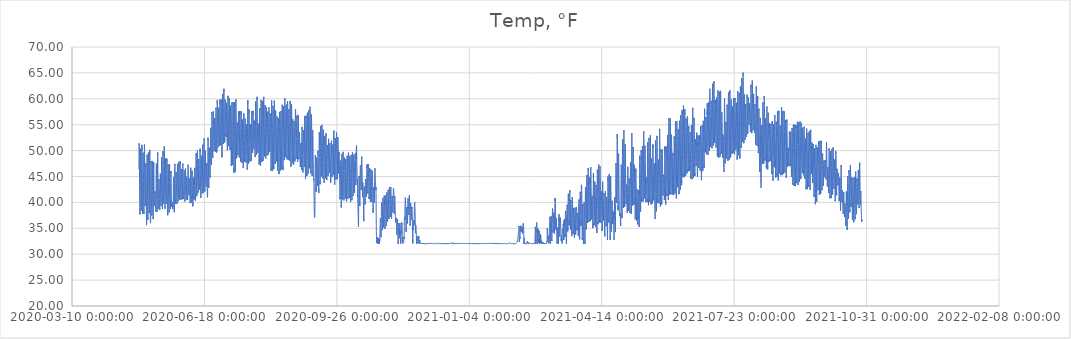
| Category | Temp, °F |
|---|---|
| 43950.578310185185 | 46.377 |
| 43950.619976851856 | 48.52 |
| 43950.66164351852 | 50.161 |
| 43950.703310185185 | 51.165 |
| 43950.744976851856 | 51.397 |
| 43950.78664351852 | 51.069 |
| 43950.828310185185 | 50.354 |
| 43950.869976851856 | 49.37 |
| 43950.91164351852 | 48.115 |
| 43950.953310185185 | 46.513 |
| 43950.994976851856 | 44.91 |
| 43951.03664351852 | 43.482 |
| 43951.078310185185 | 42.13 |
| 43951.119976851856 | 40.875 |
| 43951.16164351852 | 39.814 |
| 43951.203310185185 | 39.003 |
| 43951.244976851856 | 38.346 |
| 43951.28664351852 | 37.941 |
| 43951.328310185185 | 37.709 |
| 43951.369976851856 | 38.192 |
| 43951.41164351852 | 39.003 |
| 43951.453310185185 | 40.509 |
| 43951.494976851856 | 42.574 |
| 43951.53664351852 | 44.601 |
| 43951.578310185185 | 46.918 |
| 43951.619976851856 | 47.883 |
| 43951.66164351852 | 48.906 |
| 43951.703310185185 | 50.045 |
| 43951.744976851856 | 50.354 |
| 43951.78664351852 | 49.852 |
| 43951.828310185185 | 49.003 |
| 43951.869976851856 | 48.096 |
| 43951.91164351852 | 46.918 |
| 43951.953310185185 | 45.431 |
| 43951.994976851856 | 44.234 |
| 43952.03664351852 | 43.192 |
| 43952.078310185185 | 42.111 |
| 43952.119976851856 | 41.088 |
| 43952.16164351852 | 40.277 |
| 43952.203310185185 | 39.505 |
| 43952.244976851856 | 38.906 |
| 43952.28664351852 | 38.424 |
| 43952.328310185185 | 38.385 |
| 43952.369976851856 | 38.752 |
| 43952.41164351852 | 39.717 |
| 43952.453310185185 | 41.281 |
| 43952.494976851856 | 43.134 |
| 43952.53664351852 | 44.331 |
| 43952.578310185185 | 46.59 |
| 43952.619976851856 | 47.787 |
| 43952.66164351852 | 49.061 |
| 43952.703310185185 | 50.451 |
| 43952.744976851856 | 51.107 |
| 43952.78664351852 | 51.088 |
| 43952.828310185185 | 50.103 |
| 43952.869976851856 | 48.327 |
| 43952.91164351852 | 46.686 |
| 43952.953310185185 | 45.18 |
| 43952.994976851856 | 43.848 |
| 43953.03664351852 | 42.632 |
| 43953.078310185185 | 41.397 |
| 43953.119976851856 | 40.335 |
| 43953.16164351852 | 39.466 |
| 43953.203310185185 | 38.752 |
| 43953.244976851856 | 38.134 |
| 43953.28664351852 | 37.806 |
| 43953.328310185185 | 37.825 |
| 43953.369976851856 | 38.038 |
| 43953.41164351852 | 38.926 |
| 43953.453310185185 | 39.987 |
| 43953.494976851856 | 42.227 |
| 43953.53664351852 | 44.37 |
| 43953.578310185185 | 46.339 |
| 43953.619976851856 | 48.482 |
| 43953.66164351852 | 49.601 |
| 43953.703310185185 | 49.601 |
| 43953.744976851856 | 49.331 |
| 43953.78664351852 | 48.752 |
| 43953.828310185185 | 47.613 |
| 43953.869976851856 | 46.609 |
| 43953.91164351852 | 45.277 |
| 43953.953310185185 | 44.022 |
| 43953.994976851856 | 42.787 |
| 43954.03664351852 | 41.628 |
| 43954.078310185185 | 40.721 |
| 43954.119976851856 | 39.929 |
| 43954.16164351852 | 39.312 |
| 43954.203310185185 | 38.636 |
| 43954.244976851856 | 38.115 |
| 43954.28664351852 | 37.787 |
| 43954.328310185185 | 37.767 |
| 43954.369976851856 | 38.153 |
| 43954.41164351852 | 39.003 |
| 43954.453310185185 | 40.373 |
| 43954.494976851856 | 42.458 |
| 43954.53664351852 | 44.968 |
| 43954.578310185185 | 47.15 |
| 43954.619976851856 | 48.945 |
| 43954.66164351852 | 50.451 |
| 43954.703310185185 | 51.165 |
| 43954.744976851856 | 51.242 |
| 43954.78664351852 | 50.702 |
| 43954.828310185185 | 49.775 |
| 43954.869976851856 | 48.366 |
| 43954.91164351852 | 46.744 |
| 43954.953310185185 | 45.296 |
| 43954.994976851856 | 43.984 |
| 43955.03664351852 | 42.787 |
| 43955.078310185185 | 41.763 |
| 43955.119976851856 | 41.068 |
| 43955.16164351852 | 40.431 |
| 43955.203310185185 | 39.91 |
| 43955.244976851856 | 39.563 |
| 43955.28664351852 | 39.312 |
| 43955.328310185185 | 39.177 |
| 43955.369976851856 | 39.428 |
| 43955.41164351852 | 39.698 |
| 43955.453310185185 | 40.026 |
| 43955.494976851856 | 41.3 |
| 43955.53664351852 | 41.899 |
| 43955.578310185185 | 42.729 |
| 43955.619976851856 | 44.041 |
| 43955.66164351852 | 45.76 |
| 43955.703310185185 | 46.879 |
| 43955.744976851856 | 47.516 |
| 43955.78664351852 | 47.536 |
| 43955.828310185185 | 46.879 |
| 43955.869976851856 | 45.933 |
| 43955.91164351852 | 44.814 |
| 43955.953310185185 | 43.346 |
| 43955.994976851856 | 41.879 |
| 43956.03664351852 | 40.586 |
| 43956.078310185185 | 39.389 |
| 43956.119976851856 | 38.404 |
| 43956.16164351852 | 37.555 |
| 43956.203310185185 | 36.763 |
| 43956.244976851856 | 36.126 |
| 43956.28664351852 | 35.624 |
| 43956.328310185185 | 35.663 |
| 43956.369976851856 | 36.068 |
| 43956.41164351852 | 36.937 |
| 43956.453310185185 | 38.443 |
| 43956.494976851856 | 40.393 |
| 43956.53664351852 | 42.632 |
| 43956.578310185185 | 44.736 |
| 43956.619976851856 | 46.57 |
| 43956.66164351852 | 48.018 |
| 43956.703310185185 | 48.868 |
| 43956.744976851856 | 49.196 |
| 43956.78664351852 | 48.771 |
| 43956.828310185185 | 48.038 |
| 43956.869976851856 | 47.014 |
| 43956.91164351852 | 45.721 |
| 43956.953310185185 | 44.254 |
| 43956.994976851856 | 42.806 |
| 43957.03664351852 | 41.512 |
| 43957.078310185185 | 40.373 |
| 43957.119976851856 | 39.312 |
| 43957.16164351852 | 38.443 |
| 43957.203310185185 | 37.651 |
| 43957.244976851856 | 37.092 |
| 43957.28664351852 | 36.628 |
| 43957.328310185185 | 36.648 |
| 43957.369976851856 | 37.014 |
| 43957.41164351852 | 37.941 |
| 43957.453310185185 | 39.543 |
| 43957.494976851856 | 41.319 |
| 43957.53664351852 | 43.559 |
| 43957.578310185185 | 45.837 |
| 43957.619976851856 | 47.748 |
| 43957.66164351852 | 48.945 |
| 43957.703310185185 | 49.621 |
| 43957.744976851856 | 49.756 |
| 43957.78664351852 | 49.601 |
| 43957.828310185185 | 48.868 |
| 43957.869976851856 | 47.69 |
| 43957.91164351852 | 46.493 |
| 43957.953310185185 | 45.18 |
| 43957.994976851856 | 43.733 |
| 43958.03664351852 | 42.4 |
| 43958.078310185185 | 41.184 |
| 43958.119976851856 | 40.2 |
| 43958.16164351852 | 39.408 |
| 43958.203310185185 | 38.81 |
| 43958.244976851856 | 38.346 |
| 43958.28664351852 | 37.98 |
| 43958.328310185185 | 37.999 |
| 43958.369976851856 | 38.404 |
| 43958.41164351852 | 39.234 |
| 43958.453310185185 | 40.644 |
| 43958.494976851856 | 42.536 |
| 43958.53664351852 | 44.717 |
| 43958.578310185185 | 46.744 |
| 43958.619976851856 | 48.404 |
| 43958.66164351852 | 49.273 |
| 43958.703310185185 | 50.123 |
| 43958.744976851856 | 50.18 |
| 43958.78664351852 | 49.254 |
| 43958.828310185185 | 47.227 |
| 43958.869976851856 | 44.621 |
| 43958.91164351852 | 42.111 |
| 43958.953310185185 | 40.335 |
| 43958.994976851856 | 39.061 |
| 43959.03664351852 | 38.173 |
| 43959.078310185185 | 37.478 |
| 43959.119976851856 | 36.995 |
| 43959.16164351852 | 36.609 |
| 43959.203310185185 | 36.3 |
| 43959.244976851856 | 36.01 |
| 43959.28664351852 | 35.875 |
| 43959.328310185185 | 36.049 |
| 43959.369976851856 | 36.319 |
| 43959.41164351852 | 37.304 |
| 43959.453310185185 | 38.771 |
| 43959.494976851856 | 40.644 |
| 43959.53664351852 | 42.651 |
| 43959.578310185185 | 44.794 |
| 43959.619976851856 | 46.532 |
| 43959.66164351852 | 47.787 |
| 43959.703310185185 | 47.98 |
| 43959.744976851856 | 47.69 |
| 43959.78664351852 | 46.744 |
| 43959.828310185185 | 45.354 |
| 43959.869976851856 | 44.08 |
| 43959.91164351852 | 42.709 |
| 43959.953310185185 | 41.57 |
| 43959.994976851856 | 40.509 |
| 43960.03664351852 | 39.736 |
| 43960.078310185185 | 39.234 |
| 43960.119976851856 | 38.713 |
| 43960.16164351852 | 38.404 |
| 43960.203310185185 | 38.076 |
| 43960.244976851856 | 37.729 |
| 43960.28664351852 | 37.478 |
| 43960.328310185185 | 37.516 |
| 43960.369976851856 | 37.787 |
| 43960.41164351852 | 38.52 |
| 43960.453310185185 | 39.949 |
| 43960.494976851856 | 41.706 |
| 43960.53664351852 | 43.617 |
| 43960.578310185185 | 45.586 |
| 43960.619976851856 | 47.092 |
| 43960.66164351852 | 47.999 |
| 43960.703310185185 | 48.038 |
| 43960.744976851856 | 47.806 |
| 43960.78664351852 | 46.918 |
| 43960.828310185185 | 45.47 |
| 43960.869976851856 | 43.984 |
| 43960.91164351852 | 42.227 |
| 43960.953310185185 | 40.605 |
| 43960.994976851856 | 39.543 |
| 43961.03664351852 | 38.713 |
| 43961.078310185185 | 38.115 |
| 43961.119976851856 | 37.767 |
| 43961.16164351852 | 37.478 |
| 43961.203310185185 | 37.227 |
| 43961.244976851856 | 36.995 |
| 43961.28664351852 | 36.783 |
| 43961.328310185185 | 36.937 |
| 43961.369976851856 | 37.304 |
| 43961.41164351852 | 38.192 |
| 43961.453310185185 | 39.678 |
| 43961.494976851856 | 41.3 |
| 43961.53664351852 | 43.134 |
| 43961.578310185185 | 45.103 |
| 43961.619976851856 | 46.532 |
| 43961.66164351852 | 47.246 |
| 43961.703310185185 | 47.767 |
| 43961.744976851856 | 47.478 |
| 43961.78664351852 | 46.59 |
| 43961.828310185185 | 45.624 |
| 43961.869976851856 | 44.505 |
| 43961.91164351852 | 43.346 |
| 43961.953310185185 | 42.227 |
| 43961.994976851856 | 41.223 |
| 43962.03664351852 | 40.624 |
| 43962.078310185185 | 40.161 |
| 43962.119976851856 | 39.852 |
| 43962.16164351852 | 39.621 |
| 43962.203310185185 | 39.485 |
| 43962.244976851856 | 39.312 |
| 43962.28664351852 | 39.254 |
| 43962.328310185185 | 39.292 |
| 43962.369976851856 | 39.485 |
| 43962.41164351852 | 39.698 |
| 43962.453310185185 | 39.775 |
| 43962.494976851856 | 40.373 |
| 43962.53664351852 | 40.567 |
| 43962.578310185185 | 40.991 |
| 43962.619976851856 | 41.435 |
| 43962.66164351852 | 42.13 |
| 43962.703310185185 | 42.111 |
| 43962.744976851856 | 42.014 |
| 43962.78664351852 | 41.976 |
| 43962.828310185185 | 41.706 |
| 43962.869976851856 | 41.03 |
| 43962.91164351852 | 40.489 |
| 43962.953310185185 | 40.026 |
| 43962.994976851856 | 39.756 |
| 43963.03664351852 | 39.37 |
| 43963.078310185185 | 39.196 |
| 43963.119976851856 | 38.964 |
| 43963.16164351852 | 38.81 |
| 43963.203310185185 | 38.597 |
| 43963.244976851856 | 38.443 |
| 43963.28664351852 | 38.269 |
| 43963.328310185185 | 38.597 |
| 43963.369976851856 | 38.81 |
| 43963.41164351852 | 39.794 |
| 43963.453310185185 | 41.512 |
| 43963.494976851856 | 43.269 |
| 43963.53664351852 | 45.258 |
| 43963.578310185185 | 46.57 |
| 43963.619976851856 | 47.072 |
| 43963.66164351852 | 47.478 |
| 43963.703310185185 | 47.652 |
| 43963.744976851856 | 47.285 |
| 43963.78664351852 | 46.86 |
| 43963.828310185185 | 46.3 |
| 43963.869976851856 | 45.123 |
| 43963.91164351852 | 43.636 |
| 43963.953310185185 | 42.381 |
| 43963.994976851856 | 41.242 |
| 43964.03664351852 | 40.296 |
| 43964.078310185185 | 39.64 |
| 43964.119976851856 | 39.08 |
| 43964.16164351852 | 38.713 |
| 43964.203310185185 | 38.385 |
| 43964.244976851856 | 38.173 |
| 43964.28664351852 | 38.038 |
| 43964.328310185185 | 38.173 |
| 43964.369976851856 | 38.52 |
| 43964.41164351852 | 39.428 |
| 43964.453310185185 | 40.779 |
| 43964.494976851856 | 42.69 |
| 43964.53664351852 | 44.485 |
| 43964.578310185185 | 46.358 |
| 43964.619976851856 | 47.941 |
| 43964.66164351852 | 49.312 |
| 43964.703310185185 | 49.64 |
| 43964.744976851856 | 49.119 |
| 43964.78664351852 | 48.327 |
| 43964.828310185185 | 47.207 |
| 43964.869976851856 | 45.586 |
| 43964.91164351852 | 43.964 |
| 43964.953310185185 | 42.536 |
| 43964.994976851856 | 41.512 |
| 43965.03664351852 | 40.76 |
| 43965.078310185185 | 40.142 |
| 43965.119976851856 | 39.659 |
| 43965.16164351852 | 39.273 |
| 43965.203310185185 | 38.926 |
| 43965.244976851856 | 38.733 |
| 43965.28664351852 | 38.675 |
| 43965.328310185185 | 38.829 |
| 43965.369976851856 | 39.157 |
| 43965.41164351852 | 39.659 |
| 43965.453310185185 | 40.528 |
| 43965.494976851856 | 41.551 |
| 43965.53664351852 | 42.381 |
| 43965.578310185185 | 42.748 |
| 43965.619976851856 | 43.655 |
| 43965.66164351852 | 44.292 |
| 43965.703310185185 | 44.485 |
| 43965.744976851856 | 44.234 |
| 43965.78664351852 | 44.041 |
| 43965.828310185185 | 43.752 |
| 43965.869976851856 | 43.443 |
| 43965.91164351852 | 42.922 |
| 43965.953310185185 | 41.956 |
| 43965.994976851856 | 41.242 |
| 43966.03664351852 | 40.528 |
| 43966.078310185185 | 39.987 |
| 43966.119976851856 | 39.505 |
| 43966.16164351852 | 39.177 |
| 43966.203310185185 | 38.79 |
| 43966.244976851856 | 38.52 |
| 43966.28664351852 | 38.346 |
| 43966.328310185185 | 38.52 |
| 43966.369976851856 | 38.79 |
| 43966.41164351852 | 39.428 |
| 43966.453310185185 | 40.509 |
| 43966.494976851856 | 41.648 |
| 43966.53664351852 | 42.651 |
| 43966.578310185185 | 43.153 |
| 43966.619976851856 | 43.694 |
| 43966.66164351852 | 44.698 |
| 43966.703310185185 | 45.528 |
| 43966.744976851856 | 45.47 |
| 43966.78664351852 | 44.968 |
| 43966.828310185185 | 44.234 |
| 43966.869976851856 | 43.308 |
| 43966.91164351852 | 42.497 |
| 43966.953310185185 | 41.725 |
| 43966.994976851856 | 40.972 |
| 43967.03664351852 | 40.373 |
| 43967.078310185185 | 39.987 |
| 43967.119976851856 | 39.775 |
| 43967.16164351852 | 39.505 |
| 43967.203310185185 | 39.428 |
| 43967.244976851856 | 39.331 |
| 43967.28664351852 | 39.312 |
| 43967.328310185185 | 39.524 |
| 43967.369976851856 | 39.929 |
| 43967.41164351852 | 40.702 |
| 43967.453310185185 | 41.976 |
| 43967.494976851856 | 43.655 |
| 43967.53664351852 | 45.354 |
| 43967.578310185185 | 46.686 |
| 43967.619976851856 | 47.613 |
| 43967.66164351852 | 48.424 |
| 43967.703310185185 | 48.733 |
| 43967.744976851856 | 48.54 |
| 43967.78664351852 | 47.767 |
| 43967.828310185185 | 46.648 |
| 43967.869976851856 | 45.412 |
| 43967.91164351852 | 44.041 |
| 43967.953310185185 | 42.69 |
| 43967.994976851856 | 41.59 |
| 43968.03664351852 | 40.682 |
| 43968.078310185185 | 40.026 |
| 43968.119976851856 | 39.543 |
| 43968.16164351852 | 39.273 |
| 43968.203310185185 | 38.964 |
| 43968.244976851856 | 38.733 |
| 43968.28664351852 | 38.559 |
| 43968.328310185185 | 38.597 |
| 43968.369976851856 | 39.003 |
| 43968.41164351852 | 39.949 |
| 43968.453310185185 | 41.416 |
| 43968.494976851856 | 43.038 |
| 43968.53664351852 | 44.775 |
| 43968.578310185185 | 47.169 |
| 43968.619976851856 | 48.482 |
| 43968.66164351852 | 49.37 |
| 43968.703310185185 | 49.872 |
| 43968.744976851856 | 48.945 |
| 43968.78664351852 | 47.922 |
| 43968.828310185185 | 46.918 |
| 43968.869976851856 | 45.74 |
| 43968.91164351852 | 44.621 |
| 43968.953310185185 | 43.559 |
| 43968.994976851856 | 42.497 |
| 43969.03664351852 | 41.706 |
| 43969.078310185185 | 41.107 |
| 43969.119976851856 | 40.624 |
| 43969.16164351852 | 40.219 |
| 43969.203310185185 | 39.949 |
| 43969.244976851856 | 39.717 |
| 43969.28664351852 | 39.563 |
| 43969.328310185185 | 39.601 |
| 43969.369976851856 | 39.949 |
| 43969.41164351852 | 40.837 |
| 43969.453310185185 | 42.092 |
| 43969.494976851856 | 43.752 |
| 43969.53664351852 | 45.277 |
| 43969.578310185185 | 47.072 |
| 43969.619976851856 | 48.675 |
| 43969.66164351852 | 49.968 |
| 43969.703310185185 | 50.856 |
| 43969.744976851856 | 50.682 |
| 43969.78664351852 | 49.968 |
| 43969.828310185185 | 48.675 |
| 43969.869976851856 | 47.053 |
| 43969.91164351852 | 45.161 |
| 43969.953310185185 | 43.482 |
| 43969.994976851856 | 42.227 |
| 43970.03664351852 | 41.3 |
| 43970.078310185185 | 40.489 |
| 43970.119976851856 | 39.987 |
| 43970.16164351852 | 39.466 |
| 43970.203310185185 | 39.08 |
| 43970.244976851856 | 38.771 |
| 43970.28664351852 | 38.617 |
| 43970.328310185185 | 38.675 |
| 43970.369976851856 | 39.08 |
| 43970.41164351852 | 40.122 |
| 43970.453310185185 | 41.648 |
| 43970.494976851856 | 43.269 |
| 43970.53664351852 | 45.335 |
| 43970.578310185185 | 47.574 |
| 43970.619976851856 | 48.501 |
| 43970.66164351852 | 48.578 |
| 43970.703310185185 | 48.501 |
| 43970.744976851856 | 48.346 |
| 43970.78664351852 | 47.343 |
| 43970.828310185185 | 45.875 |
| 43970.869976851856 | 44.524 |
| 43970.91164351852 | 43.366 |
| 43970.953310185185 | 42.42 |
| 43970.994976851856 | 41.667 |
| 43971.03664351852 | 41.242 |
| 43971.078310185185 | 40.895 |
| 43971.119976851856 | 40.644 |
| 43971.16164351852 | 40.412 |
| 43971.203310185185 | 40.2 |
| 43971.244976851856 | 39.987 |
| 43971.28664351852 | 39.775 |
| 43971.328310185185 | 39.756 |
| 43971.369976851856 | 40.122 |
| 43971.41164351852 | 40.991 |
| 43971.453310185185 | 42.207 |
| 43971.494976851856 | 43.771 |
| 43971.53664351852 | 45.412 |
| 43971.578310185185 | 46.57 |
| 43971.619976851856 | 47.922 |
| 43971.66164351852 | 48.443 |
| 43971.703310185185 | 48.269 |
| 43971.744976851856 | 47.902 |
| 43971.78664351852 | 47.072 |
| 43971.828310185185 | 45.624 |
| 43971.869976851856 | 44.061 |
| 43971.91164351852 | 42.613 |
| 43971.953310185185 | 41.339 |
| 43971.994976851856 | 40.258 |
| 43972.03664351852 | 39.466 |
| 43972.078310185185 | 38.868 |
| 43972.119976851856 | 38.462 |
| 43972.16164351852 | 38.095 |
| 43972.203310185185 | 37.748 |
| 43972.244976851856 | 37.516 |
| 43972.28664351852 | 37.343 |
| 43972.328310185185 | 37.362 |
| 43972.369976851856 | 37.806 |
| 43972.41164351852 | 38.752 |
| 43972.453310185185 | 40.026 |
| 43972.494976851856 | 41.706 |
| 43972.53664351852 | 43.52 |
| 43972.578310185185 | 45.18 |
| 43972.619976851856 | 46.59 |
| 43972.66164351852 | 47.304 |
| 43972.703310185185 | 46.879 |
| 43972.744976851856 | 46.648 |
| 43972.78664351852 | 46.126 |
| 43972.828310185185 | 44.987 |
| 43972.869976851856 | 43.79 |
| 43972.91164351852 | 42.516 |
| 43972.953310185185 | 41.416 |
| 43972.994976851856 | 40.605 |
| 43973.03664351852 | 39.929 |
| 43973.078310185185 | 39.447 |
| 43973.119976851856 | 39.041 |
| 43973.16164351852 | 38.752 |
| 43973.203310185185 | 38.482 |
| 43973.244976851856 | 38.25 |
| 43973.28664351852 | 38.057 |
| 43973.328310185185 | 38.115 |
| 43973.369976851856 | 38.482 |
| 43973.41164351852 | 39.408 |
| 43973.453310185185 | 40.721 |
| 43973.494976851856 | 42.381 |
| 43973.53664351852 | 44.119 |
| 43973.578310185185 | 45.567 |
| 43973.619976851856 | 46.744 |
| 43973.66164351852 | 47.401 |
| 43973.703310185185 | 47.362 |
| 43973.744976851856 | 46.783 |
| 43973.78664351852 | 45.74 |
| 43973.828310185185 | 44.621 |
| 43973.869976851856 | 43.462 |
| 43973.91164351852 | 42.42 |
| 43973.953310185185 | 41.628 |
| 43973.994976851856 | 41.049 |
| 43974.03664351852 | 40.567 |
| 43974.078310185185 | 40.084 |
| 43974.119976851856 | 39.698 |
| 43974.16164351852 | 39.312 |
| 43974.203310185185 | 39.003 |
| 43974.244976851856 | 38.733 |
| 43974.28664351852 | 38.597 |
| 43974.328310185185 | 38.597 |
| 43974.369976851856 | 38.983 |
| 43974.41164351852 | 39.833 |
| 43974.453310185185 | 40.972 |
| 43974.494976851856 | 41.821 |
| 43974.53664351852 | 43.829 |
| 43974.578310185185 | 44.736 |
| 43974.619976851856 | 45.123 |
| 43974.66164351852 | 45.219 |
| 43974.703310185185 | 45.663 |
| 43974.744976851856 | 46.03 |
| 43974.78664351852 | 45.624 |
| 43974.828310185185 | 44.833 |
| 43974.869976851856 | 43.771 |
| 43974.91164351852 | 42.709 |
| 43974.953310185185 | 41.783 |
| 43974.994976851856 | 41.068 |
| 43975.03664351852 | 40.509 |
| 43975.078310185185 | 40.065 |
| 43975.119976851856 | 39.678 |
| 43975.16164351852 | 39.389 |
| 43975.203310185185 | 39.157 |
| 43975.244976851856 | 39.08 |
| 43975.28664351852 | 39.119 |
| 43975.328310185185 | 39.119 |
| 43975.369976851856 | 39.234 |
| 43975.41164351852 | 39.505 |
| 43975.453310185185 | 39.524 |
| 43975.494976851856 | 39.814 |
| 43975.53664351852 | 40.065 |
| 43975.578310185185 | 40.122 |
| 43975.619976851856 | 40.007 |
| 43975.66164351852 | 39.852 |
| 43975.703310185185 | 39.736 |
| 43975.744976851856 | 39.621 |
| 43975.78664351852 | 39.563 |
| 43975.828310185185 | 39.447 |
| 43975.869976851856 | 39.37 |
| 43975.91164351852 | 39.312 |
| 43975.953310185185 | 39.157 |
| 43975.994976851856 | 38.964 |
| 43976.03664351852 | 38.713 |
| 43976.078310185185 | 38.559 |
| 43976.119976851856 | 38.539 |
| 43976.16164351852 | 38.539 |
| 43976.203310185185 | 38.578 |
| 43976.244976851856 | 38.597 |
| 43976.28664351852 | 38.559 |
| 43976.328310185185 | 38.636 |
| 43976.369976851856 | 38.887 |
| 43976.41164351852 | 39.794 |
| 43976.453310185185 | 40.837 |
| 43976.494976851856 | 42.207 |
| 43976.53664351852 | 43.54 |
| 43976.578310185185 | 44.061 |
| 43976.619976851856 | 44.292 |
| 43976.66164351852 | 44.234 |
| 43976.703310185185 | 44.872 |
| 43976.744976851856 | 44.563 |
| 43976.78664351852 | 43.675 |
| 43976.828310185185 | 42.787 |
| 43976.869976851856 | 42.053 |
| 43976.91164351852 | 41.242 |
| 43976.953310185185 | 40.431 |
| 43976.994976851856 | 39.794 |
| 43977.03664351852 | 39.35 |
| 43977.078310185185 | 39.022 |
| 43977.119976851856 | 38.752 |
| 43977.16164351852 | 38.539 |
| 43977.203310185185 | 38.327 |
| 43977.244976851856 | 38.192 |
| 43977.28664351852 | 38.115 |
| 43977.328310185185 | 38.288 |
| 43977.369976851856 | 38.752 |
| 43977.41164351852 | 39.601 |
| 43977.453310185185 | 40.933 |
| 43977.494976851856 | 42.787 |
| 43977.53664351852 | 44.35 |
| 43977.578310185185 | 45.856 |
| 43977.619976851856 | 46.86 |
| 43977.66164351852 | 47.439 |
| 43977.703310185185 | 47.207 |
| 43977.744976851856 | 46.899 |
| 43977.78664351852 | 45.779 |
| 43977.828310185185 | 44.582 |
| 43977.869976851856 | 43.482 |
| 43977.91164351852 | 42.748 |
| 43977.953310185185 | 42.15 |
| 43977.994976851856 | 41.609 |
| 43978.03664351852 | 41.184 |
| 43978.078310185185 | 40.875 |
| 43978.119976851856 | 40.586 |
| 43978.16164351852 | 40.296 |
| 43978.203310185185 | 40.007 |
| 43978.244976851856 | 39.756 |
| 43978.28664351852 | 39.64 |
| 43978.328310185185 | 39.775 |
| 43978.369976851856 | 39.968 |
| 43978.41164351852 | 40.721 |
| 43978.453310185185 | 41.86 |
| 43978.494976851856 | 43.578 |
| 43978.53664351852 | 44.582 |
| 43978.578310185185 | 45.547 |
| 43978.619976851856 | 45.818 |
| 43978.66164351852 | 45.509 |
| 43978.703310185185 | 45.238 |
| 43978.744976851856 | 45.007 |
| 43978.78664351852 | 44.679 |
| 43978.828310185185 | 44.022 |
| 43978.869976851856 | 43.115 |
| 43978.91164351852 | 42.4 |
| 43978.953310185185 | 41.899 |
| 43978.994976851856 | 41.493 |
| 43979.03664351852 | 41.126 |
| 43979.078310185185 | 40.817 |
| 43979.119976851856 | 40.528 |
| 43979.16164351852 | 40.277 |
| 43979.203310185185 | 40.007 |
| 43979.244976851856 | 39.756 |
| 43979.28664351852 | 39.64 |
| 43979.328310185185 | 39.698 |
| 43979.369976851856 | 40.084 |
| 43979.41164351852 | 40.895 |
| 43979.453310185185 | 42.15 |
| 43979.494976851856 | 43.713 |
| 43979.53664351852 | 45.431 |
| 43979.578310185185 | 46.841 |
| 43979.619976851856 | 47.439 |
| 43979.66164351852 | 47.439 |
| 43979.703310185185 | 47.594 |
| 43979.744976851856 | 47.246 |
| 43979.78664351852 | 46.86 |
| 43979.828310185185 | 46.107 |
| 43979.869976851856 | 45.18 |
| 43979.91164351852 | 44.138 |
| 43979.953310185185 | 43.385 |
| 43979.994976851856 | 42.613 |
| 43980.03664351852 | 42.092 |
| 43980.078310185185 | 41.628 |
| 43980.119976851856 | 41.281 |
| 43980.16164351852 | 40.914 |
| 43980.203310185185 | 40.586 |
| 43980.244976851856 | 40.431 |
| 43980.28664351852 | 40.219 |
| 43980.328310185185 | 40.296 |
| 43980.369976851856 | 40.509 |
| 43980.41164351852 | 41.281 |
| 43980.453310185185 | 42.4 |
| 43980.494976851856 | 43.385 |
| 43980.53664351852 | 44.659 |
| 43980.578310185185 | 45.644 |
| 43980.619976851856 | 46.976 |
| 43980.66164351852 | 47.825 |
| 43980.703310185185 | 47.748 |
| 43980.744976851856 | 47.285 |
| 43980.78664351852 | 46.551 |
| 43980.828310185185 | 45.567 |
| 43980.869976851856 | 44.794 |
| 43980.91164351852 | 43.906 |
| 43980.953310185185 | 43.211 |
| 43980.994976851856 | 42.497 |
| 43981.03664351852 | 41.918 |
| 43981.078310185185 | 41.512 |
| 43981.119976851856 | 41.223 |
| 43981.16164351852 | 40.991 |
| 43981.203310185185 | 40.779 |
| 43981.244976851856 | 40.586 |
| 43981.28664351852 | 40.412 |
| 43981.328310185185 | 40.431 |
| 43981.369976851856 | 40.663 |
| 43981.41164351852 | 41.3 |
| 43981.453310185185 | 42.381 |
| 43981.494976851856 | 43.926 |
| 43981.53664351852 | 45.528 |
| 43981.578310185185 | 46.416 |
| 43981.619976851856 | 47.072 |
| 43981.66164351852 | 47.941 |
| 43981.703310185185 | 47.304 |
| 43981.744976851856 | 46.088 |
| 43981.78664351852 | 44.968 |
| 43981.828310185185 | 44.08 |
| 43981.869976851856 | 43.559 |
| 43981.91164351852 | 43.038 |
| 43981.953310185185 | 42.497 |
| 43981.994976851856 | 42.092 |
| 43982.03664351852 | 41.706 |
| 43982.078310185185 | 41.474 |
| 43982.119976851856 | 41.242 |
| 43982.16164351852 | 41.03 |
| 43982.203310185185 | 40.798 |
| 43982.244976851856 | 40.682 |
| 43982.28664351852 | 40.509 |
| 43982.328310185185 | 40.547 |
| 43982.369976851856 | 40.837 |
| 43982.41164351852 | 41.416 |
| 43982.453310185185 | 42.458 |
| 43982.494976851856 | 43.559 |
| 43982.53664351852 | 44.659 |
| 43982.578310185185 | 45.624 |
| 43982.619976851856 | 45.818 |
| 43982.66164351852 | 45.933 |
| 43982.703310185185 | 46.455 |
| 43982.744976851856 | 46.262 |
| 43982.78664351852 | 45.798 |
| 43982.828310185185 | 45.547 |
| 43982.869976851856 | 44.987 |
| 43982.91164351852 | 44.292 |
| 43982.953310185185 | 43.52 |
| 43982.994976851856 | 42.864 |
| 43983.03664351852 | 42.246 |
| 43983.078310185185 | 41.821 |
| 43983.119976851856 | 41.397 |
| 43983.16164351852 | 41.088 |
| 43983.203310185185 | 40.875 |
| 43983.244976851856 | 40.624 |
| 43983.28664351852 | 40.547 |
| 43983.328310185185 | 40.509 |
| 43983.369976851856 | 40.74 |
| 43983.41164351852 | 41.242 |
| 43983.453310185185 | 42.304 |
| 43983.494976851856 | 43.578 |
| 43983.53664351852 | 44.814 |
| 43983.578310185185 | 45.528 |
| 43983.619976851856 | 46.493 |
| 43983.66164351852 | 47.246 |
| 43983.703310185185 | 47.478 |
| 43983.744976851856 | 47.207 |
| 43983.78664351852 | 46.377 |
| 43983.828310185185 | 45.412 |
| 43983.869976851856 | 44.466 |
| 43983.91164351852 | 43.771 |
| 43983.953310185185 | 43.115 |
| 43983.994976851856 | 42.536 |
| 43984.03664351852 | 42.053 |
| 43984.078310185185 | 41.725 |
| 43984.119976851856 | 41.416 |
| 43984.16164351852 | 41.184 |
| 43984.203310185185 | 40.895 |
| 43984.244976851856 | 40.721 |
| 43984.28664351852 | 40.644 |
| 43984.328310185185 | 40.74 |
| 43984.369976851856 | 41.011 |
| 43984.41164351852 | 41.435 |
| 43984.453310185185 | 42.227 |
| 43984.494976851856 | 43.038 |
| 43984.53664351852 | 43.868 |
| 43984.578310185185 | 44.872 |
| 43984.619976851856 | 45.779 |
| 43984.66164351852 | 46.223 |
| 43984.703310185185 | 46.281 |
| 43984.744976851856 | 46.011 |
| 43984.78664351852 | 45.412 |
| 43984.828310185185 | 44.679 |
| 43984.869976851856 | 43.984 |
| 43984.91164351852 | 43.269 |
| 43984.953310185185 | 42.671 |
| 43984.994976851856 | 42.111 |
| 43985.03664351852 | 41.57 |
| 43985.078310185185 | 41.146 |
| 43985.119976851856 | 40.875 |
| 43985.16164351852 | 40.644 |
| 43985.203310185185 | 40.393 |
| 43985.244976851856 | 40.18 |
| 43985.28664351852 | 40.103 |
| 43985.328310185185 | 40.142 |
| 43985.369976851856 | 40.431 |
| 43985.41164351852 | 40.991 |
| 43985.453310185185 | 42.092 |
| 43985.494976851856 | 43.346 |
| 43985.53664351852 | 44.389 |
| 43985.578310185185 | 45.2 |
| 43985.619976851856 | 45.779 |
| 43985.66164351852 | 46.184 |
| 43985.703310185185 | 46.551 |
| 43985.744976851856 | 46.493 |
| 43985.78664351852 | 46.223 |
| 43985.828310185185 | 45.412 |
| 43985.869976851856 | 44.447 |
| 43985.91164351852 | 43.578 |
| 43985.953310185185 | 42.864 |
| 43985.994976851856 | 42.362 |
| 43986.03664351852 | 41.956 |
| 43986.078310185185 | 41.57 |
| 43986.119976851856 | 41.242 |
| 43986.16164351852 | 40.953 |
| 43986.203310185185 | 40.76 |
| 43986.244976851856 | 40.547 |
| 43986.28664351852 | 40.509 |
| 43986.328310185185 | 40.567 |
| 43986.369976851856 | 40.779 |
| 43986.41164351852 | 41.3 |
| 43986.453310185185 | 42.188 |
| 43986.494976851856 | 42.96 |
| 43986.53664351852 | 44.138 |
| 43986.578310185185 | 44.968 |
| 43986.619976851856 | 44.949 |
| 43986.66164351852 | 44.852 |
| 43986.703310185185 | 44.775 |
| 43986.744976851856 | 44.852 |
| 43986.78664351852 | 44.794 |
| 43986.828310185185 | 44.428 |
| 43986.869976851856 | 43.771 |
| 43986.91164351852 | 43.173 |
| 43986.953310185185 | 42.497 |
| 43986.994976851856 | 41.976 |
| 43987.03664351852 | 41.686 |
| 43987.078310185185 | 41.377 |
| 43987.119976851856 | 41.088 |
| 43987.16164351852 | 40.972 |
| 43987.203310185185 | 40.74 |
| 43987.244976851856 | 40.624 |
| 43987.28664351852 | 40.489 |
| 43987.328310185185 | 40.528 |
| 43987.369976851856 | 40.76 |
| 43987.41164351852 | 41.416 |
| 43987.453310185185 | 42.362 |
| 43987.494976851856 | 43.385 |
| 43987.53664351852 | 44.736 |
| 43987.578310185185 | 45.953 |
| 43987.619976851856 | 46.609 |
| 43987.66164351852 | 47.265 |
| 43987.703310185185 | 47.265 |
| 43987.744976851856 | 46.918 |
| 43987.78664351852 | 46.339 |
| 43987.828310185185 | 45.682 |
| 43987.869976851856 | 44.794 |
| 43987.91164351852 | 44.157 |
| 43987.953310185185 | 43.655 |
| 43987.994976851856 | 43.192 |
| 43988.03664351852 | 42.787 |
| 43988.078310185185 | 42.439 |
| 43988.119976851856 | 42.188 |
| 43988.16164351852 | 42.014 |
| 43988.203310185185 | 41.783 |
| 43988.244976851856 | 41.57 |
| 43988.28664351852 | 41.435 |
| 43988.328310185185 | 41.377 |
| 43988.369976851856 | 41.455 |
| 43988.41164351852 | 41.706 |
| 43988.453310185185 | 42.227 |
| 43988.494976851856 | 42.845 |
| 43988.53664351852 | 43.269 |
| 43988.578310185185 | 44.061 |
| 43988.619976851856 | 44.485 |
| 43988.66164351852 | 44.64 |
| 43988.703310185185 | 44.679 |
| 43988.744976851856 | 44.582 |
| 43988.78664351852 | 44.292 |
| 43988.828310185185 | 43.984 |
| 43988.869976851856 | 43.501 |
| 43988.91164351852 | 42.922 |
| 43988.953310185185 | 42.227 |
| 43988.994976851856 | 41.706 |
| 43989.03664351852 | 41.281 |
| 43989.078310185185 | 40.875 |
| 43989.119976851856 | 40.605 |
| 43989.16164351852 | 40.373 |
| 43989.203310185185 | 40.18 |
| 43989.244976851856 | 39.852 |
| 43989.28664351852 | 39.717 |
| 43989.328310185185 | 39.717 |
| 43989.369976851856 | 39.949 |
| 43989.41164351852 | 40.547 |
| 43989.453310185185 | 41.551 |
| 43989.494976851856 | 42.902 |
| 43989.53664351852 | 44.35 |
| 43989.578310185185 | 45.547 |
| 43989.619976851856 | 46.435 |
| 43989.66164351852 | 46.686 |
| 43989.703310185185 | 46.744 |
| 43989.744976851856 | 46.493 |
| 43989.78664351852 | 46.088 |
| 43989.828310185185 | 45.335 |
| 43989.869976851856 | 44.389 |
| 43989.91164351852 | 43.752 |
| 43989.953310185185 | 43.115 |
| 43989.994976851856 | 42.536 |
| 43990.03664351852 | 41.956 |
| 43990.078310185185 | 41.532 |
| 43990.119976851856 | 41.126 |
| 43990.16164351852 | 40.779 |
| 43990.203310185185 | 40.47 |
| 43990.244976851856 | 40.18 |
| 43990.28664351852 | 39.987 |
| 43990.328310185185 | 39.949 |
| 43990.369976851856 | 40.142 |
| 43990.41164351852 | 40.779 |
| 43990.453310185185 | 41.686 |
| 43990.494976851856 | 42.902 |
| 43990.53664351852 | 44.312 |
| 43990.578310185185 | 45.509 |
| 43990.619976851856 | 46.126 |
| 43990.66164351852 | 46.03 |
| 43990.703310185185 | 45.972 |
| 43990.744976851856 | 45.393 |
| 43990.78664351852 | 44.698 |
| 43990.828310185185 | 44.022 |
| 43990.869976851856 | 43.308 |
| 43990.91164351852 | 42.632 |
| 43990.953310185185 | 41.899 |
| 43990.994976851856 | 41.242 |
| 43991.03664351852 | 40.528 |
| 43991.078310185185 | 40.026 |
| 43991.119976851856 | 39.756 |
| 43991.16164351852 | 39.563 |
| 43991.203310185185 | 39.254 |
| 43991.244976851856 | 39.138 |
| 43991.28664351852 | 39.08 |
| 43991.328310185185 | 39.08 |
| 43991.369976851856 | 39.196 |
| 43991.41164351852 | 39.389 |
| 43991.453310185185 | 39.872 |
| 43991.494976851856 | 40.393 |
| 43991.53664351852 | 41.049 |
| 43991.578310185185 | 41.937 |
| 43991.619976851856 | 42.845 |
| 43991.66164351852 | 44.003 |
| 43991.703310185185 | 44.814 |
| 43991.744976851856 | 44.254 |
| 43991.78664351852 | 43.733 |
| 43991.828310185185 | 43.134 |
| 43991.869976851856 | 42.285 |
| 43991.91164351852 | 41.763 |
| 43991.953310185185 | 41.377 |
| 43991.994976851856 | 41.068 |
| 43992.03664351852 | 40.895 |
| 43992.078310185185 | 40.779 |
| 43992.119976851856 | 40.663 |
| 43992.16164351852 | 40.644 |
| 43992.203310185185 | 40.567 |
| 43992.244976851856 | 40.451 |
| 43992.28664351852 | 40.431 |
| 43992.328310185185 | 40.528 |
| 43992.369976851856 | 40.74 |
| 43992.41164351852 | 41.339 |
| 43992.453310185185 | 42.014 |
| 43992.494976851856 | 43.289 |
| 43992.53664351852 | 44.621 |
| 43992.578310185185 | 45.682 |
| 43992.619976851856 | 46.281 |
| 43992.66164351852 | 46.319 |
| 43992.703310185185 | 46.667 |
| 43992.744976851856 | 46.011 |
| 43992.78664351852 | 45.412 |
| 43992.828310185185 | 45.277 |
| 43992.869976851856 | 44.543 |
| 43992.91164351852 | 43.675 |
| 43992.953310185185 | 42.922 |
| 43992.994976851856 | 42.285 |
| 43993.03664351852 | 41.783 |
| 43993.078310185185 | 41.397 |
| 43993.119976851856 | 41.126 |
| 43993.16164351852 | 40.856 |
| 43993.203310185185 | 40.624 |
| 43993.244976851856 | 40.354 |
| 43993.28664351852 | 40.219 |
| 43993.328310185185 | 40.258 |
| 43993.369976851856 | 40.509 |
| 43993.41164351852 | 41.223 |
| 43993.453310185185 | 42.343 |
| 43993.494976851856 | 43.733 |
| 43993.53664351852 | 45.296 |
| 43993.578310185185 | 46.744 |
| 43993.619976851856 | 47.864 |
| 43993.66164351852 | 48.559 |
| 43993.703310185185 | 49.196 |
| 43993.744976851856 | 49.485 |
| 43993.78664351852 | 49.061 |
| 43993.828310185185 | 48.211 |
| 43993.869976851856 | 47.111 |
| 43993.91164351852 | 46.011 |
| 43993.953310185185 | 44.929 |
| 43993.994976851856 | 44.041 |
| 43994.03664351852 | 43.289 |
| 43994.078310185185 | 42.651 |
| 43994.119976851856 | 42.188 |
| 43994.16164351852 | 41.86 |
| 43994.203310185185 | 41.512 |
| 43994.244976851856 | 41.242 |
| 43994.28664351852 | 41.126 |
| 43994.328310185185 | 41.146 |
| 43994.369976851856 | 41.416 |
| 43994.41164351852 | 42.169 |
| 43994.453310185185 | 43.25 |
| 43994.494976851856 | 44.698 |
| 43994.53664351852 | 46.319 |
| 43994.578310185185 | 47.999 |
| 43994.619976851856 | 49.235 |
| 43994.66164351852 | 49.64 |
| 43994.703310185185 | 50.007 |
| 43994.744976851856 | 50.18 |
| 43994.78664351852 | 49.447 |
| 43994.828310185185 | 48.54 |
| 43994.869976851856 | 47.343 |
| 43994.91164351852 | 46.107 |
| 43994.953310185185 | 45.316 |
| 43994.994976851856 | 44.466 |
| 43995.03664351852 | 43.829 |
| 43995.078310185185 | 43.385 |
| 43995.119976851856 | 43.018 |
| 43995.16164351852 | 42.748 |
| 43995.203310185185 | 42.381 |
| 43995.244976851856 | 42.13 |
| 43995.28664351852 | 41.918 |
| 43995.328310185185 | 41.937 |
| 43995.369976851856 | 42.169 |
| 43995.41164351852 | 42.594 |
| 43995.453310185185 | 43.597 |
| 43995.494976851856 | 44.447 |
| 43995.53664351852 | 45.451 |
| 43995.578310185185 | 46.821 |
| 43995.619976851856 | 47.343 |
| 43995.66164351852 | 47.941 |
| 43995.703310185185 | 48.366 |
| 43995.744976851856 | 48.173 |
| 43995.78664351852 | 47.632 |
| 43995.828310185185 | 47.034 |
| 43995.869976851856 | 46.493 |
| 43995.91164351852 | 45.779 |
| 43995.953310185185 | 45.219 |
| 43995.994976851856 | 44.717 |
| 43996.03664351852 | 44.234 |
| 43996.078310185185 | 43.829 |
| 43996.119976851856 | 43.501 |
| 43996.16164351852 | 43.211 |
| 43996.203310185185 | 42.825 |
| 43996.244976851856 | 42.497 |
| 43996.28664351852 | 42.381 |
| 43996.328310185185 | 42.4 |
| 43996.369976851856 | 42.574 |
| 43996.41164351852 | 43.076 |
| 43996.453310185185 | 43.79 |
| 43996.494976851856 | 44.679 |
| 43996.53664351852 | 45.875 |
| 43996.578310185185 | 46.918 |
| 43996.619976851856 | 48.501 |
| 43996.66164351852 | 49.601 |
| 43996.703310185185 | 50.354 |
| 43996.744976851856 | 50.354 |
| 43996.78664351852 | 49.659 |
| 43996.828310185185 | 48.655 |
| 43996.869976851856 | 47.671 |
| 43996.91164351852 | 46.435 |
| 43996.953310185185 | 45.277 |
| 43996.994976851856 | 44.312 |
| 43997.03664351852 | 43.54 |
| 43997.078310185185 | 42.864 |
| 43997.119976851856 | 42.343 |
| 43997.16164351852 | 41.841 |
| 43997.203310185185 | 41.455 |
| 43997.244976851856 | 41.088 |
| 43997.28664351852 | 40.875 |
| 43997.328310185185 | 40.817 |
| 43997.369976851856 | 41.126 |
| 43997.41164351852 | 41.686 |
| 43997.453310185185 | 42.536 |
| 43997.494976851856 | 43.462 |
| 43997.53664351852 | 44.292 |
| 43997.578310185185 | 45.18 |
| 43997.619976851856 | 46.184 |
| 43997.66164351852 | 47.188 |
| 43997.703310185185 | 48.231 |
| 43997.744976851856 | 49.003 |
| 43997.78664351852 | 49.099 |
| 43997.828310185185 | 48.694 |
| 43997.869976851856 | 47.96 |
| 43997.91164351852 | 46.918 |
| 43997.953310185185 | 45.895 |
| 43997.994976851856 | 44.91 |
| 43998.03664351852 | 44.138 |
| 43998.078310185185 | 43.52 |
| 43998.119976851856 | 42.999 |
| 43998.16164351852 | 42.613 |
| 43998.203310185185 | 42.265 |
| 43998.244976851856 | 41.918 |
| 43998.28664351852 | 41.706 |
| 43998.328310185185 | 41.725 |
| 43998.369976851856 | 41.956 |
| 43998.41164351852 | 42.69 |
| 43998.453310185185 | 43.346 |
| 43998.494976851856 | 44.37 |
| 43998.53664351852 | 45.451 |
| 43998.578310185185 | 47.343 |
| 43998.619976851856 | 48.848 |
| 43998.66164351852 | 50.123 |
| 43998.703310185185 | 50.779 |
| 43998.744976851856 | 51.146 |
| 43998.78664351852 | 50.76 |
| 43998.828310185185 | 50.277 |
| 43998.869976851856 | 49.273 |
| 43998.91164351852 | 48.173 |
| 43998.953310185185 | 46.937 |
| 43998.994976851856 | 45.837 |
| 43999.03664351852 | 44.91 |
| 43999.078310185185 | 44.157 |
| 43999.119976851856 | 43.52 |
| 43999.16164351852 | 42.98 |
| 43999.203310185185 | 42.555 |
| 43999.244976851856 | 42.111 |
| 43999.28664351852 | 41.841 |
| 43999.328310185185 | 41.841 |
| 43999.369976851856 | 42.13 |
| 43999.41164351852 | 42.825 |
| 43999.453310185185 | 43.984 |
| 43999.494976851856 | 45.431 |
| 43999.53664351852 | 47.072 |
| 43999.578310185185 | 48.848 |
| 43999.619976851856 | 50.431 |
| 43999.66164351852 | 51.667 |
| 43999.703310185185 | 52.343 |
| 43999.744976851856 | 52.478 |
| 43999.78664351852 | 52.072 |
| 43999.828310185185 | 51.262 |
| 43999.869976851856 | 50.161 |
| 43999.91164351852 | 48.906 |
| 43999.953310185185 | 47.613 |
| 43999.994976851856 | 46.532 |
| 44000.03664351852 | 45.547 |
| 44000.078310185185 | 44.736 |
| 44000.119976851856 | 44.08 |
| 44000.16164351852 | 43.482 |
| 44000.203310185185 | 42.922 |
| 44000.244976851856 | 42.439 |
| 44000.28664351852 | 42.111 |
| 44000.328310185185 | 41.956 |
| 44000.369976851856 | 42.15 |
| 44000.41164351852 | 42.69 |
| 44000.453310185185 | 43.79 |
| 44000.494976851856 | 45.238 |
| 44000.53664351852 | 46.86 |
| 44000.578310185185 | 48.134 |
| 44000.619976851856 | 48.906 |
| 44000.66164351852 | 49.582 |
| 44000.703310185185 | 50.007 |
| 44000.744976851856 | 49.447 |
| 44000.78664351852 | 49.003 |
| 44000.828310185185 | 48.231 |
| 44000.869976851856 | 47.265 |
| 44000.91164351852 | 46.397 |
| 44000.953310185185 | 45.586 |
| 44000.994976851856 | 45.026 |
| 44001.03664351852 | 44.543 |
| 44001.078310185185 | 44.177 |
| 44001.119976851856 | 43.752 |
| 44001.16164351852 | 43.501 |
| 44001.203310185185 | 43.25 |
| 44001.244976851856 | 43.038 |
| 44001.28664351852 | 42.922 |
| 44001.328310185185 | 42.902 |
| 44001.369976851856 | 42.941 |
| 44001.41164351852 | 43.231 |
| 44001.453310185185 | 43.694 |
| 44001.494976851856 | 44.601 |
| 44001.53664351852 | 45.489 |
| 44001.578310185185 | 46.397 |
| 44001.619976851856 | 46.223 |
| 44001.66164351852 | 46.513 |
| 44001.703310185185 | 47.362 |
| 44001.744976851856 | 47.594 |
| 44001.78664351852 | 47.574 |
| 44001.828310185185 | 47.15 |
| 44001.869976851856 | 46.513 |
| 44001.91164351852 | 45.895 |
| 44001.953310185185 | 45.123 |
| 44001.994976851856 | 44.447 |
| 44002.03664351852 | 43.771 |
| 44002.078310185185 | 43.134 |
| 44002.119976851856 | 42.574 |
| 44002.16164351852 | 42.072 |
| 44002.203310185185 | 41.667 |
| 44002.244976851856 | 41.3 |
| 44002.28664351852 | 40.991 |
| 44002.328310185185 | 40.933 |
| 44002.369976851856 | 41.165 |
| 44002.41164351852 | 41.879 |
| 44002.453310185185 | 43.115 |
| 44002.494976851856 | 44.717 |
| 44002.53664351852 | 46.435 |
| 44002.578310185185 | 48.25 |
| 44002.619976851856 | 50.103 |
| 44002.66164351852 | 51.455 |
| 44002.703310185185 | 52.497 |
| 44002.744976851856 | 52.574 |
| 44002.78664351852 | 52.401 |
| 44002.828310185185 | 51.841 |
| 44002.869976851856 | 50.953 |
| 44002.91164351852 | 49.852 |
| 44002.953310185185 | 48.675 |
| 44002.994976851856 | 47.516 |
| 44003.03664351852 | 46.493 |
| 44003.078310185185 | 45.624 |
| 44003.119976851856 | 44.872 |
| 44003.16164351852 | 44.254 |
| 44003.203310185185 | 43.655 |
| 44003.244976851856 | 43.153 |
| 44003.28664351852 | 42.806 |
| 44003.328310185185 | 42.806 |
| 44003.369976851856 | 43.115 |
| 44003.41164351852 | 43.733 |
| 44003.453310185185 | 44.929 |
| 44003.494976851856 | 46.416 |
| 44003.53664351852 | 47.594 |
| 44003.578310185185 | 48.308 |
| 44003.619976851856 | 49.485 |
| 44003.66164351852 | 49.987 |
| 44003.703310185185 | 50.547 |
| 44003.744976851856 | 50.721 |
| 44003.78664351852 | 50.567 |
| 44003.828310185185 | 50.547 |
| 44003.869976851856 | 50.123 |
| 44003.91164351852 | 49.485 |
| 44003.953310185185 | 48.906 |
| 44003.994976851856 | 48.231 |
| 44004.03664351852 | 47.497 |
| 44004.078310185185 | 46.821 |
| 44004.119976851856 | 46.281 |
| 44004.16164351852 | 45.76 |
| 44004.203310185185 | 45.335 |
| 44004.244976851856 | 45.065 |
| 44004.28664351852 | 44.814 |
| 44004.328310185185 | 44.91 |
| 44004.369976851856 | 45.123 |
| 44004.41164351852 | 45.914 |
| 44004.453310185185 | 47.169 |
| 44004.494976851856 | 48.81 |
| 44004.53664351852 | 50.084 |
| 44004.578310185185 | 51.088 |
| 44004.619976851856 | 52.343 |
| 44004.66164351852 | 52.941 |
| 44004.703310185185 | 53.906 |
| 44004.744976851856 | 54.138 |
| 44004.78664351852 | 54.389 |
| 44004.828310185185 | 54.312 |
| 44004.869976851856 | 53.404 |
| 44004.91164351852 | 52.362 |
| 44004.953310185185 | 51.319 |
| 44004.994976851856 | 50.431 |
| 44005.03664351852 | 49.582 |
| 44005.078310185185 | 48.848 |
| 44005.119976851856 | 48.404 |
| 44005.16164351852 | 48.038 |
| 44005.203310185185 | 47.632 |
| 44005.244976851856 | 47.265 |
| 44005.28664351852 | 47.092 |
| 44005.328310185185 | 47.169 |
| 44005.369976851856 | 47.478 |
| 44005.41164351852 | 48.327 |
| 44005.453310185185 | 49.582 |
| 44005.494976851856 | 51.107 |
| 44005.53664351852 | 53.018 |
| 44005.578310185185 | 54.814 |
| 44005.619976851856 | 56.435 |
| 44005.66164351852 | 57.439 |
| 44005.703310185185 | 57.169 |
| 44005.744976851856 | 56.609 |
| 44005.78664351852 | 56.011 |
| 44005.828310185185 | 55.702 |
| 44005.869976851856 | 55.123 |
| 44005.91164351852 | 54.196 |
| 44005.953310185185 | 53.289 |
| 44005.994976851856 | 52.381 |
| 44006.03664351852 | 51.551 |
| 44006.078310185185 | 50.856 |
| 44006.119976851856 | 50.296 |
| 44006.16164351852 | 49.717 |
| 44006.203310185185 | 49.273 |
| 44006.244976851856 | 48.868 |
| 44006.28664351852 | 48.655 |
| 44006.328310185185 | 48.694 |
| 44006.369976851856 | 48.945 |
| 44006.41164351852 | 49.698 |
| 44006.453310185185 | 50.914 |
| 44006.494976851856 | 52.478 |
| 44006.53664351852 | 53.984 |
| 44006.578310185185 | 55.528 |
| 44006.619976851856 | 56.937 |
| 44006.66164351852 | 57.555 |
| 44006.703310185185 | 57.227 |
| 44006.744976851856 | 57.15 |
| 44006.78664351852 | 56.86 |
| 44006.828310185185 | 56.59 |
| 44006.869976851856 | 56.107 |
| 44006.91164351852 | 55.625 |
| 44006.953310185185 | 54.833 |
| 44006.994976851856 | 53.926 |
| 44007.03664351852 | 52.864 |
| 44007.078310185185 | 52.111 |
| 44007.119976851856 | 51.455 |
| 44007.16164351852 | 50.856 |
| 44007.203310185185 | 50.489 |
| 44007.244976851856 | 50.161 |
| 44007.28664351852 | 49.91 |
| 44007.328310185185 | 49.93 |
| 44007.369976851856 | 50.18 |
| 44007.41164351852 | 50.856 |
| 44007.453310185185 | 51.802 |
| 44007.494976851856 | 52.845 |
| 44007.53664351852 | 54.022 |
| 44007.578310185185 | 54.524 |
| 44007.619976851856 | 54.987 |
| 44007.66164351852 | 55.586 |
| 44007.703310185185 | 56.223 |
| 44007.744976851856 | 56.242 |
| 44007.78664351852 | 55.895 |
| 44007.828310185185 | 55.296 |
| 44007.869976851856 | 54.543 |
| 44007.91164351852 | 53.945 |
| 44007.953310185185 | 53.211 |
| 44007.994976851856 | 52.478 |
| 44008.03664351852 | 51.918 |
| 44008.078310185185 | 51.397 |
| 44008.119976851856 | 50.895 |
| 44008.16164351852 | 50.354 |
| 44008.203310185185 | 50.045 |
| 44008.244976851856 | 49.775 |
| 44008.28664351852 | 49.659 |
| 44008.328310185185 | 49.601 |
| 44008.369976851856 | 49.872 |
| 44008.41164351852 | 50.644 |
| 44008.453310185185 | 51.879 |
| 44008.494976851856 | 53.54 |
| 44008.53664351852 | 54.93 |
| 44008.578310185185 | 56.262 |
| 44008.619976851856 | 57.072 |
| 44008.66164351852 | 57.574 |
| 44008.703310185185 | 58.076 |
| 44008.744976851856 | 58.269 |
| 44008.78664351852 | 58.018 |
| 44008.828310185185 | 57.536 |
| 44008.869976851856 | 56.532 |
| 44008.91164351852 | 55.374 |
| 44008.953310185185 | 54.37 |
| 44008.994976851856 | 53.482 |
| 44009.03664351852 | 52.825 |
| 44009.078310185185 | 52.092 |
| 44009.119976851856 | 51.377 |
| 44009.16164351852 | 50.76 |
| 44009.203310185185 | 50.335 |
| 44009.244976851856 | 49.949 |
| 44009.28664351852 | 49.64 |
| 44009.328310185185 | 49.563 |
| 44009.369976851856 | 49.775 |
| 44009.41164351852 | 50.625 |
| 44009.453310185185 | 51.937 |
| 44009.494976851856 | 53.424 |
| 44009.53664351852 | 55.123 |
| 44009.578310185185 | 56.474 |
| 44009.619976851856 | 58.076 |
| 44009.66164351852 | 59.486 |
| 44009.703310185185 | 59.775 |
| 44009.744976851856 | 59.601 |
| 44009.78664351852 | 58.906 |
| 44009.828310185185 | 57.883 |
| 44009.869976851856 | 56.764 |
| 44009.91164351852 | 55.567 |
| 44009.953310185185 | 54.408 |
| 44009.994976851856 | 53.347 |
| 44010.03664351852 | 52.497 |
| 44010.078310185185 | 51.879 |
| 44010.119976851856 | 51.474 |
| 44010.16164351852 | 51.184 |
| 44010.203310185185 | 50.914 |
| 44010.244976851856 | 50.605 |
| 44010.28664351852 | 50.528 |
| 44010.328310185185 | 50.586 |
| 44010.369976851856 | 50.875 |
| 44010.41164351852 | 51.416 |
| 44010.453310185185 | 51.937 |
| 44010.494976851856 | 52.864 |
| 44010.53664351852 | 53.848 |
| 44010.578310185185 | 54.833 |
| 44010.619976851856 | 55.451 |
| 44010.66164351852 | 56.435 |
| 44010.703310185185 | 57.188 |
| 44010.744976851856 | 57.98 |
| 44010.78664351852 | 58.269 |
| 44010.828310185185 | 58.308 |
| 44010.869976851856 | 57.748 |
| 44010.91164351852 | 56.725 |
| 44010.953310185185 | 55.605 |
| 44010.994976851856 | 54.621 |
| 44011.03664351852 | 53.752 |
| 44011.078310185185 | 53.115 |
| 44011.119976851856 | 52.574 |
| 44011.16164351852 | 52.072 |
| 44011.203310185185 | 51.609 |
| 44011.244976851856 | 51.184 |
| 44011.28664351852 | 50.953 |
| 44011.328310185185 | 50.837 |
| 44011.369976851856 | 50.972 |
| 44011.41164351852 | 51.551 |
| 44011.453310185185 | 52.613 |
| 44011.494976851856 | 53.752 |
| 44011.53664351852 | 55.393 |
| 44011.578310185185 | 56.995 |
| 44011.619976851856 | 58.54 |
| 44011.66164351852 | 59.466 |
| 44011.703310185185 | 59.872 |
| 44011.744976851856 | 59.698 |
| 44011.78664351852 | 59.061 |
| 44011.828310185185 | 58.173 |
| 44011.869976851856 | 57.227 |
| 44011.91164351852 | 56.493 |
| 44011.953310185185 | 55.779 |
| 44011.994976851856 | 54.968 |
| 44012.03664351852 | 54.196 |
| 44012.078310185185 | 53.482 |
| 44012.119976851856 | 53.038 |
| 44012.16164351852 | 52.516 |
| 44012.203310185185 | 52.072 |
| 44012.244976851856 | 51.744 |
| 44012.28664351852 | 51.416 |
| 44012.328310185185 | 51.223 |
| 44012.369976851856 | 51.011 |
| 44012.41164351852 | 51.532 |
| 44012.453310185185 | 52.497 |
| 44012.494976851856 | 53.655 |
| 44012.53664351852 | 55.142 |
| 44012.578310185185 | 56.184 |
| 44012.619976851856 | 57.613 |
| 44012.66164351852 | 58.617 |
| 44012.703310185185 | 59.64 |
| 44012.744976851856 | 59.833 |
| 44012.78664351852 | 59.35 |
| 44012.828310185185 | 58.424 |
| 44012.869976851856 | 57.246 |
| 44012.91164351852 | 55.779 |
| 44012.953310185185 | 54.35 |
| 44012.994976851856 | 52.96 |
| 44013.03664351852 | 51.725 |
| 44013.078310185185 | 50.779 |
| 44013.119976851856 | 50.007 |
| 44013.16164351852 | 49.447 |
| 44013.203310185185 | 49.041 |
| 44013.244976851856 | 48.713 |
| 44013.28664351852 | 48.578 |
| 44013.328310185185 | 48.559 |
| 44013.369976851856 | 48.829 |
| 44013.41164351852 | 49.679 |
| 44013.453310185185 | 50.953 |
| 44013.494976851856 | 52.671 |
| 44013.53664351852 | 54.64 |
| 44013.578310185185 | 56.609 |
| 44013.619976851856 | 58.443 |
| 44013.66164351852 | 59.891 |
| 44013.703310185185 | 60.702 |
| 44013.744976851856 | 60.933 |
| 44013.78664351852 | 60.586 |
| 44013.828310185185 | 59.968 |
| 44013.869976851856 | 59.138 |
| 44013.91164351852 | 58.018 |
| 44013.953310185185 | 56.706 |
| 44013.994976851856 | 55.412 |
| 44014.03664351852 | 54.582 |
| 44014.078310185185 | 53.926 |
| 44014.119976851856 | 53.211 |
| 44014.16164351852 | 52.613 |
| 44014.203310185185 | 52.034 |
| 44014.244976851856 | 51.667 |
| 44014.28664351852 | 51.281 |
| 44014.328310185185 | 51.107 |
| 44014.369976851856 | 51.262 |
| 44014.41164351852 | 51.918 |
| 44014.453310185185 | 53.115 |
| 44014.494976851856 | 54.794 |
| 44014.53664351852 | 56.628 |
| 44014.578310185185 | 58.598 |
| 44014.619976851856 | 60.374 |
| 44014.66164351852 | 61.686 |
| 44014.703310185185 | 61.937 |
| 44014.744976851856 | 61.242 |
| 44014.78664351852 | 60.026 |
| 44014.828310185185 | 59.35 |
| 44014.869976851856 | 58.559 |
| 44014.91164351852 | 57.845 |
| 44014.953310185185 | 56.648 |
| 44014.994976851856 | 55.605 |
| 44015.03664351852 | 54.679 |
| 44015.078310185185 | 53.906 |
| 44015.119976851856 | 53.269 |
| 44015.16164351852 | 52.748 |
| 44015.203310185185 | 52.265 |
| 44015.244976851856 | 51.841 |
| 44015.28664351852 | 51.57 |
| 44015.328310185185 | 51.474 |
| 44015.369976851856 | 51.706 |
| 44015.41164351852 | 52.362 |
| 44015.453310185185 | 53.578 |
| 44015.494976851856 | 55.238 |
| 44015.53664351852 | 57.072 |
| 44015.578310185185 | 59.157 |
| 44015.619976851856 | 59.852 |
| 44015.66164351852 | 59.852 |
| 44015.703310185185 | 60.007 |
| 44015.744976851856 | 59.37 |
| 44015.78664351852 | 59.003 |
| 44015.828310185185 | 58.598 |
| 44015.869976851856 | 57.999 |
| 44015.91164351852 | 57.536 |
| 44015.953310185185 | 56.957 |
| 44015.994976851856 | 56.416 |
| 44016.03664351852 | 55.663 |
| 44016.078310185185 | 54.968 |
| 44016.119976851856 | 54.331 |
| 44016.16164351852 | 53.829 |
| 44016.203310185185 | 53.347 |
| 44016.244976851856 | 52.98 |
| 44016.28664351852 | 52.671 |
| 44016.328310185185 | 52.574 |
| 44016.369976851856 | 52.845 |
| 44016.41164351852 | 53.424 |
| 44016.453310185185 | 54.601 |
| 44016.494976851856 | 56.242 |
| 44016.53664351852 | 57.825 |
| 44016.578310185185 | 59.235 |
| 44016.619976851856 | 58.501 |
| 44016.66164351852 | 58.308 |
| 44016.703310185185 | 58.154 |
| 44016.744976851856 | 57.69 |
| 44016.78664351852 | 57.15 |
| 44016.828310185185 | 56.416 |
| 44016.869976851856 | 55.547 |
| 44016.91164351852 | 54.794 |
| 44016.953310185185 | 54.061 |
| 44016.994976851856 | 53.424 |
| 44017.03664351852 | 52.825 |
| 44017.078310185185 | 52.111 |
| 44017.119976851856 | 51.551 |
| 44017.16164351852 | 51.069 |
| 44017.203310185185 | 50.663 |
| 44017.244976851856 | 50.354 |
| 44017.28664351852 | 50.065 |
| 44017.328310185185 | 50.065 |
| 44017.369976851856 | 50.316 |
| 44017.41164351852 | 51.107 |
| 44017.453310185185 | 52.439 |
| 44017.494976851856 | 54.235 |
| 44017.53664351852 | 56.3 |
| 44017.578310185185 | 58.154 |
| 44017.619976851856 | 58.81 |
| 44017.66164351852 | 59.196 |
| 44017.703310185185 | 59.872 |
| 44017.744976851856 | 60.567 |
| 44017.78664351852 | 60.663 |
| 44017.828310185185 | 59.93 |
| 44017.869976851856 | 59.022 |
| 44017.91164351852 | 58.154 |
| 44017.953310185185 | 57.13 |
| 44017.994976851856 | 56.088 |
| 44018.03664351852 | 55.084 |
| 44018.078310185185 | 54.119 |
| 44018.119976851856 | 53.289 |
| 44018.16164351852 | 52.594 |
| 44018.203310185185 | 52.014 |
| 44018.244976851856 | 51.493 |
| 44018.28664351852 | 51.069 |
| 44018.328310185185 | 50.875 |
| 44018.369976851856 | 51.03 |
| 44018.41164351852 | 51.821 |
| 44018.453310185185 | 52.883 |
| 44018.494976851856 | 54.524 |
| 44018.53664351852 | 56.513 |
| 44018.578310185185 | 57.806 |
| 44018.619976851856 | 57.999 |
| 44018.66164351852 | 57.999 |
| 44018.703310185185 | 58.617 |
| 44018.744976851856 | 59.91 |
| 44018.78664351852 | 60.123 |
| 44018.828310185185 | 59.389 |
| 44018.869976851856 | 59.37 |
| 44018.91164351852 | 58.482 |
| 44018.953310185185 | 57.227 |
| 44018.994976851856 | 55.451 |
| 44019.03664351852 | 53.906 |
| 44019.078310185185 | 52.845 |
| 44019.119976851856 | 52.053 |
| 44019.16164351852 | 51.397 |
| 44019.203310185185 | 50.953 |
| 44019.244976851856 | 50.509 |
| 44019.28664351852 | 50.142 |
| 44019.328310185185 | 50.045 |
| 44019.369976851856 | 50.219 |
| 44019.41164351852 | 51.03 |
| 44019.453310185185 | 52.169 |
| 44019.494976851856 | 52.96 |
| 44019.53664351852 | 54.312 |
| 44019.578310185185 | 55.856 |
| 44019.619976851856 | 57.188 |
| 44019.66164351852 | 58.443 |
| 44019.703310185185 | 58.733 |
| 44019.744976851856 | 58.694 |
| 44019.78664351852 | 58.211 |
| 44019.828310185185 | 57.343 |
| 44019.869976851856 | 56.474 |
| 44019.91164351852 | 55.663 |
| 44019.953310185185 | 54.582 |
| 44019.994976851856 | 53.347 |
| 44020.03664351852 | 52.014 |
| 44020.078310185185 | 50.875 |
| 44020.119976851856 | 49.872 |
| 44020.16164351852 | 48.984 |
| 44020.203310185185 | 48.173 |
| 44020.244976851856 | 47.516 |
| 44020.28664351852 | 47.053 |
| 44020.328310185185 | 46.879 |
| 44020.369976851856 | 47.034 |
| 44020.41164351852 | 47.767 |
| 44020.453310185185 | 49.08 |
| 44020.494976851856 | 50.875 |
| 44020.53664351852 | 52.864 |
| 44020.578310185185 | 54.814 |
| 44020.619976851856 | 56.416 |
| 44020.66164351852 | 57.632 |
| 44020.703310185185 | 58.482 |
| 44020.744976851856 | 59.293 |
| 44020.78664351852 | 59.408 |
| 44020.828310185185 | 58.964 |
| 44020.869976851856 | 58.057 |
| 44020.91164351852 | 56.976 |
| 44020.953310185185 | 55.567 |
| 44020.994976851856 | 53.984 |
| 44021.03664351852 | 52.652 |
| 44021.078310185185 | 51.319 |
| 44021.119976851856 | 50.18 |
| 44021.16164351852 | 49.215 |
| 44021.203310185185 | 48.366 |
| 44021.244976851856 | 47.729 |
| 44021.28664351852 | 47.207 |
| 44021.328310185185 | 47.111 |
| 44021.369976851856 | 47.323 |
| 44021.41164351852 | 47.941 |
| 44021.453310185185 | 49.099 |
| 44021.494976851856 | 50.296 |
| 44021.53664351852 | 52.13 |
| 44021.578310185185 | 54.235 |
| 44021.619976851856 | 56.069 |
| 44021.66164351852 | 57.594 |
| 44021.703310185185 | 58.829 |
| 44021.744976851856 | 59.37 |
| 44021.78664351852 | 59.35 |
| 44021.828310185185 | 58.81 |
| 44021.869976851856 | 58.115 |
| 44021.91164351852 | 57.015 |
| 44021.953310185185 | 55.644 |
| 44021.994976851856 | 54.061 |
| 44022.03664351852 | 52.536 |
| 44022.078310185185 | 51.049 |
| 44022.119976851856 | 49.736 |
| 44022.16164351852 | 48.54 |
| 44022.203310185185 | 47.516 |
| 44022.244976851856 | 46.628 |
| 44022.28664351852 | 45.972 |
| 44022.328310185185 | 45.702 |
| 44022.369976851856 | 45.779 |
| 44022.41164351852 | 46.628 |
| 44022.453310185185 | 47.941 |
| 44022.494976851856 | 49.852 |
| 44022.53664351852 | 52.111 |
| 44022.578310185185 | 54.331 |
| 44022.619976851856 | 56.377 |
| 44022.66164351852 | 57.903 |
| 44022.703310185185 | 58.81 |
| 44022.744976851856 | 59.331 |
| 44022.78664351852 | 59.428 |
| 44022.828310185185 | 59.099 |
| 44022.869976851856 | 58.269 |
| 44022.91164351852 | 57.092 |
| 44022.953310185185 | 55.721 |
| 44022.994976851856 | 54.312 |
| 44023.03664351852 | 52.767 |
| 44023.078310185185 | 51.339 |
| 44023.119976851856 | 50.045 |
| 44023.16164351852 | 48.791 |
| 44023.203310185185 | 47.69 |
| 44023.244976851856 | 46.783 |
| 44023.28664351852 | 46.126 |
| 44023.328310185185 | 45.914 |
| 44023.369976851856 | 46.068 |
| 44023.41164351852 | 46.841 |
| 44023.453310185185 | 48.231 |
| 44023.494976851856 | 50.238 |
| 44023.53664351852 | 52.478 |
| 44023.578310185185 | 54.737 |
| 44023.619976851856 | 56.744 |
| 44023.66164351852 | 58.289 |
| 44023.703310185185 | 59.408 |
| 44023.744976851856 | 59.891 |
| 44023.78664351852 | 59.794 |
| 44023.828310185185 | 59.524 |
| 44023.869976851856 | 59.061 |
| 44023.91164351852 | 58.366 |
| 44023.953310185185 | 57.343 |
| 44023.994976851856 | 56.126 |
| 44024.03664351852 | 54.833 |
| 44024.078310185185 | 53.482 |
| 44024.119976851856 | 52.188 |
| 44024.16164351852 | 50.972 |
| 44024.203310185185 | 49.949 |
| 44024.244976851856 | 49.099 |
| 44024.28664351852 | 48.52 |
| 44024.328310185185 | 48.346 |
| 44024.369976851856 | 48.54 |
| 44024.41164351852 | 49.215 |
| 44024.453310185185 | 50.547 |
| 44024.494976851856 | 52.053 |
| 44024.53664351852 | 52.169 |
| 44024.578310185185 | 53.038 |
| 44024.619976851856 | 53.115 |
| 44024.66164351852 | 53.733 |
| 44024.703310185185 | 54.794 |
| 44024.744976851856 | 55.123 |
| 44024.78664351852 | 55.412 |
| 44024.828310185185 | 55.489 |
| 44024.869976851856 | 55.065 |
| 44024.91164351852 | 54.312 |
| 44024.953310185185 | 53.617 |
| 44024.994976851856 | 52.864 |
| 44025.03664351852 | 52.208 |
| 44025.078310185185 | 51.628 |
| 44025.119976851856 | 51.069 |
| 44025.16164351852 | 50.567 |
| 44025.203310185185 | 49.968 |
| 44025.244976851856 | 49.466 |
| 44025.28664351852 | 49.119 |
| 44025.328310185185 | 49.177 |
| 44025.369976851856 | 49.428 |
| 44025.41164351852 | 49.775 |
| 44025.453310185185 | 50.721 |
| 44025.494976851856 | 51.513 |
| 44025.53664351852 | 51.957 |
| 44025.578310185185 | 54.157 |
| 44025.619976851856 | 55.258 |
| 44025.66164351852 | 56.59 |
| 44025.703310185185 | 57.555 |
| 44025.744976851856 | 57.246 |
| 44025.78664351852 | 56.821 |
| 44025.828310185185 | 56.764 |
| 44025.869976851856 | 56.416 |
| 44025.91164351852 | 55.972 |
| 44025.953310185185 | 55.412 |
| 44025.994976851856 | 54.621 |
| 44026.03664351852 | 53.694 |
| 44026.078310185185 | 52.787 |
| 44026.119976851856 | 51.899 |
| 44026.16164351852 | 50.914 |
| 44026.203310185185 | 50.142 |
| 44026.244976851856 | 49.466 |
| 44026.28664351852 | 48.926 |
| 44026.328310185185 | 48.675 |
| 44026.369976851856 | 48.964 |
| 44026.41164351852 | 49.64 |
| 44026.453310185185 | 50.567 |
| 44026.494976851856 | 52.439 |
| 44026.53664351852 | 54.042 |
| 44026.578310185185 | 56.57 |
| 44026.619976851856 | 57.632 |
| 44026.66164351852 | 57.459 |
| 44026.703310185185 | 56.918 |
| 44026.744976851856 | 56.899 |
| 44026.78664351852 | 56.667 |
| 44026.828310185185 | 56.3 |
| 44026.869976851856 | 55.702 |
| 44026.91164351852 | 55.007 |
| 44026.953310185185 | 54.273 |
| 44026.994976851856 | 53.424 |
| 44027.03664351852 | 52.516 |
| 44027.078310185185 | 51.493 |
| 44027.119976851856 | 50.625 |
| 44027.16164351852 | 49.872 |
| 44027.203310185185 | 49.177 |
| 44027.244976851856 | 48.443 |
| 44027.28664351852 | 47.883 |
| 44027.328310185185 | 47.767 |
| 44027.369976851856 | 47.999 |
| 44027.41164351852 | 48.636 |
| 44027.453310185185 | 49.91 |
| 44027.494976851856 | 51.783 |
| 44027.53664351852 | 53.675 |
| 44027.578310185185 | 55.103 |
| 44027.619976851856 | 56.551 |
| 44027.66164351852 | 57.362 |
| 44027.703310185185 | 57.594 |
| 44027.744976851856 | 57.459 |
| 44027.78664351852 | 57.015 |
| 44027.828310185185 | 56.551 |
| 44027.869976851856 | 56.223 |
| 44027.91164351852 | 55.489 |
| 44027.953310185185 | 54.582 |
| 44027.994976851856 | 53.559 |
| 44028.03664351852 | 52.478 |
| 44028.078310185185 | 51.397 |
| 44028.119976851856 | 50.431 |
| 44028.16164351852 | 49.563 |
| 44028.203310185185 | 48.81 |
| 44028.244976851856 | 48.134 |
| 44028.28664351852 | 47.632 |
| 44028.328310185185 | 47.594 |
| 44028.369976851856 | 47.787 |
| 44028.41164351852 | 48.617 |
| 44028.453310185185 | 49.872 |
| 44028.494976851856 | 51.744 |
| 44028.53664351852 | 53.192 |
| 44028.578310185185 | 55.219 |
| 44028.619976851856 | 56.03 |
| 44028.66164351852 | 55.76 |
| 44028.703310185185 | 55.489 |
| 44028.744976851856 | 55.74 |
| 44028.78664351852 | 55.798 |
| 44028.828310185185 | 55.547 |
| 44028.869976851856 | 54.987 |
| 44028.91164351852 | 54.196 |
| 44028.953310185185 | 53.308 |
| 44028.994976851856 | 52.246 |
| 44029.03664351852 | 51.146 |
| 44029.078310185185 | 50.2 |
| 44029.119976851856 | 49.389 |
| 44029.16164351852 | 48.655 |
| 44029.203310185185 | 47.902 |
| 44029.244976851856 | 47.362 |
| 44029.28664351852 | 46.879 |
| 44029.328310185185 | 46.628 |
| 44029.369976851856 | 46.976 |
| 44029.41164351852 | 47.767 |
| 44029.453310185185 | 49.138 |
| 44029.494976851856 | 50.875 |
| 44029.53664351852 | 52.111 |
| 44029.578310185185 | 54.003 |
| 44029.619976851856 | 55.605 |
| 44029.66164351852 | 56.551 |
| 44029.703310185185 | 57.169 |
| 44029.744976851856 | 57.304 |
| 44029.78664351852 | 57.323 |
| 44029.828310185185 | 57.208 |
| 44029.869976851856 | 56.416 |
| 44029.91164351852 | 55.682 |
| 44029.953310185185 | 54.852 |
| 44029.994976851856 | 53.984 |
| 44030.03664351852 | 53.018 |
| 44030.078310185185 | 51.995 |
| 44030.119976851856 | 51.011 |
| 44030.16164351852 | 50.103 |
| 44030.203310185185 | 49.254 |
| 44030.244976851856 | 48.501 |
| 44030.28664351852 | 47.825 |
| 44030.328310185185 | 47.748 |
| 44030.369976851856 | 47.98 |
| 44030.41164351852 | 48.578 |
| 44030.453310185185 | 49.64 |
| 44030.494976851856 | 51.57 |
| 44030.53664351852 | 53.076 |
| 44030.578310185185 | 54.659 |
| 44030.619976851856 | 55.335 |
| 44030.66164351852 | 55.316 |
| 44030.703310185185 | 55.567 |
| 44030.744976851856 | 55.837 |
| 44030.78664351852 | 56.165 |
| 44030.828310185185 | 56.184 |
| 44030.869976851856 | 55.856 |
| 44030.91164351852 | 55.123 |
| 44030.953310185185 | 54.254 |
| 44030.994976851856 | 53.25 |
| 44031.03664351852 | 52.362 |
| 44031.078310185185 | 51.628 |
| 44031.119976851856 | 50.74 |
| 44031.16164351852 | 49.852 |
| 44031.203310185185 | 49.041 |
| 44031.244976851856 | 48.404 |
| 44031.28664351852 | 47.922 |
| 44031.328310185185 | 47.729 |
| 44031.369976851856 | 48.173 |
| 44031.41164351852 | 48.81 |
| 44031.453310185185 | 49.485 |
| 44031.494976851856 | 50.76 |
| 44031.53664351852 | 51.455 |
| 44031.578310185185 | 52.42 |
| 44031.619976851856 | 53.269 |
| 44031.66164351852 | 54.003 |
| 44031.703310185185 | 54.659 |
| 44031.744976851856 | 55.084 |
| 44031.78664351852 | 55.123 |
| 44031.828310185185 | 54.698 |
| 44031.869976851856 | 54.061 |
| 44031.91164351852 | 53.347 |
| 44031.953310185185 | 52.478 |
| 44031.994976851856 | 51.57 |
| 44032.03664351852 | 50.547 |
| 44032.078310185185 | 49.64 |
| 44032.119976851856 | 48.81 |
| 44032.16164351852 | 48.153 |
| 44032.203310185185 | 47.381 |
| 44032.244976851856 | 46.783 |
| 44032.28664351852 | 46.339 |
| 44032.328310185185 | 46.339 |
| 44032.369976851856 | 46.628 |
| 44032.41164351852 | 47.343 |
| 44032.453310185185 | 48.713 |
| 44032.494976851856 | 50.547 |
| 44032.53664351852 | 52.787 |
| 44032.578310185185 | 55.123 |
| 44032.619976851856 | 57.034 |
| 44032.66164351852 | 58.655 |
| 44032.703310185185 | 59.408 |
| 44032.744976851856 | 59.737 |
| 44032.78664351852 | 59.64 |
| 44032.828310185185 | 59.08 |
| 44032.869976851856 | 58.366 |
| 44032.91164351852 | 57.285 |
| 44032.953310185185 | 56.049 |
| 44032.994976851856 | 54.717 |
| 44033.03664351852 | 53.404 |
| 44033.078310185185 | 52.15 |
| 44033.119976851856 | 50.972 |
| 44033.16164351852 | 49.891 |
| 44033.203310185185 | 48.887 |
| 44033.244976851856 | 48.134 |
| 44033.28664351852 | 47.478 |
| 44033.328310185185 | 47.381 |
| 44033.369976851856 | 47.632 |
| 44033.41164351852 | 48.443 |
| 44033.453310185185 | 49.775 |
| 44033.494976851856 | 51.667 |
| 44033.53664351852 | 53.771 |
| 44033.578310185185 | 55.181 |
| 44033.619976851856 | 56.088 |
| 44033.66164351852 | 57.072 |
| 44033.703310185185 | 57.941 |
| 44033.744976851856 | 58.038 |
| 44033.78664351852 | 57.15 |
| 44033.828310185185 | 56.474 |
| 44033.869976851856 | 55.876 |
| 44033.91164351852 | 55.567 |
| 44033.953310185185 | 55.296 |
| 44033.994976851856 | 54.524 |
| 44034.03664351852 | 53.578 |
| 44034.078310185185 | 52.401 |
| 44034.119976851856 | 51.242 |
| 44034.16164351852 | 50.258 |
| 44034.203310185185 | 49.389 |
| 44034.244976851856 | 48.675 |
| 44034.28664351852 | 48.096 |
| 44034.328310185185 | 47.883 |
| 44034.369976851856 | 48.115 |
| 44034.41164351852 | 48.771 |
| 44034.453310185185 | 49.794 |
| 44034.494976851856 | 51.184 |
| 44034.53664351852 | 52.497 |
| 44034.578310185185 | 54.543 |
| 44034.619976851856 | 54.698 |
| 44034.66164351852 | 54.794 |
| 44034.703310185185 | 54.949 |
| 44034.744976851856 | 55.065 |
| 44034.78664351852 | 54.987 |
| 44034.828310185185 | 54.64 |
| 44034.869976851856 | 54.196 |
| 44034.91164351852 | 53.733 |
| 44034.953310185185 | 53.25 |
| 44034.994976851856 | 52.69 |
| 44035.03664351852 | 52.034 |
| 44035.078310185185 | 51.358 |
| 44035.119976851856 | 50.605 |
| 44035.16164351852 | 49.891 |
| 44035.203310185185 | 49.157 |
| 44035.244976851856 | 48.501 |
| 44035.28664351852 | 48.018 |
| 44035.328310185185 | 47.864 |
| 44035.369976851856 | 48.096 |
| 44035.41164351852 | 48.81 |
| 44035.453310185185 | 50.084 |
| 44035.494976851856 | 51.725 |
| 44035.53664351852 | 51.879 |
| 44035.578310185185 | 53.694 |
| 44035.619976851856 | 55.47 |
| 44035.66164351852 | 56.976 |
| 44035.703310185185 | 56.957 |
| 44035.744976851856 | 57.111 |
| 44035.78664351852 | 57.632 |
| 44035.828310185185 | 57.632 |
| 44035.869976851856 | 57.092 |
| 44035.91164351852 | 56.609 |
| 44035.953310185185 | 55.933 |
| 44035.994976851856 | 55.045 |
| 44036.03664351852 | 54.157 |
| 44036.078310185185 | 53.231 |
| 44036.119976851856 | 52.439 |
| 44036.16164351852 | 51.648 |
| 44036.203310185185 | 50.933 |
| 44036.244976851856 | 50.335 |
| 44036.28664351852 | 49.852 |
| 44036.328310185185 | 49.543 |
| 44036.369976851856 | 49.447 |
| 44036.41164351852 | 50.084 |
| 44036.453310185185 | 50.74 |
| 44036.494976851856 | 51.513 |
| 44036.53664351852 | 53.076 |
| 44036.578310185185 | 53.984 |
| 44036.619976851856 | 54.852 |
| 44036.66164351852 | 56.706 |
| 44036.703310185185 | 57.13 |
| 44036.744976851856 | 57.69 |
| 44036.78664351852 | 57.516 |
| 44036.828310185185 | 56.802 |
| 44036.869976851856 | 56.59 |
| 44036.91164351852 | 56.358 |
| 44036.953310185185 | 55.914 |
| 44036.994976851856 | 55.296 |
| 44037.03664351852 | 54.659 |
| 44037.078310185185 | 53.906 |
| 44037.119976851856 | 53.076 |
| 44037.16164351852 | 52.246 |
| 44037.203310185185 | 51.59 |
| 44037.244976851856 | 50.933 |
| 44037.28664351852 | 50.528 |
| 44037.328310185185 | 50.277 |
| 44037.369976851856 | 50.238 |
| 44037.41164351852 | 50.528 |
| 44037.453310185185 | 51.011 |
| 44037.494976851856 | 51.86 |
| 44037.53664351852 | 52.381 |
| 44037.578310185185 | 52.709 |
| 44037.619976851856 | 53.984 |
| 44037.66164351852 | 55.489 |
| 44037.703310185185 | 55.779 |
| 44037.744976851856 | 55.296 |
| 44037.78664351852 | 55.045 |
| 44037.828310185185 | 54.486 |
| 44037.869976851856 | 54.022 |
| 44037.91164351852 | 53.636 |
| 44037.953310185185 | 52.96 |
| 44037.994976851856 | 52.362 |
| 44038.03664351852 | 51.783 |
| 44038.078310185185 | 51.223 |
| 44038.119976851856 | 50.625 |
| 44038.16164351852 | 50.045 |
| 44038.203310185185 | 49.466 |
| 44038.244976851856 | 49.08 |
| 44038.28664351852 | 48.752 |
| 44038.328310185185 | 48.713 |
| 44038.369976851856 | 49.215 |
| 44038.41164351852 | 50.065 |
| 44038.453310185185 | 50.412 |
| 44038.494976851856 | 52.15 |
| 44038.53664351852 | 54.524 |
| 44038.578310185185 | 56.32 |
| 44038.619976851856 | 57.864 |
| 44038.66164351852 | 59.022 |
| 44038.703310185185 | 59.042 |
| 44038.744976851856 | 59.486 |
| 44038.78664351852 | 59.35 |
| 44038.828310185185 | 58.404 |
| 44038.869976851856 | 57.381 |
| 44038.91164351852 | 56.416 |
| 44038.953310185185 | 55.547 |
| 44038.994976851856 | 54.698 |
| 44039.03664351852 | 53.713 |
| 44039.078310185185 | 52.825 |
| 44039.119976851856 | 52.014 |
| 44039.16164351852 | 51.223 |
| 44039.203310185185 | 50.489 |
| 44039.244976851856 | 49.814 |
| 44039.28664351852 | 49.196 |
| 44039.328310185185 | 49.022 |
| 44039.369976851856 | 49.177 |
| 44039.41164351852 | 49.775 |
| 44039.453310185185 | 50.953 |
| 44039.494976851856 | 52.632 |
| 44039.53664351852 | 54.698 |
| 44039.578310185185 | 57.034 |
| 44039.619976851856 | 58.559 |
| 44039.66164351852 | 59.717 |
| 44039.703310185185 | 60.374 |
| 44039.744976851856 | 60.451 |
| 44039.78664351852 | 59.756 |
| 44039.828310185185 | 58.849 |
| 44039.869976851856 | 58.173 |
| 44039.91164351852 | 57.69 |
| 44039.953310185185 | 56.879 |
| 44039.994976851856 | 55.914 |
| 44040.03664351852 | 54.698 |
| 44040.078310185185 | 53.675 |
| 44040.119976851856 | 52.748 |
| 44040.16164351852 | 51.86 |
| 44040.203310185185 | 51.069 |
| 44040.244976851856 | 50.393 |
| 44040.28664351852 | 49.852 |
| 44040.328310185185 | 49.563 |
| 44040.369976851856 | 49.428 |
| 44040.41164351852 | 49.389 |
| 44040.453310185185 | 49.872 |
| 44040.494976851856 | 50.277 |
| 44040.53664351852 | 50.721 |
| 44040.578310185185 | 51.049 |
| 44040.619976851856 | 52.497 |
| 44040.66164351852 | 54.466 |
| 44040.703310185185 | 54.737 |
| 44040.744976851856 | 55.2 |
| 44040.78664351852 | 55.374 |
| 44040.828310185185 | 55.277 |
| 44040.869976851856 | 54.717 |
| 44040.91164351852 | 54.177 |
| 44040.953310185185 | 53.424 |
| 44040.994976851856 | 52.439 |
| 44041.03664351852 | 51.551 |
| 44041.078310185185 | 50.914 |
| 44041.119976851856 | 50.2 |
| 44041.16164351852 | 49.389 |
| 44041.203310185185 | 48.559 |
| 44041.244976851856 | 47.883 |
| 44041.28664351852 | 47.323 |
| 44041.328310185185 | 47.207 |
| 44041.369976851856 | 47.42 |
| 44041.41164351852 | 48.115 |
| 44041.453310185185 | 49.408 |
| 44041.494976851856 | 50.933 |
| 44041.53664351852 | 52.188 |
| 44041.578310185185 | 54.177 |
| 44041.619976851856 | 56.146 |
| 44041.66164351852 | 57.227 |
| 44041.703310185185 | 57.652 |
| 44041.744976851856 | 58.173 |
| 44041.78664351852 | 58.231 |
| 44041.828310185185 | 57.671 |
| 44041.869976851856 | 56.937 |
| 44041.91164351852 | 56.146 |
| 44041.953310185185 | 55.335 |
| 44041.994976851856 | 54.35 |
| 44042.03664351852 | 53.269 |
| 44042.078310185185 | 52.13 |
| 44042.119976851856 | 51.011 |
| 44042.16164351852 | 50.007 |
| 44042.203310185185 | 49.003 |
| 44042.244976851856 | 48.057 |
| 44042.28664351852 | 47.362 |
| 44042.328310185185 | 47.053 |
| 44042.369976851856 | 47.265 |
| 44042.41164351852 | 47.941 |
| 44042.453310185185 | 49.235 |
| 44042.494976851856 | 50.991 |
| 44042.53664351852 | 52.999 |
| 44042.578310185185 | 54.621 |
| 44042.619976851856 | 56.223 |
| 44042.66164351852 | 57.941 |
| 44042.703310185185 | 59.293 |
| 44042.744976851856 | 59.794 |
| 44042.78664351852 | 59.621 |
| 44042.828310185185 | 59.428 |
| 44042.869976851856 | 59.099 |
| 44042.91164351852 | 58.366 |
| 44042.953310185185 | 57.362 |
| 44042.994976851856 | 56.242 |
| 44043.03664351852 | 55.065 |
| 44043.078310185185 | 53.848 |
| 44043.119976851856 | 52.671 |
| 44043.16164351852 | 51.455 |
| 44043.203310185185 | 50.238 |
| 44043.244976851856 | 49.138 |
| 44043.28664351852 | 48.173 |
| 44043.328310185185 | 47.806 |
| 44043.369976851856 | 47.864 |
| 44043.41164351852 | 48.424 |
| 44043.453310185185 | 49.64 |
| 44043.494976851856 | 51.377 |
| 44043.53664351852 | 53.347 |
| 44043.578310185185 | 55.528 |
| 44043.619976851856 | 57.787 |
| 44043.66164351852 | 58.849 |
| 44043.703310185185 | 58.868 |
| 44043.744976851856 | 59.601 |
| 44043.78664351852 | 59.524 |
| 44043.828310185185 | 59.312 |
| 44043.869976851856 | 58.54 |
| 44043.91164351852 | 57.767 |
| 44043.953310185185 | 56.783 |
| 44043.994976851856 | 55.702 |
| 44044.03664351852 | 54.582 |
| 44044.078310185185 | 53.308 |
| 44044.119976851856 | 52.169 |
| 44044.16164351852 | 50.953 |
| 44044.203310185185 | 49.949 |
| 44044.244976851856 | 49.099 |
| 44044.28664351852 | 48.327 |
| 44044.328310185185 | 48.038 |
| 44044.369976851856 | 48.231 |
| 44044.41164351852 | 48.868 |
| 44044.453310185185 | 50.084 |
| 44044.494976851856 | 51.802 |
| 44044.53664351852 | 53.733 |
| 44044.578310185185 | 55.933 |
| 44044.619976851856 | 57.883 |
| 44044.66164351852 | 59.582 |
| 44044.703310185185 | 59.814 |
| 44044.744976851856 | 60.103 |
| 44044.78664351852 | 60.374 |
| 44044.828310185185 | 59.988 |
| 44044.869976851856 | 59.08 |
| 44044.91164351852 | 58.347 |
| 44044.953310185185 | 57.574 |
| 44044.994976851856 | 56.416 |
| 44045.03664351852 | 55.181 |
| 44045.078310185185 | 53.984 |
| 44045.119976851856 | 52.787 |
| 44045.16164351852 | 51.609 |
| 44045.203310185185 | 50.682 |
| 44045.244976851856 | 49.794 |
| 44045.28664351852 | 49.08 |
| 44045.328310185185 | 48.887 |
| 44045.369976851856 | 49.022 |
| 44045.41164351852 | 49.621 |
| 44045.453310185185 | 50.509 |
| 44045.494976851856 | 52.246 |
| 44045.53664351852 | 53.347 |
| 44045.578310185185 | 55.412 |
| 44045.619976851856 | 56.841 |
| 44045.66164351852 | 57.806 |
| 44045.703310185185 | 57.98 |
| 44045.744976851856 | 58.771 |
| 44045.78664351852 | 58.945 |
| 44045.828310185185 | 58.424 |
| 44045.869976851856 | 57.767 |
| 44045.91164351852 | 57.246 |
| 44045.953310185185 | 56.551 |
| 44045.994976851856 | 55.663 |
| 44046.03664351852 | 54.486 |
| 44046.078310185185 | 53.269 |
| 44046.119976851856 | 52.15 |
| 44046.16164351852 | 51.107 |
| 44046.203310185185 | 50.123 |
| 44046.244976851856 | 49.331 |
| 44046.28664351852 | 48.675 |
| 44046.328310185185 | 48.462 |
| 44046.369976851856 | 48.655 |
| 44046.41164351852 | 49.292 |
| 44046.453310185185 | 50.567 |
| 44046.494976851856 | 52.111 |
| 44046.53664351852 | 54.196 |
| 44046.578310185185 | 55.991 |
| 44046.619976851856 | 56.474 |
| 44046.66164351852 | 57.98 |
| 44046.703310185185 | 58.404 |
| 44046.744976851856 | 58.385 |
| 44046.78664351852 | 58.231 |
| 44046.828310185185 | 57.922 |
| 44046.869976851856 | 57.13 |
| 44046.91164351852 | 56.242 |
| 44046.953310185185 | 55.412 |
| 44046.994976851856 | 54.37 |
| 44047.03664351852 | 53.424 |
| 44047.078310185185 | 52.536 |
| 44047.119976851856 | 51.802 |
| 44047.16164351852 | 51.107 |
| 44047.203310185185 | 50.354 |
| 44047.244976851856 | 49.563 |
| 44047.28664351852 | 49.061 |
| 44047.328310185185 | 49.003 |
| 44047.369976851856 | 49.273 |
| 44047.41164351852 | 49.872 |
| 44047.453310185185 | 51.088 |
| 44047.494976851856 | 52.748 |
| 44047.53664351852 | 53.424 |
| 44047.578310185185 | 54.756 |
| 44047.619976851856 | 56.049 |
| 44047.66164351852 | 56.146 |
| 44047.703310185185 | 56.686 |
| 44047.744976851856 | 57.516 |
| 44047.78664351852 | 57.555 |
| 44047.828310185185 | 56.976 |
| 44047.869976851856 | 56.397 |
| 44047.91164351852 | 55.895 |
| 44047.953310185185 | 55.219 |
| 44047.994976851856 | 54.582 |
| 44048.03664351852 | 53.887 |
| 44048.078310185185 | 53.115 |
| 44048.119976851856 | 52.265 |
| 44048.16164351852 | 51.377 |
| 44048.203310185185 | 50.605 |
| 44048.244976851856 | 49.91 |
| 44048.28664351852 | 49.273 |
| 44048.328310185185 | 49.099 |
| 44048.369976851856 | 49.292 |
| 44048.41164351852 | 49.949 |
| 44048.453310185185 | 51.088 |
| 44048.494976851856 | 52.536 |
| 44048.53664351852 | 54.235 |
| 44048.578310185185 | 55.316 |
| 44048.619976851856 | 56.513 |
| 44048.66164351852 | 57.748 |
| 44048.703310185185 | 58.347 |
| 44048.744976851856 | 58.134 |
| 44048.78664351852 | 58.076 |
| 44048.828310185185 | 58.173 |
| 44048.869976851856 | 57.922 |
| 44048.91164351852 | 57.304 |
| 44048.953310185185 | 56.397 |
| 44048.994976851856 | 55.451 |
| 44049.03664351852 | 54.466 |
| 44049.078310185185 | 53.54 |
| 44049.119976851856 | 52.671 |
| 44049.16164351852 | 51.899 |
| 44049.203310185185 | 51.088 |
| 44049.244976851856 | 50.528 |
| 44049.28664351852 | 50.026 |
| 44049.328310185185 | 49.736 |
| 44049.369976851856 | 50.065 |
| 44049.41164351852 | 50.779 |
| 44049.453310185185 | 51.706 |
| 44049.494976851856 | 52.014 |
| 44049.53664351852 | 52.941 |
| 44049.578310185185 | 53.964 |
| 44049.619976851856 | 55.528 |
| 44049.66164351852 | 56.3 |
| 44049.703310185185 | 56.937 |
| 44049.744976851856 | 57.15 |
| 44049.78664351852 | 56.57 |
| 44049.828310185185 | 56.088 |
| 44049.869976851856 | 55.528 |
| 44049.91164351852 | 55.026 |
| 44049.953310185185 | 54.389 |
| 44049.994976851856 | 53.462 |
| 44050.03664351852 | 52.381 |
| 44050.078310185185 | 51.435 |
| 44050.119976851856 | 50.393 |
| 44050.16164351852 | 49.37 |
| 44050.203310185185 | 48.404 |
| 44050.244976851856 | 47.362 |
| 44050.28664351852 | 46.493 |
| 44050.328310185185 | 46.126 |
| 44050.369976851856 | 46.281 |
| 44050.41164351852 | 46.899 |
| 44050.453310185185 | 48.192 |
| 44050.494976851856 | 49.949 |
| 44050.53664351852 | 52.014 |
| 44050.578310185185 | 54.235 |
| 44050.619976851856 | 56.358 |
| 44050.66164351852 | 57.999 |
| 44050.703310185185 | 59.215 |
| 44050.744976851856 | 59.717 |
| 44050.78664351852 | 59.659 |
| 44050.828310185185 | 59.235 |
| 44050.869976851856 | 58.598 |
| 44050.91164351852 | 57.883 |
| 44050.953310185185 | 56.918 |
| 44050.994976851856 | 55.605 |
| 44051.03664351852 | 54.215 |
| 44051.078310185185 | 52.825 |
| 44051.119976851856 | 51.435 |
| 44051.16164351852 | 50.026 |
| 44051.203310185185 | 48.675 |
| 44051.244976851856 | 47.458 |
| 44051.28664351852 | 46.551 |
| 44051.328310185185 | 46.126 |
| 44051.369976851856 | 46.223 |
| 44051.41164351852 | 46.86 |
| 44051.453310185185 | 48.096 |
| 44051.494976851856 | 49.717 |
| 44051.53664351852 | 51.744 |
| 44051.578310185185 | 54.042 |
| 44051.619976851856 | 56.184 |
| 44051.66164351852 | 57.188 |
| 44051.703310185185 | 57.922 |
| 44051.744976851856 | 58.347 |
| 44051.78664351852 | 58.636 |
| 44051.828310185185 | 58.694 |
| 44051.869976851856 | 58.443 |
| 44051.91164351852 | 57.806 |
| 44051.953310185185 | 56.821 |
| 44051.994976851856 | 55.605 |
| 44052.03664351852 | 54.312 |
| 44052.078310185185 | 52.999 |
| 44052.119976851856 | 51.57 |
| 44052.16164351852 | 50.219 |
| 44052.203310185185 | 49.022 |
| 44052.244976851856 | 47.902 |
| 44052.28664351852 | 46.918 |
| 44052.328310185185 | 46.397 |
| 44052.369976851856 | 46.416 |
| 44052.41164351852 | 47.034 |
| 44052.453310185185 | 48.231 |
| 44052.494976851856 | 49.891 |
| 44052.53664351852 | 51.821 |
| 44052.578310185185 | 53.964 |
| 44052.619976851856 | 55.933 |
| 44052.66164351852 | 57.053 |
| 44052.703310185185 | 58.134 |
| 44052.744976851856 | 59.196 |
| 44052.78664351852 | 59.659 |
| 44052.828310185185 | 59.235 |
| 44052.869976851856 | 58.791 |
| 44052.91164351852 | 58.057 |
| 44052.953310185185 | 57.15 |
| 44052.994976851856 | 56.184 |
| 44053.03664351852 | 55.026 |
| 44053.078310185185 | 53.694 |
| 44053.119976851856 | 52.401 |
| 44053.16164351852 | 51.204 |
| 44053.203310185185 | 50.065 |
| 44053.244976851856 | 48.926 |
| 44053.28664351852 | 47.941 |
| 44053.328310185185 | 47.439 |
| 44053.369976851856 | 47.497 |
| 44053.41164351852 | 48.018 |
| 44053.453310185185 | 49.157 |
| 44053.494976851856 | 50.682 |
| 44053.53664351852 | 52.516 |
| 44053.578310185185 | 53.906 |
| 44053.619976851856 | 55.161 |
| 44053.66164351852 | 56.57 |
| 44053.703310185185 | 57.497 |
| 44053.744976851856 | 57.71 |
| 44053.78664351852 | 57.208 |
| 44053.828310185185 | 57.034 |
| 44053.869976851856 | 56.937 |
| 44053.91164351852 | 56.628 |
| 44053.953310185185 | 56.107 |
| 44053.994976851856 | 55.258 |
| 44054.03664351852 | 54.312 |
| 44054.078310185185 | 53.385 |
| 44054.119976851856 | 52.401 |
| 44054.16164351852 | 51.204 |
| 44054.203310185185 | 50.103 |
| 44054.244976851856 | 49.061 |
| 44054.28664351852 | 48.211 |
| 44054.328310185185 | 47.902 |
| 44054.369976851856 | 47.96 |
| 44054.41164351852 | 48.501 |
| 44054.453310185185 | 49.196 |
| 44054.494976851856 | 49.466 |
| 44054.53664351852 | 50.161 |
| 44054.578310185185 | 51.667 |
| 44054.619976851856 | 52.96 |
| 44054.66164351852 | 54.717 |
| 44054.703310185185 | 54.775 |
| 44054.744976851856 | 55.605 |
| 44054.78664351852 | 56.3 |
| 44054.828310185185 | 56.609 |
| 44054.869976851856 | 56.609 |
| 44054.91164351852 | 56.339 |
| 44054.953310185185 | 55.586 |
| 44054.994976851856 | 54.563 |
| 44055.03664351852 | 53.424 |
| 44055.078310185185 | 52.208 |
| 44055.119976851856 | 50.953 |
| 44055.16164351852 | 49.736 |
| 44055.203310185185 | 48.578 |
| 44055.244976851856 | 47.458 |
| 44055.28664351852 | 46.551 |
| 44055.328310185185 | 46.107 |
| 44055.369976851856 | 46.281 |
| 44055.41164351852 | 46.493 |
| 44055.453310185185 | 46.841 |
| 44055.494976851856 | 48.597 |
| 44055.53664351852 | 50.354 |
| 44055.578310185185 | 51.474 |
| 44055.619976851856 | 52.439 |
| 44055.66164351852 | 53.733 |
| 44055.703310185185 | 54.37 |
| 44055.744976851856 | 55.026 |
| 44055.78664351852 | 55.798 |
| 44055.828310185185 | 56.223 |
| 44055.869976851856 | 56.126 |
| 44055.91164351852 | 55.431 |
| 44055.953310185185 | 54.428 |
| 44055.994976851856 | 53.366 |
| 44056.03664351852 | 52.246 |
| 44056.078310185185 | 51.126 |
| 44056.119976851856 | 49.949 |
| 44056.16164351852 | 48.771 |
| 44056.203310185185 | 47.671 |
| 44056.244976851856 | 46.706 |
| 44056.28664351852 | 45.875 |
| 44056.328310185185 | 45.47 |
| 44056.369976851856 | 45.489 |
| 44056.41164351852 | 46.165 |
| 44056.453310185185 | 47.458 |
| 44056.494976851856 | 49.196 |
| 44056.53664351852 | 51.049 |
| 44056.578310185185 | 52.806 |
| 44056.619976851856 | 54.679 |
| 44056.66164351852 | 56.126 |
| 44056.703310185185 | 57.034 |
| 44056.744976851856 | 57.459 |
| 44056.78664351852 | 57.497 |
| 44056.828310185185 | 57.478 |
| 44056.869976851856 | 57.208 |
| 44056.91164351852 | 56.648 |
| 44056.953310185185 | 55.953 |
| 44056.994976851856 | 55.084 |
| 44057.03664351852 | 54.099 |
| 44057.078310185185 | 52.845 |
| 44057.119976851856 | 51.513 |
| 44057.16164351852 | 50.238 |
| 44057.203310185185 | 49.003 |
| 44057.244976851856 | 47.709 |
| 44057.28664351852 | 46.648 |
| 44057.328310185185 | 46.107 |
| 44057.369976851856 | 46.126 |
| 44057.41164351852 | 46.667 |
| 44057.453310185185 | 47.767 |
| 44057.494976851856 | 49.35 |
| 44057.53664351852 | 51.146 |
| 44057.578310185185 | 53.173 |
| 44057.619976851856 | 55.123 |
| 44057.66164351852 | 56.532 |
| 44057.703310185185 | 57.188 |
| 44057.744976851856 | 57.632 |
| 44057.78664351852 | 57.748 |
| 44057.828310185185 | 57.613 |
| 44057.869976851856 | 57.188 |
| 44057.91164351852 | 56.57 |
| 44057.953310185185 | 55.721 |
| 44057.994976851856 | 54.737 |
| 44058.03664351852 | 53.597 |
| 44058.078310185185 | 52.323 |
| 44058.119976851856 | 51.107 |
| 44058.16164351852 | 49.93 |
| 44058.203310185185 | 48.791 |
| 44058.244976851856 | 47.709 |
| 44058.28664351852 | 46.841 |
| 44058.328310185185 | 46.416 |
| 44058.369976851856 | 46.57 |
| 44058.41164351852 | 47.13 |
| 44058.453310185185 | 48.327 |
| 44058.494976851856 | 49.891 |
| 44058.53664351852 | 51.879 |
| 44058.578310185185 | 53.984 |
| 44058.619976851856 | 55.953 |
| 44058.66164351852 | 57.555 |
| 44058.703310185185 | 58.617 |
| 44058.744976851856 | 58.849 |
| 44058.78664351852 | 58.598 |
| 44058.828310185185 | 58.269 |
| 44058.869976851856 | 57.69 |
| 44058.91164351852 | 57.034 |
| 44058.953310185185 | 56.242 |
| 44058.994976851856 | 55.123 |
| 44059.03664351852 | 53.906 |
| 44059.078310185185 | 52.69 |
| 44059.119976851856 | 51.358 |
| 44059.16164351852 | 50.045 |
| 44059.203310185185 | 48.848 |
| 44059.244976851856 | 47.787 |
| 44059.28664351852 | 46.821 |
| 44059.328310185185 | 46.242 |
| 44059.369976851856 | 46.3 |
| 44059.41164351852 | 46.899 |
| 44059.453310185185 | 48.134 |
| 44059.494976851856 | 49.717 |
| 44059.53664351852 | 51.493 |
| 44059.578310185185 | 53.52 |
| 44059.619976851856 | 55.586 |
| 44059.66164351852 | 57.072 |
| 44059.703310185185 | 58.134 |
| 44059.744976851856 | 58.598 |
| 44059.78664351852 | 58.501 |
| 44059.828310185185 | 58.211 |
| 44059.869976851856 | 57.594 |
| 44059.91164351852 | 57.072 |
| 44059.953310185185 | 56.397 |
| 44059.994976851856 | 55.547 |
| 44060.03664351852 | 54.601 |
| 44060.078310185185 | 53.559 |
| 44060.119976851856 | 52.458 |
| 44060.16164351852 | 51.397 |
| 44060.203310185185 | 50.393 |
| 44060.244976851856 | 49.466 |
| 44060.28664351852 | 48.655 |
| 44060.328310185185 | 48.173 |
| 44060.369976851856 | 48.289 |
| 44060.41164351852 | 48.887 |
| 44060.453310185185 | 50.026 |
| 44060.494976851856 | 51.532 |
| 44060.53664351852 | 53.289 |
| 44060.578310185185 | 55.142 |
| 44060.619976851856 | 56.899 |
| 44060.66164351852 | 58.211 |
| 44060.703310185185 | 59.679 |
| 44060.744976851856 | 60.103 |
| 44060.78664351852 | 59.737 |
| 44060.828310185185 | 59.428 |
| 44060.869976851856 | 58.984 |
| 44060.91164351852 | 58.52 |
| 44060.953310185185 | 57.806 |
| 44060.994976851856 | 56.841 |
| 44061.03664351852 | 55.837 |
| 44061.078310185185 | 54.659 |
| 44061.119976851856 | 53.501 |
| 44061.16164351852 | 52.304 |
| 44061.203310185185 | 51.146 |
| 44061.244976851856 | 50.026 |
| 44061.28664351852 | 49.215 |
| 44061.328310185185 | 48.752 |
| 44061.369976851856 | 48.791 |
| 44061.41164351852 | 49.35 |
| 44061.453310185185 | 50.702 |
| 44061.494976851856 | 52.362 |
| 44061.53664351852 | 54.312 |
| 44061.578310185185 | 56.493 |
| 44061.619976851856 | 57.516 |
| 44061.66164351852 | 57.98 |
| 44061.703310185185 | 58.366 |
| 44061.744976851856 | 58.849 |
| 44061.78664351852 | 58.52 |
| 44061.828310185185 | 58.308 |
| 44061.869976851856 | 57.845 |
| 44061.91164351852 | 57.304 |
| 44061.953310185185 | 56.628 |
| 44061.994976851856 | 55.895 |
| 44062.03664351852 | 54.891 |
| 44062.078310185185 | 53.733 |
| 44062.119976851856 | 52.516 |
| 44062.16164351852 | 51.59 |
| 44062.203310185185 | 50.682 |
| 44062.244976851856 | 49.659 |
| 44062.28664351852 | 48.752 |
| 44062.328310185185 | 48.327 |
| 44062.369976851856 | 48.346 |
| 44062.41164351852 | 48.984 |
| 44062.453310185185 | 50.393 |
| 44062.494976851856 | 52.092 |
| 44062.53664351852 | 54.099 |
| 44062.578310185185 | 56.088 |
| 44062.619976851856 | 58.192 |
| 44062.66164351852 | 59.273 |
| 44062.703310185185 | 59.35 |
| 44062.744976851856 | 59.505 |
| 44062.78664351852 | 59.563 |
| 44062.828310185185 | 59.35 |
| 44062.869976851856 | 58.81 |
| 44062.91164351852 | 58.018 |
| 44062.953310185185 | 56.937 |
| 44062.994976851856 | 55.876 |
| 44063.03664351852 | 54.794 |
| 44063.078310185185 | 53.694 |
| 44063.119976851856 | 52.632 |
| 44063.16164351852 | 51.493 |
| 44063.203310185185 | 50.393 |
| 44063.244976851856 | 49.485 |
| 44063.28664351852 | 48.694 |
| 44063.328310185185 | 48.211 |
| 44063.369976851856 | 48.269 |
| 44063.41164351852 | 48.964 |
| 44063.453310185185 | 50.296 |
| 44063.494976851856 | 51.358 |
| 44063.53664351852 | 53.597 |
| 44063.578310185185 | 55.876 |
| 44063.619976851856 | 57.188 |
| 44063.66164351852 | 57.246 |
| 44063.703310185185 | 57.459 |
| 44063.744976851856 | 57.96 |
| 44063.78664351852 | 57.903 |
| 44063.828310185185 | 57.574 |
| 44063.869976851856 | 56.899 |
| 44063.91164351852 | 56.493 |
| 44063.953310185185 | 55.933 |
| 44063.994976851856 | 55.123 |
| 44064.03664351852 | 54.099 |
| 44064.078310185185 | 52.96 |
| 44064.119976851856 | 51.899 |
| 44064.16164351852 | 50.933 |
| 44064.203310185185 | 49.987 |
| 44064.244976851856 | 49.177 |
| 44064.28664351852 | 48.404 |
| 44064.328310185185 | 48.018 |
| 44064.369976851856 | 48.057 |
| 44064.41164351852 | 48.675 |
| 44064.453310185185 | 49.93 |
| 44064.494976851856 | 51.57 |
| 44064.53664351852 | 53.385 |
| 44064.578310185185 | 55.354 |
| 44064.619976851856 | 57.459 |
| 44064.66164351852 | 58.791 |
| 44064.703310185185 | 59.582 |
| 44064.744976851856 | 59.679 |
| 44064.78664351852 | 59.428 |
| 44064.828310185185 | 59.042 |
| 44064.869976851856 | 58.443 |
| 44064.91164351852 | 57.671 |
| 44064.953310185185 | 56.802 |
| 44064.994976851856 | 55.625 |
| 44065.03664351852 | 54.389 |
| 44065.078310185185 | 53.211 |
| 44065.119976851856 | 51.937 |
| 44065.16164351852 | 50.644 |
| 44065.203310185185 | 49.466 |
| 44065.244976851856 | 48.404 |
| 44065.28664351852 | 47.458 |
| 44065.328310185185 | 46.899 |
| 44065.369976851856 | 46.918 |
| 44065.41164351852 | 47.439 |
| 44065.453310185185 | 48.694 |
| 44065.494976851856 | 50.47 |
| 44065.53664351852 | 52.401 |
| 44065.578310185185 | 54.312 |
| 44065.619976851856 | 56.204 |
| 44065.66164351852 | 57.613 |
| 44065.703310185185 | 58.443 |
| 44065.744976851856 | 58.964 |
| 44065.78664351852 | 58.964 |
| 44065.828310185185 | 58.655 |
| 44065.869976851856 | 58.192 |
| 44065.91164351852 | 57.555 |
| 44065.953310185185 | 56.706 |
| 44065.994976851856 | 55.702 |
| 44066.03664351852 | 54.582 |
| 44066.078310185185 | 53.404 |
| 44066.119976851856 | 52.15 |
| 44066.16164351852 | 51.03 |
| 44066.203310185185 | 49.891 |
| 44066.244976851856 | 48.829 |
| 44066.28664351852 | 48.038 |
| 44066.328310185185 | 47.536 |
| 44066.369976851856 | 47.478 |
| 44066.41164351852 | 47.883 |
| 44066.453310185185 | 49.022 |
| 44066.494976851856 | 50.779 |
| 44066.53664351852 | 52.883 |
| 44066.578310185185 | 54.37 |
| 44066.619976851856 | 54.698 |
| 44066.66164351852 | 55.528 |
| 44066.703310185185 | 56.03 |
| 44066.744976851856 | 55.779 |
| 44066.78664351852 | 55.528 |
| 44066.828310185185 | 55.2 |
| 44066.869976851856 | 54.872 |
| 44066.91164351852 | 54.389 |
| 44066.953310185185 | 53.597 |
| 44066.994976851856 | 52.709 |
| 44067.03664351852 | 51.918 |
| 44067.078310185185 | 51.069 |
| 44067.119976851856 | 50.277 |
| 44067.16164351852 | 49.428 |
| 44067.203310185185 | 48.733 |
| 44067.244976851856 | 48.153 |
| 44067.28664351852 | 47.671 |
| 44067.328310185185 | 47.304 |
| 44067.369976851856 | 47.458 |
| 44067.41164351852 | 47.883 |
| 44067.453310185185 | 49.177 |
| 44067.494976851856 | 50.431 |
| 44067.53664351852 | 52.169 |
| 44067.578310185185 | 53.173 |
| 44067.619976851856 | 53.906 |
| 44067.66164351852 | 55.065 |
| 44067.703310185185 | 55.489 |
| 44067.744976851856 | 55.682 |
| 44067.78664351852 | 55.451 |
| 44067.828310185185 | 54.891 |
| 44067.869976851856 | 54.659 |
| 44067.91164351852 | 54.447 |
| 44067.953310185185 | 54.389 |
| 44067.994976851856 | 53.964 |
| 44068.03664351852 | 53.231 |
| 44068.078310185185 | 52.362 |
| 44068.119976851856 | 51.493 |
| 44068.16164351852 | 50.605 |
| 44068.203310185185 | 49.833 |
| 44068.244976851856 | 49.003 |
| 44068.28664351852 | 48.346 |
| 44068.328310185185 | 47.922 |
| 44068.369976851856 | 48.096 |
| 44068.41164351852 | 48.752 |
| 44068.453310185185 | 50.161 |
| 44068.494976851856 | 51.802 |
| 44068.53664351852 | 53.559 |
| 44068.578310185185 | 55.489 |
| 44068.619976851856 | 55.933 |
| 44068.66164351852 | 56.937 |
| 44068.703310185185 | 57.362 |
| 44068.744976851856 | 57.729 |
| 44068.78664351852 | 57.999 |
| 44068.828310185185 | 57.845 |
| 44068.869976851856 | 57.246 |
| 44068.91164351852 | 56.493 |
| 44068.953310185185 | 55.663 |
| 44068.994976851856 | 54.814 |
| 44069.03664351852 | 53.868 |
| 44069.078310185185 | 52.845 |
| 44069.119976851856 | 51.841 |
| 44069.16164351852 | 50.837 |
| 44069.203310185185 | 49.949 |
| 44069.244976851856 | 49.138 |
| 44069.28664351852 | 48.675 |
| 44069.328310185185 | 48.404 |
| 44069.369976851856 | 48.327 |
| 44069.41164351852 | 48.848 |
| 44069.453310185185 | 50.2 |
| 44069.494976851856 | 52.323 |
| 44069.53664351852 | 53.984 |
| 44069.578310185185 | 54.235 |
| 44069.619976851856 | 55.489 |
| 44069.66164351852 | 55.991 |
| 44069.703310185185 | 56.377 |
| 44069.744976851856 | 56.706 |
| 44069.78664351852 | 56.628 |
| 44069.828310185185 | 56.049 |
| 44069.869976851856 | 55.489 |
| 44069.91164351852 | 54.968 |
| 44069.953310185185 | 54.37 |
| 44069.994976851856 | 53.694 |
| 44070.03664351852 | 52.883 |
| 44070.078310185185 | 51.879 |
| 44070.119976851856 | 50.991 |
| 44070.16164351852 | 50.18 |
| 44070.203310185185 | 49.485 |
| 44070.244976851856 | 48.752 |
| 44070.28664351852 | 48.192 |
| 44070.328310185185 | 47.825 |
| 44070.369976851856 | 47.941 |
| 44070.41164351852 | 48.675 |
| 44070.453310185185 | 50.084 |
| 44070.494976851856 | 51.764 |
| 44070.53664351852 | 53.771 |
| 44070.578310185185 | 54.582 |
| 44070.619976851856 | 56.416 |
| 44070.66164351852 | 56.899 |
| 44070.703310185185 | 56.764 |
| 44070.744976851856 | 56.976 |
| 44070.78664351852 | 56.976 |
| 44070.828310185185 | 57.015 |
| 44070.869976851856 | 56.976 |
| 44070.91164351852 | 56.821 |
| 44070.953310185185 | 56.3 |
| 44070.994976851856 | 55.316 |
| 44071.03664351852 | 54.177 |
| 44071.078310185185 | 53.057 |
| 44071.119976851856 | 52.034 |
| 44071.16164351852 | 51.011 |
| 44071.203310185185 | 50.238 |
| 44071.244976851856 | 49.408 |
| 44071.28664351852 | 48.675 |
| 44071.328310185185 | 48.327 |
| 44071.369976851856 | 48.327 |
| 44071.41164351852 | 48.597 |
| 44071.453310185185 | 49.389 |
| 44071.494976851856 | 50.895 |
| 44071.53664351852 | 51.957 |
| 44071.578310185185 | 52.748 |
| 44071.619976851856 | 53.115 |
| 44071.66164351852 | 53.54 |
| 44071.703310185185 | 53.675 |
| 44071.744976851856 | 53.578 |
| 44071.78664351852 | 53.54 |
| 44071.828310185185 | 53.211 |
| 44071.869976851856 | 52.787 |
| 44071.91164351852 | 52.323 |
| 44071.953310185185 | 51.802 |
| 44071.994976851856 | 51.146 |
| 44072.03664351852 | 50.412 |
| 44072.078310185185 | 49.659 |
| 44072.119976851856 | 49.041 |
| 44072.16164351852 | 48.404 |
| 44072.203310185185 | 47.864 |
| 44072.244976851856 | 47.458 |
| 44072.28664351852 | 47.13 |
| 44072.328310185185 | 46.899 |
| 44072.369976851856 | 46.821 |
| 44072.41164351852 | 46.821 |
| 44072.453310185185 | 46.937 |
| 44072.494976851856 | 47.092 |
| 44072.53664351852 | 47.381 |
| 44072.578310185185 | 47.806 |
| 44072.619976851856 | 49.196 |
| 44072.66164351852 | 50.431 |
| 44072.703310185185 | 51.242 |
| 44072.744976851856 | 51.435 |
| 44072.78664351852 | 51.551 |
| 44072.828310185185 | 51.551 |
| 44072.869976851856 | 51.551 |
| 44072.91164351852 | 51.358 |
| 44072.953310185185 | 51.011 |
| 44072.994976851856 | 50.682 |
| 44073.03664351852 | 50.316 |
| 44073.078310185185 | 49.814 |
| 44073.119976851856 | 49.157 |
| 44073.16164351852 | 48.424 |
| 44073.203310185185 | 47.787 |
| 44073.244976851856 | 47.265 |
| 44073.28664351852 | 46.686 |
| 44073.328310185185 | 46.262 |
| 44073.369976851856 | 46.474 |
| 44073.41164351852 | 47.188 |
| 44073.453310185185 | 48.636 |
| 44073.494976851856 | 50.277 |
| 44073.53664351852 | 52.053 |
| 44073.578310185185 | 52.652 |
| 44073.619976851856 | 52.748 |
| 44073.66164351852 | 53.926 |
| 44073.703310185185 | 54.582 |
| 44073.744976851856 | 54.659 |
| 44073.78664351852 | 54.157 |
| 44073.828310185185 | 53.54 |
| 44073.869976851856 | 52.98 |
| 44073.91164351852 | 52.652 |
| 44073.953310185185 | 52.362 |
| 44073.994976851856 | 51.706 |
| 44074.03664351852 | 50.933 |
| 44074.078310185185 | 49.949 |
| 44074.119976851856 | 49.061 |
| 44074.16164351852 | 48.269 |
| 44074.203310185185 | 47.458 |
| 44074.244976851856 | 46.763 |
| 44074.28664351852 | 46.165 |
| 44074.328310185185 | 45.779 |
| 44074.369976851856 | 45.933 |
| 44074.41164351852 | 46.706 |
| 44074.453310185185 | 48.173 |
| 44074.494976851856 | 49.717 |
| 44074.53664351852 | 49.987 |
| 44074.578310185185 | 50.258 |
| 44074.619976851856 | 51.377 |
| 44074.66164351852 | 53.096 |
| 44074.703310185185 | 53.308 |
| 44074.744976851856 | 53.733 |
| 44074.78664351852 | 53.984 |
| 44074.828310185185 | 53.926 |
| 44074.869976851856 | 53.675 |
| 44074.91164351852 | 53.327 |
| 44074.953310185185 | 52.787 |
| 44074.994976851856 | 52.169 |
| 44075.03664351852 | 51.513 |
| 44075.078310185185 | 50.875 |
| 44075.119976851856 | 50.18 |
| 44075.16164351852 | 49.389 |
| 44075.203310185185 | 48.52 |
| 44075.244976851856 | 47.729 |
| 44075.28664351852 | 47.188 |
| 44075.328310185185 | 46.821 |
| 44075.369976851856 | 46.879 |
| 44075.41164351852 | 47.323 |
| 44075.453310185185 | 48.906 |
| 44075.494976851856 | 50.161 |
| 44075.53664351852 | 51.802 |
| 44075.578310185185 | 53.54 |
| 44075.619976851856 | 55.2 |
| 44075.66164351852 | 56.165 |
| 44075.703310185185 | 56.686 |
| 44075.744976851856 | 56.628 |
| 44075.78664351852 | 56.088 |
| 44075.828310185185 | 55.721 |
| 44075.869976851856 | 55.335 |
| 44075.91164351852 | 54.582 |
| 44075.953310185185 | 53.578 |
| 44075.994976851856 | 52.439 |
| 44076.03664351852 | 51.262 |
| 44076.078310185185 | 50.103 |
| 44076.119976851856 | 48.984 |
| 44076.16164351852 | 47.845 |
| 44076.203310185185 | 46.86 |
| 44076.244976851856 | 45.914 |
| 44076.28664351852 | 45.103 |
| 44076.328310185185 | 44.543 |
| 44076.369976851856 | 44.659 |
| 44076.41164351852 | 45.354 |
| 44076.453310185185 | 46.899 |
| 44076.494976851856 | 48.578 |
| 44076.53664351852 | 50.509 |
| 44076.578310185185 | 52.613 |
| 44076.619976851856 | 54.563 |
| 44076.66164351852 | 55.933 |
| 44076.703310185185 | 56.744 |
| 44076.744976851856 | 56.86 |
| 44076.78664351852 | 56.59 |
| 44076.828310185185 | 56.339 |
| 44076.869976851856 | 55.914 |
| 44076.91164351852 | 55.354 |
| 44076.953310185185 | 54.486 |
| 44076.994976851856 | 53.366 |
| 44077.03664351852 | 52.227 |
| 44077.078310185185 | 51.049 |
| 44077.119976851856 | 49.872 |
| 44077.16164351852 | 48.713 |
| 44077.203310185185 | 47.574 |
| 44077.244976851856 | 46.59 |
| 44077.28664351852 | 45.74 |
| 44077.328310185185 | 45.084 |
| 44077.369976851856 | 45.123 |
| 44077.41164351852 | 45.798 |
| 44077.453310185185 | 47.304 |
| 44077.494976851856 | 49.022 |
| 44077.53664351852 | 50.856 |
| 44077.578310185185 | 52.922 |
| 44077.619976851856 | 54.891 |
| 44077.66164351852 | 56.262 |
| 44077.703310185185 | 57.111 |
| 44077.744976851856 | 57.304 |
| 44077.78664351852 | 57.111 |
| 44077.828310185185 | 56.821 |
| 44077.869976851856 | 56.416 |
| 44077.91164351852 | 55.798 |
| 44077.953310185185 | 54.968 |
| 44077.994976851856 | 53.887 |
| 44078.03664351852 | 52.787 |
| 44078.078310185185 | 51.628 |
| 44078.119976851856 | 50.393 |
| 44078.16164351852 | 49.312 |
| 44078.203310185185 | 48.134 |
| 44078.244976851856 | 47.13 |
| 44078.28664351852 | 46.184 |
| 44078.328310185185 | 45.586 |
| 44078.369976851856 | 45.586 |
| 44078.41164351852 | 46.262 |
| 44078.453310185185 | 47.825 |
| 44078.494976851856 | 49.582 |
| 44078.53664351852 | 51.435 |
| 44078.578310185185 | 53.443 |
| 44078.619976851856 | 55.393 |
| 44078.66164351852 | 56.821 |
| 44078.703310185185 | 57.516 |
| 44078.744976851856 | 57.787 |
| 44078.78664351852 | 57.652 |
| 44078.828310185185 | 57.323 |
| 44078.869976851856 | 56.918 |
| 44078.91164351852 | 56.281 |
| 44078.953310185185 | 55.335 |
| 44078.994976851856 | 54.177 |
| 44079.03664351852 | 53.018 |
| 44079.078310185185 | 52.053 |
| 44079.119976851856 | 50.953 |
| 44079.16164351852 | 49.775 |
| 44079.203310185185 | 48.655 |
| 44079.244976851856 | 47.825 |
| 44079.28664351852 | 46.995 |
| 44079.328310185185 | 46.57 |
| 44079.369976851856 | 46.648 |
| 44079.41164351852 | 47.362 |
| 44079.453310185185 | 48.848 |
| 44079.494976851856 | 50.605 |
| 44079.53664351852 | 52.343 |
| 44079.578310185185 | 53.984 |
| 44079.619976851856 | 55.895 |
| 44079.66164351852 | 57.362 |
| 44079.703310185185 | 58.25 |
| 44079.744976851856 | 58.443 |
| 44079.78664351852 | 58.192 |
| 44079.828310185185 | 57.883 |
| 44079.869976851856 | 57.459 |
| 44079.91164351852 | 56.899 |
| 44079.953310185185 | 55.933 |
| 44079.994976851856 | 54.737 |
| 44080.03664351852 | 53.578 |
| 44080.078310185185 | 52.246 |
| 44080.119976851856 | 51.011 |
| 44080.16164351852 | 49.659 |
| 44080.203310185185 | 48.346 |
| 44080.244976851856 | 47.227 |
| 44080.28664351852 | 46.242 |
| 44080.328310185185 | 45.586 |
| 44080.369976851856 | 45.605 |
| 44080.41164351852 | 46.204 |
| 44080.453310185185 | 47.632 |
| 44080.494976851856 | 49.563 |
| 44080.53664351852 | 51.358 |
| 44080.578310185185 | 53.25 |
| 44080.619976851856 | 54.968 |
| 44080.66164351852 | 56.32 |
| 44080.703310185185 | 57.015 |
| 44080.744976851856 | 57.188 |
| 44080.78664351852 | 56.918 |
| 44080.828310185185 | 56.686 |
| 44080.869976851856 | 56.32 |
| 44080.91164351852 | 55.76 |
| 44080.953310185185 | 54.833 |
| 44080.994976851856 | 53.694 |
| 44081.03664351852 | 52.516 |
| 44081.078310185185 | 51.319 |
| 44081.119976851856 | 50.2 |
| 44081.16164351852 | 48.984 |
| 44081.203310185185 | 47.787 |
| 44081.244976851856 | 46.686 |
| 44081.28664351852 | 45.779 |
| 44081.328310185185 | 45.103 |
| 44081.369976851856 | 45.007 |
| 44081.41164351852 | 45.489 |
| 44081.453310185185 | 46.551 |
| 44081.494976851856 | 47.864 |
| 44081.53664351852 | 49.235 |
| 44081.578310185185 | 50.798 |
| 44081.619976851856 | 52.092 |
| 44081.66164351852 | 53.076 |
| 44081.703310185185 | 53.694 |
| 44081.744976851856 | 53.964 |
| 44081.78664351852 | 53.926 |
| 44081.828310185185 | 53.733 |
| 44081.869976851856 | 53.327 |
| 44081.91164351852 | 52.767 |
| 44081.953310185185 | 52.169 |
| 44081.994976851856 | 51.435 |
| 44082.03664351852 | 50.663 |
| 44082.078310185185 | 49.872 |
| 44082.119976851856 | 49.08 |
| 44082.16164351852 | 48.211 |
| 44082.203310185185 | 47.439 |
| 44082.244976851856 | 46.609 |
| 44082.28664351852 | 45.972 |
| 44082.328310185185 | 45.373 |
| 44082.369976851856 | 44.794 |
| 44082.41164351852 | 44.389 |
| 44082.453310185185 | 44.582 |
| 44082.494976851856 | 44.601 |
| 44082.53664351852 | 44.582 |
| 44082.578310185185 | 44.428 |
| 44082.619976851856 | 44.196 |
| 44082.66164351852 | 44.157 |
| 44082.703310185185 | 43.675 |
| 44082.744976851856 | 42.864 |
| 44082.78664351852 | 42.15 |
| 44082.828310185185 | 41.146 |
| 44082.869976851856 | 40.142 |
| 44082.91164351852 | 39.254 |
| 44082.953310185185 | 38.597 |
| 44082.994976851856 | 37.941 |
| 44083.03664351852 | 37.574 |
| 44083.078310185185 | 37.304 |
| 44083.119976851856 | 37.246 |
| 44083.16164351852 | 37.092 |
| 44083.203310185185 | 37.034 |
| 44083.244976851856 | 37.092 |
| 44083.28664351852 | 37.111 |
| 44083.328310185185 | 37.323 |
| 44083.369976851856 | 37.902 |
| 44083.41164351852 | 38.501 |
| 44083.453310185185 | 39.621 |
| 44083.494976851856 | 41.493 |
| 44083.53664351852 | 42.69 |
| 44083.578310185185 | 43.733 |
| 44083.619976851856 | 46.397 |
| 44083.66164351852 | 47.825 |
| 44083.703310185185 | 48.791 |
| 44083.744976851856 | 49.138 |
| 44083.78664351852 | 49.003 |
| 44083.828310185185 | 48.559 |
| 44083.869976851856 | 48.153 |
| 44083.91164351852 | 47.709 |
| 44083.953310185185 | 46.957 |
| 44083.994976851856 | 46.165 |
| 44084.03664351852 | 45.509 |
| 44084.078310185185 | 44.852 |
| 44084.119976851856 | 44.312 |
| 44084.16164351852 | 43.655 |
| 44084.203310185185 | 43.134 |
| 44084.244976851856 | 42.613 |
| 44084.28664351852 | 42.246 |
| 44084.328310185185 | 42.014 |
| 44084.369976851856 | 42.15 |
| 44084.41164351852 | 42.96 |
| 44084.453310185185 | 44.505 |
| 44084.494976851856 | 46.088 |
| 44084.53664351852 | 45.991 |
| 44084.578310185185 | 46.783 |
| 44084.619976851856 | 48.096 |
| 44084.66164351852 | 48.636 |
| 44084.703310185185 | 48.501 |
| 44084.744976851856 | 48.424 |
| 44084.78664351852 | 48.173 |
| 44084.828310185185 | 47.96 |
| 44084.869976851856 | 47.594 |
| 44084.91164351852 | 47.362 |
| 44084.953310185185 | 47.072 |
| 44084.994976851856 | 46.725 |
| 44085.03664351852 | 46.339 |
| 44085.078310185185 | 45.76 |
| 44085.119976851856 | 45.296 |
| 44085.16164351852 | 44.852 |
| 44085.203310185185 | 44.35 |
| 44085.244976851856 | 43.848 |
| 44085.28664351852 | 43.424 |
| 44085.328310185185 | 43.153 |
| 44085.369976851856 | 43.173 |
| 44085.41164351852 | 43.269 |
| 44085.453310185185 | 43.636 |
| 44085.494976851856 | 44.138 |
| 44085.53664351852 | 45.818 |
| 44085.578310185185 | 46.976 |
| 44085.619976851856 | 48.404 |
| 44085.66164351852 | 49.254 |
| 44085.703310185185 | 49.949 |
| 44085.744976851856 | 49.852 |
| 44085.78664351852 | 49.389 |
| 44085.828310185185 | 48.887 |
| 44085.869976851856 | 48.733 |
| 44085.91164351852 | 48.578 |
| 44085.953310185185 | 48.134 |
| 44085.994976851856 | 47.516 |
| 44086.03664351852 | 46.821 |
| 44086.078310185185 | 46.011 |
| 44086.119976851856 | 45.238 |
| 44086.16164351852 | 44.505 |
| 44086.203310185185 | 43.771 |
| 44086.244976851856 | 43.057 |
| 44086.28664351852 | 42.362 |
| 44086.328310185185 | 41.802 |
| 44086.369976851856 | 41.899 |
| 44086.41164351852 | 42.671 |
| 44086.453310185185 | 44.273 |
| 44086.494976851856 | 46.03 |
| 44086.53664351852 | 47.69 |
| 44086.578310185185 | 49.524 |
| 44086.619976851856 | 51.281 |
| 44086.66164351852 | 52.594 |
| 44086.703310185185 | 53.347 |
| 44086.744976851856 | 53.578 |
| 44086.78664351852 | 53.366 |
| 44086.828310185185 | 53.018 |
| 44086.869976851856 | 52.632 |
| 44086.91164351852 | 52.208 |
| 44086.953310185185 | 51.455 |
| 44086.994976851856 | 50.625 |
| 44087.03664351852 | 49.659 |
| 44087.078310185185 | 48.675 |
| 44087.119976851856 | 47.767 |
| 44087.16164351852 | 46.802 |
| 44087.203310185185 | 45.914 |
| 44087.244976851856 | 45.007 |
| 44087.28664351852 | 44.119 |
| 44087.328310185185 | 43.501 |
| 44087.369976851856 | 43.482 |
| 44087.41164351852 | 44.138 |
| 44087.453310185185 | 45.682 |
| 44087.494976851856 | 47.478 |
| 44087.53664351852 | 49.138 |
| 44087.578310185185 | 50.818 |
| 44087.619976851856 | 52.497 |
| 44087.66164351852 | 53.771 |
| 44087.703310185185 | 54.466 |
| 44087.744976851856 | 54.737 |
| 44087.78664351852 | 54.775 |
| 44087.828310185185 | 54.698 |
| 44087.869976851856 | 54.37 |
| 44087.91164351852 | 53.848 |
| 44087.953310185185 | 53.153 |
| 44087.994976851856 | 52.265 |
| 44088.03664351852 | 51.416 |
| 44088.078310185185 | 50.489 |
| 44088.119976851856 | 49.543 |
| 44088.16164351852 | 48.559 |
| 44088.203310185185 | 47.497 |
| 44088.244976851856 | 46.532 |
| 44088.28664351852 | 45.644 |
| 44088.328310185185 | 44.987 |
| 44088.369976851856 | 44.833 |
| 44088.41164351852 | 45.316 |
| 44088.453310185185 | 46.609 |
| 44088.494976851856 | 48.192 |
| 44088.53664351852 | 49.717 |
| 44088.578310185185 | 51.358 |
| 44088.619976851856 | 52.883 |
| 44088.66164351852 | 53.713 |
| 44088.703310185185 | 54.737 |
| 44088.744976851856 | 54.891 |
| 44088.78664351852 | 54.949 |
| 44088.828310185185 | 54.756 |
| 44088.869976851856 | 54.389 |
| 44088.91164351852 | 53.926 |
| 44088.953310185185 | 53.192 |
| 44088.994976851856 | 52.401 |
| 44089.03664351852 | 51.57 |
| 44089.078310185185 | 50.605 |
| 44089.119976851856 | 49.659 |
| 44089.16164351852 | 48.675 |
| 44089.203310185185 | 47.671 |
| 44089.244976851856 | 46.57 |
| 44089.28664351852 | 45.586 |
| 44089.328310185185 | 44.833 |
| 44089.369976851856 | 44.621 |
| 44089.41164351852 | 45.103 |
| 44089.453310185185 | 46.397 |
| 44089.494976851856 | 47.902 |
| 44089.53664351852 | 49.273 |
| 44089.578310185185 | 50.74 |
| 44089.619976851856 | 52.072 |
| 44089.66164351852 | 53.153 |
| 44089.703310185185 | 53.829 |
| 44089.744976851856 | 54.022 |
| 44089.78664351852 | 53.926 |
| 44089.828310185185 | 53.675 |
| 44089.869976851856 | 53.347 |
| 44089.91164351852 | 52.825 |
| 44089.953310185185 | 52.111 |
| 44089.994976851856 | 51.242 |
| 44090.03664351852 | 50.431 |
| 44090.078310185185 | 49.485 |
| 44090.119976851856 | 48.617 |
| 44090.16164351852 | 47.652 |
| 44090.203310185185 | 46.648 |
| 44090.244976851856 | 45.702 |
| 44090.28664351852 | 44.794 |
| 44090.328310185185 | 44.08 |
| 44090.369976851856 | 43.81 |
| 44090.41164351852 | 44.215 |
| 44090.453310185185 | 45.238 |
| 44090.494976851856 | 46.725 |
| 44090.53664351852 | 48.153 |
| 44090.578310185185 | 49.428 |
| 44090.619976851856 | 50.779 |
| 44090.66164351852 | 51.879 |
| 44090.703310185185 | 52.574 |
| 44090.744976851856 | 52.825 |
| 44090.78664351852 | 52.787 |
| 44090.828310185185 | 52.594 |
| 44090.869976851856 | 52.208 |
| 44090.91164351852 | 51.802 |
| 44090.953310185185 | 51.377 |
| 44090.994976851856 | 50.779 |
| 44091.03664351852 | 49.987 |
| 44091.078310185185 | 49.312 |
| 44091.119976851856 | 48.501 |
| 44091.16164351852 | 47.748 |
| 44091.203310185185 | 46.957 |
| 44091.244976851856 | 46.068 |
| 44091.28664351852 | 45.335 |
| 44091.328310185185 | 44.659 |
| 44091.369976851856 | 44.601 |
| 44091.41164351852 | 44.929 |
| 44091.453310185185 | 46.146 |
| 44091.494976851856 | 47.709 |
| 44091.53664351852 | 49.215 |
| 44091.578310185185 | 50.431 |
| 44091.619976851856 | 51.628 |
| 44091.66164351852 | 52.574 |
| 44091.703310185185 | 53.134 |
| 44091.744976851856 | 53.347 |
| 44091.78664351852 | 53.173 |
| 44091.828310185185 | 52.825 |
| 44091.869976851856 | 52.458 |
| 44091.91164351852 | 51.976 |
| 44091.953310185185 | 51.3 |
| 44091.994976851856 | 50.528 |
| 44092.03664351852 | 49.814 |
| 44092.078310185185 | 49.08 |
| 44092.119976851856 | 48.289 |
| 44092.16164351852 | 47.458 |
| 44092.203310185185 | 46.628 |
| 44092.244976851856 | 45.818 |
| 44092.28664351852 | 45.161 |
| 44092.328310185185 | 44.582 |
| 44092.369976851856 | 44.331 |
| 44092.41164351852 | 44.775 |
| 44092.453310185185 | 45.972 |
| 44092.494976851856 | 47.478 |
| 44092.53664351852 | 48.636 |
| 44092.578310185185 | 48.887 |
| 44092.619976851856 | 48.868 |
| 44092.66164351852 | 49.524 |
| 44092.703310185185 | 50.431 |
| 44092.744976851856 | 50.875 |
| 44092.78664351852 | 51.088 |
| 44092.828310185185 | 51.223 |
| 44092.869976851856 | 51.204 |
| 44092.91164351852 | 51.069 |
| 44092.953310185185 | 50.567 |
| 44092.994976851856 | 49.91 |
| 44093.03664351852 | 49.428 |
| 44093.078310185185 | 49.022 |
| 44093.119976851856 | 48.52 |
| 44093.16164351852 | 47.729 |
| 44093.203310185185 | 46.841 |
| 44093.244976851856 | 46.107 |
| 44093.28664351852 | 45.489 |
| 44093.328310185185 | 45.065 |
| 44093.369976851856 | 45.084 |
| 44093.41164351852 | 45.624 |
| 44093.453310185185 | 46.281 |
| 44093.494976851856 | 47.169 |
| 44093.53664351852 | 47.613 |
| 44093.578310185185 | 47.902 |
| 44093.619976851856 | 48.945 |
| 44093.66164351852 | 50.644 |
| 44093.703310185185 | 51.899 |
| 44093.744976851856 | 52.265 |
| 44093.78664351852 | 51.821 |
| 44093.828310185185 | 51.513 |
| 44093.869976851856 | 51.184 |
| 44093.91164351852 | 50.837 |
| 44093.953310185185 | 50.412 |
| 44093.994976851856 | 50.007 |
| 44094.03664351852 | 49.64 |
| 44094.078310185185 | 49.041 |
| 44094.119976851856 | 48.385 |
| 44094.16164351852 | 47.767 |
| 44094.203310185185 | 47.15 |
| 44094.244976851856 | 46.628 |
| 44094.28664351852 | 46.088 |
| 44094.328310185185 | 45.663 |
| 44094.369976851856 | 45.74 |
| 44094.41164351852 | 46.493 |
| 44094.453310185185 | 47.825 |
| 44094.494976851856 | 48.52 |
| 44094.53664351852 | 49.292 |
| 44094.578310185185 | 49.794 |
| 44094.619976851856 | 50.412 |
| 44094.66164351852 | 51.242 |
| 44094.703310185185 | 51.455 |
| 44094.744976851856 | 51.165 |
| 44094.78664351852 | 50.682 |
| 44094.828310185185 | 50.258 |
| 44094.869976851856 | 49.949 |
| 44094.91164351852 | 49.679 |
| 44094.953310185185 | 49.37 |
| 44094.994976851856 | 48.926 |
| 44095.03664351852 | 48.25 |
| 44095.078310185185 | 47.594 |
| 44095.119976851856 | 46.841 |
| 44095.16164351852 | 46.146 |
| 44095.203310185185 | 45.567 |
| 44095.244976851856 | 44.91 |
| 44095.28664351852 | 44.234 |
| 44095.328310185185 | 43.79 |
| 44095.369976851856 | 43.829 |
| 44095.41164351852 | 44.601 |
| 44095.453310185185 | 46.068 |
| 44095.494976851856 | 47.13 |
| 44095.53664351852 | 48.057 |
| 44095.578310185185 | 48.578 |
| 44095.619976851856 | 49.273 |
| 44095.66164351852 | 49.968 |
| 44095.703310185185 | 50.586 |
| 44095.744976851856 | 50.509 |
| 44095.78664351852 | 50.933 |
| 44095.828310185185 | 51.184 |
| 44095.869976851856 | 51.628 |
| 44095.91164351852 | 51.899 |
| 44095.953310185185 | 51.493 |
| 44095.994976851856 | 50.856 |
| 44096.03664351852 | 50.103 |
| 44096.078310185185 | 49.466 |
| 44096.119976851856 | 48.733 |
| 44096.16164351852 | 47.922 |
| 44096.203310185185 | 47.111 |
| 44096.244976851856 | 46.262 |
| 44096.28664351852 | 45.489 |
| 44096.328310185185 | 44.872 |
| 44096.369976851856 | 44.698 |
| 44096.41164351852 | 45.316 |
| 44096.453310185185 | 46.744 |
| 44096.494976851856 | 48.231 |
| 44096.53664351852 | 48.385 |
| 44096.578310185185 | 49.93 |
| 44096.619976851856 | 50.47 |
| 44096.66164351852 | 51.146 |
| 44096.703310185185 | 51.319 |
| 44096.744976851856 | 51.242 |
| 44096.78664351852 | 51.049 |
| 44096.828310185185 | 50.856 |
| 44096.869976851856 | 50.605 |
| 44096.91164351852 | 50.431 |
| 44096.953310185185 | 50.374 |
| 44096.994976851856 | 50.045 |
| 44097.03664351852 | 49.563 |
| 44097.078310185185 | 49.003 |
| 44097.119976851856 | 48.559 |
| 44097.16164351852 | 48.018 |
| 44097.203310185185 | 47.227 |
| 44097.244976851856 | 46.493 |
| 44097.28664351852 | 45.837 |
| 44097.328310185185 | 45.258 |
| 44097.369976851856 | 45.258 |
| 44097.41164351852 | 45.818 |
| 44097.453310185185 | 47.188 |
| 44097.494976851856 | 48.81 |
| 44097.53664351852 | 50.277 |
| 44097.578310185185 | 51.532 |
| 44097.619976851856 | 52.323 |
| 44097.66164351852 | 53.308 |
| 44097.703310185185 | 53.848 |
| 44097.744976851856 | 53.752 |
| 44097.78664351852 | 53.366 |
| 44097.828310185185 | 52.96 |
| 44097.869976851856 | 52.458 |
| 44097.91164351852 | 51.957 |
| 44097.953310185185 | 51.281 |
| 44097.994976851856 | 50.431 |
| 44098.03664351852 | 49.563 |
| 44098.078310185185 | 48.713 |
| 44098.119976851856 | 47.864 |
| 44098.16164351852 | 46.995 |
| 44098.203310185185 | 46.049 |
| 44098.244976851856 | 45.103 |
| 44098.28664351852 | 44.254 |
| 44098.328310185185 | 43.655 |
| 44098.369976851856 | 43.443 |
| 44098.41164351852 | 43.713 |
| 44098.453310185185 | 44.582 |
| 44098.494976851856 | 45.779 |
| 44098.53664351852 | 47.401 |
| 44098.578310185185 | 49.408 |
| 44098.619976851856 | 50.818 |
| 44098.66164351852 | 51.821 |
| 44098.703310185185 | 52.439 |
| 44098.744976851856 | 52.574 |
| 44098.78664351852 | 52.42 |
| 44098.828310185185 | 52.304 |
| 44098.869976851856 | 52.188 |
| 44098.91164351852 | 51.957 |
| 44098.953310185185 | 51.397 |
| 44098.994976851856 | 50.74 |
| 44099.03664351852 | 49.949 |
| 44099.078310185185 | 49.196 |
| 44099.119976851856 | 48.482 |
| 44099.16164351852 | 47.671 |
| 44099.203310185185 | 46.821 |
| 44099.244976851856 | 45.953 |
| 44099.28664351852 | 45.103 |
| 44099.328310185185 | 44.428 |
| 44099.369976851856 | 44.389 |
| 44099.41164351852 | 44.949 |
| 44099.453310185185 | 46.377 |
| 44099.494976851856 | 47.902 |
| 44099.53664351852 | 49.003 |
| 44099.578310185185 | 50.393 |
| 44099.619976851856 | 51.667 |
| 44099.66164351852 | 52.729 |
| 44099.703310185185 | 53.289 |
| 44099.744976851856 | 53.482 |
| 44099.78664351852 | 53.366 |
| 44099.828310185185 | 53.057 |
| 44099.869976851856 | 52.748 |
| 44099.91164351852 | 52.343 |
| 44099.953310185185 | 51.686 |
| 44099.994976851856 | 50.914 |
| 44100.03664351852 | 50.123 |
| 44100.078310185185 | 49.37 |
| 44100.119976851856 | 48.54 |
| 44100.16164351852 | 47.806 |
| 44100.203310185185 | 46.976 |
| 44100.244976851856 | 46.126 |
| 44100.28664351852 | 45.373 |
| 44100.328310185185 | 44.756 |
| 44100.369976851856 | 44.485 |
| 44100.41164351852 | 44.968 |
| 44100.453310185185 | 46.262 |
| 44100.494976851856 | 47.806 |
| 44100.53664351852 | 49.022 |
| 44100.578310185185 | 50.219 |
| 44100.619976851856 | 51.281 |
| 44100.66164351852 | 52.188 |
| 44100.703310185185 | 52.613 |
| 44100.744976851856 | 52.767 |
| 44100.78664351852 | 52.458 |
| 44100.828310185185 | 52.265 |
| 44100.869976851856 | 52.227 |
| 44100.91164351852 | 52.13 |
| 44100.953310185185 | 51.706 |
| 44100.994976851856 | 51.204 |
| 44101.03664351852 | 50.702 |
| 44101.078310185185 | 50.084 |
| 44101.119976851856 | 49.428 |
| 44101.16164351852 | 48.655 |
| 44101.203310185185 | 47.864 |
| 44101.244976851856 | 46.957 |
| 44101.28664351852 | 46.339 |
| 44101.328310185185 | 45.875 |
| 44101.369976851856 | 45.702 |
| 44101.41164351852 | 45.586 |
| 44101.453310185185 | 46.57 |
| 44101.494976851856 | 47.265 |
| 44101.53664351852 | 48.115 |
| 44101.578310185185 | 49.138 |
| 44101.619976851856 | 49.543 |
| 44101.66164351852 | 49.736 |
| 44101.703310185185 | 49.659 |
| 44101.744976851856 | 49.041 |
| 44101.78664351852 | 48.482 |
| 44101.828310185185 | 47.787 |
| 44101.869976851856 | 47.478 |
| 44101.91164351852 | 47.15 |
| 44101.953310185185 | 46.609 |
| 44101.994976851856 | 46.011 |
| 44102.03664351852 | 45.373 |
| 44102.078310185185 | 44.64 |
| 44102.119976851856 | 43.964 |
| 44102.16164351852 | 43.269 |
| 44102.203310185185 | 42.671 |
| 44102.244976851856 | 41.937 |
| 44102.28664351852 | 41.242 |
| 44102.328310185185 | 40.605 |
| 44102.369976851856 | 40.509 |
| 44102.41164351852 | 41.049 |
| 44102.453310185185 | 42.362 |
| 44102.494976851856 | 43.848 |
| 44102.53664351852 | 44.968 |
| 44102.578310185185 | 45.875 |
| 44102.619976851856 | 46.86 |
| 44102.66164351852 | 47.652 |
| 44102.703310185185 | 48.057 |
| 44102.744976851856 | 47.767 |
| 44102.78664351852 | 47.574 |
| 44102.828310185185 | 47.304 |
| 44102.869976851856 | 47.15 |
| 44102.91164351852 | 46.609 |
| 44102.953310185185 | 45.895 |
| 44102.994976851856 | 45.045 |
| 44103.03664351852 | 44.254 |
| 44103.078310185185 | 43.424 |
| 44103.119976851856 | 42.613 |
| 44103.16164351852 | 41.841 |
| 44103.203310185185 | 41.107 |
| 44103.244976851856 | 40.373 |
| 44103.28664351852 | 39.64 |
| 44103.328310185185 | 39.022 |
| 44103.369976851856 | 38.964 |
| 44103.41164351852 | 39.601 |
| 44103.453310185185 | 41.088 |
| 44103.494976851856 | 42.922 |
| 44103.53664351852 | 44.35 |
| 44103.578310185185 | 45.875 |
| 44103.619976851856 | 47.246 |
| 44103.66164351852 | 48.482 |
| 44103.703310185185 | 49.119 |
| 44103.744976851856 | 49.37 |
| 44103.78664351852 | 49.389 |
| 44103.828310185185 | 49.254 |
| 44103.869976851856 | 49.099 |
| 44103.91164351852 | 48.713 |
| 44103.953310185185 | 48.038 |
| 44103.994976851856 | 47.207 |
| 44104.03664351852 | 46.377 |
| 44104.078310185185 | 45.567 |
| 44104.119976851856 | 44.794 |
| 44104.16164351852 | 43.964 |
| 44104.203310185185 | 43.095 |
| 44104.244976851856 | 42.227 |
| 44104.28664351852 | 41.358 |
| 44104.328310185185 | 40.605 |
| 44104.369976851856 | 40.547 |
| 44104.41164351852 | 41.088 |
| 44104.453310185185 | 42.574 |
| 44104.494976851856 | 44.35 |
| 44104.53664351852 | 45.76 |
| 44104.578310185185 | 46.937 |
| 44104.619976851856 | 48.231 |
| 44104.66164351852 | 49.235 |
| 44104.703310185185 | 49.756 |
| 44104.744976851856 | 49.698 |
| 44104.78664351852 | 49.563 |
| 44104.828310185185 | 49.563 |
| 44104.869976851856 | 49.196 |
| 44104.91164351852 | 48.694 |
| 44104.953310185185 | 47.864 |
| 44104.994976851856 | 47.034 |
| 44105.03664351852 | 46.184 |
| 44105.078310185185 | 45.373 |
| 44105.119976851856 | 44.524 |
| 44105.16164351852 | 43.675 |
| 44105.203310185185 | 42.883 |
| 44105.244976851856 | 41.956 |
| 44105.28664351852 | 41.146 |
| 44105.328310185185 | 40.373 |
| 44105.369976851856 | 40.219 |
| 44105.41164351852 | 40.682 |
| 44105.453310185185 | 41.86 |
| 44105.494976851856 | 43.173 |
| 44105.53664351852 | 44.543 |
| 44105.578310185185 | 45.933 |
| 44105.619976851856 | 47.188 |
| 44105.66164351852 | 48.153 |
| 44105.703310185185 | 48.655 |
| 44105.744976851856 | 48.655 |
| 44105.78664351852 | 48.559 |
| 44105.828310185185 | 48.578 |
| 44105.869976851856 | 48.404 |
| 44105.91164351852 | 48.018 |
| 44105.953310185185 | 47.42 |
| 44105.994976851856 | 46.706 |
| 44106.03664351852 | 45.953 |
| 44106.078310185185 | 45.219 |
| 44106.119976851856 | 44.524 |
| 44106.16164351852 | 43.752 |
| 44106.203310185185 | 42.96 |
| 44106.244976851856 | 42.15 |
| 44106.28664351852 | 41.435 |
| 44106.328310185185 | 40.76 |
| 44106.369976851856 | 40.586 |
| 44106.41164351852 | 41.126 |
| 44106.453310185185 | 42.536 |
| 44106.494976851856 | 44.061 |
| 44106.53664351852 | 44.563 |
| 44106.578310185185 | 44.891 |
| 44106.619976851856 | 45.991 |
| 44106.66164351852 | 46.976 |
| 44106.703310185185 | 47.96 |
| 44106.744976851856 | 48.366 |
| 44106.78664351852 | 48.366 |
| 44106.828310185185 | 48.289 |
| 44106.869976851856 | 47.922 |
| 44106.91164351852 | 47.401 |
| 44106.953310185185 | 46.686 |
| 44106.994976851856 | 46.011 |
| 44107.03664351852 | 45.316 |
| 44107.078310185185 | 44.64 |
| 44107.119976851856 | 43.945 |
| 44107.16164351852 | 43.25 |
| 44107.203310185185 | 42.574 |
| 44107.244976851856 | 41.841 |
| 44107.28664351852 | 41.107 |
| 44107.328310185185 | 40.431 |
| 44107.369976851856 | 40.219 |
| 44107.41164351852 | 40.721 |
| 44107.453310185185 | 41.879 |
| 44107.494976851856 | 43.424 |
| 44107.53664351852 | 44.833 |
| 44107.578310185185 | 46.03 |
| 44107.619976851856 | 47.111 |
| 44107.66164351852 | 48.153 |
| 44107.703310185185 | 48.771 |
| 44107.744976851856 | 49.003 |
| 44107.78664351852 | 48.887 |
| 44107.828310185185 | 48.829 |
| 44107.869976851856 | 48.655 |
| 44107.91164351852 | 48.231 |
| 44107.953310185185 | 47.555 |
| 44107.994976851856 | 46.821 |
| 44108.03664351852 | 46.107 |
| 44108.078310185185 | 45.277 |
| 44108.119976851856 | 44.485 |
| 44108.16164351852 | 43.79 |
| 44108.203310185185 | 43.018 |
| 44108.244976851856 | 42.207 |
| 44108.28664351852 | 41.377 |
| 44108.328310185185 | 40.721 |
| 44108.369976851856 | 40.547 |
| 44108.41164351852 | 40.991 |
| 44108.453310185185 | 42.4 |
| 44108.494976851856 | 44.157 |
| 44108.53664351852 | 45.451 |
| 44108.578310185185 | 46.435 |
| 44108.619976851856 | 47.613 |
| 44108.66164351852 | 48.713 |
| 44108.703310185185 | 49.37 |
| 44108.744976851856 | 49.601 |
| 44108.78664351852 | 49.679 |
| 44108.828310185185 | 49.717 |
| 44108.869976851856 | 49.563 |
| 44108.91164351852 | 49.196 |
| 44108.953310185185 | 48.559 |
| 44108.994976851856 | 47.767 |
| 44109.03664351852 | 47.072 |
| 44109.078310185185 | 46.319 |
| 44109.119976851856 | 45.489 |
| 44109.16164351852 | 44.621 |
| 44109.203310185185 | 43.713 |
| 44109.244976851856 | 42.806 |
| 44109.28664351852 | 41.879 |
| 44109.328310185185 | 41.088 |
| 44109.369976851856 | 40.875 |
| 44109.41164351852 | 41.319 |
| 44109.453310185185 | 42.555 |
| 44109.494976851856 | 44.119 |
| 44109.53664351852 | 45.393 |
| 44109.578310185185 | 46.493 |
| 44109.619976851856 | 47.536 |
| 44109.66164351852 | 48.443 |
| 44109.703310185185 | 48.848 |
| 44109.744976851856 | 48.868 |
| 44109.78664351852 | 48.848 |
| 44109.828310185185 | 48.713 |
| 44109.869976851856 | 48.404 |
| 44109.91164351852 | 47.922 |
| 44109.953310185185 | 47.304 |
| 44109.994976851856 | 46.57 |
| 44110.03664351852 | 45.798 |
| 44110.078310185185 | 44.987 |
| 44110.119976851856 | 44.177 |
| 44110.16164351852 | 43.482 |
| 44110.203310185185 | 42.69 |
| 44110.244976851856 | 41.86 |
| 44110.28664351852 | 40.991 |
| 44110.328310185185 | 40.335 |
| 44110.369976851856 | 40.065 |
| 44110.41164351852 | 40.509 |
| 44110.453310185185 | 41.821 |
| 44110.494976851856 | 43.52 |
| 44110.53664351852 | 44.929 |
| 44110.578310185185 | 46.011 |
| 44110.619976851856 | 47.15 |
| 44110.66164351852 | 48.192 |
| 44110.703310185185 | 48.887 |
| 44110.744976851856 | 49.157 |
| 44110.78664351852 | 49.235 |
| 44110.828310185185 | 49.099 |
| 44110.869976851856 | 48.848 |
| 44110.91164351852 | 48.462 |
| 44110.953310185185 | 47.902 |
| 44110.994976851856 | 47.13 |
| 44111.03664351852 | 46.377 |
| 44111.078310185185 | 45.567 |
| 44111.119976851856 | 44.814 |
| 44111.16164351852 | 44.003 |
| 44111.203310185185 | 43.095 |
| 44111.244976851856 | 42.207 |
| 44111.28664351852 | 41.358 |
| 44111.328310185185 | 40.624 |
| 44111.369976851856 | 40.431 |
| 44111.41164351852 | 40.972 |
| 44111.453310185185 | 42.285 |
| 44111.494976851856 | 43.984 |
| 44111.53664351852 | 45.258 |
| 44111.578310185185 | 46.319 |
| 44111.619976851856 | 47.594 |
| 44111.66164351852 | 48.675 |
| 44111.703310185185 | 49.408 |
| 44111.744976851856 | 49.64 |
| 44111.78664351852 | 49.698 |
| 44111.828310185185 | 49.621 |
| 44111.869976851856 | 49.428 |
| 44111.91164351852 | 48.964 |
| 44111.953310185185 | 48.327 |
| 44111.994976851856 | 47.574 |
| 44112.03664351852 | 46.86 |
| 44112.078310185185 | 46.107 |
| 44112.119976851856 | 45.316 |
| 44112.16164351852 | 44.601 |
| 44112.203310185185 | 43.868 |
| 44112.244976851856 | 42.98 |
| 44112.28664351852 | 42.15 |
| 44112.328310185185 | 41.474 |
| 44112.369976851856 | 41.261 |
| 44112.41164351852 | 41.59 |
| 44112.453310185185 | 42.825 |
| 44112.494976851856 | 44.428 |
| 44112.53664351852 | 45.644 |
| 44112.578310185185 | 46.609 |
| 44112.619976851856 | 47.632 |
| 44112.66164351852 | 48.559 |
| 44112.703310185185 | 49.196 |
| 44112.744976851856 | 49.196 |
| 44112.78664351852 | 49.08 |
| 44112.828310185185 | 49.022 |
| 44112.869976851856 | 48.81 |
| 44112.91164351852 | 48.443 |
| 44112.953310185185 | 47.922 |
| 44112.994976851856 | 47.246 |
| 44113.03664351852 | 46.706 |
| 44113.078310185185 | 46.068 |
| 44113.119976851856 | 45.431 |
| 44113.16164351852 | 44.756 |
| 44113.203310185185 | 44.138 |
| 44113.244976851856 | 43.559 |
| 44113.28664351852 | 42.864 |
| 44113.328310185185 | 42.188 |
| 44113.369976851856 | 41.841 |
| 44113.41164351852 | 42.246 |
| 44113.453310185185 | 43.404 |
| 44113.494976851856 | 45.18 |
| 44113.53664351852 | 46.455 |
| 44113.578310185185 | 46.551 |
| 44113.619976851856 | 46.223 |
| 44113.66164351852 | 47.574 |
| 44113.703310185185 | 48.018 |
| 44113.744976851856 | 48.54 |
| 44113.78664351852 | 48.829 |
| 44113.828310185185 | 49.119 |
| 44113.869976851856 | 49.485 |
| 44113.91164351852 | 49.621 |
| 44113.953310185185 | 49.254 |
| 44113.994976851856 | 48.752 |
| 44114.03664351852 | 48.192 |
| 44114.078310185185 | 47.613 |
| 44114.119976851856 | 47.034 |
| 44114.16164351852 | 46.397 |
| 44114.203310185185 | 45.798 |
| 44114.244976851856 | 45.142 |
| 44114.28664351852 | 44.428 |
| 44114.328310185185 | 43.733 |
| 44114.369976851856 | 43.366 |
| 44114.41164351852 | 43.655 |
| 44114.453310185185 | 44.872 |
| 44114.494976851856 | 46.59 |
| 44114.53664351852 | 48.018 |
| 44114.578310185185 | 48.868 |
| 44114.619976851856 | 48.443 |
| 44114.66164351852 | 49.717 |
| 44114.703310185185 | 50.258 |
| 44114.744976851856 | 50.76 |
| 44114.78664351852 | 50.991 |
| 44114.828310185185 | 51.011 |
| 44114.869976851856 | 50.875 |
| 44114.91164351852 | 50.547 |
| 44114.953310185185 | 50.065 |
| 44114.994976851856 | 49.485 |
| 44115.03664351852 | 48.829 |
| 44115.078310185185 | 48.115 |
| 44115.119976851856 | 47.323 |
| 44115.16164351852 | 46.648 |
| 44115.203310185185 | 46.068 |
| 44115.244976851856 | 45.644 |
| 44115.28664351852 | 45.007 |
| 44115.328310185185 | 44.428 |
| 44115.369976851856 | 44.215 |
| 44115.41164351852 | 44.37 |
| 44115.453310185185 | 44.524 |
| 44115.494976851856 | 44.389 |
| 44115.53664351852 | 43.964 |
| 44115.578310185185 | 42.845 |
| 44115.619976851856 | 41.648 |
| 44115.66164351852 | 41.242 |
| 44115.703310185185 | 41.59 |
| 44115.744976851856 | 41.57 |
| 44115.78664351852 | 41.068 |
| 44115.828310185185 | 40.238 |
| 44115.869976851856 | 39.621 |
| 44115.91164351852 | 39.196 |
| 44115.953310185185 | 38.887 |
| 44115.994976851856 | 38.52 |
| 44116.03664351852 | 38.134 |
| 44116.078310185185 | 37.709 |
| 44116.119976851856 | 37.246 |
| 44116.16164351852 | 36.783 |
| 44116.203310185185 | 36.358 |
| 44116.244976851856 | 35.933 |
| 44116.28664351852 | 35.566 |
| 44116.328310185185 | 35.296 |
| 44116.369976851856 | 35.393 |
| 44116.41164351852 | 36.242 |
| 44116.453310185185 | 37.844 |
| 44116.494976851856 | 39.91 |
| 44116.53664351852 | 41.532 |
| 44116.578310185185 | 42.516 |
| 44116.619976851856 | 43.346 |
| 44116.66164351852 | 44.196 |
| 44116.703310185185 | 44.891 |
| 44116.744976851856 | 45.103 |
| 44116.78664351852 | 45.161 |
| 44116.828310185185 | 45.123 |
| 44116.869976851856 | 45.026 |
| 44116.91164351852 | 44.794 |
| 44116.953310185185 | 44.389 |
| 44116.994976851856 | 43.848 |
| 44117.03664351852 | 43.115 |
| 44117.078310185185 | 42.574 |
| 44117.119976851856 | 41.995 |
| 44117.16164351852 | 41.493 |
| 44117.203310185185 | 41.011 |
| 44117.244976851856 | 40.431 |
| 44117.28664351852 | 39.833 |
| 44117.328310185185 | 39.312 |
| 44117.369976851856 | 39.234 |
| 44117.41164351852 | 39.814 |
| 44117.453310185185 | 41.088 |
| 44117.494976851856 | 42.825 |
| 44117.53664351852 | 44.215 |
| 44117.578310185185 | 45.007 |
| 44117.619976851856 | 45.721 |
| 44117.66164351852 | 46.551 |
| 44117.703310185185 | 47.13 |
| 44117.744976851856 | 47.15 |
| 44117.78664351852 | 47.053 |
| 44117.828310185185 | 47.072 |
| 44117.869976851856 | 47.111 |
| 44117.91164351852 | 46.937 |
| 44117.953310185185 | 46.609 |
| 44117.994976851856 | 46.03 |
| 44118.03664351852 | 45.393 |
| 44118.078310185185 | 44.852 |
| 44118.119976851856 | 44.292 |
| 44118.16164351852 | 43.848 |
| 44118.203310185185 | 43.52 |
| 44118.244976851856 | 43.192 |
| 44118.28664351852 | 42.883 |
| 44118.328310185185 | 42.42 |
| 44118.369976851856 | 42.362 |
| 44118.41164351852 | 42.845 |
| 44118.453310185185 | 44.119 |
| 44118.494976851856 | 45.682 |
| 44118.53664351852 | 46.899 |
| 44118.578310185185 | 47.555 |
| 44118.619976851856 | 48.057 |
| 44118.66164351852 | 48.597 |
| 44118.703310185185 | 48.829 |
| 44118.744976851856 | 48.887 |
| 44118.78664351852 | 48.81 |
| 44118.828310185185 | 48.655 |
| 44118.869976851856 | 48.462 |
| 44118.91164351852 | 48.038 |
| 44118.953310185185 | 47.574 |
| 44118.994976851856 | 46.957 |
| 44119.03664351852 | 46.319 |
| 44119.078310185185 | 45.624 |
| 44119.119976851856 | 44.968 |
| 44119.16164351852 | 44.428 |
| 44119.203310185185 | 43.771 |
| 44119.244976851856 | 42.96 |
| 44119.28664351852 | 42.188 |
| 44119.328310185185 | 41.339 |
| 44119.369976851856 | 41.03 |
| 44119.41164351852 | 41.03 |
| 44119.453310185185 | 41.686 |
| 44119.494976851856 | 42.787 |
| 44119.53664351852 | 43.559 |
| 44119.578310185185 | 43.81 |
| 44119.619976851856 | 43.733 |
| 44119.66164351852 | 43.752 |
| 44119.703310185185 | 43.52 |
| 44119.744976851856 | 43.095 |
| 44119.78664351852 | 42.787 |
| 44119.828310185185 | 42.651 |
| 44119.869976851856 | 42.458 |
| 44119.91164351852 | 42.092 |
| 44119.953310185185 | 41.551 |
| 44119.994976851856 | 40.875 |
| 44120.03664351852 | 40.122 |
| 44120.078310185185 | 39.466 |
| 44120.119976851856 | 38.829 |
| 44120.16164351852 | 38.269 |
| 44120.203310185185 | 37.806 |
| 44120.244976851856 | 37.343 |
| 44120.28664351852 | 36.86 |
| 44120.328310185185 | 36.377 |
| 44120.369976851856 | 36.358 |
| 44120.41164351852 | 36.899 |
| 44120.453310185185 | 38.153 |
| 44120.494976851856 | 39.91 |
| 44120.53664351852 | 41.088 |
| 44120.578310185185 | 41.493 |
| 44120.619976851856 | 41.956 |
| 44120.66164351852 | 42.613 |
| 44120.703310185185 | 43.038 |
| 44120.744976851856 | 43.057 |
| 44120.78664351852 | 43.153 |
| 44120.828310185185 | 43.211 |
| 44120.869976851856 | 43.192 |
| 44120.91164351852 | 43.211 |
| 44120.953310185185 | 43.076 |
| 44120.994976851856 | 42.806 |
| 44121.03664351852 | 42.381 |
| 44121.078310185185 | 41.918 |
| 44121.119976851856 | 41.358 |
| 44121.16164351852 | 41.088 |
| 44121.203310185185 | 40.837 |
| 44121.244976851856 | 40.489 |
| 44121.28664351852 | 40.065 |
| 44121.328310185185 | 39.601 |
| 44121.369976851856 | 39.659 |
| 44121.41164351852 | 40.219 |
| 44121.453310185185 | 40.702 |
| 44121.494976851856 | 40.837 |
| 44121.53664351852 | 42.439 |
| 44121.578310185185 | 43.231 |
| 44121.619976851856 | 44.466 |
| 44121.66164351852 | 44.485 |
| 44121.703310185185 | 44.64 |
| 44121.744976851856 | 44.273 |
| 44121.78664351852 | 43.964 |
| 44121.828310185185 | 43.79 |
| 44121.869976851856 | 43.829 |
| 44121.91164351852 | 43.848 |
| 44121.953310185185 | 43.79 |
| 44121.994976851856 | 43.597 |
| 44122.03664351852 | 43.269 |
| 44122.078310185185 | 42.883 |
| 44122.119976851856 | 42.574 |
| 44122.16164351852 | 42.285 |
| 44122.203310185185 | 42.053 |
| 44122.244976851856 | 41.802 |
| 44122.28664351852 | 41.512 |
| 44122.328310185185 | 41.088 |
| 44122.369976851856 | 40.991 |
| 44122.41164351852 | 41.319 |
| 44122.453310185185 | 42.767 |
| 44122.494976851856 | 44.08 |
| 44122.53664351852 | 44.659 |
| 44122.578310185185 | 45.914 |
| 44122.619976851856 | 46.667 |
| 44122.66164351852 | 46.976 |
| 44122.703310185185 | 46.648 |
| 44122.744976851856 | 46.821 |
| 44122.78664351852 | 47.13 |
| 44122.828310185185 | 47.285 |
| 44122.869976851856 | 47.401 |
| 44122.91164351852 | 47.265 |
| 44122.953310185185 | 47.072 |
| 44122.994976851856 | 46.763 |
| 44123.03664351852 | 46.204 |
| 44123.078310185185 | 45.567 |
| 44123.119976851856 | 44.833 |
| 44123.16164351852 | 44.196 |
| 44123.203310185185 | 43.636 |
| 44123.244976851856 | 43.173 |
| 44123.28664351852 | 42.709 |
| 44123.328310185185 | 42.072 |
| 44123.369976851856 | 41.706 |
| 44123.41164351852 | 42.034 |
| 44123.453310185185 | 43.115 |
| 44123.494976851856 | 44.64 |
| 44123.53664351852 | 45.316 |
| 44123.578310185185 | 45.123 |
| 44123.619976851856 | 45.393 |
| 44123.66164351852 | 46.725 |
| 44123.703310185185 | 47.092 |
| 44123.744976851856 | 47.362 |
| 44123.78664351852 | 47.304 |
| 44123.828310185185 | 47.265 |
| 44123.869976851856 | 47.362 |
| 44123.91164351852 | 47.439 |
| 44123.953310185185 | 47.092 |
| 44123.994976851856 | 46.358 |
| 44124.03664351852 | 45.663 |
| 44124.078310185185 | 44.968 |
| 44124.119976851856 | 44.331 |
| 44124.16164351852 | 43.617 |
| 44124.203310185185 | 42.98 |
| 44124.244976851856 | 42.323 |
| 44124.28664351852 | 41.667 |
| 44124.328310185185 | 41.068 |
| 44124.369976851856 | 40.644 |
| 44124.41164351852 | 41.146 |
| 44124.453310185185 | 42.285 |
| 44124.494976851856 | 43.829 |
| 44124.53664351852 | 44.949 |
| 44124.578310185185 | 45.316 |
| 44124.619976851856 | 45.586 |
| 44124.66164351852 | 46.242 |
| 44124.703310185185 | 46.628 |
| 44124.744976851856 | 46.744 |
| 44124.78664351852 | 46.725 |
| 44124.828310185185 | 46.783 |
| 44124.869976851856 | 46.686 |
| 44124.91164351852 | 46.455 |
| 44124.953310185185 | 45.991 |
| 44124.994976851856 | 45.431 |
| 44125.03664351852 | 44.794 |
| 44125.078310185185 | 44.234 |
| 44125.119976851856 | 43.655 |
| 44125.16164351852 | 42.999 |
| 44125.203310185185 | 42.458 |
| 44125.244976851856 | 41.821 |
| 44125.28664351852 | 41.223 |
| 44125.328310185185 | 40.567 |
| 44125.369976851856 | 40.084 |
| 44125.41164351852 | 40.451 |
| 44125.453310185185 | 41.59 |
| 44125.494976851856 | 43.153 |
| 44125.53664351852 | 44.312 |
| 44125.578310185185 | 44.775 |
| 44125.619976851856 | 45.18 |
| 44125.66164351852 | 45.798 |
| 44125.703310185185 | 46.126 |
| 44125.744976851856 | 46.223 |
| 44125.78664351852 | 46.319 |
| 44125.828310185185 | 46.242 |
| 44125.869976851856 | 46.068 |
| 44125.91164351852 | 45.798 |
| 44125.953310185185 | 45.47 |
| 44125.994976851856 | 44.929 |
| 44126.03664351852 | 44.292 |
| 44126.078310185185 | 43.733 |
| 44126.119976851856 | 43.211 |
| 44126.16164351852 | 42.651 |
| 44126.203310185185 | 42.053 |
| 44126.244976851856 | 41.628 |
| 44126.28664351852 | 41.03 |
| 44126.328310185185 | 40.47 |
| 44126.369976851856 | 40.065 |
| 44126.41164351852 | 40.47 |
| 44126.453310185185 | 41.397 |
| 44126.494976851856 | 43.231 |
| 44126.53664351852 | 44.466 |
| 44126.578310185185 | 44.929 |
| 44126.619976851856 | 45.412 |
| 44126.66164351852 | 45.74 |
| 44126.703310185185 | 46.088 |
| 44126.744976851856 | 46.088 |
| 44126.78664351852 | 45.953 |
| 44126.828310185185 | 45.76 |
| 44126.869976851856 | 45.509 |
| 44126.91164351852 | 45.219 |
| 44126.953310185185 | 44.756 |
| 44126.994976851856 | 44.119 |
| 44127.03664351852 | 43.559 |
| 44127.078310185185 | 42.806 |
| 44127.119976851856 | 42.15 |
| 44127.16164351852 | 41.532 |
| 44127.203310185185 | 40.76 |
| 44127.244976851856 | 39.872 |
| 44127.28664351852 | 39.041 |
| 44127.328310185185 | 38.231 |
| 44127.369976851856 | 37.999 |
| 44127.41164351852 | 38.173 |
| 44127.453310185185 | 38.868 |
| 44127.494976851856 | 39.563 |
| 44127.53664351852 | 40.354 |
| 44127.578310185185 | 41.204 |
| 44127.619976851856 | 41.802 |
| 44127.66164351852 | 42.227 |
| 44127.703310185185 | 42.748 |
| 44127.744976851856 | 42.941 |
| 44127.78664351852 | 42.941 |
| 44127.828310185185 | 42.96 |
| 44127.869976851856 | 42.999 |
| 44127.91164351852 | 43.095 |
| 44127.953310185185 | 43.018 |
| 44127.994976851856 | 42.941 |
| 44128.03664351852 | 42.574 |
| 44128.078310185185 | 42.227 |
| 44128.119976851856 | 41.918 |
| 44128.16164351852 | 41.59 |
| 44128.203310185185 | 41.358 |
| 44128.244976851856 | 40.972 |
| 44128.28664351852 | 40.586 |
| 44128.328310185185 | 40.219 |
| 44128.369976851856 | 39.968 |
| 44128.41164351852 | 40.219 |
| 44128.453310185185 | 40.489 |
| 44128.494976851856 | 42.825 |
| 44128.53664351852 | 44.292 |
| 44128.578310185185 | 45.316 |
| 44128.619976851856 | 46.146 |
| 44128.66164351852 | 46.068 |
| 44128.703310185185 | 46.339 |
| 44128.744976851856 | 46.57 |
| 44128.78664351852 | 46.59 |
| 44128.828310185185 | 46.416 |
| 44128.869976851856 | 46.223 |
| 44128.91164351852 | 45.991 |
| 44128.953310185185 | 45.451 |
| 44128.994976851856 | 44.987 |
| 44129.03664351852 | 44.621 |
| 44129.078310185185 | 44.312 |
| 44129.119976851856 | 44.196 |
| 44129.16164351852 | 43.848 |
| 44129.203310185185 | 43.52 |
| 44129.244976851856 | 43.057 |
| 44129.28664351852 | 42.787 |
| 44129.328310185185 | 42.574 |
| 44129.369976851856 | 42.381 |
| 44129.41164351852 | 42.439 |
| 44129.453310185185 | 42.574 |
| 44129.494976851856 | 42.98 |
| 44129.53664351852 | 42.651 |
| 44129.578310185185 | 41.706 |
| 44129.619976851856 | 40.605 |
| 44129.66164351852 | 39.505 |
| 44129.703310185185 | 38.25 |
| 44129.744976851856 | 36.744 |
| 44129.78664351852 | 35.315 |
| 44129.828310185185 | 34.331 |
| 44129.869976851856 | 33.675 |
| 44129.91164351852 | 33.153 |
| 44129.953310185185 | 32.767 |
| 44129.994976851856 | 32.4 |
| 44130.03664351852 | 32.169 |
| 44130.078310185185 | 32.014 |
| 44130.119976851856 | 32.092 |
| 44130.16164351852 | 32.053 |
| 44130.203310185185 | 32.034 |
| 44130.244976851856 | 32.053 |
| 44130.28664351852 | 32.053 |
| 44130.328310185185 | 32.034 |
| 44130.369976851856 | 32.072 |
| 44130.41164351852 | 32.092 |
| 44130.453310185185 | 32.072 |
| 44130.494976851856 | 32.072 |
| 44130.53664351852 | 32.323 |
| 44130.578310185185 | 32.825 |
| 44130.619976851856 | 33.327 |
| 44130.66164351852 | 33.308 |
| 44130.703310185185 | 33.076 |
| 44130.744976851856 | 32.883 |
| 44130.78664351852 | 32.632 |
| 44130.828310185185 | 32.246 |
| 44130.869976851856 | 32.149 |
| 44130.91164351852 | 31.995 |
| 44130.953310185185 | 32.034 |
| 44130.994976851856 | 32.014 |
| 44131.03664351852 | 32.053 |
| 44131.078310185185 | 32.053 |
| 44131.119976851856 | 32.034 |
| 44131.16164351852 | 32.072 |
| 44131.203310185185 | 32.034 |
| 44131.244976851856 | 32.092 |
| 44131.28664351852 | 32.034 |
| 44131.328310185185 | 32.053 |
| 44131.369976851856 | 32.092 |
| 44131.41164351852 | 32.072 |
| 44131.453310185185 | 32.111 |
| 44131.494976851856 | 32.111 |
| 44131.53664351852 | 32.729 |
| 44131.578310185185 | 33.115 |
| 44131.619976851856 | 33.115 |
| 44131.66164351852 | 33.095 |
| 44131.703310185185 | 32.729 |
| 44131.744976851856 | 32.285 |
| 44131.78664351852 | 32.034 |
| 44131.828310185185 | 32.034 |
| 44131.869976851856 | 32.246 |
| 44131.91164351852 | 32.439 |
| 44131.953310185185 | 32.613 |
| 44131.994976851856 | 32.651 |
| 44132.03664351852 | 32.555 |
| 44132.078310185185 | 32.362 |
| 44132.119976851856 | 32.072 |
| 44132.16164351852 | 31.956 |
| 44132.203310185185 | 32.072 |
| 44132.244976851856 | 32.034 |
| 44132.28664351852 | 32.072 |
| 44132.328310185185 | 32.034 |
| 44132.369976851856 | 32.053 |
| 44132.41164351852 | 32.034 |
| 44132.453310185185 | 32.246 |
| 44132.494976851856 | 33.018 |
| 44132.53664351852 | 34.157 |
| 44132.578310185185 | 34.852 |
| 44132.619976851856 | 35.142 |
| 44132.66164351852 | 35.238 |
| 44132.703310185185 | 35.431 |
| 44132.744976851856 | 35.991 |
| 44132.78664351852 | 36.435 |
| 44132.828310185185 | 36.705 |
| 44132.869976851856 | 36.956 |
| 44132.91164351852 | 36.918 |
| 44132.953310185185 | 36.628 |
| 44132.994976851856 | 36.3 |
| 44133.03664351852 | 35.933 |
| 44133.078310185185 | 35.547 |
| 44133.119976851856 | 35.277 |
| 44133.16164351852 | 34.987 |
| 44133.203310185185 | 34.678 |
| 44133.244976851856 | 34.292 |
| 44133.28664351852 | 33.868 |
| 44133.328310185185 | 33.501 |
| 44133.369976851856 | 33.269 |
| 44133.41164351852 | 33.694 |
| 44133.453310185185 | 34.698 |
| 44133.494976851856 | 36.126 |
| 44133.53664351852 | 37.304 |
| 44133.578310185185 | 37.883 |
| 44133.619976851856 | 38.443 |
| 44133.66164351852 | 39.119 |
| 44133.703310185185 | 39.678 |
| 44133.744976851856 | 39.833 |
| 44133.78664351852 | 39.968 |
| 44133.828310185185 | 40.007 |
| 44133.869976851856 | 39.91 |
| 44133.91164351852 | 39.659 |
| 44133.953310185185 | 39.312 |
| 44133.994976851856 | 38.79 |
| 44134.03664351852 | 38.231 |
| 44134.078310185185 | 37.709 |
| 44134.119976851856 | 37.285 |
| 44134.16164351852 | 36.899 |
| 44134.203310185185 | 36.551 |
| 44134.244976851856 | 36.049 |
| 44134.28664351852 | 35.451 |
| 44134.328310185185 | 35.007 |
| 44134.369976851856 | 34.64 |
| 44134.41164351852 | 34.91 |
| 44134.453310185185 | 35.933 |
| 44134.494976851856 | 37.246 |
| 44134.53664351852 | 38.385 |
| 44134.578310185185 | 38.945 |
| 44134.619976851856 | 39.485 |
| 44134.66164351852 | 40.142 |
| 44134.703310185185 | 40.644 |
| 44134.744976851856 | 40.76 |
| 44134.78664351852 | 40.856 |
| 44134.828310185185 | 40.779 |
| 44134.869976851856 | 40.663 |
| 44134.91164351852 | 40.354 |
| 44134.953310185185 | 39.833 |
| 44134.994976851856 | 39.254 |
| 44135.03664351852 | 38.829 |
| 44135.078310185185 | 38.308 |
| 44135.119976851856 | 37.806 |
| 44135.16164351852 | 37.439 |
| 44135.203310185185 | 36.976 |
| 44135.244976851856 | 36.474 |
| 44135.28664351852 | 35.972 |
| 44135.328310185185 | 35.489 |
| 44135.369976851856 | 35.161 |
| 44135.41164351852 | 35.586 |
| 44135.453310185185 | 36.705 |
| 44135.494976851856 | 38.134 |
| 44135.53664351852 | 39.234 |
| 44135.578310185185 | 39.736 |
| 44135.619976851856 | 40.161 |
| 44135.66164351852 | 40.663 |
| 44135.703310185185 | 41.088 |
| 44135.744976851856 | 41.281 |
| 44135.78664351852 | 41.319 |
| 44135.828310185185 | 41.223 |
| 44135.869976851856 | 40.972 |
| 44135.91164351852 | 40.547 |
| 44135.953310185185 | 40.065 |
| 44135.994976851856 | 39.466 |
| 44136.03664351852 | 38.964 |
| 44136.078310185185 | 38.462 |
| 44136.078310185185 | 37.922 |
| 44136.119976851856 | 37.439 |
| 44136.16164351852 | 36.879 |
| 44136.203310185185 | 36.358 |
| 44136.244976851856 | 35.76 |
| 44136.28664351852 | 35.277 |
| 44136.328310185185 | 34.891 |
| 44136.369976851856 | 35.2 |
| 44136.41164351852 | 36.184 |
| 44136.453310185185 | 37.555 |
| 44136.494976851856 | 38.655 |
| 44136.53664351852 | 39.254 |
| 44136.578310185185 | 39.717 |
| 44136.619976851856 | 40.412 |
| 44136.66164351852 | 41.107 |
| 44136.703310185185 | 41.358 |
| 44136.744976851856 | 41.474 |
| 44136.78664351852 | 41.455 |
| 44136.828310185185 | 41.339 |
| 44136.869976851856 | 40.953 |
| 44136.91164351852 | 40.451 |
| 44136.953310185185 | 39.891 |
| 44136.994976851856 | 39.37 |
| 44137.03664351852 | 38.848 |
| 44137.078310185185 | 38.385 |
| 44137.119976851856 | 37.902 |
| 44137.16164351852 | 37.381 |
| 44137.203310185185 | 36.86 |
| 44137.244976851856 | 36.319 |
| 44137.28664351852 | 35.798 |
| 44137.328310185185 | 35.509 |
| 44137.369976851856 | 35.76 |
| 44137.41164351852 | 36.802 |
| 44137.453310185185 | 38.134 |
| 44137.494976851856 | 39.234 |
| 44137.53664351852 | 39.717 |
| 44137.578310185185 | 40.219 |
| 44137.619976851856 | 40.914 |
| 44137.66164351852 | 41.512 |
| 44137.703310185185 | 41.744 |
| 44137.744976851856 | 41.918 |
| 44137.78664351852 | 41.937 |
| 44137.828310185185 | 41.802 |
| 44137.869976851856 | 41.339 |
| 44137.91164351852 | 40.837 |
| 44137.953310185185 | 40.316 |
| 44137.994976851856 | 39.852 |
| 44138.03664351852 | 39.408 |
| 44138.078310185185 | 38.964 |
| 44138.119976851856 | 38.52 |
| 44138.16164351852 | 38.095 |
| 44138.203310185185 | 37.632 |
| 44138.244976851856 | 37.13 |
| 44138.28664351852 | 36.628 |
| 44138.328310185185 | 36.339 |
| 44138.369976851856 | 36.59 |
| 44138.41164351852 | 37.632 |
| 44138.453310185185 | 39.099 |
| 44138.494976851856 | 39.949 |
| 44138.53664351852 | 39.756 |
| 44138.578310185185 | 40.528 |
| 44138.619976851856 | 41.165 |
| 44138.66164351852 | 41.995 |
| 44138.703310185185 | 42.42 |
| 44138.744976851856 | 42.478 |
| 44138.78664351852 | 42.188 |
| 44138.828310185185 | 41.821 |
| 44138.869976851856 | 41.358 |
| 44138.91164351852 | 40.953 |
| 44138.953310185185 | 40.451 |
| 44138.994976851856 | 39.949 |
| 44139.03664351852 | 39.563 |
| 44139.078310185185 | 39.099 |
| 44139.119976851856 | 38.733 |
| 44139.16164351852 | 38.327 |
| 44139.203310185185 | 37.922 |
| 44139.244976851856 | 37.497 |
| 44139.28664351852 | 37.13 |
| 44139.328310185185 | 36.802 |
| 44139.369976851856 | 36.899 |
| 44139.41164351852 | 37.902 |
| 44139.453310185185 | 39.35 |
| 44139.494976851856 | 40.489 |
| 44139.53664351852 | 41.126 |
| 44139.578310185185 | 41.667 |
| 44139.619976851856 | 42.169 |
| 44139.66164351852 | 42.632 |
| 44139.703310185185 | 42.941 |
| 44139.744976851856 | 43.076 |
| 44139.78664351852 | 42.883 |
| 44139.828310185185 | 42.536 |
| 44139.869976851856 | 42.15 |
| 44139.91164351852 | 41.783 |
| 44139.953310185185 | 41.358 |
| 44139.994976851856 | 40.895 |
| 44140.03664351852 | 40.393 |
| 44140.078310185185 | 39.968 |
| 44140.119976851856 | 39.505 |
| 44140.16164351852 | 39.099 |
| 44140.203310185185 | 38.559 |
| 44140.244976851856 | 37.999 |
| 44140.28664351852 | 37.458 |
| 44140.328310185185 | 37.188 |
| 44140.369976851856 | 37.4 |
| 44140.41164351852 | 38.346 |
| 44140.453310185185 | 39.64 |
| 44140.494976851856 | 40.624 |
| 44140.53664351852 | 41.146 |
| 44140.578310185185 | 41.609 |
| 44140.619976851856 | 42.188 |
| 44140.66164351852 | 42.69 |
| 44140.703310185185 | 42.96 |
| 44140.744976851856 | 43.018 |
| 44140.78664351852 | 42.98 |
| 44140.828310185185 | 42.729 |
| 44140.869976851856 | 42.362 |
| 44140.91164351852 | 41.879 |
| 44140.953310185185 | 41.358 |
| 44140.994976851856 | 40.76 |
| 44141.03664351852 | 40.296 |
| 44141.078310185185 | 39.852 |
| 44141.119976851856 | 39.331 |
| 44141.16164351852 | 38.752 |
| 44141.203310185185 | 38.173 |
| 44141.244976851856 | 37.574 |
| 44141.28664351852 | 37.092 |
| 44141.328310185185 | 36.841 |
| 44141.369976851856 | 37.072 |
| 44141.41164351852 | 37.729 |
| 44141.453310185185 | 38.655 |
| 44141.494976851856 | 39.292 |
| 44141.53664351852 | 39.389 |
| 44141.578310185185 | 39.987 |
| 44141.619976851856 | 40.528 |
| 44141.66164351852 | 41.03 |
| 44141.703310185185 | 41.242 |
| 44141.744976851856 | 41.397 |
| 44141.78664351852 | 41.397 |
| 44141.828310185185 | 41.397 |
| 44141.869976851856 | 41.184 |
| 44141.91164351852 | 41.03 |
| 44141.953310185185 | 40.721 |
| 44141.994976851856 | 40.451 |
| 44142.03664351852 | 40.18 |
| 44142.078310185185 | 39.949 |
| 44142.119976851856 | 39.717 |
| 44142.16164351852 | 39.37 |
| 44142.203310185185 | 38.926 |
| 44142.244976851856 | 38.501 |
| 44142.28664351852 | 38.095 |
| 44142.328310185185 | 37.98 |
| 44142.369976851856 | 38.288 |
| 44142.41164351852 | 38.52 |
| 44142.453310185185 | 40.103 |
| 44142.494976851856 | 40.779 |
| 44142.53664351852 | 40.895 |
| 44142.578310185185 | 40.991 |
| 44142.619976851856 | 41.899 |
| 44142.66164351852 | 42.4 |
| 44142.703310185185 | 42.574 |
| 44142.744976851856 | 42.709 |
| 44142.78664351852 | 42.69 |
| 44142.828310185185 | 42.748 |
| 44142.869976851856 | 42.594 |
| 44142.91164351852 | 42.42 |
| 44142.953310185185 | 42.246 |
| 44142.994976851856 | 42.13 |
| 44143.03664351852 | 41.918 |
| 44143.078310185185 | 41.435 |
| 44143.119976851856 | 40.644 |
| 44143.16164351852 | 40.007 |
| 44143.203310185185 | 39.563 |
| 44143.244976851856 | 38.887 |
| 44143.28664351852 | 38.385 |
| 44143.328310185185 | 37.806 |
| 44143.369976851856 | 37.69 |
| 44143.41164351852 | 38.346 |
| 44143.453310185185 | 39.37 |
| 44143.494976851856 | 40.142 |
| 44143.53664351852 | 40.451 |
| 44143.578310185185 | 40.528 |
| 44143.619976851856 | 40.721 |
| 44143.66164351852 | 40.856 |
| 44143.703310185185 | 41.204 |
| 44143.744976851856 | 41.223 |
| 44143.78664351852 | 40.991 |
| 44143.828310185185 | 40.663 |
| 44143.869976851856 | 40.373 |
| 44143.91164351852 | 40.065 |
| 44143.953310185185 | 39.698 |
| 44143.994976851856 | 39.099 |
| 44144.03664351852 | 38.81 |
| 44144.078310185185 | 38.366 |
| 44144.119976851856 | 37.98 |
| 44144.16164351852 | 37.729 |
| 44144.203310185185 | 37.227 |
| 44144.244976851856 | 36.86 |
| 44144.28664351852 | 36.397 |
| 44144.328310185185 | 36.165 |
| 44144.369976851856 | 36.107 |
| 44144.41164351852 | 36.126 |
| 44144.453310185185 | 36.532 |
| 44144.494976851856 | 36.918 |
| 44144.53664351852 | 36.86 |
| 44144.578310185185 | 36.725 |
| 44144.619976851856 | 36.744 |
| 44144.66164351852 | 37.014 |
| 44144.703310185185 | 37.034 |
| 44144.744976851856 | 37.014 |
| 44144.78664351852 | 36.841 |
| 44144.828310185185 | 36.744 |
| 44144.869976851856 | 36.667 |
| 44144.91164351852 | 36.3 |
| 44144.953310185185 | 36.049 |
| 44144.994976851856 | 35.837 |
| 44145.03664351852 | 35.605 |
| 44145.078310185185 | 35.431 |
| 44145.119976851856 | 35.142 |
| 44145.16164351852 | 34.891 |
| 44145.203310185185 | 34.601 |
| 44145.244976851856 | 34.273 |
| 44145.28664351852 | 33.983 |
| 44145.328310185185 | 33.752 |
| 44145.369976851856 | 33.926 |
| 44145.41164351852 | 33.945 |
| 44145.453310185185 | 35.103 |
| 44145.494976851856 | 36.358 |
| 44145.53664351852 | 36.512 |
| 44145.578310185185 | 36.57 |
| 44145.619976851856 | 36.744 |
| 44145.66164351852 | 36.551 |
| 44145.703310185185 | 36.57 |
| 44145.744976851856 | 36.686 |
| 44145.78664351852 | 36.783 |
| 44145.828310185185 | 36.802 |
| 44145.869976851856 | 36.397 |
| 44145.91164351852 | 35.837 |
| 44145.953310185185 | 35.373 |
| 44145.994976851856 | 35.103 |
| 44146.03664351852 | 34.64 |
| 44146.078310185185 | 34.08 |
| 44146.119976851856 | 33.597 |
| 44146.16164351852 | 33.057 |
| 44146.203310185185 | 32.497 |
| 44146.244976851856 | 31.976 |
| 44146.28664351852 | 32.072 |
| 44146.328310185185 | 31.995 |
| 44146.369976851856 | 32.014 |
| 44146.41164351852 | 32.439 |
| 44146.453310185185 | 33.346 |
| 44146.494976851856 | 34.408 |
| 44146.53664351852 | 34.891 |
| 44146.578310185185 | 34.929 |
| 44146.619976851856 | 34.601 |
| 44146.66164351852 | 34.37 |
| 44146.703310185185 | 34.987 |
| 44146.744976851856 | 35.489 |
| 44146.78664351852 | 35.721 |
| 44146.828310185185 | 35.972 |
| 44146.869976851856 | 35.991 |
| 44146.91164351852 | 35.837 |
| 44146.953310185185 | 35.682 |
| 44146.994976851856 | 35.528 |
| 44147.03664351852 | 35.238 |
| 44147.078310185185 | 35.103 |
| 44147.119976851856 | 34.871 |
| 44147.16164351852 | 34.756 |
| 44147.203310185185 | 34.408 |
| 44147.244976851856 | 33.713 |
| 44147.28664351852 | 33.095 |
| 44147.328310185185 | 32.96 |
| 44147.369976851856 | 33.018 |
| 44147.41164351852 | 33.694 |
| 44147.453310185185 | 34.698 |
| 44147.494976851856 | 35.258 |
| 44147.53664351852 | 35.528 |
| 44147.578310185185 | 35.779 |
| 44147.619976851856 | 35.991 |
| 44147.66164351852 | 35.953 |
| 44147.703310185185 | 35.972 |
| 44147.744976851856 | 35.991 |
| 44147.78664351852 | 35.798 |
| 44147.828310185185 | 35.489 |
| 44147.869976851856 | 34.987 |
| 44147.91164351852 | 34.408 |
| 44147.953310185185 | 33.752 |
| 44147.994976851856 | 33.211 |
| 44148.03664351852 | 32.729 |
| 44148.078310185185 | 32.304 |
| 44148.119976851856 | 32.034 |
| 44148.16164351852 | 32.053 |
| 44148.203310185185 | 32.072 |
| 44148.244976851856 | 32.072 |
| 44148.28664351852 | 32.053 |
| 44148.328310185185 | 32.072 |
| 44148.369976851856 | 32.014 |
| 44148.41164351852 | 32.13 |
| 44148.453310185185 | 32.651 |
| 44148.494976851856 | 33.617 |
| 44148.53664351852 | 34.273 |
| 44148.578310185185 | 34.447 |
| 44148.619976851856 | 34.485 |
| 44148.66164351852 | 34.312 |
| 44148.703310185185 | 34.003 |
| 44148.744976851856 | 34.292 |
| 44148.78664351852 | 34.987 |
| 44148.828310185185 | 35.586 |
| 44148.869976851856 | 35.875 |
| 44148.91164351852 | 35.933 |
| 44148.953310185185 | 36.126 |
| 44148.994976851856 | 36.184 |
| 44149.03664351852 | 36.107 |
| 44149.078310185185 | 36.068 |
| 44149.119976851856 | 36.165 |
| 44149.16164351852 | 36.126 |
| 44149.203310185185 | 35.991 |
| 44149.244976851856 | 35.875 |
| 44149.28664351852 | 35.315 |
| 44149.328310185185 | 34.91 |
| 44149.369976851856 | 33.52 |
| 44149.41164351852 | 33.211 |
| 44149.453310185185 | 32.825 |
| 44149.494976851856 | 32.42 |
| 44149.53664351852 | 32.98 |
| 44149.578310185185 | 33.308 |
| 44149.619976851856 | 32.497 |
| 44149.66164351852 | 32.053 |
| 44149.703310185185 | 32.034 |
| 44149.744976851856 | 32.034 |
| 44149.78664351852 | 32.053 |
| 44149.828310185185 | 32.034 |
| 44149.869976851856 | 32.053 |
| 44149.91164351852 | 32.034 |
| 44149.953310185185 | 32.053 |
| 44149.994976851856 | 32.034 |
| 44150.03664351852 | 32.053 |
| 44150.078310185185 | 32.014 |
| 44150.119976851856 | 32.072 |
| 44150.16164351852 | 32.072 |
| 44150.203310185185 | 32.053 |
| 44150.244976851856 | 32.014 |
| 44150.28664351852 | 32.072 |
| 44150.328310185185 | 32.072 |
| 44150.369976851856 | 32.053 |
| 44150.41164351852 | 32.092 |
| 44150.453310185185 | 32.188 |
| 44150.494976851856 | 32.343 |
| 44150.53664351852 | 32.439 |
| 44150.578310185185 | 32.844 |
| 44150.619976851856 | 33.327 |
| 44150.66164351852 | 33.327 |
| 44150.703310185185 | 33.134 |
| 44150.744976851856 | 32.941 |
| 44150.78664351852 | 32.864 |
| 44150.828310185185 | 33.366 |
| 44150.869976851856 | 34.389 |
| 44150.91164351852 | 35.335 |
| 44150.953310185185 | 36.01 |
| 44150.994976851856 | 36.474 |
| 44151.03664351852 | 36.648 |
| 44151.078310185185 | 36.667 |
| 44151.119976851856 | 36.763 |
| 44151.16164351852 | 36.86 |
| 44151.203310185185 | 36.86 |
| 44151.244976851856 | 36.802 |
| 44151.28664351852 | 36.609 |
| 44151.328310185185 | 36.512 |
| 44151.369976851856 | 36.609 |
| 44151.41164351852 | 37.362 |
| 44151.453310185185 | 38.462 |
| 44151.494976851856 | 39.234 |
| 44151.53664351852 | 39.582 |
| 44151.578310185185 | 39.891 |
| 44151.619976851856 | 40.431 |
| 44151.66164351852 | 40.74 |
| 44151.703310185185 | 40.933 |
| 44151.744976851856 | 40.837 |
| 44151.78664351852 | 40.586 |
| 44151.828310185185 | 40.258 |
| 44151.869976851856 | 39.814 |
| 44151.91164351852 | 39.234 |
| 44151.953310185185 | 38.617 |
| 44151.994976851856 | 38.038 |
| 44152.03664351852 | 37.458 |
| 44152.078310185185 | 36.976 |
| 44152.119976851856 | 36.532 |
| 44152.16164351852 | 36.01 |
| 44152.203310185185 | 35.586 |
| 44152.244976851856 | 35.084 |
| 44152.28664351852 | 34.582 |
| 44152.328310185185 | 34.292 |
| 44152.369976851856 | 34.466 |
| 44152.41164351852 | 35.161 |
| 44152.453310185185 | 36.204 |
| 44152.494976851856 | 37.149 |
| 44152.53664351852 | 37.574 |
| 44152.578310185185 | 37.864 |
| 44152.619976851856 | 38.327 |
| 44152.66164351852 | 38.829 |
| 44152.703310185185 | 39.08 |
| 44152.744976851856 | 39.196 |
| 44152.78664351852 | 39.215 |
| 44152.828310185185 | 39.196 |
| 44152.869976851856 | 39.022 |
| 44152.91164351852 | 38.694 |
| 44152.953310185185 | 38.269 |
| 44152.994976851856 | 37.844 |
| 44153.03664351852 | 37.516 |
| 44153.078310185185 | 37.265 |
| 44153.119976851856 | 37.072 |
| 44153.16164351852 | 36.802 |
| 44153.203310185185 | 36.57 |
| 44153.244976851856 | 36.223 |
| 44153.28664351852 | 35.933 |
| 44153.328310185185 | 35.817 |
| 44153.369976851856 | 36.165 |
| 44153.41164351852 | 36.686 |
| 44153.453310185185 | 37.632 |
| 44153.494976851856 | 38.655 |
| 44153.53664351852 | 39.698 |
| 44153.578310185185 | 40.103 |
| 44153.619976851856 | 40.18 |
| 44153.66164351852 | 40.586 |
| 44153.703310185185 | 40.779 |
| 44153.744976851856 | 40.875 |
| 44153.78664351852 | 40.779 |
| 44153.828310185185 | 40.74 |
| 44153.869976851856 | 40.605 |
| 44153.91164351852 | 40.373 |
| 44153.953310185185 | 40.045 |
| 44153.994976851856 | 39.756 |
| 44154.03664351852 | 39.389 |
| 44154.078310185185 | 39.119 |
| 44154.119976851856 | 38.868 |
| 44154.16164351852 | 38.636 |
| 44154.203310185185 | 38.443 |
| 44154.244976851856 | 38.095 |
| 44154.28664351852 | 37.825 |
| 44154.328310185185 | 37.594 |
| 44154.369976851856 | 37.787 |
| 44154.41164351852 | 38.443 |
| 44154.453310185185 | 39.447 |
| 44154.494976851856 | 40.2 |
| 44154.53664351852 | 40.47 |
| 44154.578310185185 | 40.644 |
| 44154.619976851856 | 40.895 |
| 44154.66164351852 | 41.146 |
| 44154.703310185185 | 41.377 |
| 44154.744976851856 | 41.397 |
| 44154.78664351852 | 41.261 |
| 44154.828310185185 | 41.068 |
| 44154.869976851856 | 40.605 |
| 44154.91164351852 | 39.968 |
| 44154.953310185185 | 39.234 |
| 44154.994976851856 | 38.559 |
| 44155.03664351852 | 37.98 |
| 44155.078310185185 | 37.478 |
| 44155.119976851856 | 37.092 |
| 44155.16164351852 | 36.802 |
| 44155.203310185185 | 36.455 |
| 44155.244976851856 | 36.165 |
| 44155.28664351852 | 35.76 |
| 44155.328310185185 | 35.509 |
| 44155.369976851856 | 35.509 |
| 44155.41164351852 | 35.933 |
| 44155.453310185185 | 37.072 |
| 44155.494976851856 | 38.038 |
| 44155.53664351852 | 38.539 |
| 44155.578310185185 | 38.501 |
| 44155.619976851856 | 38.868 |
| 44155.66164351852 | 39.563 |
| 44155.703310185185 | 39.872 |
| 44155.744976851856 | 39.891 |
| 44155.78664351852 | 39.929 |
| 44155.828310185185 | 39.872 |
| 44155.869976851856 | 39.64 |
| 44155.91164351852 | 39.35 |
| 44155.953310185185 | 38.983 |
| 44155.994976851856 | 38.617 |
| 44156.03664351852 | 38.366 |
| 44156.078310185185 | 38.134 |
| 44156.119976851856 | 37.941 |
| 44156.16164351852 | 37.709 |
| 44156.203310185185 | 37.4 |
| 44156.244976851856 | 37.072 |
| 44156.28664351852 | 36.879 |
| 44156.328310185185 | 36.667 |
| 44156.369976851856 | 36.725 |
| 44156.41164351852 | 36.899 |
| 44156.453310185185 | 37.343 |
| 44156.494976851856 | 37.941 |
| 44156.53664351852 | 38.559 |
| 44156.578310185185 | 38.79 |
| 44156.619976851856 | 39.138 |
| 44156.66164351852 | 39.003 |
| 44156.703310185185 | 38.733 |
| 44156.744976851856 | 38.462 |
| 44156.78664351852 | 38.269 |
| 44156.828310185185 | 38.134 |
| 44156.869976851856 | 37.96 |
| 44156.91164351852 | 37.632 |
| 44156.953310185185 | 37.285 |
| 44156.994976851856 | 36.783 |
| 44157.03664351852 | 36.204 |
| 44157.078310185185 | 35.566 |
| 44157.119976851856 | 35.045 |
| 44157.16164351852 | 34.408 |
| 44157.203310185185 | 33.771 |
| 44157.244976851856 | 33.095 |
| 44157.28664351852 | 32.555 |
| 44157.328310185185 | 32.072 |
| 44157.369976851856 | 32.111 |
| 44157.41164351852 | 32.709 |
| 44157.453310185185 | 33.79 |
| 44157.494976851856 | 34.698 |
| 44157.53664351852 | 34.929 |
| 44157.578310185185 | 34.891 |
| 44157.619976851856 | 34.678 |
| 44157.66164351852 | 34.852 |
| 44157.703310185185 | 35.373 |
| 44157.744976851856 | 35.702 |
| 44157.78664351852 | 35.933 |
| 44157.828310185185 | 36.126 |
| 44157.869976851856 | 36.319 |
| 44157.91164351852 | 36.455 |
| 44157.953310185185 | 36.551 |
| 44157.994976851856 | 36.512 |
| 44158.03664351852 | 36.281 |
| 44158.078310185185 | 36.107 |
| 44158.119976851856 | 35.895 |
| 44158.16164351852 | 35.953 |
| 44158.203310185185 | 35.875 |
| 44158.244976851856 | 35.798 |
| 44158.28664351852 | 35.566 |
| 44158.328310185185 | 35.451 |
| 44158.369976851856 | 35.624 |
| 44158.41164351852 | 36.648 |
| 44158.453310185185 | 38.057 |
| 44158.494976851856 | 39.157 |
| 44158.53664351852 | 39.428 |
| 44158.578310185185 | 39.428 |
| 44158.619976851856 | 39.505 |
| 44158.66164351852 | 39.794 |
| 44158.703310185185 | 39.949 |
| 44158.744976851856 | 40.007 |
| 44158.78664351852 | 40.007 |
| 44158.828310185185 | 39.987 |
| 44158.869976851856 | 39.736 |
| 44158.91164351852 | 39.35 |
| 44158.953310185185 | 38.906 |
| 44158.994976851856 | 38.79 |
| 44159.03664351852 | 38.733 |
| 44159.078310185185 | 38.482 |
| 44159.119976851856 | 37.574 |
| 44159.16164351852 | 36.744 |
| 44159.203310185185 | 36.358 |
| 44159.244976851856 | 35.644 |
| 44159.28664351852 | 35.084 |
| 44159.328310185185 | 34.408 |
| 44159.369976851856 | 34.061 |
| 44159.41164351852 | 34.041 |
| 44159.453310185185 | 34.234 |
| 44159.494976851856 | 34.601 |
| 44159.53664351852 | 35.161 |
| 44159.578310185185 | 35.547 |
| 44159.619976851856 | 35.084 |
| 44159.66164351852 | 35.007 |
| 44159.703310185185 | 35.007 |
| 44159.744976851856 | 34.929 |
| 44159.78664351852 | 34.814 |
| 44159.828310185185 | 34.756 |
| 44159.869976851856 | 34.736 |
| 44159.91164351852 | 34.563 |
| 44159.953310185185 | 34.331 |
| 44159.994976851856 | 33.868 |
| 44160.03664351852 | 33.385 |
| 44160.078310185185 | 32.883 |
| 44160.119976851856 | 32.439 |
| 44160.16164351852 | 32.053 |
| 44160.203310185185 | 32.072 |
| 44160.244976851856 | 32.034 |
| 44160.28664351852 | 32.034 |
| 44160.328310185185 | 32.053 |
| 44160.369976851856 | 32.053 |
| 44160.41164351852 | 32.111 |
| 44160.453310185185 | 32.4 |
| 44160.494976851856 | 33.037 |
| 44160.53664351852 | 33.462 |
| 44160.578310185185 | 33.52 |
| 44160.619976851856 | 33.327 |
| 44160.66164351852 | 32.922 |
| 44160.703310185185 | 32.729 |
| 44160.744976851856 | 32.806 |
| 44160.78664351852 | 32.98 |
| 44160.828310185185 | 33.25 |
| 44160.869976851856 | 33.25 |
| 44160.91164351852 | 33.134 |
| 44160.953310185185 | 32.941 |
| 44160.994976851856 | 32.709 |
| 44161.03664351852 | 32.4 |
| 44161.078310185185 | 32.111 |
| 44161.119976851856 | 32.072 |
| 44161.16164351852 | 32.053 |
| 44161.203310185185 | 32.034 |
| 44161.244976851856 | 32.092 |
| 44161.28664351852 | 32.014 |
| 44161.328310185185 | 32.072 |
| 44161.369976851856 | 32.053 |
| 44161.41164351852 | 32.092 |
| 44161.453310185185 | 32.362 |
| 44161.494976851856 | 32.922 |
| 44161.53664351852 | 33.288 |
| 44161.578310185185 | 33.404 |
| 44161.619976851856 | 33.52 |
| 44161.66164351852 | 33.462 |
| 44161.703310185185 | 33.192 |
| 44161.744976851856 | 33.076 |
| 44161.78664351852 | 33.346 |
| 44161.828310185185 | 33.482 |
| 44161.869976851856 | 33.443 |
| 44161.91164351852 | 33.385 |
| 44161.953310185185 | 33.288 |
| 44161.994976851856 | 32.922 |
| 44162.03664351852 | 32.536 |
| 44162.078310185185 | 32.053 |
| 44162.119976851856 | 32.034 |
| 44162.16164351852 | 32.014 |
| 44162.203310185185 | 32.014 |
| 44162.244976851856 | 32.034 |
| 44162.28664351852 | 32.034 |
| 44162.328310185185 | 32.034 |
| 44162.369976851856 | 32.072 |
| 44162.41164351852 | 32.092 |
| 44162.453310185185 | 32.092 |
| 44162.494976851856 | 32.381 |
| 44162.53664351852 | 32.729 |
| 44162.578310185185 | 32.806 |
| 44162.619976851856 | 32.671 |
| 44162.66164351852 | 32.149 |
| 44162.703310185185 | 32.034 |
| 44162.744976851856 | 31.995 |
| 44162.78664351852 | 32.053 |
| 44162.828310185185 | 32.053 |
| 44162.869976851856 | 32.053 |
| 44162.91164351852 | 32.053 |
| 44162.953310185185 | 32.053 |
| 44162.994976851856 | 32.053 |
| 44163.03664351852 | 32.053 |
| 44163.078310185185 | 32.072 |
| 44163.119976851856 | 32.053 |
| 44163.16164351852 | 32.092 |
| 44163.203310185185 | 32.072 |
| 44163.244976851856 | 32.053 |
| 44163.28664351852 | 32.053 |
| 44163.328310185185 | 32.053 |
| 44163.369976851856 | 32.072 |
| 44163.41164351852 | 32.092 |
| 44163.453310185185 | 32.111 |
| 44163.494976851856 | 32.111 |
| 44163.53664351852 | 32.072 |
| 44163.578310185185 | 32.111 |
| 44163.619976851856 | 32.169 |
| 44163.66164351852 | 32.034 |
| 44163.703310185185 | 31.976 |
| 44163.744976851856 | 32.034 |
| 44163.78664351852 | 32.053 |
| 44163.828310185185 | 32.053 |
| 44163.869976851856 | 32.034 |
| 44163.91164351852 | 32.072 |
| 44163.953310185185 | 32.014 |
| 44163.994976851856 | 32.053 |
| 44164.03664351852 | 32.034 |
| 44164.078310185185 | 32.014 |
| 44164.119976851856 | 32.053 |
| 44164.16164351852 | 32.072 |
| 44164.203310185185 | 32.053 |
| 44164.244976851856 | 32.053 |
| 44164.28664351852 | 32.034 |
| 44164.328310185185 | 32.034 |
| 44164.369976851856 | 32.053 |
| 44164.41164351852 | 32.034 |
| 44164.453310185185 | 32.014 |
| 44164.494976851856 | 32.092 |
| 44164.53664351852 | 32.034 |
| 44164.578310185185 | 32.053 |
| 44164.619976851856 | 32.034 |
| 44164.66164351852 | 32.014 |
| 44164.703310185185 | 32.034 |
| 44164.744976851856 | 32.072 |
| 44164.78664351852 | 32.014 |
| 44164.828310185185 | 32.053 |
| 44164.869976851856 | 32.034 |
| 44164.91164351852 | 32.014 |
| 44164.953310185185 | 32.014 |
| 44164.994976851856 | 32.034 |
| 44165.03664351852 | 32.072 |
| 44165.078310185185 | 32.034 |
| 44165.119976851856 | 32.072 |
| 44165.16164351852 | 32.072 |
| 44165.203310185185 | 32.053 |
| 44165.244976851856 | 32.014 |
| 44165.28664351852 | 32.053 |
| 44165.328310185185 | 32.014 |
| 44165.369976851856 | 32.034 |
| 44165.41164351852 | 32.072 |
| 44165.453310185185 | 32.053 |
| 44165.494976851856 | 32.034 |
| 44165.53664351852 | 32.072 |
| 44165.578310185185 | 32.053 |
| 44165.619976851856 | 32.014 |
| 44165.66164351852 | 32.053 |
| 44165.703310185185 | 32.072 |
| 44165.744976851856 | 32.014 |
| 44165.78664351852 | 32.053 |
| 44165.828310185185 | 32.034 |
| 44165.869976851856 | 32.053 |
| 44165.91164351852 | 32.072 |
| 44165.953310185185 | 32.053 |
| 44165.994976851856 | 32.053 |
| 44166.03664351852 | 32.034 |
| 44166.078310185185 | 32.053 |
| 44166.119976851856 | 32.034 |
| 44166.16164351852 | 32.053 |
| 44166.203310185185 | 32.053 |
| 44166.244976851856 | 31.995 |
| 44166.28664351852 | 32.034 |
| 44166.328310185185 | 32.053 |
| 44166.369976851856 | 32.034 |
| 44166.41164351852 | 32.014 |
| 44166.453310185185 | 32.072 |
| 44166.494976851856 | 32.053 |
| 44166.53664351852 | 32.053 |
| 44166.578310185185 | 32.034 |
| 44166.619976851856 | 31.995 |
| 44166.66164351852 | 32.072 |
| 44166.703310185185 | 32.053 |
| 44166.744976851856 | 32.034 |
| 44166.78664351852 | 32.053 |
| 44166.828310185185 | 32.072 |
| 44166.869976851856 | 32.014 |
| 44166.91164351852 | 32.034 |
| 44166.953310185185 | 32.053 |
| 44166.994976851856 | 32.014 |
| 44167.03664351852 | 32.053 |
| 44167.078310185185 | 32.053 |
| 44167.119976851856 | 32.034 |
| 44167.16164351852 | 32.014 |
| 44167.203310185185 | 32.072 |
| 44167.244976851856 | 32.034 |
| 44167.28664351852 | 32.092 |
| 44167.328310185185 | 32.034 |
| 44167.369976851856 | 32.034 |
| 44167.41164351852 | 32.014 |
| 44167.453310185185 | 32.053 |
| 44167.494976851856 | 32.034 |
| 44167.53664351852 | 32.014 |
| 44167.578310185185 | 32.092 |
| 44167.619976851856 | 32.053 |
| 44167.66164351852 | 32.034 |
| 44167.703310185185 | 32.014 |
| 44167.744976851856 | 32.014 |
| 44167.78664351852 | 32.053 |
| 44167.828310185185 | 32.034 |
| 44167.869976851856 | 32.053 |
| 44167.91164351852 | 32.034 |
| 44167.953310185185 | 32.034 |
| 44167.994976851856 | 32.053 |
| 44168.03664351852 | 32.053 |
| 44168.078310185185 | 32.014 |
| 44168.119976851856 | 32.053 |
| 44168.16164351852 | 32.053 |
| 44168.203310185185 | 32.034 |
| 44168.244976851856 | 32.014 |
| 44168.28664351852 | 32.034 |
| 44168.328310185185 | 32.053 |
| 44168.369976851856 | 32.034 |
| 44168.41164351852 | 32.034 |
| 44168.453310185185 | 32.034 |
| 44168.494976851856 | 32.072 |
| 44168.53664351852 | 32.034 |
| 44168.578310185185 | 32.034 |
| 44168.619976851856 | 32.034 |
| 44168.66164351852 | 32.053 |
| 44168.703310185185 | 32.072 |
| 44168.744976851856 | 32.053 |
| 44168.78664351852 | 32.034 |
| 44168.828310185185 | 32.053 |
| 44168.869976851856 | 32.072 |
| 44168.91164351852 | 32.053 |
| 44168.953310185185 | 32.092 |
| 44168.994976851856 | 32.092 |
| 44169.03664351852 | 32.014 |
| 44169.078310185185 | 32.072 |
| 44169.119976851856 | 32.072 |
| 44169.16164351852 | 32.034 |
| 44169.203310185185 | 32.072 |
| 44169.244976851856 | 32.072 |
| 44169.28664351852 | 32.014 |
| 44169.328310185185 | 32.092 |
| 44169.369976851856 | 32.053 |
| 44169.41164351852 | 32.014 |
| 44169.453310185185 | 32.034 |
| 44169.494976851856 | 32.072 |
| 44169.53664351852 | 32.034 |
| 44169.578310185185 | 32.053 |
| 44169.619976851856 | 32.072 |
| 44169.66164351852 | 32.034 |
| 44169.703310185185 | 32.053 |
| 44169.744976851856 | 32.034 |
| 44169.78664351852 | 32.092 |
| 44169.828310185185 | 32.053 |
| 44169.869976851856 | 32.034 |
| 44169.91164351852 | 32.053 |
| 44169.953310185185 | 32.053 |
| 44169.994976851856 | 32.034 |
| 44170.03664351852 | 32.053 |
| 44170.078310185185 | 32.034 |
| 44170.119976851856 | 32.053 |
| 44170.16164351852 | 32.053 |
| 44170.203310185185 | 32.034 |
| 44170.244976851856 | 32.034 |
| 44170.28664351852 | 32.034 |
| 44170.328310185185 | 32.072 |
| 44170.369976851856 | 32.053 |
| 44170.41164351852 | 32.034 |
| 44170.453310185185 | 32.034 |
| 44170.494976851856 | 32.034 |
| 44170.53664351852 | 32.034 |
| 44170.578310185185 | 32.072 |
| 44170.619976851856 | 32.072 |
| 44170.66164351852 | 32.053 |
| 44170.703310185185 | 32.053 |
| 44170.744976851856 | 32.014 |
| 44170.78664351852 | 32.053 |
| 44170.828310185185 | 32.034 |
| 44170.869976851856 | 32.014 |
| 44170.91164351852 | 32.053 |
| 44170.953310185185 | 32.053 |
| 44170.994976851856 | 32.053 |
| 44171.03664351852 | 32.072 |
| 44171.078310185185 | 32.053 |
| 44171.119976851856 | 32.014 |
| 44171.16164351852 | 32.034 |
| 44171.203310185185 | 32.034 |
| 44171.244976851856 | 32.034 |
| 44171.28664351852 | 32.053 |
| 44171.328310185185 | 32.072 |
| 44171.369976851856 | 32.072 |
| 44171.41164351852 | 32.053 |
| 44171.453310185185 | 32.034 |
| 44171.494976851856 | 32.053 |
| 44171.53664351852 | 32.111 |
| 44171.578310185185 | 32.053 |
| 44171.619976851856 | 32.072 |
| 44171.66164351852 | 32.053 |
| 44171.703310185185 | 32.034 |
| 44171.744976851856 | 32.053 |
| 44171.78664351852 | 32.053 |
| 44171.828310185185 | 32.034 |
| 44171.869976851856 | 32.072 |
| 44171.91164351852 | 32.072 |
| 44171.953310185185 | 32.092 |
| 44171.994976851856 | 32.034 |
| 44172.03664351852 | 32.034 |
| 44172.078310185185 | 32.034 |
| 44172.119976851856 | 32.034 |
| 44172.16164351852 | 32.053 |
| 44172.203310185185 | 32.072 |
| 44172.244976851856 | 32.014 |
| 44172.28664351852 | 32.053 |
| 44172.328310185185 | 32.014 |
| 44172.369976851856 | 32.053 |
| 44172.41164351852 | 31.995 |
| 44172.453310185185 | 32.053 |
| 44172.494976851856 | 32.092 |
| 44172.53664351852 | 32.072 |
| 44172.578310185185 | 32.053 |
| 44172.619976851856 | 32.053 |
| 44172.66164351852 | 32.053 |
| 44172.703310185185 | 32.072 |
| 44172.744976851856 | 32.053 |
| 44172.78664351852 | 31.995 |
| 44172.828310185185 | 32.034 |
| 44172.869976851856 | 32.014 |
| 44172.91164351852 | 32.034 |
| 44172.953310185185 | 32.053 |
| 44172.994976851856 | 32.034 |
| 44173.03664351852 | 32.053 |
| 44173.078310185185 | 32.053 |
| 44173.119976851856 | 32.034 |
| 44173.16164351852 | 32.053 |
| 44173.203310185185 | 32.034 |
| 44173.244976851856 | 32.072 |
| 44173.28664351852 | 32.053 |
| 44173.328310185185 | 32.034 |
| 44173.369976851856 | 32.034 |
| 44173.41164351852 | 32.072 |
| 44173.453310185185 | 32.053 |
| 44173.494976851856 | 32.092 |
| 44173.53664351852 | 32.111 |
| 44173.578310185185 | 32.072 |
| 44173.619976851856 | 32.092 |
| 44173.66164351852 | 32.014 |
| 44173.703310185185 | 32.092 |
| 44173.744976851856 | 32.014 |
| 44173.78664351852 | 32.014 |
| 44173.828310185185 | 32.034 |
| 44173.869976851856 | 32.092 |
| 44173.91164351852 | 32.053 |
| 44173.953310185185 | 32.072 |
| 44173.994976851856 | 32.053 |
| 44174.03664351852 | 32.072 |
| 44174.078310185185 | 32.034 |
| 44174.119976851856 | 32.072 |
| 44174.16164351852 | 32.053 |
| 44174.203310185185 | 31.995 |
| 44174.244976851856 | 32.034 |
| 44174.28664351852 | 32.053 |
| 44174.328310185185 | 32.053 |
| 44174.369976851856 | 32.072 |
| 44174.41164351852 | 32.072 |
| 44174.453310185185 | 32.092 |
| 44174.494976851856 | 32.111 |
| 44174.53664351852 | 32.149 |
| 44174.578310185185 | 32.092 |
| 44174.619976851856 | 32.072 |
| 44174.66164351852 | 32.072 |
| 44174.703310185185 | 32.014 |
| 44174.744976851856 | 32.053 |
| 44174.78664351852 | 32.034 |
| 44174.828310185185 | 32.072 |
| 44174.869976851856 | 32.014 |
| 44174.91164351852 | 31.995 |
| 44174.953310185185 | 32.014 |
| 44174.994976851856 | 32.072 |
| 44175.03664351852 | 32.072 |
| 44175.078310185185 | 32.034 |
| 44175.119976851856 | 32.034 |
| 44175.16164351852 | 32.072 |
| 44175.203310185185 | 32.053 |
| 44175.244976851856 | 32.034 |
| 44175.28664351852 | 32.072 |
| 44175.328310185185 | 32.014 |
| 44175.369976851856 | 32.053 |
| 44175.41164351852 | 32.053 |
| 44175.453310185185 | 32.13 |
| 44175.494976851856 | 32.111 |
| 44175.53664351852 | 32.149 |
| 44175.578310185185 | 32.072 |
| 44175.619976851856 | 32.092 |
| 44175.66164351852 | 32.053 |
| 44175.703310185185 | 32.072 |
| 44175.744976851856 | 32.053 |
| 44175.78664351852 | 32.072 |
| 44175.828310185185 | 32.072 |
| 44175.869976851856 | 32.072 |
| 44175.91164351852 | 32.053 |
| 44175.953310185185 | 32.034 |
| 44175.994976851856 | 32.092 |
| 44176.03664351852 | 32.072 |
| 44176.078310185185 | 32.111 |
| 44176.119976851856 | 32.092 |
| 44176.16164351852 | 32.072 |
| 44176.203310185185 | 32.092 |
| 44176.244976851856 | 32.072 |
| 44176.28664351852 | 32.053 |
| 44176.328310185185 | 32.072 |
| 44176.369976851856 | 32.092 |
| 44176.41164351852 | 32.111 |
| 44176.453310185185 | 32.111 |
| 44176.494976851856 | 32.111 |
| 44176.53664351852 | 32.149 |
| 44176.578310185185 | 32.092 |
| 44176.619976851856 | 32.111 |
| 44176.66164351852 | 32.092 |
| 44176.703310185185 | 32.053 |
| 44176.744976851856 | 32.053 |
| 44176.78664351852 | 32.072 |
| 44176.828310185185 | 32.111 |
| 44176.869976851856 | 32.072 |
| 44176.91164351852 | 32.034 |
| 44176.953310185185 | 32.053 |
| 44176.994976851856 | 32.034 |
| 44177.03664351852 | 32.034 |
| 44177.078310185185 | 32.034 |
| 44177.119976851856 | 32.092 |
| 44177.16164351852 | 32.034 |
| 44177.203310185185 | 32.053 |
| 44177.244976851856 | 32.053 |
| 44177.28664351852 | 32.072 |
| 44177.328310185185 | 32.072 |
| 44177.369976851856 | 32.072 |
| 44177.41164351852 | 32.111 |
| 44177.453310185185 | 32.092 |
| 44177.494976851856 | 32.13 |
| 44177.53664351852 | 32.149 |
| 44177.578310185185 | 32.092 |
| 44177.619976851856 | 32.092 |
| 44177.66164351852 | 32.034 |
| 44177.703310185185 | 32.111 |
| 44177.744976851856 | 32.053 |
| 44177.78664351852 | 31.995 |
| 44177.828310185185 | 32.034 |
| 44177.869976851856 | 32.053 |
| 44177.91164351852 | 32.034 |
| 44177.953310185185 | 32.034 |
| 44177.994976851856 | 32.034 |
| 44178.03664351852 | 32.053 |
| 44178.078310185185 | 32.053 |
| 44178.119976851856 | 32.053 |
| 44178.16164351852 | 32.072 |
| 44178.203310185185 | 32.034 |
| 44178.244976851856 | 32.014 |
| 44178.28664351852 | 32.053 |
| 44178.328310185185 | 32.053 |
| 44178.369976851856 | 32.034 |
| 44178.41164351852 | 32.053 |
| 44178.453310185185 | 32.034 |
| 44178.494976851856 | 32.053 |
| 44178.53664351852 | 32.053 |
| 44178.578310185185 | 32.053 |
| 44178.619976851856 | 32.053 |
| 44178.66164351852 | 32.053 |
| 44178.703310185185 | 31.995 |
| 44178.744976851856 | 32.034 |
| 44178.78664351852 | 32.053 |
| 44178.828310185185 | 32.053 |
| 44178.869976851856 | 32.034 |
| 44178.91164351852 | 32.014 |
| 44178.953310185185 | 32.053 |
| 44178.994976851856 | 32.014 |
| 44179.03664351852 | 32.053 |
| 44179.078310185185 | 32.053 |
| 44179.119976851856 | 32.053 |
| 44179.16164351852 | 32.053 |
| 44179.203310185185 | 32.053 |
| 44179.244976851856 | 32.014 |
| 44179.28664351852 | 32.053 |
| 44179.328310185185 | 32.053 |
| 44179.369976851856 | 32.072 |
| 44179.41164351852 | 32.072 |
| 44179.453310185185 | 32.034 |
| 44179.494976851856 | 32.072 |
| 44179.53664351852 | 32.053 |
| 44179.578310185185 | 32.092 |
| 44179.619976851856 | 32.092 |
| 44179.66164351852 | 32.053 |
| 44179.703310185185 | 32.072 |
| 44179.744976851856 | 32.034 |
| 44179.78664351852 | 32.072 |
| 44179.828310185185 | 32.014 |
| 44179.869976851856 | 32.014 |
| 44179.91164351852 | 32.072 |
| 44179.953310185185 | 32.072 |
| 44179.994976851856 | 32.053 |
| 44180.03664351852 | 32.072 |
| 44180.078310185185 | 32.053 |
| 44180.119976851856 | 32.053 |
| 44180.16164351852 | 32.034 |
| 44180.203310185185 | 32.092 |
| 44180.244976851856 | 32.072 |
| 44180.28664351852 | 32.034 |
| 44180.328310185185 | 32.034 |
| 44180.369976851856 | 32.053 |
| 44180.41164351852 | 32.053 |
| 44180.453310185185 | 32.053 |
| 44180.494976851856 | 32.034 |
| 44180.53664351852 | 32.053 |
| 44180.578310185185 | 32.092 |
| 44180.619976851856 | 32.072 |
| 44180.66164351852 | 32.053 |
| 44180.703310185185 | 32.072 |
| 44180.744976851856 | 32.053 |
| 44180.78664351852 | 32.053 |
| 44180.828310185185 | 32.034 |
| 44180.869976851856 | 32.053 |
| 44180.91164351852 | 32.053 |
| 44180.953310185185 | 32.034 |
| 44180.994976851856 | 32.053 |
| 44181.03664351852 | 32.053 |
| 44181.078310185185 | 32.034 |
| 44181.119976851856 | 32.053 |
| 44181.16164351852 | 32.053 |
| 44181.203310185185 | 32.072 |
| 44181.244976851856 | 32.053 |
| 44181.28664351852 | 32.053 |
| 44181.328310185185 | 32.072 |
| 44181.369976851856 | 32.053 |
| 44181.41164351852 | 32.092 |
| 44181.453310185185 | 32.072 |
| 44181.494976851856 | 32.092 |
| 44181.53664351852 | 32.072 |
| 44181.578310185185 | 32.034 |
| 44181.619976851856 | 32.034 |
| 44181.66164351852 | 32.034 |
| 44181.703310185185 | 32.053 |
| 44181.744976851856 | 32.053 |
| 44181.78664351852 | 32.072 |
| 44181.828310185185 | 32.092 |
| 44181.869976851856 | 32.072 |
| 44181.91164351852 | 32.053 |
| 44181.953310185185 | 32.053 |
| 44181.994976851856 | 32.072 |
| 44182.03664351852 | 32.034 |
| 44182.078310185185 | 32.034 |
| 44182.119976851856 | 32.014 |
| 44182.16164351852 | 32.034 |
| 44182.203310185185 | 32.053 |
| 44182.244976851856 | 32.072 |
| 44182.28664351852 | 32.053 |
| 44182.328310185185 | 32.053 |
| 44182.369976851856 | 32.034 |
| 44182.41164351852 | 32.053 |
| 44182.453310185185 | 31.995 |
| 44182.494976851856 | 32.072 |
| 44182.53664351852 | 32.053 |
| 44182.578310185185 | 32.053 |
| 44182.619976851856 | 32.072 |
| 44182.66164351852 | 32.092 |
| 44182.703310185185 | 32.053 |
| 44182.744976851856 | 32.072 |
| 44182.78664351852 | 32.014 |
| 44182.828310185185 | 32.053 |
| 44182.869976851856 | 32.014 |
| 44182.91164351852 | 32.053 |
| 44182.953310185185 | 32.034 |
| 44182.994976851856 | 32.092 |
| 44183.03664351852 | 32.072 |
| 44183.078310185185 | 32.092 |
| 44183.119976851856 | 32.053 |
| 44183.16164351852 | 32.072 |
| 44183.203310185185 | 32.092 |
| 44183.244976851856 | 32.053 |
| 44183.28664351852 | 32.053 |
| 44183.328310185185 | 32.034 |
| 44183.369976851856 | 32.092 |
| 44183.41164351852 | 32.092 |
| 44183.453310185185 | 32.092 |
| 44183.494976851856 | 32.072 |
| 44183.53664351852 | 32.111 |
| 44183.578310185185 | 32.13 |
| 44183.619976851856 | 32.072 |
| 44183.66164351852 | 32.092 |
| 44183.703310185185 | 32.072 |
| 44183.744976851856 | 32.092 |
| 44183.78664351852 | 32.053 |
| 44183.828310185185 | 32.034 |
| 44183.869976851856 | 32.034 |
| 44183.91164351852 | 32.034 |
| 44183.953310185185 | 32.053 |
| 44183.994976851856 | 32.072 |
| 44184.03664351852 | 32.053 |
| 44184.078310185185 | 32.053 |
| 44184.119976851856 | 32.034 |
| 44184.16164351852 | 32.053 |
| 44184.203310185185 | 32.072 |
| 44184.244976851856 | 32.053 |
| 44184.28664351852 | 32.014 |
| 44184.328310185185 | 32.034 |
| 44184.369976851856 | 32.034 |
| 44184.41164351852 | 32.034 |
| 44184.453310185185 | 32.034 |
| 44184.494976851856 | 32.053 |
| 44184.53664351852 | 32.072 |
| 44184.578310185185 | 32.053 |
| 44184.619976851856 | 32.053 |
| 44184.66164351852 | 32.072 |
| 44184.703310185185 | 32.034 |
| 44184.744976851856 | 32.053 |
| 44184.78664351852 | 32.053 |
| 44184.828310185185 | 32.072 |
| 44184.869976851856 | 32.053 |
| 44184.91164351852 | 32.053 |
| 44184.953310185185 | 32.053 |
| 44184.994976851856 | 32.053 |
| 44185.03664351852 | 32.034 |
| 44185.078310185185 | 32.053 |
| 44185.119976851856 | 32.092 |
| 44185.16164351852 | 32.053 |
| 44185.203310185185 | 32.034 |
| 44185.244976851856 | 32.072 |
| 44185.28664351852 | 32.072 |
| 44185.328310185185 | 32.034 |
| 44185.369976851856 | 32.053 |
| 44185.41164351852 | 32.092 |
| 44185.453310185185 | 32.149 |
| 44185.494976851856 | 32.13 |
| 44185.53664351852 | 32.092 |
| 44185.578310185185 | 32.149 |
| 44185.619976851856 | 32.092 |
| 44185.66164351852 | 32.111 |
| 44185.703310185185 | 32.034 |
| 44185.744976851856 | 32.072 |
| 44185.78664351852 | 32.092 |
| 44185.828310185185 | 32.111 |
| 44185.869976851856 | 32.092 |
| 44185.91164351852 | 32.034 |
| 44185.953310185185 | 32.092 |
| 44185.994976851856 | 32.072 |
| 44186.03664351852 | 32.169 |
| 44186.078310185185 | 32.072 |
| 44186.119976851856 | 32.111 |
| 44186.16164351852 | 32.053 |
| 44186.203310185185 | 32.072 |
| 44186.244976851856 | 32.092 |
| 44186.28664351852 | 32.111 |
| 44186.328310185185 | 32.111 |
| 44186.369976851856 | 32.111 |
| 44186.41164351852 | 32.13 |
| 44186.453310185185 | 32.188 |
| 44186.494976851856 | 32.188 |
| 44186.53664351852 | 32.227 |
| 44186.578310185185 | 32.169 |
| 44186.619976851856 | 32.149 |
| 44186.66164351852 | 32.111 |
| 44186.703310185185 | 32.072 |
| 44186.744976851856 | 32.072 |
| 44186.78664351852 | 32.053 |
| 44186.828310185185 | 32.053 |
| 44186.869976851856 | 32.014 |
| 44186.91164351852 | 32.034 |
| 44186.953310185185 | 32.053 |
| 44186.994976851856 | 32.014 |
| 44187.03664351852 | 32.053 |
| 44187.078310185185 | 32.053 |
| 44187.119976851856 | 32.034 |
| 44187.16164351852 | 32.034 |
| 44187.203310185185 | 32.053 |
| 44187.244976851856 | 32.053 |
| 44187.28664351852 | 32.034 |
| 44187.328310185185 | 32.034 |
| 44187.369976851856 | 32.092 |
| 44187.41164351852 | 32.169 |
| 44187.453310185185 | 32.265 |
| 44187.494976851856 | 32.227 |
| 44187.53664351852 | 32.169 |
| 44187.578310185185 | 32.207 |
| 44187.619976851856 | 32.13 |
| 44187.66164351852 | 32.149 |
| 44187.703310185185 | 32.072 |
| 44187.744976851856 | 32.092 |
| 44187.78664351852 | 32.053 |
| 44187.828310185185 | 32.053 |
| 44187.869976851856 | 32.053 |
| 44187.91164351852 | 32.053 |
| 44187.953310185185 | 32.034 |
| 44187.994976851856 | 32.034 |
| 44188.03664351852 | 32.053 |
| 44188.078310185185 | 32.072 |
| 44188.119976851856 | 32.014 |
| 44188.16164351852 | 32.034 |
| 44188.203310185185 | 32.014 |
| 44188.244976851856 | 32.053 |
| 44188.28664351852 | 32.053 |
| 44188.328310185185 | 32.053 |
| 44188.369976851856 | 32.034 |
| 44188.41164351852 | 32.053 |
| 44188.453310185185 | 32.072 |
| 44188.494976851856 | 32.014 |
| 44188.53664351852 | 32.034 |
| 44188.578310185185 | 32.034 |
| 44188.619976851856 | 32.053 |
| 44188.66164351852 | 32.072 |
| 44188.703310185185 | 32.053 |
| 44188.744976851856 | 32.034 |
| 44188.78664351852 | 32.053 |
| 44188.828310185185 | 32.014 |
| 44188.869976851856 | 32.034 |
| 44188.91164351852 | 32.072 |
| 44188.953310185185 | 32.014 |
| 44188.994976851856 | 32.053 |
| 44189.03664351852 | 32.053 |
| 44189.078310185185 | 32.034 |
| 44189.119976851856 | 32.053 |
| 44189.16164351852 | 32.014 |
| 44189.203310185185 | 32.072 |
| 44189.244976851856 | 32.034 |
| 44189.28664351852 | 32.053 |
| 44189.328310185185 | 32.072 |
| 44189.369976851856 | 32.072 |
| 44189.41164351852 | 32.072 |
| 44189.453310185185 | 32.072 |
| 44189.494976851856 | 32.053 |
| 44189.53664351852 | 32.053 |
| 44189.578310185185 | 32.072 |
| 44189.619976851856 | 32.034 |
| 44189.66164351852 | 32.053 |
| 44189.703310185185 | 32.092 |
| 44189.744976851856 | 32.034 |
| 44189.78664351852 | 32.053 |
| 44189.828310185185 | 32.053 |
| 44189.869976851856 | 32.034 |
| 44189.91164351852 | 32.014 |
| 44189.953310185185 | 32.053 |
| 44189.994976851856 | 32.014 |
| 44190.03664351852 | 32.072 |
| 44190.078310185185 | 32.034 |
| 44190.119976851856 | 32.072 |
| 44190.16164351852 | 32.053 |
| 44190.203310185185 | 32.053 |
| 44190.244976851856 | 32.053 |
| 44190.28664351852 | 32.053 |
| 44190.328310185185 | 32.072 |
| 44190.369976851856 | 32.072 |
| 44190.41164351852 | 32.053 |
| 44190.453310185185 | 32.072 |
| 44190.494976851856 | 32.034 |
| 44190.53664351852 | 32.034 |
| 44190.578310185185 | 32.034 |
| 44190.619976851856 | 32.034 |
| 44190.66164351852 | 32.034 |
| 44190.703310185185 | 32.072 |
| 44190.744976851856 | 32.014 |
| 44190.78664351852 | 32.072 |
| 44190.828310185185 | 32.034 |
| 44190.869976851856 | 32.072 |
| 44190.91164351852 | 32.034 |
| 44190.953310185185 | 32.014 |
| 44190.994976851856 | 32.072 |
| 44191.03664351852 | 32.053 |
| 44191.078310185185 | 32.014 |
| 44191.119976851856 | 32.053 |
| 44191.16164351852 | 32.034 |
| 44191.203310185185 | 32.034 |
| 44191.244976851856 | 32.053 |
| 44191.28664351852 | 32.034 |
| 44191.328310185185 | 32.072 |
| 44191.369976851856 | 32.034 |
| 44191.41164351852 | 32.072 |
| 44191.453310185185 | 32.053 |
| 44191.494976851856 | 32.053 |
| 44191.53664351852 | 32.053 |
| 44191.578310185185 | 32.053 |
| 44191.619976851856 | 32.053 |
| 44191.66164351852 | 32.053 |
| 44191.703310185185 | 32.034 |
| 44191.744976851856 | 32.072 |
| 44191.78664351852 | 32.053 |
| 44191.828310185185 | 32.072 |
| 44191.869976851856 | 32.053 |
| 44191.91164351852 | 32.053 |
| 44191.953310185185 | 32.111 |
| 44191.994976851856 | 32.092 |
| 44192.03664351852 | 32.111 |
| 44192.078310185185 | 32.092 |
| 44192.119976851856 | 32.111 |
| 44192.16164351852 | 32.072 |
| 44192.203310185185 | 32.072 |
| 44192.244976851856 | 32.053 |
| 44192.28664351852 | 32.034 |
| 44192.328310185185 | 32.072 |
| 44192.369976851856 | 32.072 |
| 44192.41164351852 | 32.034 |
| 44192.453310185185 | 32.111 |
| 44192.494976851856 | 32.13 |
| 44192.53664351852 | 32.092 |
| 44192.578310185185 | 32.149 |
| 44192.619976851856 | 32.072 |
| 44192.66164351852 | 32.072 |
| 44192.703310185185 | 32.092 |
| 44192.744976851856 | 32.053 |
| 44192.78664351852 | 32.072 |
| 44192.828310185185 | 32.053 |
| 44192.869976851856 | 32.034 |
| 44192.91164351852 | 32.014 |
| 44192.953310185185 | 32.014 |
| 44192.994976851856 | 32.072 |
| 44193.03664351852 | 32.034 |
| 44193.078310185185 | 32.034 |
| 44193.119976851856 | 32.092 |
| 44193.16164351852 | 32.072 |
| 44193.203310185185 | 32.034 |
| 44193.244976851856 | 32.053 |
| 44193.28664351852 | 32.072 |
| 44193.328310185185 | 32.053 |
| 44193.369976851856 | 32.072 |
| 44193.41164351852 | 32.111 |
| 44193.453310185185 | 32.111 |
| 44193.494976851856 | 32.111 |
| 44193.53664351852 | 32.13 |
| 44193.578310185185 | 32.072 |
| 44193.619976851856 | 32.092 |
| 44193.66164351852 | 32.092 |
| 44193.703310185185 | 32.053 |
| 44193.744976851856 | 32.072 |
| 44193.78664351852 | 32.034 |
| 44193.828310185185 | 32.053 |
| 44193.869976851856 | 32.014 |
| 44193.91164351852 | 32.034 |
| 44193.953310185185 | 32.053 |
| 44193.994976851856 | 32.092 |
| 44194.03664351852 | 32.072 |
| 44194.078310185185 | 32.072 |
| 44194.119976851856 | 32.092 |
| 44194.16164351852 | 32.092 |
| 44194.203310185185 | 32.034 |
| 44194.244976851856 | 32.053 |
| 44194.28664351852 | 32.092 |
| 44194.328310185185 | 32.072 |
| 44194.369976851856 | 32.072 |
| 44194.41164351852 | 32.092 |
| 44194.453310185185 | 32.092 |
| 44194.494976851856 | 32.072 |
| 44194.53664351852 | 32.092 |
| 44194.578310185185 | 32.092 |
| 44194.619976851856 | 32.072 |
| 44194.66164351852 | 32.072 |
| 44194.703310185185 | 32.034 |
| 44194.744976851856 | 32.072 |
| 44194.78664351852 | 32.053 |
| 44194.828310185185 | 32.092 |
| 44194.869976851856 | 32.014 |
| 44194.91164351852 | 32.034 |
| 44194.953310185185 | 32.053 |
| 44194.994976851856 | 32.034 |
| 44195.03664351852 | 32.034 |
| 44195.078310185185 | 32.034 |
| 44195.119976851856 | 32.053 |
| 44195.16164351852 | 32.014 |
| 44195.203310185185 | 32.072 |
| 44195.244976851856 | 32.053 |
| 44195.28664351852 | 32.014 |
| 44195.328310185185 | 32.034 |
| 44195.369976851856 | 32.034 |
| 44195.41164351852 | 32.014 |
| 44195.453310185185 | 32.053 |
| 44195.494976851856 | 32.034 |
| 44195.53664351852 | 32.034 |
| 44195.578310185185 | 32.092 |
| 44195.619976851856 | 32.034 |
| 44195.66164351852 | 32.072 |
| 44195.703310185185 | 32.014 |
| 44195.744976851856 | 32.034 |
| 44195.78664351852 | 32.092 |
| 44195.828310185185 | 32.034 |
| 44195.869976851856 | 32.053 |
| 44195.91164351852 | 32.034 |
| 44195.953310185185 | 32.014 |
| 44195.994976851856 | 32.072 |
| 44196.03664351852 | 32.072 |
| 44196.078310185185 | 32.053 |
| 44196.119976851856 | 32.072 |
| 44196.16164351852 | 32.111 |
| 44196.203310185185 | 32.053 |
| 44196.244976851856 | 32.072 |
| 44196.28664351852 | 32.034 |
| 44196.328310185185 | 32.072 |
| 44196.369976851856 | 32.072 |
| 44196.41164351852 | 32.053 |
| 44196.453310185185 | 32.072 |
| 44196.494976851856 | 32.053 |
| 44196.53664351852 | 32.034 |
| 44196.578310185185 | 32.053 |
| 44196.619976851856 | 32.072 |
| 44196.66164351852 | 32.053 |
| 44196.703310185185 | 32.053 |
| 44196.744976851856 | 32.092 |
| 44196.78664351852 | 32.053 |
| 44196.828310185185 | 32.053 |
| 44196.869976851856 | 32.072 |
| 44196.91164351852 | 32.034 |
| 44196.953310185185 | 32.034 |
| 44196.994976851856 | 32.053 |
| 44197.03664351852 | 32.053 |
| 44197.078310185185 | 32.072 |
| 44197.119976851856 | 32.053 |
| 44197.16164351852 | 32.014 |
| 44197.203310185185 | 32.053 |
| 44197.244976851856 | 32.034 |
| 44197.28664351852 | 32.072 |
| 44197.328310185185 | 32.034 |
| 44197.369976851856 | 32.034 |
| 44197.41164351852 | 32.072 |
| 44197.453310185185 | 32.13 |
| 44197.494976851856 | 32.092 |
| 44197.53664351852 | 32.092 |
| 44197.578310185185 | 32.072 |
| 44197.619976851856 | 32.072 |
| 44197.66164351852 | 32.072 |
| 44197.703310185185 | 32.053 |
| 44197.744976851856 | 32.034 |
| 44197.78664351852 | 32.014 |
| 44197.828310185185 | 32.053 |
| 44197.869976851856 | 32.072 |
| 44197.91164351852 | 32.053 |
| 44197.953310185185 | 32.034 |
| 44197.994976851856 | 32.072 |
| 44198.03664351852 | 32.053 |
| 44198.078310185185 | 32.034 |
| 44198.119976851856 | 32.014 |
| 44198.16164351852 | 32.034 |
| 44198.203310185185 | 31.995 |
| 44198.244976851856 | 32.053 |
| 44198.28664351852 | 32.072 |
| 44198.328310185185 | 32.053 |
| 44198.369976851856 | 32.053 |
| 44198.41164351852 | 32.092 |
| 44198.453310185185 | 32.034 |
| 44198.494976851856 | 32.053 |
| 44198.53664351852 | 32.053 |
| 44198.578310185185 | 32.014 |
| 44198.619976851856 | 32.053 |
| 44198.66164351852 | 32.034 |
| 44198.703310185185 | 32.053 |
| 44198.744976851856 | 32.053 |
| 44198.78664351852 | 32.053 |
| 44198.828310185185 | 32.053 |
| 44198.869976851856 | 32.053 |
| 44198.91164351852 | 32.014 |
| 44198.953310185185 | 32.053 |
| 44198.994976851856 | 32.053 |
| 44199.03664351852 | 32.072 |
| 44199.078310185185 | 32.034 |
| 44199.119976851856 | 32.053 |
| 44199.16164351852 | 32.072 |
| 44199.203310185185 | 32.034 |
| 44199.244976851856 | 32.034 |
| 44199.28664351852 | 32.072 |
| 44199.328310185185 | 32.014 |
| 44199.369976851856 | 32.072 |
| 44199.41164351852 | 32.111 |
| 44199.453310185185 | 32.13 |
| 44199.494976851856 | 32.092 |
| 44199.53664351852 | 32.111 |
| 44199.578310185185 | 32.072 |
| 44199.619976851856 | 32.092 |
| 44199.66164351852 | 32.072 |
| 44199.703310185185 | 32.053 |
| 44199.744976851856 | 32.053 |
| 44199.78664351852 | 32.053 |
| 44199.828310185185 | 32.072 |
| 44199.869976851856 | 32.111 |
| 44199.91164351852 | 32.034 |
| 44199.953310185185 | 32.072 |
| 44199.994976851856 | 32.053 |
| 44200.03664351852 | 32.053 |
| 44200.078310185185 | 32.072 |
| 44200.119976851856 | 32.053 |
| 44200.16164351852 | 32.053 |
| 44200.203310185185 | 32.053 |
| 44200.244976851856 | 32.034 |
| 44200.28664351852 | 32.053 |
| 44200.328310185185 | 32.072 |
| 44200.369976851856 | 32.053 |
| 44200.41164351852 | 32.13 |
| 44200.453310185185 | 32.149 |
| 44200.494976851856 | 32.111 |
| 44200.53664351852 | 32.111 |
| 44200.578310185185 | 32.13 |
| 44200.619976851856 | 32.111 |
| 44200.66164351852 | 32.072 |
| 44200.703310185185 | 32.053 |
| 44200.744976851856 | 32.034 |
| 44200.78664351852 | 32.053 |
| 44200.828310185185 | 32.072 |
| 44200.869976851856 | 32.092 |
| 44200.91164351852 | 32.053 |
| 44200.953310185185 | 32.092 |
| 44200.994976851856 | 32.111 |
| 44201.03664351852 | 32.034 |
| 44201.078310185185 | 32.092 |
| 44201.119976851856 | 32.053 |
| 44201.16164351852 | 32.072 |
| 44201.203310185185 | 32.092 |
| 44201.244976851856 | 32.053 |
| 44201.28664351852 | 32.092 |
| 44201.328310185185 | 32.092 |
| 44201.369976851856 | 32.092 |
| 44201.41164351852 | 32.111 |
| 44201.453310185185 | 32.072 |
| 44201.494976851856 | 32.092 |
| 44201.53664351852 | 32.149 |
| 44201.578310185185 | 32.13 |
| 44201.619976851856 | 32.092 |
| 44201.66164351852 | 32.072 |
| 44201.703310185185 | 32.072 |
| 44201.744976851856 | 32.053 |
| 44201.78664351852 | 32.053 |
| 44201.828310185185 | 32.053 |
| 44201.869976851856 | 32.072 |
| 44201.91164351852 | 32.072 |
| 44201.953310185185 | 32.092 |
| 44201.994976851856 | 32.072 |
| 44202.03664351852 | 32.072 |
| 44202.078310185185 | 32.092 |
| 44202.119976851856 | 32.053 |
| 44202.16164351852 | 32.053 |
| 44202.203310185185 | 32.034 |
| 44202.244976851856 | 32.092 |
| 44202.28664351852 | 32.053 |
| 44202.328310185185 | 32.053 |
| 44202.369976851856 | 32.053 |
| 44202.41164351852 | 32.092 |
| 44202.453310185185 | 32.149 |
| 44202.494976851856 | 32.169 |
| 44202.53664351852 | 32.111 |
| 44202.578310185185 | 32.111 |
| 44202.619976851856 | 32.169 |
| 44202.66164351852 | 32.053 |
| 44202.703310185185 | 32.053 |
| 44202.744976851856 | 32.053 |
| 44202.78664351852 | 32.053 |
| 44202.828310185185 | 32.034 |
| 44202.869976851856 | 32.053 |
| 44202.91164351852 | 32.053 |
| 44202.953310185185 | 32.034 |
| 44202.994976851856 | 32.092 |
| 44203.03664351852 | 32.053 |
| 44203.078310185185 | 31.995 |
| 44203.119976851856 | 32.034 |
| 44203.16164351852 | 32.034 |
| 44203.203310185185 | 32.034 |
| 44203.244976851856 | 32.053 |
| 44203.28664351852 | 32.053 |
| 44203.328310185185 | 32.053 |
| 44203.369976851856 | 32.053 |
| 44203.41164351852 | 32.072 |
| 44203.453310185185 | 32.092 |
| 44203.494976851856 | 32.092 |
| 44203.53664351852 | 32.072 |
| 44203.578310185185 | 32.072 |
| 44203.619976851856 | 32.111 |
| 44203.66164351852 | 32.072 |
| 44203.703310185185 | 32.092 |
| 44203.744976851856 | 32.034 |
| 44203.78664351852 | 32.034 |
| 44203.828310185185 | 32.053 |
| 44203.869976851856 | 32.053 |
| 44203.91164351852 | 32.053 |
| 44203.953310185185 | 32.034 |
| 44203.994976851856 | 32.053 |
| 44204.03664351852 | 32.072 |
| 44204.078310185185 | 32.034 |
| 44204.119976851856 | 32.072 |
| 44204.16164351852 | 32.034 |
| 44204.203310185185 | 31.995 |
| 44204.244976851856 | 32.034 |
| 44204.28664351852 | 32.034 |
| 44204.328310185185 | 32.034 |
| 44204.369976851856 | 32.092 |
| 44204.41164351852 | 32.053 |
| 44204.453310185185 | 32.092 |
| 44204.494976851856 | 32.111 |
| 44204.53664351852 | 32.034 |
| 44204.578310185185 | 32.053 |
| 44204.619976851856 | 32.053 |
| 44204.66164351852 | 32.072 |
| 44204.703310185185 | 32.034 |
| 44204.744976851856 | 32.072 |
| 44204.78664351852 | 32.072 |
| 44204.828310185185 | 32.072 |
| 44204.869976851856 | 32.034 |
| 44204.91164351852 | 32.053 |
| 44204.953310185185 | 32.034 |
| 44204.994976851856 | 32.053 |
| 44205.03664351852 | 32.072 |
| 44205.078310185185 | 32.053 |
| 44205.119976851856 | 32.014 |
| 44205.16164351852 | 32.072 |
| 44205.203310185185 | 32.014 |
| 44205.244976851856 | 32.014 |
| 44205.28664351852 | 32.053 |
| 44205.328310185185 | 32.014 |
| 44205.369976851856 | 32.053 |
| 44205.41164351852 | 32.111 |
| 44205.453310185185 | 32.111 |
| 44205.494976851856 | 32.13 |
| 44205.53664351852 | 32.111 |
| 44205.578310185185 | 32.13 |
| 44205.619976851856 | 32.072 |
| 44205.66164351852 | 32.072 |
| 44205.703310185185 | 32.072 |
| 44205.744976851856 | 32.072 |
| 44205.78664351852 | 32.072 |
| 44205.828310185185 | 32.072 |
| 44205.869976851856 | 32.053 |
| 44205.91164351852 | 32.034 |
| 44205.953310185185 | 32.053 |
| 44205.994976851856 | 32.034 |
| 44206.03664351852 | 32.072 |
| 44206.078310185185 | 32.053 |
| 44206.119976851856 | 32.034 |
| 44206.16164351852 | 32.053 |
| 44206.203310185185 | 32.053 |
| 44206.244976851856 | 32.034 |
| 44206.28664351852 | 32.053 |
| 44206.328310185185 | 32.072 |
| 44206.369976851856 | 32.034 |
| 44206.41164351852 | 32.092 |
| 44206.453310185185 | 32.053 |
| 44206.494976851856 | 32.072 |
| 44206.53664351852 | 32.034 |
| 44206.578310185185 | 32.034 |
| 44206.619976851856 | 32.092 |
| 44206.66164351852 | 32.034 |
| 44206.703310185185 | 32.053 |
| 44206.744976851856 | 32.034 |
| 44206.78664351852 | 32.053 |
| 44206.828310185185 | 32.034 |
| 44206.869976851856 | 32.053 |
| 44206.91164351852 | 32.034 |
| 44206.953310185185 | 32.014 |
| 44206.994976851856 | 32.034 |
| 44207.03664351852 | 32.053 |
| 44207.078310185185 | 32.092 |
| 44207.119976851856 | 32.053 |
| 44207.16164351852 | 32.034 |
| 44207.203310185185 | 32.072 |
| 44207.244976851856 | 32.053 |
| 44207.28664351852 | 32.034 |
| 44207.328310185185 | 32.053 |
| 44207.369976851856 | 32.072 |
| 44207.41164351852 | 32.034 |
| 44207.453310185185 | 32.014 |
| 44207.494976851856 | 32.053 |
| 44207.53664351852 | 32.014 |
| 44207.578310185185 | 32.034 |
| 44207.619976851856 | 32.034 |
| 44207.66164351852 | 32.053 |
| 44207.703310185185 | 32.014 |
| 44207.744976851856 | 32.034 |
| 44207.78664351852 | 31.995 |
| 44207.828310185185 | 32.034 |
| 44207.869976851856 | 32.034 |
| 44207.91164351852 | 32.072 |
| 44207.953310185185 | 32.092 |
| 44207.994976851856 | 32.053 |
| 44208.03664351852 | 32.092 |
| 44208.078310185185 | 32.053 |
| 44208.119976851856 | 32.034 |
| 44208.16164351852 | 32.014 |
| 44208.203310185185 | 31.976 |
| 44208.244976851856 | 32.053 |
| 44208.28664351852 | 32.034 |
| 44208.328310185185 | 32.053 |
| 44208.369976851856 | 32.053 |
| 44208.41164351852 | 32.072 |
| 44208.453310185185 | 32.072 |
| 44208.494976851856 | 32.034 |
| 44208.53664351852 | 32.034 |
| 44208.578310185185 | 32.034 |
| 44208.619976851856 | 32.014 |
| 44208.66164351852 | 32.014 |
| 44208.703310185185 | 32.053 |
| 44208.744976851856 | 32.014 |
| 44208.78664351852 | 32.034 |
| 44208.828310185185 | 32.072 |
| 44208.869976851856 | 32.053 |
| 44208.91164351852 | 32.014 |
| 44208.953310185185 | 32.014 |
| 44208.994976851856 | 32.092 |
| 44209.03664351852 | 32.034 |
| 44209.078310185185 | 32.053 |
| 44209.119976851856 | 32.034 |
| 44209.16164351852 | 32.072 |
| 44209.203310185185 | 32.014 |
| 44209.244976851856 | 32.072 |
| 44209.28664351852 | 32.034 |
| 44209.328310185185 | 32.053 |
| 44209.369976851856 | 32.053 |
| 44209.41164351852 | 32.034 |
| 44209.453310185185 | 32.072 |
| 44209.494976851856 | 32.072 |
| 44209.53664351852 | 32.092 |
| 44209.578310185185 | 32.053 |
| 44209.619976851856 | 32.072 |
| 44209.66164351852 | 32.053 |
| 44209.703310185185 | 32.072 |
| 44209.744976851856 | 32.072 |
| 44209.78664351852 | 32.053 |
| 44209.828310185185 | 32.034 |
| 44209.869976851856 | 32.053 |
| 44209.91164351852 | 32.053 |
| 44209.953310185185 | 32.053 |
| 44209.994976851856 | 32.072 |
| 44210.03664351852 | 32.072 |
| 44210.078310185185 | 32.034 |
| 44210.119976851856 | 32.072 |
| 44210.16164351852 | 32.014 |
| 44210.203310185185 | 32.034 |
| 44210.244976851856 | 32.072 |
| 44210.28664351852 | 32.014 |
| 44210.328310185185 | 32.014 |
| 44210.369976851856 | 32.053 |
| 44210.41164351852 | 31.995 |
| 44210.453310185185 | 32.034 |
| 44210.494976851856 | 32.053 |
| 44210.53664351852 | 32.034 |
| 44210.578310185185 | 32.053 |
| 44210.619976851856 | 32.034 |
| 44210.66164351852 | 32.072 |
| 44210.703310185185 | 32.053 |
| 44210.744976851856 | 32.053 |
| 44210.78664351852 | 32.053 |
| 44210.828310185185 | 32.034 |
| 44210.869976851856 | 32.053 |
| 44210.91164351852 | 32.053 |
| 44210.953310185185 | 32.034 |
| 44210.994976851856 | 32.053 |
| 44211.03664351852 | 32.053 |
| 44211.078310185185 | 32.072 |
| 44211.119976851856 | 32.053 |
| 44211.16164351852 | 32.034 |
| 44211.203310185185 | 32.014 |
| 44211.244976851856 | 32.053 |
| 44211.28664351852 | 32.053 |
| 44211.328310185185 | 32.053 |
| 44211.369976851856 | 32.053 |
| 44211.41164351852 | 32.034 |
| 44211.453310185185 | 32.072 |
| 44211.494976851856 | 32.053 |
| 44211.53664351852 | 32.053 |
| 44211.578310185185 | 32.053 |
| 44211.619976851856 | 32.034 |
| 44211.66164351852 | 32.053 |
| 44211.703310185185 | 32.053 |
| 44211.744976851856 | 32.034 |
| 44211.78664351852 | 32.053 |
| 44211.828310185185 | 32.072 |
| 44211.869976851856 | 32.034 |
| 44211.91164351852 | 32.034 |
| 44211.953310185185 | 32.034 |
| 44211.994976851856 | 32.034 |
| 44212.03664351852 | 32.053 |
| 44212.078310185185 | 32.053 |
| 44212.119976851856 | 32.092 |
| 44212.16164351852 | 32.034 |
| 44212.203310185185 | 32.053 |
| 44212.244976851856 | 32.053 |
| 44212.28664351852 | 32.072 |
| 44212.328310185185 | 32.034 |
| 44212.369976851856 | 32.13 |
| 44212.41164351852 | 32.053 |
| 44212.453310185185 | 32.092 |
| 44212.494976851856 | 32.092 |
| 44212.53664351852 | 32.092 |
| 44212.578310185185 | 32.072 |
| 44212.619976851856 | 32.072 |
| 44212.66164351852 | 32.092 |
| 44212.703310185185 | 32.072 |
| 44212.744976851856 | 32.053 |
| 44212.78664351852 | 32.053 |
| 44212.828310185185 | 32.053 |
| 44212.869976851856 | 32.072 |
| 44212.91164351852 | 32.034 |
| 44212.953310185185 | 32.034 |
| 44212.994976851856 | 32.072 |
| 44213.03664351852 | 32.092 |
| 44213.078310185185 | 32.053 |
| 44213.119976851856 | 32.092 |
| 44213.16164351852 | 32.072 |
| 44213.203310185185 | 32.072 |
| 44213.244976851856 | 32.053 |
| 44213.28664351852 | 32.072 |
| 44213.328310185185 | 32.053 |
| 44213.369976851856 | 32.111 |
| 44213.41164351852 | 32.092 |
| 44213.453310185185 | 32.111 |
| 44213.494976851856 | 32.111 |
| 44213.53664351852 | 32.092 |
| 44213.578310185185 | 32.072 |
| 44213.619976851856 | 32.072 |
| 44213.66164351852 | 32.053 |
| 44213.703310185185 | 32.072 |
| 44213.744976851856 | 32.072 |
| 44213.78664351852 | 32.053 |
| 44213.828310185185 | 32.053 |
| 44213.869976851856 | 32.053 |
| 44213.91164351852 | 32.092 |
| 44213.953310185185 | 32.034 |
| 44213.994976851856 | 32.072 |
| 44214.03664351852 | 32.072 |
| 44214.078310185185 | 32.072 |
| 44214.119976851856 | 32.072 |
| 44214.16164351852 | 32.072 |
| 44214.203310185185 | 32.053 |
| 44214.244976851856 | 32.092 |
| 44214.28664351852 | 32.053 |
| 44214.328310185185 | 32.092 |
| 44214.369976851856 | 32.111 |
| 44214.41164351852 | 32.111 |
| 44214.453310185185 | 32.13 |
| 44214.494976851856 | 32.111 |
| 44214.53664351852 | 32.13 |
| 44214.578310185185 | 32.072 |
| 44214.619976851856 | 32.053 |
| 44214.66164351852 | 32.072 |
| 44214.703310185185 | 32.072 |
| 44214.744976851856 | 32.072 |
| 44214.78664351852 | 32.053 |
| 44214.828310185185 | 32.072 |
| 44214.869976851856 | 31.995 |
| 44214.91164351852 | 32.092 |
| 44214.953310185185 | 32.072 |
| 44214.994976851856 | 32.053 |
| 44215.03664351852 | 32.053 |
| 44215.078310185185 | 32.053 |
| 44215.119976851856 | 32.034 |
| 44215.16164351852 | 32.053 |
| 44215.203310185185 | 32.034 |
| 44215.244976851856 | 32.072 |
| 44215.28664351852 | 32.053 |
| 44215.328310185185 | 32.014 |
| 44215.369976851856 | 32.072 |
| 44215.41164351852 | 32.149 |
| 44215.453310185185 | 32.13 |
| 44215.494976851856 | 32.149 |
| 44215.53664351852 | 32.13 |
| 44215.578310185185 | 32.111 |
| 44215.619976851856 | 32.072 |
| 44215.66164351852 | 32.034 |
| 44215.703310185185 | 32.072 |
| 44215.744976851856 | 32.053 |
| 44215.78664351852 | 32.053 |
| 44215.828310185185 | 32.053 |
| 44215.869976851856 | 32.072 |
| 44215.91164351852 | 32.072 |
| 44215.953310185185 | 32.053 |
| 44215.994976851856 | 32.092 |
| 44216.03664351852 | 32.034 |
| 44216.078310185185 | 32.072 |
| 44216.119976851856 | 32.053 |
| 44216.16164351852 | 32.072 |
| 44216.203310185185 | 32.053 |
| 44216.244976851856 | 32.072 |
| 44216.28664351852 | 32.053 |
| 44216.328310185185 | 32.053 |
| 44216.369976851856 | 32.034 |
| 44216.41164351852 | 32.072 |
| 44216.453310185185 | 32.092 |
| 44216.494976851856 | 32.111 |
| 44216.53664351852 | 32.13 |
| 44216.578310185185 | 32.13 |
| 44216.619976851856 | 32.111 |
| 44216.66164351852 | 32.053 |
| 44216.703310185185 | 32.092 |
| 44216.744976851856 | 32.053 |
| 44216.78664351852 | 32.053 |
| 44216.828310185185 | 32.092 |
| 44216.869976851856 | 32.034 |
| 44216.91164351852 | 32.053 |
| 44216.953310185185 | 32.053 |
| 44216.994976851856 | 32.072 |
| 44217.03664351852 | 32.053 |
| 44217.078310185185 | 32.034 |
| 44217.119976851856 | 32.034 |
| 44217.16164351852 | 32.072 |
| 44217.203310185185 | 32.072 |
| 44217.244976851856 | 32.034 |
| 44217.28664351852 | 32.053 |
| 44217.328310185185 | 32.092 |
| 44217.369976851856 | 32.111 |
| 44217.41164351852 | 32.092 |
| 44217.453310185185 | 32.149 |
| 44217.494976851856 | 32.13 |
| 44217.53664351852 | 32.111 |
| 44217.578310185185 | 32.149 |
| 44217.619976851856 | 32.092 |
| 44217.66164351852 | 32.092 |
| 44217.703310185185 | 32.072 |
| 44217.744976851856 | 32.072 |
| 44217.78664351852 | 32.072 |
| 44217.828310185185 | 32.053 |
| 44217.869976851856 | 32.014 |
| 44217.91164351852 | 32.092 |
| 44217.953310185185 | 32.092 |
| 44217.994976851856 | 32.092 |
| 44218.03664351852 | 32.053 |
| 44218.078310185185 | 32.034 |
| 44218.119976851856 | 32.111 |
| 44218.16164351852 | 32.053 |
| 44218.203310185185 | 32.072 |
| 44218.244976851856 | 32.072 |
| 44218.28664351852 | 32.053 |
| 44218.328310185185 | 32.072 |
| 44218.369976851856 | 32.111 |
| 44218.41164351852 | 32.111 |
| 44218.453310185185 | 32.13 |
| 44218.494976851856 | 32.149 |
| 44218.53664351852 | 32.111 |
| 44218.578310185185 | 32.111 |
| 44218.619976851856 | 32.13 |
| 44218.66164351852 | 32.111 |
| 44218.703310185185 | 32.053 |
| 44218.744976851856 | 32.034 |
| 44218.78664351852 | 32.072 |
| 44218.828310185185 | 32.072 |
| 44218.869976851856 | 32.092 |
| 44218.91164351852 | 32.092 |
| 44218.953310185185 | 32.034 |
| 44218.994976851856 | 32.053 |
| 44219.03664351852 | 32.072 |
| 44219.078310185185 | 32.072 |
| 44219.119976851856 | 32.053 |
| 44219.16164351852 | 32.053 |
| 44219.203310185185 | 32.092 |
| 44219.244976851856 | 32.092 |
| 44219.28664351852 | 32.092 |
| 44219.328310185185 | 32.072 |
| 44219.369976851856 | 32.072 |
| 44219.41164351852 | 32.111 |
| 44219.453310185185 | 32.13 |
| 44219.494976851856 | 32.111 |
| 44219.53664351852 | 32.111 |
| 44219.578310185185 | 32.149 |
| 44219.619976851856 | 32.092 |
| 44219.66164351852 | 32.111 |
| 44219.703310185185 | 32.072 |
| 44219.744976851856 | 32.092 |
| 44219.78664351852 | 32.111 |
| 44219.828310185185 | 32.092 |
| 44219.869976851856 | 32.053 |
| 44219.91164351852 | 32.072 |
| 44219.953310185185 | 32.072 |
| 44219.994976851856 | 32.092 |
| 44220.03664351852 | 32.072 |
| 44220.078310185185 | 32.072 |
| 44220.119976851856 | 32.014 |
| 44220.16164351852 | 32.072 |
| 44220.203310185185 | 32.072 |
| 44220.244976851856 | 32.072 |
| 44220.28664351852 | 32.072 |
| 44220.328310185185 | 32.034 |
| 44220.369976851856 | 32.053 |
| 44220.41164351852 | 32.111 |
| 44220.453310185185 | 32.149 |
| 44220.494976851856 | 32.111 |
| 44220.53664351852 | 32.111 |
| 44220.578310185185 | 32.13 |
| 44220.619976851856 | 32.072 |
| 44220.66164351852 | 32.111 |
| 44220.703310185185 | 32.072 |
| 44220.744976851856 | 32.053 |
| 44220.78664351852 | 32.072 |
| 44220.828310185185 | 32.053 |
| 44220.869976851856 | 32.072 |
| 44220.91164351852 | 32.072 |
| 44220.953310185185 | 32.014 |
| 44220.994976851856 | 32.072 |
| 44221.03664351852 | 32.072 |
| 44221.078310185185 | 32.014 |
| 44221.119976851856 | 32.092 |
| 44221.16164351852 | 32.034 |
| 44221.203310185185 | 32.034 |
| 44221.244976851856 | 32.053 |
| 44221.28664351852 | 32.072 |
| 44221.328310185185 | 32.053 |
| 44221.369976851856 | 32.092 |
| 44221.41164351852 | 32.092 |
| 44221.453310185185 | 32.111 |
| 44221.494976851856 | 32.169 |
| 44221.53664351852 | 32.149 |
| 44221.578310185185 | 32.092 |
| 44221.619976851856 | 32.072 |
| 44221.66164351852 | 32.092 |
| 44221.703310185185 | 32.092 |
| 44221.744976851856 | 32.092 |
| 44221.78664351852 | 32.111 |
| 44221.828310185185 | 32.072 |
| 44221.869976851856 | 32.072 |
| 44221.91164351852 | 32.034 |
| 44221.953310185185 | 32.034 |
| 44221.994976851856 | 32.053 |
| 44222.03664351852 | 32.072 |
| 44222.078310185185 | 32.034 |
| 44222.119976851856 | 32.072 |
| 44222.16164351852 | 32.053 |
| 44222.203310185185 | 32.072 |
| 44222.244976851856 | 32.034 |
| 44222.28664351852 | 32.053 |
| 44222.328310185185 | 32.072 |
| 44222.369976851856 | 32.072 |
| 44222.41164351852 | 32.053 |
| 44222.453310185185 | 32.072 |
| 44222.494976851856 | 32.034 |
| 44222.53664351852 | 32.053 |
| 44222.578310185185 | 32.034 |
| 44222.619976851856 | 32.053 |
| 44222.66164351852 | 32.053 |
| 44222.703310185185 | 32.072 |
| 44222.744976851856 | 32.034 |
| 44222.78664351852 | 32.014 |
| 44222.828310185185 | 32.053 |
| 44222.869976851856 | 32.072 |
| 44222.91164351852 | 32.014 |
| 44222.953310185185 | 32.034 |
| 44222.994976851856 | 32.034 |
| 44223.03664351852 | 32.034 |
| 44223.078310185185 | 32.053 |
| 44223.119976851856 | 31.995 |
| 44223.16164351852 | 32.034 |
| 44223.203310185185 | 32.053 |
| 44223.244976851856 | 32.053 |
| 44223.28664351852 | 31.995 |
| 44223.328310185185 | 32.034 |
| 44223.369976851856 | 32.034 |
| 44223.41164351852 | 32.053 |
| 44223.453310185185 | 32.014 |
| 44223.494976851856 | 32.034 |
| 44223.53664351852 | 32.034 |
| 44223.578310185185 | 32.034 |
| 44223.619976851856 | 32.072 |
| 44223.66164351852 | 32.014 |
| 44223.703310185185 | 32.014 |
| 44223.744976851856 | 32.034 |
| 44223.78664351852 | 32.034 |
| 44223.828310185185 | 32.014 |
| 44223.869976851856 | 32.072 |
| 44223.91164351852 | 32.034 |
| 44223.953310185185 | 32.053 |
| 44223.994976851856 | 32.053 |
| 44224.03664351852 | 32.053 |
| 44224.078310185185 | 32.014 |
| 44224.119976851856 | 32.034 |
| 44224.16164351852 | 32.053 |
| 44224.203310185185 | 32.072 |
| 44224.244976851856 | 32.034 |
| 44224.28664351852 | 32.072 |
| 44224.328310185185 | 32.053 |
| 44224.369976851856 | 32.053 |
| 44224.41164351852 | 32.072 |
| 44224.453310185185 | 32.072 |
| 44224.494976851856 | 32.072 |
| 44224.53664351852 | 32.092 |
| 44224.578310185185 | 32.092 |
| 44224.619976851856 | 32.092 |
| 44224.66164351852 | 32.111 |
| 44224.703310185185 | 32.034 |
| 44224.744976851856 | 32.053 |
| 44224.78664351852 | 32.053 |
| 44224.828310185185 | 32.014 |
| 44224.869976851856 | 32.034 |
| 44224.91164351852 | 32.034 |
| 44224.953310185185 | 32.072 |
| 44224.994976851856 | 32.034 |
| 44225.03664351852 | 32.072 |
| 44225.078310185185 | 32.034 |
| 44225.119976851856 | 32.072 |
| 44225.16164351852 | 32.034 |
| 44225.203310185185 | 32.072 |
| 44225.244976851856 | 32.053 |
| 44225.28664351852 | 32.034 |
| 44225.328310185185 | 32.092 |
| 44225.369976851856 | 32.092 |
| 44225.41164351852 | 32.092 |
| 44225.453310185185 | 32.188 |
| 44225.494976851856 | 32.169 |
| 44225.53664351852 | 32.111 |
| 44225.578310185185 | 32.13 |
| 44225.619976851856 | 32.111 |
| 44225.66164351852 | 32.092 |
| 44225.703310185185 | 32.053 |
| 44225.744976851856 | 32.072 |
| 44225.78664351852 | 32.072 |
| 44225.828310185185 | 32.034 |
| 44225.869976851856 | 32.014 |
| 44225.91164351852 | 32.053 |
| 44225.953310185185 | 32.053 |
| 44225.994976851856 | 32.072 |
| 44226.03664351852 | 32.072 |
| 44226.078310185185 | 32.092 |
| 44226.119976851856 | 32.053 |
| 44226.16164351852 | 32.053 |
| 44226.203310185185 | 32.072 |
| 44226.244976851856 | 32.034 |
| 44226.28664351852 | 32.053 |
| 44226.328310185185 | 32.072 |
| 44226.369976851856 | 32.111 |
| 44226.41164351852 | 32.092 |
| 44226.453310185185 | 32.072 |
| 44226.494976851856 | 32.072 |
| 44226.53664351852 | 32.149 |
| 44226.578310185185 | 32.111 |
| 44226.619976851856 | 32.111 |
| 44226.66164351852 | 32.072 |
| 44226.703310185185 | 32.053 |
| 44226.744976851856 | 32.053 |
| 44226.78664351852 | 32.072 |
| 44226.828310185185 | 32.072 |
| 44226.869976851856 | 32.092 |
| 44226.91164351852 | 32.072 |
| 44226.953310185185 | 32.053 |
| 44226.994976851856 | 32.053 |
| 44227.03664351852 | 32.072 |
| 44227.078310185185 | 32.072 |
| 44227.119976851856 | 32.053 |
| 44227.16164351852 | 32.053 |
| 44227.203310185185 | 32.053 |
| 44227.244976851856 | 32.072 |
| 44227.28664351852 | 32.034 |
| 44227.328310185185 | 32.072 |
| 44227.369976851856 | 32.053 |
| 44227.41164351852 | 32.072 |
| 44227.453310185185 | 32.149 |
| 44227.494976851856 | 32.149 |
| 44227.53664351852 | 32.188 |
| 44227.578310185185 | 32.149 |
| 44227.619976851856 | 32.111 |
| 44227.66164351852 | 32.072 |
| 44227.703310185185 | 32.072 |
| 44227.744976851856 | 32.072 |
| 44227.78664351852 | 32.072 |
| 44227.828310185185 | 32.053 |
| 44227.869976851856 | 32.034 |
| 44227.91164351852 | 32.072 |
| 44227.953310185185 | 32.034 |
| 44227.994976851856 | 32.053 |
| 44228.03664351852 | 32.034 |
| 44228.078310185185 | 32.034 |
| 44228.119976851856 | 32.053 |
| 44228.16164351852 | 32.034 |
| 44228.203310185185 | 32.014 |
| 44228.244976851856 | 32.072 |
| 44228.28664351852 | 32.034 |
| 44228.328310185185 | 32.034 |
| 44228.369976851856 | 32.053 |
| 44228.41164351852 | 32.053 |
| 44228.453310185185 | 32.034 |
| 44228.494976851856 | 32.072 |
| 44228.53664351852 | 32.053 |
| 44228.578310185185 | 32.034 |
| 44228.619976851856 | 32.014 |
| 44228.66164351852 | 32.092 |
| 44228.703310185185 | 32.034 |
| 44228.744976851856 | 32.053 |
| 44228.78664351852 | 32.014 |
| 44228.828310185185 | 32.034 |
| 44228.869976851856 | 32.034 |
| 44228.91164351852 | 32.053 |
| 44228.953310185185 | 32.034 |
| 44228.994976851856 | 31.976 |
| 44229.03664351852 | 32.014 |
| 44229.078310185185 | 32.053 |
| 44229.119976851856 | 32.034 |
| 44229.16164351852 | 32.053 |
| 44229.203310185185 | 32.053 |
| 44229.244976851856 | 32.053 |
| 44229.28664351852 | 32.034 |
| 44229.328310185185 | 32.053 |
| 44229.369976851856 | 32.034 |
| 44229.41164351852 | 32.092 |
| 44229.453310185185 | 32.072 |
| 44229.494976851856 | 32.13 |
| 44229.53664351852 | 32.169 |
| 44229.578310185185 | 32.111 |
| 44229.619976851856 | 32.092 |
| 44229.66164351852 | 32.111 |
| 44229.703310185185 | 32.053 |
| 44229.744976851856 | 32.053 |
| 44229.78664351852 | 32.053 |
| 44229.828310185185 | 32.053 |
| 44229.869976851856 | 32.053 |
| 44229.91164351852 | 32.053 |
| 44229.953310185185 | 32.092 |
| 44229.994976851856 | 32.053 |
| 44230.03664351852 | 32.034 |
| 44230.078310185185 | 32.092 |
| 44230.119976851856 | 32.092 |
| 44230.16164351852 | 32.111 |
| 44230.203310185185 | 32.092 |
| 44230.244976851856 | 32.092 |
| 44230.28664351852 | 32.092 |
| 44230.328310185185 | 32.111 |
| 44230.369976851856 | 32.13 |
| 44230.41164351852 | 32.13 |
| 44230.453310185185 | 32.188 |
| 44230.494976851856 | 32.188 |
| 44230.53664351852 | 32.092 |
| 44230.578310185185 | 32.111 |
| 44230.619976851856 | 32.13 |
| 44230.66164351852 | 32.13 |
| 44230.703310185185 | 32.014 |
| 44230.744976851856 | 32.034 |
| 44230.78664351852 | 32.072 |
| 44230.828310185185 | 32.053 |
| 44230.869976851856 | 32.034 |
| 44230.91164351852 | 32.034 |
| 44230.953310185185 | 32.034 |
| 44230.994976851856 | 32.072 |
| 44231.03664351852 | 32.034 |
| 44231.078310185185 | 32.072 |
| 44231.119976851856 | 32.053 |
| 44231.16164351852 | 32.034 |
| 44231.203310185185 | 32.053 |
| 44231.244976851856 | 32.034 |
| 44231.28664351852 | 32.034 |
| 44231.328310185185 | 32.034 |
| 44231.369976851856 | 32.092 |
| 44231.41164351852 | 32.092 |
| 44231.453310185185 | 32.034 |
| 44231.494976851856 | 32.053 |
| 44231.53664351852 | 31.995 |
| 44231.578310185185 | 32.053 |
| 44231.619976851856 | 32.053 |
| 44231.66164351852 | 32.014 |
| 44231.703310185185 | 32.053 |
| 44231.744976851856 | 32.014 |
| 44231.78664351852 | 32.034 |
| 44231.828310185185 | 32.034 |
| 44231.869976851856 | 32.072 |
| 44231.91164351852 | 32.053 |
| 44231.953310185185 | 32.053 |
| 44231.994976851856 | 32.053 |
| 44232.03664351852 | 32.072 |
| 44232.078310185185 | 32.053 |
| 44232.119976851856 | 31.995 |
| 44232.16164351852 | 32.053 |
| 44232.203310185185 | 32.034 |
| 44232.244976851856 | 32.053 |
| 44232.28664351852 | 32.053 |
| 44232.328310185185 | 32.034 |
| 44232.369976851856 | 32.014 |
| 44232.41164351852 | 32.053 |
| 44232.453310185185 | 32.053 |
| 44232.494976851856 | 32.053 |
| 44232.53664351852 | 32.053 |
| 44232.578310185185 | 32.072 |
| 44232.619976851856 | 32.072 |
| 44232.66164351852 | 32.034 |
| 44232.703310185185 | 32.053 |
| 44232.744976851856 | 32.092 |
| 44232.78664351852 | 32.034 |
| 44232.828310185185 | 32.014 |
| 44232.869976851856 | 32.034 |
| 44232.91164351852 | 32.014 |
| 44232.953310185185 | 32.034 |
| 44232.994976851856 | 32.034 |
| 44233.03664351852 | 32.034 |
| 44233.078310185185 | 32.072 |
| 44233.119976851856 | 32.092 |
| 44233.16164351852 | 32.053 |
| 44233.203310185185 | 31.995 |
| 44233.244976851856 | 32.053 |
| 44233.28664351852 | 32.053 |
| 44233.328310185185 | 32.053 |
| 44233.369976851856 | 32.072 |
| 44233.41164351852 | 32.034 |
| 44233.453310185185 | 32.014 |
| 44233.494976851856 | 32.034 |
| 44233.53664351852 | 32.053 |
| 44233.578310185185 | 32.034 |
| 44233.619976851856 | 32.034 |
| 44233.66164351852 | 32.034 |
| 44233.703310185185 | 32.034 |
| 44233.744976851856 | 32.053 |
| 44233.78664351852 | 32.014 |
| 44233.828310185185 | 32.034 |
| 44233.869976851856 | 32.053 |
| 44233.91164351852 | 32.092 |
| 44233.953310185185 | 32.034 |
| 44233.994976851856 | 32.053 |
| 44234.03664351852 | 32.014 |
| 44234.078310185185 | 32.053 |
| 44234.119976851856 | 32.053 |
| 44234.16164351852 | 32.014 |
| 44234.203310185185 | 32.053 |
| 44234.244976851856 | 32.053 |
| 44234.28664351852 | 32.034 |
| 44234.328310185185 | 32.072 |
| 44234.369976851856 | 32.034 |
| 44234.41164351852 | 31.995 |
| 44234.453310185185 | 32.034 |
| 44234.494976851856 | 32.053 |
| 44234.53664351852 | 32.053 |
| 44234.578310185185 | 32.034 |
| 44234.619976851856 | 32.092 |
| 44234.66164351852 | 32.053 |
| 44234.703310185185 | 32.053 |
| 44234.744976851856 | 32.053 |
| 44234.78664351852 | 32.014 |
| 44234.828310185185 | 32.072 |
| 44234.869976851856 | 32.034 |
| 44234.91164351852 | 32.072 |
| 44234.953310185185 | 32.053 |
| 44234.994976851856 | 32.053 |
| 44235.03664351852 | 32.072 |
| 44235.078310185185 | 32.092 |
| 44235.119976851856 | 32.111 |
| 44235.16164351852 | 32.092 |
| 44235.203310185185 | 32.053 |
| 44235.244976851856 | 32.092 |
| 44235.28664351852 | 32.092 |
| 44235.328310185185 | 32.072 |
| 44235.369976851856 | 32.072 |
| 44235.41164351852 | 32.092 |
| 44235.453310185185 | 32.149 |
| 44235.494976851856 | 32.227 |
| 44235.53664351852 | 32.149 |
| 44235.578310185185 | 32.111 |
| 44235.619976851856 | 32.149 |
| 44235.66164351852 | 32.13 |
| 44235.703310185185 | 32.111 |
| 44235.744976851856 | 32.169 |
| 44235.78664351852 | 32.265 |
| 44235.828310185185 | 32.227 |
| 44235.869976851856 | 32.304 |
| 44235.91164351852 | 32.343 |
| 44235.953310185185 | 32.323 |
| 44235.994976851856 | 32.304 |
| 44236.03664351852 | 32.304 |
| 44236.078310185185 | 32.323 |
| 44236.119976851856 | 32.227 |
| 44236.16164351852 | 32.169 |
| 44236.203310185185 | 32.207 |
| 44236.244976851856 | 32.246 |
| 44236.28664351852 | 32.207 |
| 44236.328310185185 | 32.227 |
| 44236.369976851856 | 32.227 |
| 44236.41164351852 | 32.265 |
| 44236.453310185185 | 32.4 |
| 44236.494976851856 | 32.555 |
| 44236.53664351852 | 32.69 |
| 44236.578310185185 | 32.709 |
| 44236.619976851856 | 32.787 |
| 44236.66164351852 | 32.729 |
| 44236.703310185185 | 32.902 |
| 44236.744976851856 | 33.115 |
| 44236.78664351852 | 33.462 |
| 44236.828310185185 | 33.559 |
| 44236.869976851856 | 33.52 |
| 44236.91164351852 | 33.655 |
| 44236.953310185185 | 33.482 |
| 44236.994976851856 | 33.945 |
| 44237.03664351852 | 34.138 |
| 44237.078310185185 | 34.196 |
| 44237.119976851856 | 34.061 |
| 44237.16164351852 | 34.041 |
| 44237.203310185185 | 34.08 |
| 44237.244976851856 | 34.003 |
| 44237.28664351852 | 34.022 |
| 44237.328310185185 | 34.003 |
| 44237.369976851856 | 33.964 |
| 44237.41164351852 | 34.041 |
| 44237.453310185185 | 34.234 |
| 44237.494976851856 | 34.485 |
| 44237.53664351852 | 35.451 |
| 44237.578310185185 | 35.354 |
| 44237.619976851856 | 35.373 |
| 44237.66164351852 | 35.18 |
| 44237.703310185185 | 34.968 |
| 44237.744976851856 | 32.651 |
| 44237.78664351852 | 32.4 |
| 44237.828310185185 | 32.42 |
| 44237.869976851856 | 32.806 |
| 44237.91164351852 | 33.211 |
| 44237.953310185185 | 33.269 |
| 44237.994976851856 | 33.327 |
| 44238.03664351852 | 33.327 |
| 44238.078310185185 | 33.211 |
| 44238.119976851856 | 33.231 |
| 44238.16164351852 | 33.173 |
| 44238.203310185185 | 33.153 |
| 44238.244976851856 | 33.115 |
| 44238.28664351852 | 32.999 |
| 44238.328310185185 | 33.115 |
| 44238.369976851856 | 33.269 |
| 44238.41164351852 | 33.617 |
| 44238.453310185185 | 34.08 |
| 44238.494976851856 | 34.485 |
| 44238.53664351852 | 34.794 |
| 44238.578310185185 | 34.582 |
| 44238.619976851856 | 34.447 |
| 44238.66164351852 | 34.659 |
| 44238.703310185185 | 34.929 |
| 44238.744976851856 | 34.814 |
| 44238.78664351852 | 34.794 |
| 44238.828310185185 | 34.987 |
| 44238.869976851856 | 35.277 |
| 44238.91164351852 | 35.354 |
| 44238.953310185185 | 35.489 |
| 44238.994976851856 | 35.566 |
| 44239.03664351852 | 35.451 |
| 44239.078310185185 | 34.987 |
| 44239.119976851856 | 35.065 |
| 44239.16164351852 | 34.949 |
| 44239.203310185185 | 34.968 |
| 44239.244976851856 | 34.949 |
| 44239.28664351852 | 34.833 |
| 44239.328310185185 | 34.582 |
| 44239.369976851856 | 34.273 |
| 44239.41164351852 | 34.292 |
| 44239.453310185185 | 34.582 |
| 44239.494976851856 | 34.775 |
| 44239.53664351852 | 34.852 |
| 44239.578310185185 | 34.987 |
| 44239.619976851856 | 35.026 |
| 44239.66164351852 | 35.103 |
| 44239.703310185185 | 35.161 |
| 44239.744976851856 | 35.007 |
| 44239.78664351852 | 34.814 |
| 44239.828310185185 | 34.891 |
| 44239.869976851856 | 35.161 |
| 44239.91164351852 | 35.277 |
| 44239.953310185185 | 35.142 |
| 44239.994976851856 | 34.891 |
| 44240.03664351852 | 34.543 |
| 44240.078310185185 | 34.756 |
| 44240.119976851856 | 34.852 |
| 44240.16164351852 | 34.756 |
| 44240.203310185185 | 34.582 |
| 44240.244976851856 | 34.234 |
| 44240.28664351852 | 33.983 |
| 44240.328310185185 | 33.926 |
| 44240.369976851856 | 34.041 |
| 44240.41164351852 | 34.312 |
| 44240.453310185185 | 34.601 |
| 44240.494976851856 | 35.045 |
| 44240.53664351852 | 35.315 |
| 44240.578310185185 | 35.393 |
| 44240.619976851856 | 35.528 |
| 44240.66164351852 | 35.624 |
| 44240.703310185185 | 35.663 |
| 44240.744976851856 | 35.779 |
| 44240.78664351852 | 35.586 |
| 44240.828310185185 | 35.933 |
| 44240.869976851856 | 35.972 |
| 44240.91164351852 | 35.914 |
| 44240.953310185185 | 35.721 |
| 44240.994976851856 | 35.373 |
| 44241.03664351852 | 35.026 |
| 44241.078310185185 | 34.871 |
| 44241.119976851856 | 34.563 |
| 44241.16164351852 | 33.964 |
| 44241.203310185185 | 33.539 |
| 44241.244976851856 | 33.076 |
| 44241.28664351852 | 32.574 |
| 44241.328310185185 | 32.034 |
| 44241.369976851856 | 32.034 |
| 44241.41164351852 | 32.111 |
| 44241.453310185185 | 32.555 |
| 44241.494976851856 | 33.153 |
| 44241.53664351852 | 33.211 |
| 44241.578310185185 | 33.308 |
| 44241.619976851856 | 32.96 |
| 44241.66164351852 | 32.536 |
| 44241.703310185185 | 31.976 |
| 44241.744976851856 | 32.053 |
| 44241.78664351852 | 32.034 |
| 44241.828310185185 | 32.014 |
| 44241.869976851856 | 32.053 |
| 44241.91164351852 | 32.053 |
| 44241.953310185185 | 32.034 |
| 44241.994976851856 | 32.034 |
| 44242.03664351852 | 32.053 |
| 44242.078310185185 | 32.034 |
| 44242.119976851856 | 32.092 |
| 44242.16164351852 | 32.034 |
| 44242.203310185185 | 32.034 |
| 44242.244976851856 | 32.072 |
| 44242.28664351852 | 32.053 |
| 44242.328310185185 | 32.053 |
| 44242.369976851856 | 32.014 |
| 44242.41164351852 | 32.053 |
| 44242.453310185185 | 32.053 |
| 44242.494976851856 | 32.034 |
| 44242.53664351852 | 32.034 |
| 44242.578310185185 | 32.053 |
| 44242.619976851856 | 32.072 |
| 44242.66164351852 | 32.014 |
| 44242.703310185185 | 32.072 |
| 44242.744976851856 | 32.053 |
| 44242.78664351852 | 32.034 |
| 44242.828310185185 | 32.034 |
| 44242.869976851856 | 32.072 |
| 44242.91164351852 | 32.014 |
| 44242.953310185185 | 32.034 |
| 44242.994976851856 | 32.034 |
| 44243.03664351852 | 32.034 |
| 44243.078310185185 | 32.053 |
| 44243.119976851856 | 32.034 |
| 44243.16164351852 | 32.072 |
| 44243.203310185185 | 32.053 |
| 44243.244976851856 | 32.034 |
| 44243.28664351852 | 32.014 |
| 44243.328310185185 | 32.072 |
| 44243.369976851856 | 32.053 |
| 44243.41164351852 | 32.034 |
| 44243.453310185185 | 32.053 |
| 44243.494976851856 | 32.053 |
| 44243.53664351852 | 32.053 |
| 44243.578310185185 | 32.227 |
| 44243.619976851856 | 32.4 |
| 44243.66164351852 | 32.362 |
| 44243.703310185185 | 32.381 |
| 44243.744976851856 | 32.362 |
| 44243.78664351852 | 32.4 |
| 44243.828310185185 | 32.478 |
| 44243.869976851856 | 32.4 |
| 44243.91164351852 | 32.092 |
| 44243.953310185185 | 32.014 |
| 44243.994976851856 | 32.034 |
| 44244.03664351852 | 32.034 |
| 44244.078310185185 | 32.034 |
| 44244.119976851856 | 32.034 |
| 44244.16164351852 | 32.053 |
| 44244.203310185185 | 32.014 |
| 44244.244976851856 | 32.072 |
| 44244.28664351852 | 32.053 |
| 44244.328310185185 | 32.053 |
| 44244.369976851856 | 32.053 |
| 44244.41164351852 | 32.072 |
| 44244.453310185185 | 32.034 |
| 44244.494976851856 | 32.111 |
| 44244.53664351852 | 32.265 |
| 44244.578310185185 | 32.323 |
| 44244.619976851856 | 32.304 |
| 44244.66164351852 | 32.227 |
| 44244.703310185185 | 32.169 |
| 44244.744976851856 | 32.014 |
| 44244.78664351852 | 32.034 |
| 44244.828310185185 | 32.014 |
| 44244.869976851856 | 32.034 |
| 44244.91164351852 | 32.053 |
| 44244.953310185185 | 31.995 |
| 44244.994976851856 | 32.053 |
| 44245.03664351852 | 32.053 |
| 44245.078310185185 | 32.034 |
| 44245.119976851856 | 32.072 |
| 44245.16164351852 | 32.014 |
| 44245.203310185185 | 32.034 |
| 44245.244976851856 | 32.034 |
| 44245.28664351852 | 31.976 |
| 44245.328310185185 | 32.053 |
| 44245.369976851856 | 32.053 |
| 44245.41164351852 | 32.034 |
| 44245.453310185185 | 32.072 |
| 44245.494976851856 | 32.053 |
| 44245.53664351852 | 32.111 |
| 44245.578310185185 | 32.13 |
| 44245.619976851856 | 32.111 |
| 44245.66164351852 | 32.13 |
| 44245.703310185185 | 32.053 |
| 44245.744976851856 | 31.976 |
| 44245.78664351852 | 32.053 |
| 44245.828310185185 | 32.014 |
| 44245.869976851856 | 32.014 |
| 44245.91164351852 | 32.034 |
| 44245.953310185185 | 32.072 |
| 44245.994976851856 | 32.034 |
| 44246.03664351852 | 32.053 |
| 44246.078310185185 | 32.014 |
| 44246.119976851856 | 32.014 |
| 44246.16164351852 | 32.053 |
| 44246.203310185185 | 32.034 |
| 44246.244976851856 | 32.053 |
| 44246.28664351852 | 32.014 |
| 44246.328310185185 | 32.053 |
| 44246.369976851856 | 32.053 |
| 44246.41164351852 | 32.053 |
| 44246.453310185185 | 32.053 |
| 44246.494976851856 | 32.072 |
| 44246.53664351852 | 32.092 |
| 44246.578310185185 | 32.053 |
| 44246.619976851856 | 32.014 |
| 44246.66164351852 | 32.034 |
| 44246.703310185185 | 32.034 |
| 44246.744976851856 | 32.053 |
| 44246.78664351852 | 32.014 |
| 44246.828310185185 | 32.014 |
| 44246.869976851856 | 32.034 |
| 44246.91164351852 | 32.092 |
| 44246.953310185185 | 32.053 |
| 44246.994976851856 | 32.053 |
| 44247.03664351852 | 32.014 |
| 44247.078310185185 | 32.053 |
| 44247.119976851856 | 32.072 |
| 44247.16164351852 | 32.034 |
| 44247.203310185185 | 32.111 |
| 44247.244976851856 | 32.034 |
| 44247.28664351852 | 32.014 |
| 44247.328310185185 | 32.072 |
| 44247.369976851856 | 32.014 |
| 44247.41164351852 | 32.053 |
| 44247.453310185185 | 32.053 |
| 44247.494976851856 | 32.053 |
| 44247.53664351852 | 32.072 |
| 44247.578310185185 | 32.072 |
| 44247.619976851856 | 32.053 |
| 44247.66164351852 | 32.014 |
| 44247.703310185185 | 32.053 |
| 44247.744976851856 | 32.072 |
| 44247.78664351852 | 32.034 |
| 44247.828310185185 | 32.034 |
| 44247.869976851856 | 32.053 |
| 44247.91164351852 | 32.034 |
| 44247.953310185185 | 32.034 |
| 44247.994976851856 | 32.034 |
| 44248.03664351852 | 32.034 |
| 44248.078310185185 | 32.053 |
| 44248.119976851856 | 32.053 |
| 44248.16164351852 | 32.014 |
| 44248.203310185185 | 32.053 |
| 44248.244976851856 | 32.014 |
| 44248.28664351852 | 32.034 |
| 44248.328310185185 | 32.072 |
| 44248.369976851856 | 32.053 |
| 44248.41164351852 | 32.053 |
| 44248.453310185185 | 32.072 |
| 44248.494976851856 | 32.072 |
| 44248.53664351852 | 32.092 |
| 44248.578310185185 | 32.034 |
| 44248.619976851856 | 32.053 |
| 44248.66164351852 | 32.034 |
| 44248.703310185185 | 32.053 |
| 44248.744976851856 | 32.092 |
| 44248.78664351852 | 32.014 |
| 44248.828310185185 | 32.053 |
| 44248.869976851856 | 32.053 |
| 44248.91164351852 | 32.034 |
| 44248.953310185185 | 32.072 |
| 44248.994976851856 | 32.072 |
| 44249.03664351852 | 32.072 |
| 44249.078310185185 | 32.072 |
| 44249.119976851856 | 32.034 |
| 44249.16164351852 | 32.034 |
| 44249.203310185185 | 32.053 |
| 44249.244976851856 | 32.072 |
| 44249.28664351852 | 32.072 |
| 44249.328310185185 | 32.053 |
| 44249.369976851856 | 32.072 |
| 44249.41164351852 | 32.053 |
| 44249.453310185185 | 32.053 |
| 44249.494976851856 | 32.034 |
| 44249.53664351852 | 32.034 |
| 44249.578310185185 | 32.014 |
| 44249.619976851856 | 32.072 |
| 44249.66164351852 | 32.053 |
| 44249.703310185185 | 32.072 |
| 44249.744976851856 | 33.597 |
| 44249.78664351852 | 34.524 |
| 44249.828310185185 | 34.833 |
| 44249.869976851856 | 35.277 |
| 44249.91164351852 | 35.451 |
| 44249.953310185185 | 35.142 |
| 44249.994976851856 | 34.891 |
| 44250.03664351852 | 34.485 |
| 44250.078310185185 | 33.926 |
| 44250.119976851856 | 33.424 |
| 44250.16164351852 | 32.902 |
| 44250.203310185185 | 32.4 |
| 44250.244976851856 | 31.995 |
| 44250.28664351852 | 32.014 |
| 44250.328310185185 | 32.053 |
| 44250.369976851856 | 32.034 |
| 44250.41164351852 | 32.072 |
| 44250.453310185185 | 32.632 |
| 44250.494976851856 | 33.829 |
| 44250.53664351852 | 34.659 |
| 44250.578310185185 | 34.64 |
| 44250.619976851856 | 34.408 |
| 44250.66164351852 | 34.698 |
| 44250.703310185185 | 34.968 |
| 44250.744976851856 | 35.412 |
| 44250.78664351852 | 35.663 |
| 44250.828310185185 | 35.914 |
| 44250.869976851856 | 36.126 |
| 44250.91164351852 | 36.088 |
| 44250.953310185185 | 36.068 |
| 44250.994976851856 | 36.049 |
| 44251.03664351852 | 35.933 |
| 44251.078310185185 | 35.624 |
| 44251.119976851856 | 35.084 |
| 44251.16164351852 | 34.427 |
| 44251.203310185185 | 33.713 |
| 44251.244976851856 | 33.037 |
| 44251.28664351852 | 32.343 |
| 44251.328310185185 | 32.014 |
| 44251.369976851856 | 32.053 |
| 44251.41164351852 | 32.207 |
| 44251.453310185185 | 32.941 |
| 44251.494976851856 | 33.752 |
| 44251.53664351852 | 34.331 |
| 44251.578310185185 | 34.524 |
| 44251.619976851856 | 34.331 |
| 44251.66164351852 | 34.138 |
| 44251.703310185185 | 34.292 |
| 44251.744976851856 | 34.678 |
| 44251.78664351852 | 34.968 |
| 44251.828310185185 | 35.103 |
| 44251.869976851856 | 35.065 |
| 44251.91164351852 | 34.794 |
| 44251.953310185185 | 34.408 |
| 44251.994976851856 | 34.138 |
| 44252.03664351852 | 33.829 |
| 44252.078310185185 | 33.424 |
| 44252.119976851856 | 32.999 |
| 44252.16164351852 | 32.516 |
| 44252.203310185185 | 32.188 |
| 44252.244976851856 | 32.014 |
| 44252.28664351852 | 32.034 |
| 44252.328310185185 | 32.092 |
| 44252.369976851856 | 32.092 |
| 44252.41164351852 | 32.265 |
| 44252.453310185185 | 32.96 |
| 44252.494976851856 | 34.041 |
| 44252.53664351852 | 34.563 |
| 44252.578310185185 | 34.563 |
| 44252.619976851856 | 34.312 |
| 44252.66164351852 | 34.099 |
| 44252.703310185185 | 34.119 |
| 44252.744976851856 | 34.273 |
| 44252.78664351852 | 34.37 |
| 44252.828310185185 | 34.312 |
| 44252.869976851856 | 34.312 |
| 44252.91164351852 | 34.157 |
| 44252.953310185185 | 33.887 |
| 44252.994976851856 | 33.52 |
| 44253.03664351852 | 32.98 |
| 44253.078310185185 | 32.381 |
| 44253.119976851856 | 31.995 |
| 44253.16164351852 | 32.034 |
| 44253.203310185185 | 32.034 |
| 44253.244976851856 | 32.053 |
| 44253.28664351852 | 32.053 |
| 44253.328310185185 | 32.072 |
| 44253.369976851856 | 32.034 |
| 44253.41164351852 | 32.072 |
| 44253.453310185185 | 32.053 |
| 44253.494976851856 | 32.787 |
| 44253.53664351852 | 33.443 |
| 44253.578310185185 | 33.906 |
| 44253.619976851856 | 33.443 |
| 44253.66164351852 | 32.516 |
| 44253.703310185185 | 32.265 |
| 44253.744976851856 | 32.574 |
| 44253.78664351852 | 33.308 |
| 44253.828310185185 | 33.713 |
| 44253.869976851856 | 33.887 |
| 44253.91164351852 | 33.81 |
| 44253.953310185185 | 33.675 |
| 44253.994976851856 | 33.578 |
| 44254.03664351852 | 33.385 |
| 44254.078310185185 | 33.308 |
| 44254.119976851856 | 33.288 |
| 44254.16164351852 | 33.173 |
| 44254.203310185185 | 33.037 |
| 44254.244976851856 | 32.825 |
| 44254.28664351852 | 32.574 |
| 44254.328310185185 | 32.053 |
| 44254.369976851856 | 32.072 |
| 44254.41164351852 | 32.034 |
| 44254.453310185185 | 32.072 |
| 44254.494976851856 | 32.323 |
| 44254.53664351852 | 32.439 |
| 44254.578310185185 | 32.574 |
| 44254.619976851856 | 32.516 |
| 44254.66164351852 | 32.362 |
| 44254.703310185185 | 32.169 |
| 44254.744976851856 | 31.995 |
| 44254.78664351852 | 32.034 |
| 44254.828310185185 | 32.053 |
| 44254.869976851856 | 32.053 |
| 44254.91164351852 | 32.092 |
| 44254.953310185185 | 32.014 |
| 44254.994976851856 | 32.034 |
| 44255.03664351852 | 32.034 |
| 44255.078310185185 | 32.014 |
| 44255.119976851856 | 32.034 |
| 44255.16164351852 | 32.034 |
| 44255.203310185185 | 32.014 |
| 44255.244976851856 | 32.034 |
| 44255.28664351852 | 32.053 |
| 44255.328310185185 | 32.053 |
| 44255.369976851856 | 32.034 |
| 44255.41164351852 | 32.072 |
| 44255.453310185185 | 32.034 |
| 44255.494976851856 | 32.072 |
| 44255.53664351852 | 32.092 |
| 44255.578310185185 | 32.323 |
| 44255.619976851856 | 32.13 |
| 44255.66164351852 | 32.072 |
| 44255.703310185185 | 32.014 |
| 44255.744976851856 | 32.014 |
| 44255.78664351852 | 32.053 |
| 44255.828310185185 | 32.014 |
| 44255.869976851856 | 32.034 |
| 44255.91164351852 | 32.034 |
| 44255.953310185185 | 32.053 |
| 44255.994976851856 | 32.072 |
| 44256.03664351852 | 32.014 |
| 44256.078310185185 | 32.053 |
| 44256.119976851856 | 32.053 |
| 44256.16164351852 | 32.034 |
| 44256.203310185185 | 32.034 |
| 44256.244976851856 | 32.034 |
| 44256.28664351852 | 32.053 |
| 44256.328310185185 | 32.034 |
| 44256.369976851856 | 32.053 |
| 44256.41164351852 | 32.053 |
| 44256.453310185185 | 32.053 |
| 44256.494976851856 | 32.072 |
| 44256.53664351852 | 32.092 |
| 44256.578310185185 | 32.092 |
| 44256.619976851856 | 32.111 |
| 44256.66164351852 | 32.092 |
| 44256.703310185185 | 32.014 |
| 44256.744976851856 | 32.014 |
| 44256.78664351852 | 32.053 |
| 44256.828310185185 | 32.034 |
| 44256.869976851856 | 32.014 |
| 44256.91164351852 | 32.014 |
| 44256.953310185185 | 32.014 |
| 44256.994976851856 | 32.034 |
| 44257.03664351852 | 32.034 |
| 44257.078310185185 | 32.014 |
| 44257.119976851856 | 32.014 |
| 44257.16164351852 | 32.014 |
| 44257.203310185185 | 32.053 |
| 44257.244976851856 | 32.072 |
| 44257.28664351852 | 32.053 |
| 44257.328310185185 | 32.072 |
| 44257.369976851856 | 32.014 |
| 44257.41164351852 | 32.014 |
| 44257.453310185185 | 32.034 |
| 44257.494976851856 | 32.072 |
| 44257.53664351852 | 32.072 |
| 44257.578310185185 | 32.034 |
| 44257.619976851856 | 32.072 |
| 44257.66164351852 | 32.072 |
| 44257.703310185185 | 32.072 |
| 44257.744976851856 | 32.014 |
| 44257.78664351852 | 32.034 |
| 44257.828310185185 | 32.053 |
| 44257.869976851856 | 32.034 |
| 44257.91164351852 | 32.034 |
| 44257.953310185185 | 31.995 |
| 44257.994976851856 | 32.014 |
| 44258.03664351852 | 32.014 |
| 44258.078310185185 | 32.053 |
| 44258.119976851856 | 32.034 |
| 44258.16164351852 | 32.092 |
| 44258.203310185185 | 32.053 |
| 44258.244976851856 | 32.072 |
| 44258.28664351852 | 32.092 |
| 44258.328310185185 | 32.034 |
| 44258.369976851856 | 32.072 |
| 44258.41164351852 | 32.034 |
| 44258.453310185185 | 32.053 |
| 44258.494976851856 | 32.034 |
| 44258.53664351852 | 32.053 |
| 44258.578310185185 | 32.014 |
| 44258.619976851856 | 32.072 |
| 44258.66164351852 | 32.034 |
| 44258.703310185185 | 32.034 |
| 44258.744976851856 | 32.053 |
| 44258.78664351852 | 32.651 |
| 44258.828310185185 | 33.578 |
| 44258.869976851856 | 34.659 |
| 44258.91164351852 | 35.045 |
| 44258.953310185185 | 35.2 |
| 44258.994976851856 | 35.007 |
| 44259.03664351852 | 34.871 |
| 44259.078310185185 | 34.524 |
| 44259.119976851856 | 34.08 |
| 44259.16164351852 | 33.617 |
| 44259.203310185185 | 33.211 |
| 44259.244976851856 | 33.037 |
| 44259.28664351852 | 32.748 |
| 44259.328310185185 | 32.536 |
| 44259.369976851856 | 32.304 |
| 44259.41164351852 | 32.478 |
| 44259.453310185185 | 32.806 |
| 44259.494976851856 | 33.115 |
| 44259.53664351852 | 33.539 |
| 44259.578310185185 | 33.597 |
| 44259.619976851856 | 33.52 |
| 44259.66164351852 | 33.385 |
| 44259.703310185185 | 33.211 |
| 44259.744976851856 | 33.115 |
| 44259.78664351852 | 33.076 |
| 44259.828310185185 | 33.134 |
| 44259.869976851856 | 33.346 |
| 44259.91164351852 | 33.559 |
| 44259.953310185185 | 33.559 |
| 44259.994976851856 | 33.346 |
| 44260.03664351852 | 33.057 |
| 44260.078310185185 | 32.729 |
| 44260.119976851856 | 32.304 |
| 44260.16164351852 | 32.207 |
| 44260.203310185185 | 32.072 |
| 44260.244976851856 | 32.034 |
| 44260.28664351852 | 32.072 |
| 44260.328310185185 | 32.034 |
| 44260.369976851856 | 32.034 |
| 44260.41164351852 | 32.304 |
| 44260.453310185185 | 33.346 |
| 44260.494976851856 | 34.659 |
| 44260.53664351852 | 35.335 |
| 44260.578310185185 | 35.451 |
| 44260.619976851856 | 35.605 |
| 44260.66164351852 | 35.702 |
| 44260.703310185185 | 36.107 |
| 44260.744976851856 | 36.435 |
| 44260.78664351852 | 36.705 |
| 44260.828310185185 | 36.956 |
| 44260.869976851856 | 37.207 |
| 44260.91164351852 | 37.285 |
| 44260.953310185185 | 37.034 |
| 44260.994976851856 | 36.744 |
| 44261.03664351852 | 35.914 |
| 44261.078310185185 | 35.509 |
| 44261.119976851856 | 35.007 |
| 44261.16164351852 | 34.447 |
| 44261.203310185185 | 33.868 |
| 44261.244976851856 | 33.173 |
| 44261.28664351852 | 32.478 |
| 44261.328310185185 | 32.092 |
| 44261.369976851856 | 32.227 |
| 44261.41164351852 | 32.922 |
| 44261.453310185185 | 33.906 |
| 44261.494976851856 | 34.968 |
| 44261.53664351852 | 35.644 |
| 44261.578310185185 | 35.47 |
| 44261.619976851856 | 35.18 |
| 44261.66164351852 | 35.238 |
| 44261.703310185185 | 36.126 |
| 44261.744976851856 | 36.686 |
| 44261.78664351852 | 36.976 |
| 44261.828310185185 | 37.169 |
| 44261.869976851856 | 37.285 |
| 44261.91164351852 | 37.362 |
| 44261.953310185185 | 37.227 |
| 44261.994976851856 | 36.879 |
| 44262.03664351852 | 36.435 |
| 44262.078310185185 | 35.933 |
| 44262.119976851856 | 35.431 |
| 44262.16164351852 | 34.852 |
| 44262.203310185185 | 34.234 |
| 44262.244976851856 | 33.578 |
| 44262.28664351852 | 32.999 |
| 44262.328310185185 | 32.555 |
| 44262.369976851856 | 32.787 |
| 44262.41164351852 | 33.694 |
| 44262.453310185185 | 35.084 |
| 44262.494976851856 | 36.223 |
| 44262.53664351852 | 36.339 |
| 44262.578310185185 | 36.609 |
| 44262.619976851856 | 36.956 |
| 44262.66164351852 | 37.381 |
| 44262.703310185185 | 37.767 |
| 44262.744976851856 | 37.825 |
| 44262.78664351852 | 38.115 |
| 44262.828310185185 | 38.269 |
| 44262.869976851856 | 38.81 |
| 44262.91164351852 | 38.906 |
| 44262.953310185185 | 38.713 |
| 44262.994976851856 | 38.346 |
| 44263.03664351852 | 37.787 |
| 44263.078310185185 | 37.246 |
| 44263.119976851856 | 36.783 |
| 44263.16164351852 | 36.223 |
| 44263.203310185185 | 35.721 |
| 44263.244976851856 | 35.161 |
| 44263.28664351852 | 34.601 |
| 44263.328310185185 | 34.176 |
| 44263.369976851856 | 34.041 |
| 44263.41164351852 | 34.331 |
| 44263.453310185185 | 34.929 |
| 44263.494976851856 | 35.528 |
| 44263.53664351852 | 35.76 |
| 44263.578310185185 | 36.705 |
| 44263.619976851856 | 36.841 |
| 44263.66164351852 | 36.841 |
| 44263.703310185185 | 37.381 |
| 44263.744976851856 | 37.748 |
| 44263.78664351852 | 37.999 |
| 44263.828310185185 | 38.115 |
| 44263.869976851856 | 37.96 |
| 44263.91164351852 | 37.902 |
| 44263.953310185185 | 37.767 |
| 44263.994976851856 | 37.574 |
| 44264.03664351852 | 37.13 |
| 44264.078310185185 | 36.783 |
| 44264.119976851856 | 36.397 |
| 44264.16164351852 | 35.953 |
| 44264.203310185185 | 35.451 |
| 44264.244976851856 | 34.871 |
| 44264.28664351852 | 34.331 |
| 44264.328310185185 | 33.983 |
| 44264.369976851856 | 33.964 |
| 44264.41164351852 | 34.891 |
| 44264.453310185185 | 35.895 |
| 44264.494976851856 | 37.362 |
| 44264.53664351852 | 37.458 |
| 44264.578310185185 | 38.327 |
| 44264.619976851856 | 38.346 |
| 44264.66164351852 | 39.428 |
| 44264.703310185185 | 39.736 |
| 44264.744976851856 | 40.238 |
| 44264.78664351852 | 40.567 |
| 44264.828310185185 | 40.373 |
| 44264.869976851856 | 40.817 |
| 44264.91164351852 | 40.779 |
| 44264.953310185185 | 40.316 |
| 44264.994976851856 | 40.103 |
| 44265.03664351852 | 39.717 |
| 44265.078310185185 | 38.559 |
| 44265.119976851856 | 37.999 |
| 44265.16164351852 | 37.536 |
| 44265.203310185185 | 36.899 |
| 44265.244976851856 | 36.358 |
| 44265.28664351852 | 35.412 |
| 44265.328310185185 | 34.756 |
| 44265.369976851856 | 34.717 |
| 44265.41164351852 | 34.814 |
| 44265.453310185185 | 34.698 |
| 44265.494976851856 | 36.184 |
| 44265.53664351852 | 37.014 |
| 44265.578310185185 | 37.072 |
| 44265.619976851856 | 36.86 |
| 44265.66164351852 | 35.798 |
| 44265.703310185185 | 35.644 |
| 44265.744976851856 | 35.644 |
| 44265.78664351852 | 35.586 |
| 44265.828310185185 | 35.451 |
| 44265.869976851856 | 35.335 |
| 44265.91164351852 | 35.161 |
| 44265.953310185185 | 34.968 |
| 44265.994976851856 | 34.582 |
| 44266.03664351852 | 34.041 |
| 44266.078310185185 | 33.501 |
| 44266.119976851856 | 32.96 |
| 44266.16164351852 | 32.246 |
| 44266.203310185185 | 32.053 |
| 44266.244976851856 | 32.014 |
| 44266.28664351852 | 31.995 |
| 44266.328310185185 | 32.034 |
| 44266.369976851856 | 32.053 |
| 44266.41164351852 | 32.053 |
| 44266.453310185185 | 32.285 |
| 44266.494976851856 | 33.269 |
| 44266.53664351852 | 35.122 |
| 44266.578310185185 | 34.196 |
| 44266.619976851856 | 33.906 |
| 44266.66164351852 | 34.215 |
| 44266.703310185185 | 34.736 |
| 44266.744976851856 | 35.084 |
| 44266.78664351852 | 35.026 |
| 44266.828310185185 | 34.871 |
| 44266.869976851856 | 34.833 |
| 44266.91164351852 | 34.891 |
| 44266.953310185185 | 34.968 |
| 44266.994976851856 | 34.775 |
| 44267.03664351852 | 34.485 |
| 44267.078310185185 | 33.983 |
| 44267.119976851856 | 33.52 |
| 44267.16164351852 | 33.134 |
| 44267.203310185185 | 32.787 |
| 44267.244976851856 | 32.207 |
| 44267.28664351852 | 32.034 |
| 44267.328310185185 | 32.014 |
| 44267.369976851856 | 32.034 |
| 44267.41164351852 | 32.883 |
| 44267.453310185185 | 34.427 |
| 44267.494976851856 | 35.856 |
| 44267.53664351852 | 36.551 |
| 44267.578310185185 | 36.744 |
| 44267.619976851856 | 36.493 |
| 44267.66164351852 | 37.246 |
| 44267.703310185185 | 37.709 |
| 44267.744976851856 | 37.748 |
| 44267.78664351852 | 37.555 |
| 44267.828310185185 | 37.381 |
| 44267.869976851856 | 37.227 |
| 44267.91164351852 | 37.092 |
| 44267.953310185185 | 36.937 |
| 44267.994976851856 | 36.59 |
| 44268.03664351852 | 36.107 |
| 44268.078310185185 | 35.605 |
| 44268.119976851856 | 35.142 |
| 44268.16164351852 | 34.698 |
| 44268.203310185185 | 34.292 |
| 44268.244976851856 | 33.829 |
| 44268.28664351852 | 33.443 |
| 44268.328310185185 | 33.443 |
| 44268.369976851856 | 33.694 |
| 44268.41164351852 | 34.543 |
| 44268.453310185185 | 35.393 |
| 44268.494976851856 | 35.914 |
| 44268.53664351852 | 36.57 |
| 44268.578310185185 | 36.165 |
| 44268.619976851856 | 36.049 |
| 44268.66164351852 | 36.435 |
| 44268.703310185185 | 36.821 |
| 44268.744976851856 | 37.072 |
| 44268.78664351852 | 37.014 |
| 44268.828310185185 | 36.841 |
| 44268.869976851856 | 36.783 |
| 44268.91164351852 | 36.705 |
| 44268.953310185185 | 36.3 |
| 44268.994976851856 | 35.972 |
| 44269.03664351852 | 35.644 |
| 44269.078310185185 | 35.335 |
| 44269.16164351852 | 35.026 |
| 44269.203310185185 | 34.543 |
| 44269.244976851856 | 34.138 |
| 44269.28664351852 | 33.617 |
| 44269.328310185185 | 32.999 |
| 44269.369976851856 | 32.593 |
| 44269.41164351852 | 32.478 |
| 44269.453310185185 | 32.748 |
| 44269.494976851856 | 33.037 |
| 44269.53664351852 | 32.98 |
| 44269.578310185185 | 33.269 |
| 44269.619976851856 | 33.385 |
| 44269.66164351852 | 33.694 |
| 44269.703310185185 | 33.462 |
| 44269.744976851856 | 33.231 |
| 44269.78664351852 | 32.902 |
| 44269.828310185185 | 32.709 |
| 44269.869976851856 | 32.69 |
| 44269.91164351852 | 32.806 |
| 44269.953310185185 | 32.825 |
| 44269.994976851856 | 32.651 |
| 44270.03664351852 | 32.381 |
| 44270.078310185185 | 32.092 |
| 44270.119976851856 | 32.034 |
| 44270.16164351852 | 32.034 |
| 44270.203310185185 | 32.072 |
| 44270.244976851856 | 32.034 |
| 44270.28664351852 | 32.053 |
| 44270.328310185185 | 32.053 |
| 44270.369976851856 | 32.034 |
| 44270.41164351852 | 32.014 |
| 44270.453310185185 | 32.072 |
| 44270.494976851856 | 32.111 |
| 44270.53664351852 | 32.825 |
| 44270.578310185185 | 33.385 |
| 44270.619976851856 | 34.582 |
| 44270.66164351852 | 34.427 |
| 44270.703310185185 | 34.891 |
| 44270.744976851856 | 34.273 |
| 44270.78664351852 | 34.08 |
| 44270.828310185185 | 34.601 |
| 44270.869976851856 | 35.2 |
| 44270.91164351852 | 35.547 |
| 44270.953310185185 | 35.779 |
| 44270.994976851856 | 35.837 |
| 44271.03664351852 | 35.779 |
| 44271.078310185185 | 35.624 |
| 44271.119976851856 | 35.412 |
| 44271.16164351852 | 35.007 |
| 44271.203310185185 | 34.563 |
| 44271.244976851856 | 34.08 |
| 44271.28664351852 | 33.501 |
| 44271.328310185185 | 32.98 |
| 44271.369976851856 | 32.767 |
| 44271.41164351852 | 32.922 |
| 44271.453310185185 | 33.926 |
| 44271.494976851856 | 35.296 |
| 44271.53664351852 | 36.068 |
| 44271.578310185185 | 36.474 |
| 44271.619976851856 | 35.875 |
| 44271.66164351852 | 35.373 |
| 44271.703310185185 | 35.566 |
| 44271.744976851856 | 36.126 |
| 44271.78664351852 | 36.802 |
| 44271.828310185185 | 36.648 |
| 44271.869976851856 | 36.339 |
| 44271.91164351852 | 36.068 |
| 44271.953310185185 | 35.798 |
| 44271.994976851856 | 35.509 |
| 44272.03664351852 | 35.238 |
| 44272.078310185185 | 35.007 |
| 44272.119976851856 | 34.833 |
| 44272.16164351852 | 34.717 |
| 44272.203310185185 | 34.466 |
| 44272.244976851856 | 34.138 |
| 44272.28664351852 | 33.771 |
| 44272.328310185185 | 33.366 |
| 44272.369976851856 | 33.327 |
| 44272.41164351852 | 33.443 |
| 44272.453310185185 | 33.983 |
| 44272.494976851856 | 34.485 |
| 44272.53664351852 | 35.335 |
| 44272.578310185185 | 37.072 |
| 44272.619976851856 | 38.076 |
| 44272.66164351852 | 38.385 |
| 44272.703310185185 | 38.462 |
| 44272.744976851856 | 38.25 |
| 44272.78664351852 | 38.076 |
| 44272.828310185185 | 38.095 |
| 44272.869976851856 | 38.231 |
| 44272.91164351852 | 38.25 |
| 44272.953310185185 | 38.095 |
| 44272.994976851856 | 37.671 |
| 44273.03664351852 | 36.956 |
| 44273.078310185185 | 36.165 |
| 44273.119976851856 | 35.431 |
| 44273.16164351852 | 34.659 |
| 44273.203310185185 | 33.926 |
| 44273.244976851856 | 33.115 |
| 44273.28664351852 | 32.381 |
| 44273.328310185185 | 32.034 |
| 44273.369976851856 | 32.053 |
| 44273.41164351852 | 32.053 |
| 44273.453310185185 | 32.671 |
| 44273.494976851856 | 33.926 |
| 44273.53664351852 | 35.586 |
| 44273.578310185185 | 36.841 |
| 44273.619976851856 | 36.628 |
| 44273.66164351852 | 36.956 |
| 44273.703310185185 | 37.709 |
| 44273.744976851856 | 38.482 |
| 44273.78664351852 | 38.733 |
| 44273.828310185185 | 39.022 |
| 44273.869976851856 | 39.157 |
| 44273.91164351852 | 39.543 |
| 44273.953310185185 | 39.582 |
| 44273.994976851856 | 39.312 |
| 44274.03664351852 | 38.926 |
| 44274.078310185185 | 38.443 |
| 44274.119976851856 | 37.864 |
| 44274.16164351852 | 37.265 |
| 44274.203310185185 | 36.667 |
| 44274.244976851856 | 36.068 |
| 44274.28664351852 | 35.315 |
| 44274.328310185185 | 34.717 |
| 44274.369976851856 | 34.408 |
| 44274.41164351852 | 34.505 |
| 44274.453310185185 | 35.315 |
| 44274.494976851856 | 36.802 |
| 44274.53664351852 | 38.076 |
| 44274.578310185185 | 38.983 |
| 44274.619976851856 | 39.891 |
| 44274.66164351852 | 40.798 |
| 44274.703310185185 | 41.281 |
| 44274.744976851856 | 41.358 |
| 44274.78664351852 | 41.435 |
| 44274.828310185185 | 41.686 |
| 44274.869976851856 | 41.512 |
| 44274.91164351852 | 41.3 |
| 44274.953310185185 | 40.972 |
| 44274.994976851856 | 40.682 |
| 44275.03664351852 | 40.258 |
| 44275.078310185185 | 39.929 |
| 44275.119976851856 | 39.37 |
| 44275.16164351852 | 38.713 |
| 44275.203310185185 | 37.999 |
| 44275.244976851856 | 37.285 |
| 44275.28664351852 | 36.532 |
| 44275.328310185185 | 35.817 |
| 44275.369976851856 | 35.547 |
| 44275.41164351852 | 35.547 |
| 44275.453310185185 | 36.57 |
| 44275.494976851856 | 38.076 |
| 44275.53664351852 | 39.543 |
| 44275.578310185185 | 40.258 |
| 44275.619976851856 | 40.972 |
| 44275.66164351852 | 41.532 |
| 44275.703310185185 | 41.725 |
| 44275.744976851856 | 41.821 |
| 44275.78664351852 | 42.014 |
| 44275.828310185185 | 42.13 |
| 44275.869976851856 | 42.381 |
| 44275.91164351852 | 42.497 |
| 44275.953310185185 | 42.381 |
| 44275.994976851856 | 41.976 |
| 44276.03664351852 | 41.397 |
| 44276.078310185185 | 39.485 |
| 44276.119976851856 | 38.617 |
| 44276.16164351852 | 38.192 |
| 44276.203310185185 | 37.844 |
| 44276.244976851856 | 37.014 |
| 44276.28664351852 | 36.126 |
| 44276.328310185185 | 35.393 |
| 44276.369976851856 | 34.775 |
| 44276.41164351852 | 34.698 |
| 44276.453310185185 | 35.335 |
| 44276.494976851856 | 36.628 |
| 44276.53664351852 | 37.96 |
| 44276.578310185185 | 38.115 |
| 44276.619976851856 | 38.733 |
| 44276.66164351852 | 39.563 |
| 44276.703310185185 | 40.431 |
| 44276.744976851856 | 40.084 |
| 44276.78664351852 | 39.968 |
| 44276.828310185185 | 39.582 |
| 44276.869976851856 | 39.292 |
| 44276.91164351852 | 38.945 |
| 44276.953310185185 | 38.346 |
| 44276.994976851856 | 37.709 |
| 44277.03664351852 | 37.169 |
| 44277.078310185185 | 36.705 |
| 44277.119976851856 | 35.837 |
| 44277.16164351852 | 35.277 |
| 44277.203310185185 | 34.91 |
| 44277.244976851856 | 34.447 |
| 44277.28664351852 | 33.868 |
| 44277.328310185185 | 33.501 |
| 44277.369976851856 | 33.404 |
| 44277.41164351852 | 33.829 |
| 44277.453310185185 | 34.698 |
| 44277.494976851856 | 36.261 |
| 44277.53664351852 | 37.96 |
| 44277.578310185185 | 38.655 |
| 44277.619976851856 | 39.292 |
| 44277.66164351852 | 39.794 |
| 44277.703310185185 | 40.547 |
| 44277.744976851856 | 40.953 |
| 44277.78664351852 | 40.528 |
| 44277.828310185185 | 40.316 |
| 44277.869976851856 | 40.277 |
| 44277.91164351852 | 40.238 |
| 44277.953310185185 | 40.103 |
| 44277.994976851856 | 39.601 |
| 44278.03664351852 | 39.061 |
| 44278.078310185185 | 38.385 |
| 44278.119976851856 | 37.574 |
| 44278.16164351852 | 36.86 |
| 44278.203310185185 | 35.972 |
| 44278.244976851856 | 35.2 |
| 44278.28664351852 | 34.659 |
| 44278.328310185185 | 34.157 |
| 44278.369976851856 | 33.887 |
| 44278.41164351852 | 33.81 |
| 44278.453310185185 | 34.505 |
| 44278.494976851856 | 35.084 |
| 44278.53664351852 | 35.586 |
| 44278.578310185185 | 36.86 |
| 44278.619976851856 | 38.366 |
| 44278.66164351852 | 38.346 |
| 44278.703310185185 | 38.887 |
| 44278.744976851856 | 38.404 |
| 44278.78664351852 | 38.25 |
| 44278.828310185185 | 38.231 |
| 44278.869976851856 | 38.115 |
| 44278.91164351852 | 37.999 |
| 44278.953310185185 | 37.632 |
| 44278.994976851856 | 37.362 |
| 44279.03664351852 | 36.937 |
| 44279.078310185185 | 36.551 |
| 44279.119976851856 | 36.049 |
| 44279.16164351852 | 35.47 |
| 44279.203310185185 | 34.891 |
| 44279.244976851856 | 34.35 |
| 44279.28664351852 | 33.81 |
| 44279.328310185185 | 33.404 |
| 44279.369976851856 | 33.211 |
| 44279.41164351852 | 33.443 |
| 44279.453310185185 | 34.312 |
| 44279.494976851856 | 35.953 |
| 44279.53664351852 | 37.304 |
| 44279.578310185185 | 37.323 |
| 44279.619976851856 | 37.613 |
| 44279.66164351852 | 38.115 |
| 44279.703310185185 | 38.752 |
| 44279.744976851856 | 38.983 |
| 44279.78664351852 | 39.061 |
| 44279.828310185185 | 38.983 |
| 44279.869976851856 | 39.022 |
| 44279.91164351852 | 39.003 |
| 44279.953310185185 | 38.868 |
| 44279.994976851856 | 38.636 |
| 44280.03664351852 | 38.115 |
| 44280.078310185185 | 37.4 |
| 44280.119976851856 | 36.686 |
| 44280.16164351852 | 35.991 |
| 44280.203310185185 | 35.47 |
| 44280.244976851856 | 34.929 |
| 44280.28664351852 | 34.331 |
| 44280.328310185185 | 33.81 |
| 44280.369976851856 | 33.636 |
| 44280.41164351852 | 34.08 |
| 44280.453310185185 | 35.296 |
| 44280.494976851856 | 35.489 |
| 44280.53664351852 | 35.566 |
| 44280.578310185185 | 36.068 |
| 44280.619976851856 | 37.632 |
| 44280.66164351852 | 38.694 |
| 44280.703310185185 | 38.906 |
| 44280.744976851856 | 39.061 |
| 44280.78664351852 | 38.829 |
| 44280.828310185185 | 38.945 |
| 44280.869976851856 | 39.099 |
| 44280.91164351852 | 39.196 |
| 44280.953310185185 | 39.196 |
| 44280.994976851856 | 39.061 |
| 44281.03664351852 | 38.675 |
| 44281.078310185185 | 38.134 |
| 44281.119976851856 | 37.555 |
| 44281.16164351852 | 36.918 |
| 44281.203310185185 | 36.397 |
| 44281.244976851856 | 35.875 |
| 44281.28664351852 | 35.354 |
| 44281.328310185185 | 34.91 |
| 44281.369976851856 | 34.582 |
| 44281.41164351852 | 34.678 |
| 44281.453310185185 | 35.238 |
| 44281.494976851856 | 36.223 |
| 44281.53664351852 | 37.825 |
| 44281.578310185185 | 37.594 |
| 44281.619976851856 | 37.632 |
| 44281.66164351852 | 37.864 |
| 44281.703310185185 | 37.748 |
| 44281.744976851856 | 37.806 |
| 44281.78664351852 | 37.806 |
| 44281.828310185185 | 38.018 |
| 44281.869976851856 | 38.018 |
| 44281.91164351852 | 38.018 |
| 44281.953310185185 | 37.729 |
| 44281.994976851856 | 37.555 |
| 44282.03664351852 | 36.918 |
| 44282.078310185185 | 36.397 |
| 44282.119976851856 | 35.315 |
| 44282.16164351852 | 34.91 |
| 44282.203310185185 | 34.601 |
| 44282.244976851856 | 34.35 |
| 44282.28664351852 | 33.887 |
| 44282.328310185185 | 33.482 |
| 44282.369976851856 | 33.424 |
| 44282.41164351852 | 33.636 |
| 44282.453310185185 | 34.273 |
| 44282.494976851856 | 35.817 |
| 44282.53664351852 | 37.632 |
| 44282.578310185185 | 38.926 |
| 44282.619976851856 | 39.408 |
| 44282.66164351852 | 40.045 |
| 44282.703310185185 | 40.026 |
| 44282.744976851856 | 39.987 |
| 44282.78664351852 | 40.258 |
| 44282.828310185185 | 40.2 |
| 44282.869976851856 | 40.335 |
| 44282.91164351852 | 40.567 |
| 44282.953310185185 | 40.586 |
| 44282.994976851856 | 40.296 |
| 44283.03664351852 | 39.794 |
| 44283.078310185185 | 38.945 |
| 44283.119976851856 | 37.671 |
| 44283.16164351852 | 36.628 |
| 44283.203310185185 | 35.663 |
| 44283.244976851856 | 34.833 |
| 44283.28664351852 | 34.003 |
| 44283.328310185185 | 33.173 |
| 44283.369976851856 | 32.864 |
| 44283.41164351852 | 33.211 |
| 44283.453310185185 | 34.601 |
| 44283.494976851856 | 36.59 |
| 44283.53664351852 | 38.404 |
| 44283.578310185185 | 39.485 |
| 44283.619976851856 | 39.949 |
| 44283.66164351852 | 40.895 |
| 44283.703310185185 | 41.725 |
| 44283.744976851856 | 42.034 |
| 44283.78664351852 | 41.841 |
| 44283.828310185185 | 41.686 |
| 44283.869976851856 | 41.706 |
| 44283.91164351852 | 41.802 |
| 44283.953310185185 | 41.686 |
| 44283.994976851856 | 41.242 |
| 44284.03664351852 | 40.509 |
| 44284.078310185185 | 39.833 |
| 44284.119976851856 | 39.119 |
| 44284.16164351852 | 38.366 |
| 44284.203310185185 | 37.69 |
| 44284.244976851856 | 36.937 |
| 44284.28664351852 | 36.126 |
| 44284.328310185185 | 35.47 |
| 44284.369976851856 | 35.315 |
| 44284.41164351852 | 35.624 |
| 44284.453310185185 | 36.879 |
| 44284.494976851856 | 38.636 |
| 44284.53664351852 | 40.2 |
| 44284.578310185185 | 41.358 |
| 44284.619976851856 | 42.362 |
| 44284.66164351852 | 43.192 |
| 44284.703310185185 | 43.385 |
| 44284.744976851856 | 43.346 |
| 44284.78664351852 | 43.385 |
| 44284.828310185185 | 43.289 |
| 44284.869976851856 | 42.96 |
| 44284.91164351852 | 42.478 |
| 44284.953310185185 | 41.397 |
| 44284.994976851856 | 40.702 |
| 44285.03664351852 | 40.026 |
| 44285.078310185185 | 38.733 |
| 44285.119976851856 | 37.651 |
| 44285.16164351852 | 36.686 |
| 44285.203310185185 | 35.586 |
| 44285.244976851856 | 34.659 |
| 44285.28664351852 | 33.771 |
| 44285.328310185185 | 33.057 |
| 44285.369976851856 | 32.729 |
| 44285.41164351852 | 33.153 |
| 44285.453310185185 | 33.771 |
| 44285.494976851856 | 35.2 |
| 44285.53664351852 | 36.184 |
| 44285.578310185185 | 37.13 |
| 44285.619976851856 | 37.69 |
| 44285.66164351852 | 38.501 |
| 44285.703310185185 | 39.331 |
| 44285.744976851856 | 39.678 |
| 44285.78664351852 | 39.022 |
| 44285.828310185185 | 38.25 |
| 44285.869976851856 | 37.806 |
| 44285.91164351852 | 37.13 |
| 44285.953310185185 | 36.339 |
| 44285.994976851856 | 35.605 |
| 44286.03664351852 | 34.891 |
| 44286.078310185185 | 34.157 |
| 44286.119976851856 | 33.424 |
| 44286.16164351852 | 32.729 |
| 44286.203310185185 | 31.956 |
| 44286.244976851856 | 32.053 |
| 44286.28664351852 | 32.014 |
| 44286.328310185185 | 32.053 |
| 44286.369976851856 | 32.014 |
| 44286.41164351852 | 32.053 |
| 44286.453310185185 | 32.207 |
| 44286.494976851856 | 33.617 |
| 44286.53664351852 | 35.702 |
| 44286.578310185185 | 37.594 |
| 44286.619976851856 | 38.578 |
| 44286.66164351852 | 38.733 |
| 44286.703310185185 | 39.543 |
| 44286.744976851856 | 40.026 |
| 44286.78664351852 | 39.678 |
| 44286.828310185185 | 39.447 |
| 44286.869976851856 | 39.254 |
| 44286.91164351852 | 39.119 |
| 44286.953310185185 | 38.829 |
| 44286.994976851856 | 38.327 |
| 44287.03664351852 | 37.671 |
| 44287.078310185185 | 36.956 |
| 44287.119976851856 | 36.184 |
| 44287.16164351852 | 35.315 |
| 44287.203310185185 | 34.485 |
| 44287.244976851856 | 33.597 |
| 44287.28664351852 | 32.787 |
| 44287.328310185185 | 32.014 |
| 44287.369976851856 | 32.034 |
| 44287.41164351852 | 32.458 |
| 44287.453310185185 | 33.868 |
| 44287.494976851856 | 36.01 |
| 44287.53664351852 | 38.038 |
| 44287.578310185185 | 39.678 |
| 44287.619976851856 | 40.605 |
| 44287.66164351852 | 41.725 |
| 44287.703310185185 | 42.671 |
| 44287.744976851856 | 42.98 |
| 44287.78664351852 | 42.729 |
| 44287.828310185185 | 42.439 |
| 44287.869976851856 | 42.265 |
| 44287.91164351852 | 42.265 |
| 44287.953310185185 | 42.053 |
| 44287.994976851856 | 41.609 |
| 44288.03664351852 | 40.817 |
| 44288.078310185185 | 39.929 |
| 44288.119976851856 | 39.099 |
| 44288.16164351852 | 38.346 |
| 44288.203310185185 | 37.516 |
| 44288.244976851856 | 36.59 |
| 44288.28664351852 | 35.76 |
| 44288.328310185185 | 34.968 |
| 44288.369976851856 | 34.775 |
| 44288.41164351852 | 34.814 |
| 44288.453310185185 | 36.686 |
| 44288.494976851856 | 38.617 |
| 44288.53664351852 | 40.277 |
| 44288.578310185185 | 41.628 |
| 44288.619976851856 | 43.095 |
| 44288.66164351852 | 44.292 |
| 44288.703310185185 | 44.968 |
| 44288.744976851856 | 45.258 |
| 44288.78664351852 | 45.142 |
| 44288.828310185185 | 44.891 |
| 44288.869976851856 | 44.717 |
| 44288.91164351852 | 44.466 |
| 44288.953310185185 | 44.041 |
| 44288.994976851856 | 43.404 |
| 44289.03664351852 | 42.536 |
| 44289.078310185185 | 41.609 |
| 44289.119976851856 | 40.702 |
| 44289.16164351852 | 39.814 |
| 44289.203310185185 | 38.964 |
| 44289.244976851856 | 38.038 |
| 44289.28664351852 | 37.149 |
| 44289.328310185185 | 36.281 |
| 44289.369976851856 | 36.049 |
| 44289.41164351852 | 36.416 |
| 44289.453310185185 | 37.787 |
| 44289.494976851856 | 39.659 |
| 44289.53664351852 | 41.358 |
| 44289.578310185185 | 42.825 |
| 44289.619976851856 | 44.428 |
| 44289.66164351852 | 45.644 |
| 44289.703310185185 | 46.377 |
| 44289.744976851856 | 46.609 |
| 44289.78664351852 | 46.339 |
| 44289.828310185185 | 46.03 |
| 44289.869976851856 | 45.779 |
| 44289.91164351852 | 45.412 |
| 44289.953310185185 | 44.775 |
| 44289.994976851856 | 43.964 |
| 44290.03664351852 | 43.038 |
| 44290.078310185185 | 41.995 |
| 44290.119976851856 | 41.088 |
| 44290.16164351852 | 40.142 |
| 44290.203310185185 | 39.196 |
| 44290.244976851856 | 38.192 |
| 44290.28664351852 | 37.285 |
| 44290.328310185185 | 36.474 |
| 44290.369976851856 | 36.281 |
| 44290.41164351852 | 36.686 |
| 44290.453310185185 | 37.748 |
| 44290.494976851856 | 38.926 |
| 44290.53664351852 | 40.509 |
| 44290.578310185185 | 42.13 |
| 44290.619976851856 | 43.501 |
| 44290.66164351852 | 44.64 |
| 44290.703310185185 | 44.621 |
| 44290.744976851856 | 44.833 |
| 44290.78664351852 | 44.234 |
| 44290.828310185185 | 43.694 |
| 44290.869976851856 | 43.424 |
| 44290.91164351852 | 43.25 |
| 44290.953310185185 | 43.269 |
| 44290.994976851856 | 43.115 |
| 44291.03664351852 | 42.69 |
| 44291.078310185185 | 42.13 |
| 44291.119976851856 | 41.242 |
| 44291.16164351852 | 40.296 |
| 44291.203310185185 | 39.273 |
| 44291.244976851856 | 38.231 |
| 44291.28664351852 | 37.304 |
| 44291.328310185185 | 36.59 |
| 44291.369976851856 | 36.377 |
| 44291.41164351852 | 36.976 |
| 44291.453310185185 | 38.366 |
| 44291.494976851856 | 38.81 |
| 44291.53664351852 | 40.875 |
| 44291.578310185185 | 43.095 |
| 44291.619976851856 | 45.103 |
| 44291.66164351852 | 46.358 |
| 44291.703310185185 | 46.821 |
| 44291.744976851856 | 46.918 |
| 44291.78664351852 | 46.551 |
| 44291.828310185185 | 46.011 |
| 44291.869976851856 | 45.47 |
| 44291.91164351852 | 44.852 |
| 44291.953310185185 | 44.138 |
| 44291.994976851856 | 43.25 |
| 44292.03664351852 | 42.343 |
| 44292.078310185185 | 41.512 |
| 44292.119976851856 | 40.779 |
| 44292.16164351852 | 39.929 |
| 44292.203310185185 | 38.926 |
| 44292.244976851856 | 38.018 |
| 44292.28664351852 | 37.343 |
| 44292.328310185185 | 36.725 |
| 44292.369976851856 | 36.609 |
| 44292.41164351852 | 37.053 |
| 44292.453310185185 | 38.482 |
| 44292.494976851856 | 39.563 |
| 44292.53664351852 | 40.258 |
| 44292.578310185185 | 40.856 |
| 44292.619976851856 | 41.03 |
| 44292.66164351852 | 41.3 |
| 44292.703310185185 | 41.261 |
| 44292.744976851856 | 41.223 |
| 44292.78664351852 | 41.126 |
| 44292.828310185185 | 40.76 |
| 44292.869976851856 | 40.431 |
| 44292.91164351852 | 39.872 |
| 44292.953310185185 | 39.254 |
| 44292.994976851856 | 38.52 |
| 44293.03664351852 | 37.883 |
| 44293.078310185185 | 37.381 |
| 44293.119976851856 | 36.86 |
| 44293.16164351852 | 36.416 |
| 44293.203310185185 | 35.972 |
| 44293.244976851856 | 35.586 |
| 44293.28664351852 | 35.238 |
| 44293.328310185185 | 35.026 |
| 44293.369976851856 | 34.929 |
| 44293.41164351852 | 35.2 |
| 44293.453310185185 | 35.953 |
| 44293.494976851856 | 37.69 |
| 44293.53664351852 | 39.37 |
| 44293.578310185185 | 41.049 |
| 44293.619976851856 | 42.536 |
| 44293.66164351852 | 43.578 |
| 44293.703310185185 | 45.335 |
| 44293.744976851856 | 45.663 |
| 44293.78664351852 | 44.698 |
| 44293.828310185185 | 43.81 |
| 44293.869976851856 | 43.424 |
| 44293.91164351852 | 42.864 |
| 44293.953310185185 | 41.879 |
| 44293.994976851856 | 40.991 |
| 44294.03664351852 | 40.277 |
| 44294.078310185185 | 39.582 |
| 44294.119976851856 | 38.829 |
| 44294.16164351852 | 37.96 |
| 44294.203310185185 | 37.227 |
| 44294.244976851856 | 36.551 |
| 44294.28664351852 | 35.953 |
| 44294.328310185185 | 35.605 |
| 44294.369976851856 | 35.624 |
| 44294.41164351852 | 36.126 |
| 44294.453310185185 | 37.304 |
| 44294.494976851856 | 38.713 |
| 44294.53664351852 | 40.431 |
| 44294.578310185185 | 41.59 |
| 44294.619976851856 | 42.169 |
| 44294.66164351852 | 43.076 |
| 44294.703310185185 | 44.041 |
| 44294.744976851856 | 44.138 |
| 44294.78664351852 | 44.177 |
| 44294.828310185185 | 44.196 |
| 44294.869976851856 | 43.887 |
| 44294.91164351852 | 43.095 |
| 44294.953310185185 | 42.169 |
| 44294.994976851856 | 41.339 |
| 44295.03664351852 | 40.663 |
| 44295.078310185185 | 40.065 |
| 44295.119976851856 | 39.447 |
| 44295.16164351852 | 38.829 |
| 44295.203310185185 | 37.96 |
| 44295.244976851856 | 37.092 |
| 44295.28664351852 | 36.319 |
| 44295.328310185185 | 35.586 |
| 44295.369976851856 | 35.238 |
| 44295.41164351852 | 35.586 |
| 44295.453310185185 | 36.474 |
| 44295.494976851856 | 38.578 |
| 44295.53664351852 | 40.045 |
| 44295.578310185185 | 41.397 |
| 44295.619976851856 | 42.632 |
| 44295.66164351852 | 43.346 |
| 44295.703310185185 | 43.52 |
| 44295.744976851856 | 43.501 |
| 44295.78664351852 | 43.076 |
| 44295.828310185185 | 42.748 |
| 44295.869976851856 | 42.767 |
| 44295.91164351852 | 42.516 |
| 44295.953310185185 | 41.937 |
| 44295.994976851856 | 41.107 |
| 44296.03664351852 | 40.103 |
| 44296.078310185185 | 39.119 |
| 44296.119976851856 | 38.231 |
| 44296.16164351852 | 37.343 |
| 44296.203310185185 | 36.512 |
| 44296.244976851856 | 35.682 |
| 44296.28664351852 | 34.814 |
| 44296.328310185185 | 34.099 |
| 44296.369976851856 | 34.138 |
| 44296.41164351852 | 34.833 |
| 44296.453310185185 | 36.435 |
| 44296.494976851856 | 38.366 |
| 44296.53664351852 | 40.161 |
| 44296.578310185185 | 41.995 |
| 44296.619976851856 | 43.848 |
| 44296.66164351852 | 45.161 |
| 44296.703310185185 | 46.011 |
| 44296.744976851856 | 46.319 |
| 44296.78664351852 | 46.165 |
| 44296.828310185185 | 45.624 |
| 44296.869976851856 | 45.219 |
| 44296.91164351852 | 44.582 |
| 44296.953310185185 | 43.771 |
| 44296.994976851856 | 42.845 |
| 44297.03664351852 | 42.034 |
| 44297.078310185185 | 41.223 |
| 44297.119976851856 | 40.373 |
| 44297.16164351852 | 39.466 |
| 44297.203310185185 | 38.443 |
| 44297.244976851856 | 37.516 |
| 44297.28664351852 | 36.474 |
| 44297.328310185185 | 35.798 |
| 44297.369976851856 | 35.76 |
| 44297.41164351852 | 36.339 |
| 44297.453310185185 | 37.69 |
| 44297.494976851856 | 39.582 |
| 44297.53664351852 | 41.339 |
| 44297.578310185185 | 43.346 |
| 44297.619976851856 | 45.277 |
| 44297.66164351852 | 46.493 |
| 44297.703310185185 | 46.957 |
| 44297.744976851856 | 47.304 |
| 44297.78664351852 | 47.014 |
| 44297.828310185185 | 46.551 |
| 44297.869976851856 | 45.798 |
| 44297.91164351852 | 45.084 |
| 44297.953310185185 | 44.292 |
| 44297.994976851856 | 43.404 |
| 44298.03664351852 | 42.613 |
| 44298.078310185185 | 41.706 |
| 44298.119976851856 | 40.779 |
| 44298.16164351852 | 39.872 |
| 44298.203310185185 | 38.81 |
| 44298.244976851856 | 37.844 |
| 44298.28664351852 | 36.918 |
| 44298.328310185185 | 36.165 |
| 44298.369976851856 | 36.146 |
| 44298.41164351852 | 36.59 |
| 44298.453310185185 | 37.941 |
| 44298.494976851856 | 39.678 |
| 44298.53664351852 | 41.397 |
| 44298.578310185185 | 43.231 |
| 44298.619976851856 | 45.084 |
| 44298.66164351852 | 46.3 |
| 44298.703310185185 | 46.937 |
| 44298.744976851856 | 47.092 |
| 44298.78664351852 | 46.59 |
| 44298.828310185185 | 45.837 |
| 44298.869976851856 | 45.316 |
| 44298.91164351852 | 44.814 |
| 44298.953310185185 | 44.196 |
| 44298.994976851856 | 43.308 |
| 44299.03664351852 | 42.285 |
| 44299.078310185185 | 41.339 |
| 44299.119976851856 | 40.354 |
| 44299.16164351852 | 39.37 |
| 44299.203310185185 | 38.578 |
| 44299.244976851856 | 37.748 |
| 44299.28664351852 | 36.899 |
| 44299.328310185185 | 36.339 |
| 44299.369976851856 | 36.068 |
| 44299.41164351852 | 36.242 |
| 44299.453310185185 | 36.705 |
| 44299.494976851856 | 38.346 |
| 44299.53664351852 | 40.567 |
| 44299.578310185185 | 41.918 |
| 44299.619976851856 | 41.841 |
| 44299.66164351852 | 41.725 |
| 44299.703310185185 | 41.841 |
| 44299.744976851856 | 42.169 |
| 44299.78664351852 | 42.343 |
| 44299.828310185185 | 42.072 |
| 44299.869976851856 | 41.628 |
| 44299.91164351852 | 40.953 |
| 44299.953310185185 | 40.238 |
| 44299.994976851856 | 39.524 |
| 44300.03664351852 | 38.906 |
| 44300.078310185185 | 38.192 |
| 44300.119976851856 | 37.671 |
| 44300.16164351852 | 36.841 |
| 44300.203310185185 | 36.204 |
| 44300.244976851856 | 35.528 |
| 44300.28664351852 | 34.871 |
| 44300.328310185185 | 34.505 |
| 44300.369976851856 | 34.678 |
| 44300.41164351852 | 35.451 |
| 44300.453310185185 | 37.188 |
| 44300.494976851856 | 39.292 |
| 44300.53664351852 | 41.126 |
| 44300.578310185185 | 42.632 |
| 44300.619976851856 | 43.559 |
| 44300.66164351852 | 43.655 |
| 44300.703310185185 | 43.984 |
| 44300.744976851856 | 44.061 |
| 44300.78664351852 | 43.79 |
| 44300.828310185185 | 43.54 |
| 44300.869976851856 | 43.095 |
| 44300.91164351852 | 42.439 |
| 44300.953310185185 | 41.686 |
| 44300.994976851856 | 41.107 |
| 44301.03664351852 | 40.509 |
| 44301.078310185185 | 39.891 |
| 44301.119976851856 | 39.273 |
| 44301.16164351852 | 38.559 |
| 44301.203310185185 | 37.941 |
| 44301.244976851856 | 37.4 |
| 44301.28664351852 | 36.841 |
| 44301.328310185185 | 36.512 |
| 44301.369976851856 | 36.686 |
| 44301.41164351852 | 37.555 |
| 44301.453310185185 | 38.713 |
| 44301.494976851856 | 39.891 |
| 44301.53664351852 | 40.605 |
| 44301.578310185185 | 40.798 |
| 44301.619976851856 | 40.953 |
| 44301.66164351852 | 41.281 |
| 44301.703310185185 | 41.802 |
| 44301.744976851856 | 41.512 |
| 44301.78664351852 | 40.663 |
| 44301.828310185185 | 39.756 |
| 44301.869976851856 | 38.983 |
| 44301.91164351852 | 38.385 |
| 44301.953310185185 | 37.651 |
| 44301.994976851856 | 36.956 |
| 44302.03664351852 | 36.435 |
| 44302.078310185185 | 36.03 |
| 44302.119976851856 | 35.47 |
| 44302.16164351852 | 35.007 |
| 44302.203310185185 | 34.427 |
| 44302.244976851856 | 33.945 |
| 44302.28664351852 | 33.443 |
| 44302.328310185185 | 33.269 |
| 44302.369976851856 | 33.346 |
| 44302.41164351852 | 34.138 |
| 44302.453310185185 | 35.47 |
| 44302.494976851856 | 37.092 |
| 44302.53664351852 | 38.752 |
| 44302.578310185185 | 40.258 |
| 44302.619976851856 | 40.567 |
| 44302.66164351852 | 41.628 |
| 44302.703310185185 | 41.763 |
| 44302.744976851856 | 42.13 |
| 44302.78664351852 | 42.285 |
| 44302.828310185185 | 41.899 |
| 44302.869976851856 | 41.493 |
| 44302.91164351852 | 41.068 |
| 44302.953310185185 | 40.74 |
| 44302.994976851856 | 40.277 |
| 44303.03664351852 | 39.794 |
| 44303.078310185185 | 39.177 |
| 44303.119976851856 | 38.462 |
| 44303.16164351852 | 37.806 |
| 44303.203310185185 | 37.188 |
| 44303.244976851856 | 36.512 |
| 44303.28664351852 | 35.798 |
| 44303.328310185185 | 35.393 |
| 44303.369976851856 | 35.296 |
| 44303.41164351852 | 35.547 |
| 44303.453310185185 | 35.837 |
| 44303.494976851856 | 36.397 |
| 44303.53664351852 | 37.864 |
| 44303.578310185185 | 39.37 |
| 44303.619976851856 | 40.084 |
| 44303.66164351852 | 40.663 |
| 44303.703310185185 | 41.03 |
| 44303.744976851856 | 41.068 |
| 44303.78664351852 | 40.837 |
| 44303.828310185185 | 40.547 |
| 44303.869976851856 | 40.2 |
| 44303.91164351852 | 39.91 |
| 44303.953310185185 | 39.428 |
| 44303.994976851856 | 38.733 |
| 44304.03664351852 | 37.96 |
| 44304.078310185185 | 37.092 |
| 44304.119976851856 | 36.358 |
| 44304.16164351852 | 35.624 |
| 44304.203310185185 | 34.852 |
| 44304.244976851856 | 34.119 |
| 44304.28664351852 | 33.346 |
| 44304.328310185185 | 32.748 |
| 44304.369976851856 | 32.767 |
| 44304.41164351852 | 33.675 |
| 44304.453310185185 | 35.412 |
| 44304.494976851856 | 37.516 |
| 44304.53664351852 | 39.312 |
| 44304.578310185185 | 40.779 |
| 44304.619976851856 | 42.111 |
| 44304.66164351852 | 43.945 |
| 44304.703310185185 | 44.736 |
| 44304.744976851856 | 44.987 |
| 44304.78664351852 | 44.08 |
| 44304.828310185185 | 43.926 |
| 44304.869976851856 | 43.675 |
| 44304.91164351852 | 43.134 |
| 44304.953310185185 | 42.516 |
| 44304.994976851856 | 41.648 |
| 44305.03664351852 | 40.702 |
| 44305.078310185185 | 39.717 |
| 44305.119976851856 | 39.138 |
| 44305.16164351852 | 38.578 |
| 44305.203310185185 | 38.018 |
| 44305.244976851856 | 37.304 |
| 44305.28664351852 | 36.648 |
| 44305.328310185185 | 36.126 |
| 44305.369976851856 | 36.281 |
| 44305.41164351852 | 36.648 |
| 44305.453310185185 | 38.057 |
| 44305.494976851856 | 39.447 |
| 44305.53664351852 | 41.493 |
| 44305.578310185185 | 43.733 |
| 44305.619976851856 | 45.142 |
| 44305.66164351852 | 45.47 |
| 44305.703310185185 | 45.509 |
| 44305.744976851856 | 45.431 |
| 44305.78664351852 | 45.451 |
| 44305.828310185185 | 44.37 |
| 44305.869976851856 | 43.848 |
| 44305.91164351852 | 42.767 |
| 44305.953310185185 | 41.879 |
| 44305.994976851856 | 40.779 |
| 44306.03664351852 | 39.543 |
| 44306.078310185185 | 38.636 |
| 44306.119976851856 | 37.709 |
| 44306.16164351852 | 36.705 |
| 44306.203310185185 | 35.76 |
| 44306.244976851856 | 34.775 |
| 44306.28664351852 | 33.694 |
| 44306.328310185185 | 32.787 |
| 44306.369976851856 | 32.748 |
| 44306.41164351852 | 33.443 |
| 44306.453310185185 | 35.2 |
| 44306.494976851856 | 37.285 |
| 44306.53664351852 | 39.331 |
| 44306.578310185185 | 40.817 |
| 44306.619976851856 | 42.651 |
| 44306.66164351852 | 44.273 |
| 44306.703310185185 | 45.065 |
| 44306.744976851856 | 45.026 |
| 44306.78664351852 | 44.428 |
| 44306.828310185185 | 43.906 |
| 44306.869976851856 | 43.482 |
| 44306.91164351852 | 42.902 |
| 44306.953310185185 | 42.169 |
| 44306.994976851856 | 41.281 |
| 44307.03664351852 | 40.258 |
| 44307.078310185185 | 39.234 |
| 44307.119976851856 | 38.269 |
| 44307.16164351852 | 37.304 |
| 44307.203310185185 | 36.474 |
| 44307.244976851856 | 35.837 |
| 44307.28664351852 | 35.2 |
| 44307.328310185185 | 34.736 |
| 44307.369976851856 | 34.37 |
| 44307.41164351852 | 34.659 |
| 44307.453310185185 | 35.47 |
| 44307.494976851856 | 35.624 |
| 44307.53664351852 | 35.972 |
| 44307.578310185185 | 37.304 |
| 44307.619976851856 | 38.829 |
| 44307.66164351852 | 39.292 |
| 44307.703310185185 | 39.389 |
| 44307.744976851856 | 39.833 |
| 44307.78664351852 | 40.316 |
| 44307.828310185185 | 40.431 |
| 44307.869976851856 | 40.451 |
| 44307.91164351852 | 40.412 |
| 44307.953310185185 | 40.161 |
| 44307.994976851856 | 39.698 |
| 44308.03664351852 | 39.254 |
| 44308.078310185185 | 38.829 |
| 44308.119976851856 | 38.25 |
| 44308.16164351852 | 37.574 |
| 44308.203310185185 | 36.995 |
| 44308.244976851856 | 36.532 |
| 44308.28664351852 | 36.126 |
| 44308.328310185185 | 36.068 |
| 44308.369976851856 | 35.895 |
| 44308.41164351852 | 36.049 |
| 44308.453310185185 | 35.953 |
| 44308.494976851856 | 37.497 |
| 44308.53664351852 | 37.651 |
| 44308.578310185185 | 37.729 |
| 44308.619976851856 | 38.076 |
| 44308.66164351852 | 37.729 |
| 44308.703310185185 | 37.864 |
| 44308.744976851856 | 38.231 |
| 44308.78664351852 | 37.516 |
| 44308.828310185185 | 37.516 |
| 44308.869976851856 | 37.207 |
| 44308.91164351852 | 37.053 |
| 44308.953310185185 | 36.512 |
| 44308.994976851856 | 36.165 |
| 44309.03664351852 | 35.76 |
| 44309.078310185185 | 35.315 |
| 44309.119976851856 | 34.91 |
| 44309.16164351852 | 34.524 |
| 44309.203310185185 | 34.08 |
| 44309.244976851856 | 33.559 |
| 44309.28664351852 | 33.076 |
| 44309.328310185185 | 32.787 |
| 44309.369976851856 | 33.018 |
| 44309.41164351852 | 34.061 |
| 44309.453310185185 | 36.126 |
| 44309.494976851856 | 37.246 |
| 44309.53664351852 | 36.899 |
| 44309.578310185185 | 37.748 |
| 44309.619976851856 | 38.887 |
| 44309.66164351852 | 40.296 |
| 44309.703310185185 | 40.972 |
| 44309.744976851856 | 40.644 |
| 44309.78664351852 | 40.103 |
| 44309.828310185185 | 39.833 |
| 44309.869976851856 | 39.621 |
| 44309.91164351852 | 39.35 |
| 44309.953310185185 | 39.061 |
| 44309.994976851856 | 38.713 |
| 44310.03664351852 | 38.346 |
| 44310.078310185185 | 37.825 |
| 44310.119976851856 | 37.246 |
| 44310.16164351852 | 36.57 |
| 44310.203310185185 | 35.895 |
| 44310.244976851856 | 35.2 |
| 44310.28664351852 | 34.563 |
| 44310.328310185185 | 34.273 |
| 44310.369976851856 | 34.524 |
| 44310.41164351852 | 35.47 |
| 44310.453310185185 | 37.42 |
| 44310.494976851856 | 39.524 |
| 44310.53664351852 | 39.64 |
| 44310.578310185185 | 41.686 |
| 44310.619976851856 | 44.543 |
| 44310.66164351852 | 45.18 |
| 44310.703310185185 | 46.339 |
| 44310.744976851856 | 47.227 |
| 44310.78664351852 | 47.555 |
| 44310.828310185185 | 47.265 |
| 44310.869976851856 | 46.957 |
| 44310.91164351852 | 46.667 |
| 44310.953310185185 | 46.339 |
| 44310.994976851856 | 45.74 |
| 44311.03664351852 | 45.161 |
| 44311.078310185185 | 44.466 |
| 44311.119976851856 | 43.733 |
| 44311.16164351852 | 42.864 |
| 44311.203310185185 | 42.092 |
| 44311.244976851856 | 41.184 |
| 44311.28664351852 | 40.335 |
| 44311.328310185185 | 39.91 |
| 44311.369976851856 | 40.103 |
| 44311.41164351852 | 40.875 |
| 44311.453310185185 | 42.053 |
| 44311.494976851856 | 44.466 |
| 44311.53664351852 | 46.551 |
| 44311.578310185185 | 48.771 |
| 44311.619976851856 | 51.204 |
| 44311.66164351852 | 52.806 |
| 44311.703310185185 | 53.211 |
| 44311.744976851856 | 53.057 |
| 44311.78664351852 | 52.439 |
| 44311.828310185185 | 51.86 |
| 44311.869976851856 | 51.011 |
| 44311.91164351852 | 50.277 |
| 44311.953310185185 | 49.08 |
| 44311.994976851856 | 47.748 |
| 44312.03664351852 | 46.397 |
| 44312.078310185185 | 45.103 |
| 44312.119976851856 | 43.887 |
| 44312.16164351852 | 42.651 |
| 44312.203310185185 | 41.474 |
| 44312.244976851856 | 40.296 |
| 44312.28664351852 | 39.177 |
| 44312.328310185185 | 38.482 |
| 44312.369976851856 | 38.559 |
| 44312.41164351852 | 39.331 |
| 44312.453310185185 | 40.644 |
| 44312.494976851856 | 41.995 |
| 44312.53664351852 | 44.138 |
| 44312.578310185185 | 46.3 |
| 44312.619976851856 | 47.864 |
| 44312.66164351852 | 48.713 |
| 44312.703310185185 | 49.408 |
| 44312.744976851856 | 49.428 |
| 44312.78664351852 | 49.177 |
| 44312.828310185185 | 48.482 |
| 44312.869976851856 | 47.652 |
| 44312.91164351852 | 46.899 |
| 44312.953310185185 | 46.03 |
| 44312.994976851856 | 45.065 |
| 44313.03664351852 | 44.157 |
| 44313.078310185185 | 43.269 |
| 44313.119976851856 | 42.343 |
| 44313.16164351852 | 41.3 |
| 44313.203310185185 | 40.296 |
| 44313.244976851856 | 39.331 |
| 44313.28664351852 | 38.424 |
| 44313.328310185185 | 37.941 |
| 44313.369976851856 | 38.095 |
| 44313.41164351852 | 37.96 |
| 44313.453310185185 | 37.787 |
| 44313.494976851856 | 37.458 |
| 44313.53664351852 | 37.748 |
| 44313.578310185185 | 37.574 |
| 44313.619976851856 | 37.632 |
| 44313.66164351852 | 37.902 |
| 44313.703310185185 | 37.516 |
| 44313.744976851856 | 37.594 |
| 44313.78664351852 | 37.825 |
| 44313.828310185185 | 37.729 |
| 44313.869976851856 | 37.536 |
| 44313.91164351852 | 37.42 |
| 44313.953310185185 | 37.343 |
| 44313.994976851856 | 37.285 |
| 44314.03664351852 | 36.86 |
| 44314.078310185185 | 36.609 |
| 44314.119976851856 | 36.339 |
| 44314.16164351852 | 35.972 |
| 44314.203310185185 | 35.702 |
| 44314.244976851856 | 35.566 |
| 44314.28664351852 | 35.431 |
| 44314.328310185185 | 35.586 |
| 44314.369976851856 | 36.107 |
| 44314.41164351852 | 36.512 |
| 44314.453310185185 | 37.594 |
| 44314.494976851856 | 39.099 |
| 44314.53664351852 | 41.281 |
| 44314.578310185185 | 42.845 |
| 44314.619976851856 | 44.389 |
| 44314.66164351852 | 45.065 |
| 44314.703310185185 | 46.821 |
| 44314.744976851856 | 47.265 |
| 44314.78664351852 | 47.014 |
| 44314.828310185185 | 46.821 |
| 44314.869976851856 | 46.455 |
| 44314.91164351852 | 45.528 |
| 44314.953310185185 | 44.601 |
| 44314.994976851856 | 43.578 |
| 44315.03664351852 | 42.497 |
| 44315.078310185185 | 41.57 |
| 44315.119976851856 | 40.644 |
| 44315.16164351852 | 39.794 |
| 44315.203310185185 | 39.003 |
| 44315.244976851856 | 38.173 |
| 44315.28664351852 | 37.362 |
| 44315.328310185185 | 36.956 |
| 44315.369976851856 | 36.995 |
| 44315.41164351852 | 37.864 |
| 44315.453310185185 | 39.64 |
| 44315.494976851856 | 41.725 |
| 44315.53664351852 | 43.926 |
| 44315.578310185185 | 46.474 |
| 44315.619976851856 | 48.829 |
| 44315.66164351852 | 50.682 |
| 44315.703310185185 | 51.744 |
| 44315.744976851856 | 52.15 |
| 44315.78664351852 | 51.86 |
| 44315.828310185185 | 51.262 |
| 44315.869976851856 | 50.702 |
| 44315.91164351852 | 50.026 |
| 44315.953310185185 | 49.041 |
| 44315.994976851856 | 47.806 |
| 44316.03664351852 | 46.532 |
| 44316.078310185185 | 45.296 |
| 44316.119976851856 | 44.099 |
| 44316.16164351852 | 42.941 |
| 44316.203310185185 | 41.763 |
| 44316.244976851856 | 40.682 |
| 44316.28664351852 | 39.678 |
| 44316.328310185185 | 38.964 |
| 44316.369976851856 | 38.964 |
| 44316.41164351852 | 39.814 |
| 44316.453310185185 | 41.493 |
| 44316.494976851856 | 43.443 |
| 44316.53664351852 | 45.721 |
| 44316.578310185185 | 48.192 |
| 44316.619976851856 | 50.586 |
| 44316.66164351852 | 52.478 |
| 44316.703310185185 | 53.578 |
| 44316.744976851856 | 53.906 |
| 44316.78664351852 | 53.559 |
| 44316.828310185185 | 52.825 |
| 44316.869976851856 | 52.053 |
| 44316.91164351852 | 51.088 |
| 44316.953310185185 | 49.736 |
| 44316.994976851856 | 48.346 |
| 44317.03664351852 | 46.899 |
| 44317.078310185185 | 45.624 |
| 44317.119976851856 | 44.292 |
| 44317.16164351852 | 43.076 |
| 44317.203310185185 | 41.821 |
| 44317.244976851856 | 40.644 |
| 44317.28664351852 | 39.717 |
| 44317.328310185185 | 39.119 |
| 44317.369976851856 | 39.215 |
| 44317.41164351852 | 40.007 |
| 44317.453310185185 | 41.609 |
| 44317.494976851856 | 43.153 |
| 44317.53664351852 | 44.466 |
| 44317.578310185185 | 46.551 |
| 44317.619976851856 | 49.254 |
| 44317.66164351852 | 50.682 |
| 44317.703310185185 | 51.223 |
| 44317.744976851856 | 51.088 |
| 44317.78664351852 | 50.991 |
| 44317.828310185185 | 50.528 |
| 44317.869976851856 | 49.543 |
| 44317.91164351852 | 48.597 |
| 44317.953310185185 | 47.613 |
| 44317.994976851856 | 46.706 |
| 44318.03664351852 | 45.74 |
| 44318.078310185185 | 44.698 |
| 44318.119976851856 | 43.694 |
| 44318.16164351852 | 42.729 |
| 44318.203310185185 | 41.725 |
| 44318.244976851856 | 40.817 |
| 44318.28664351852 | 40.045 |
| 44318.328310185185 | 39.717 |
| 44318.369976851856 | 39.775 |
| 44318.41164351852 | 39.659 |
| 44318.453310185185 | 39.582 |
| 44318.494976851856 | 40.026 |
| 44318.53664351852 | 40.76 |
| 44318.578310185185 | 41.686 |
| 44318.619976851856 | 42.227 |
| 44318.66164351852 | 42.478 |
| 44318.703310185185 | 43.076 |
| 44318.744976851856 | 43.424 |
| 44318.78664351852 | 43.404 |
| 44318.828310185185 | 43.424 |
| 44318.869976851856 | 43.269 |
| 44318.91164351852 | 42.806 |
| 44318.953310185185 | 42.478 |
| 44318.994976851856 | 42.034 |
| 44319.03664351852 | 41.011 |
| 44319.078310185185 | 39.466 |
| 44319.119976851856 | 39.601 |
| 44319.16164351852 | 39.099 |
| 44319.203310185185 | 38.385 |
| 44319.244976851856 | 38.269 |
| 44319.28664351852 | 37.999 |
| 44319.328310185185 | 37.922 |
| 44319.369976851856 | 37.96 |
| 44319.41164351852 | 37.98 |
| 44319.453310185185 | 39.041 |
| 44319.494976851856 | 40.702 |
| 44319.53664351852 | 41.937 |
| 44319.578310185185 | 43.54 |
| 44319.619976851856 | 45.103 |
| 44319.66164351852 | 46.107 |
| 44319.703310185185 | 46.86 |
| 44319.744976851856 | 46.937 |
| 44319.78664351852 | 46.397 |
| 44319.828310185185 | 45.431 |
| 44319.869976851856 | 44.621 |
| 44319.91164351852 | 44.041 |
| 44319.953310185185 | 43.52 |
| 44319.994976851856 | 42.883 |
| 44320.03664351852 | 42.285 |
| 44320.078310185185 | 41.609 |
| 44320.119976851856 | 40.933 |
| 44320.16164351852 | 40.316 |
| 44320.203310185185 | 39.698 |
| 44320.244976851856 | 39.138 |
| 44320.28664351852 | 38.617 |
| 44320.328310185185 | 38.346 |
| 44320.369976851856 | 38.385 |
| 44320.41164351852 | 39.177 |
| 44320.453310185185 | 40.238 |
| 44320.494976851856 | 41.242 |
| 44320.53664351852 | 42.497 |
| 44320.578310185185 | 42.555 |
| 44320.619976851856 | 43.269 |
| 44320.66164351852 | 44.08 |
| 44320.703310185185 | 43.945 |
| 44320.744976851856 | 44.022 |
| 44320.78664351852 | 44.621 |
| 44320.828310185185 | 44.466 |
| 44320.869976851856 | 43.926 |
| 44320.91164351852 | 43.443 |
| 44320.953310185185 | 43.076 |
| 44320.994976851856 | 42.439 |
| 44321.03664351852 | 41.899 |
| 44321.078310185185 | 41.049 |
| 44321.119976851856 | 40.238 |
| 44321.16164351852 | 39.756 |
| 44321.203310185185 | 39.234 |
| 44321.244976851856 | 38.597 |
| 44321.28664351852 | 37.999 |
| 44321.328310185185 | 37.864 |
| 44321.369976851856 | 38.308 |
| 44321.41164351852 | 39.331 |
| 44321.453310185185 | 40.219 |
| 44321.494976851856 | 41.821 |
| 44321.53664351852 | 43.81 |
| 44321.578310185185 | 44.794 |
| 44321.619976851856 | 45.586 |
| 44321.66164351852 | 46.049 |
| 44321.703310185185 | 46.281 |
| 44321.744976851856 | 46.609 |
| 44321.78664351852 | 47.034 |
| 44321.828310185185 | 47.458 |
| 44321.869976851856 | 47.767 |
| 44321.91164351852 | 47.652 |
| 44321.953310185185 | 46.976 |
| 44321.994976851856 | 45.837 |
| 44322.03664351852 | 44.563 |
| 44322.078310185185 | 43.346 |
| 44322.119976851856 | 42.246 |
| 44322.16164351852 | 41.242 |
| 44322.203310185185 | 40.277 |
| 44322.244976851856 | 39.234 |
| 44322.28664351852 | 38.269 |
| 44322.328310185185 | 37.767 |
| 44322.369976851856 | 37.941 |
| 44322.41164351852 | 38.868 |
| 44322.453310185185 | 40.624 |
| 44322.494976851856 | 42.729 |
| 44322.53664351852 | 45.123 |
| 44322.578310185185 | 47.767 |
| 44322.619976851856 | 50.18 |
| 44322.66164351852 | 51.879 |
| 44322.703310185185 | 52.96 |
| 44322.744976851856 | 53.347 |
| 44322.78664351852 | 53.057 |
| 44322.828310185185 | 52.613 |
| 44322.869976851856 | 51.86 |
| 44322.91164351852 | 50.953 |
| 44322.953310185185 | 49.794 |
| 44322.994976851856 | 48.443 |
| 44323.03664351852 | 47.111 |
| 44323.078310185185 | 45.682 |
| 44323.119976851856 | 44.428 |
| 44323.16164351852 | 43.192 |
| 44323.203310185185 | 41.995 |
| 44323.244976851856 | 40.837 |
| 44323.28664351852 | 39.872 |
| 44323.328310185185 | 39.408 |
| 44323.369976851856 | 39.505 |
| 44323.41164351852 | 40.393 |
| 44323.453310185185 | 42.014 |
| 44323.494976851856 | 44.003 |
| 44323.53664351852 | 45.238 |
| 44323.578310185185 | 46.513 |
| 44323.619976851856 | 47.864 |
| 44323.66164351852 | 48.848 |
| 44323.703310185185 | 49.814 |
| 44323.744976851856 | 50.663 |
| 44323.78664351852 | 50.605 |
| 44323.828310185185 | 50.007 |
| 44323.869976851856 | 49.466 |
| 44323.91164351852 | 48.771 |
| 44323.953310185185 | 47.922 |
| 44323.994976851856 | 46.918 |
| 44324.03664351852 | 45.837 |
| 44324.078310185185 | 44.698 |
| 44324.119976851856 | 43.636 |
| 44324.16164351852 | 42.574 |
| 44324.203310185185 | 41.609 |
| 44324.244976851856 | 40.586 |
| 44324.28664351852 | 39.852 |
| 44324.328310185185 | 39.543 |
| 44324.369976851856 | 39.678 |
| 44324.41164351852 | 40.605 |
| 44324.453310185185 | 41.879 |
| 44324.494976851856 | 42.806 |
| 44324.53664351852 | 43.54 |
| 44324.578310185185 | 43.848 |
| 44324.619976851856 | 45.065 |
| 44324.66164351852 | 46.377 |
| 44324.703310185185 | 47.246 |
| 44324.744976851856 | 46.976 |
| 44324.78664351852 | 46.532 |
| 44324.828310185185 | 46.03 |
| 44324.869976851856 | 45.47 |
| 44324.91164351852 | 45.103 |
| 44324.953310185185 | 44.331 |
| 44324.994976851856 | 43.346 |
| 44325.03664351852 | 42.362 |
| 44325.078310185185 | 41.319 |
| 44325.119976851856 | 40.451 |
| 44325.16164351852 | 39.485 |
| 44325.203310185185 | 38.597 |
| 44325.244976851856 | 37.767 |
| 44325.28664351852 | 36.995 |
| 44325.328310185185 | 36.744 |
| 44325.369976851856 | 36.937 |
| 44325.41164351852 | 37.767 |
| 44325.453310185185 | 38.964 |
| 44325.494976851856 | 40.084 |
| 44325.53664351852 | 41.319 |
| 44325.578310185185 | 43.211 |
| 44325.619976851856 | 44.814 |
| 44325.66164351852 | 45.47 |
| 44325.703310185185 | 45.972 |
| 44325.744976851856 | 46.262 |
| 44325.78664351852 | 46.513 |
| 44325.828310185185 | 46.377 |
| 44325.869976851856 | 45.798 |
| 44325.91164351852 | 45.026 |
| 44325.953310185185 | 44.37 |
| 44325.994976851856 | 43.636 |
| 44326.03664351852 | 42.941 |
| 44326.078310185185 | 42.227 |
| 44326.119976851856 | 41.57 |
| 44326.16164351852 | 40.875 |
| 44326.203310185185 | 40.2 |
| 44326.244976851856 | 39.505 |
| 44326.28664351852 | 38.713 |
| 44326.328310185185 | 37.555 |
| 44326.369976851856 | 36.763 |
| 44326.41164351852 | 36.455 |
| 44326.453310185185 | 37.188 |
| 44326.494976851856 | 37.497 |
| 44326.53664351852 | 38.192 |
| 44326.578310185185 | 39.254 |
| 44326.619976851856 | 40.122 |
| 44326.66164351852 | 41.3 |
| 44326.703310185185 | 42.594 |
| 44326.744976851856 | 42.362 |
| 44326.78664351852 | 41.532 |
| 44326.828310185185 | 41.3 |
| 44326.869976851856 | 40.933 |
| 44326.91164351852 | 40.47 |
| 44326.953310185185 | 39.949 |
| 44326.994976851856 | 39.389 |
| 44327.03664351852 | 38.752 |
| 44327.078310185185 | 38.134 |
| 44327.119976851856 | 37.651 |
| 44327.16164351852 | 37.092 |
| 44327.203310185185 | 36.648 |
| 44327.244976851856 | 36.339 |
| 44327.28664351852 | 35.972 |
| 44327.328310185185 | 35.76 |
| 44327.369976851856 | 36.184 |
| 44327.41164351852 | 36.802 |
| 44327.453310185185 | 37.555 |
| 44327.494976851856 | 36.783 |
| 44327.53664351852 | 38.095 |
| 44327.578310185185 | 39.312 |
| 44327.619976851856 | 41.03 |
| 44327.66164351852 | 41.107 |
| 44327.703310185185 | 41.899 |
| 44327.744976851856 | 42.381 |
| 44327.78664351852 | 42.304 |
| 44327.828310185185 | 41.57 |
| 44327.869976851856 | 41.088 |
| 44327.91164351852 | 40.875 |
| 44327.953310185185 | 40.547 |
| 44327.994976851856 | 39.91 |
| 44328.03664351852 | 39.312 |
| 44328.078310185185 | 38.733 |
| 44328.119976851856 | 38.115 |
| 44328.16164351852 | 37.555 |
| 44328.203310185185 | 36.956 |
| 44328.244976851856 | 36.223 |
| 44328.28664351852 | 35.644 |
| 44328.328310185185 | 35.277 |
| 44328.369976851856 | 35.875 |
| 44328.41164351852 | 36.956 |
| 44328.453310185185 | 38.964 |
| 44328.494976851856 | 40.991 |
| 44328.53664351852 | 42.478 |
| 44328.578310185185 | 43.424 |
| 44328.619976851856 | 45.972 |
| 44328.66164351852 | 47.381 |
| 44328.703310185185 | 48.018 |
| 44328.744976851856 | 49.003 |
| 44328.78664351852 | 49.119 |
| 44328.828310185185 | 48.829 |
| 44328.869976851856 | 48.211 |
| 44328.91164351852 | 47.748 |
| 44328.953310185185 | 47.034 |
| 44328.994976851856 | 45.818 |
| 44329.03664351852 | 44.621 |
| 44329.078310185185 | 43.52 |
| 44329.119976851856 | 42.362 |
| 44329.16164351852 | 41.358 |
| 44329.203310185185 | 40.316 |
| 44329.244976851856 | 39.35 |
| 44329.28664351852 | 38.539 |
| 44329.328310185185 | 38.231 |
| 44329.369976851856 | 38.385 |
| 44329.41164351852 | 39.389 |
| 44329.453310185185 | 41.261 |
| 44329.494976851856 | 42.169 |
| 44329.53664351852 | 43.346 |
| 44329.578310185185 | 44.505 |
| 44329.619976851856 | 46.223 |
| 44329.66164351852 | 47.652 |
| 44329.703310185185 | 49.524 |
| 44329.744976851856 | 50.045 |
| 44329.78664351852 | 49.756 |
| 44329.828310185185 | 49.254 |
| 44329.869976851856 | 48.578 |
| 44329.91164351852 | 47.941 |
| 44329.953310185185 | 47.207 |
| 44329.994976851856 | 46.435 |
| 44330.03664351852 | 45.702 |
| 44330.078310185185 | 44.833 |
| 44330.119976851856 | 43.752 |
| 44330.16164351852 | 42.787 |
| 44330.203310185185 | 41.879 |
| 44330.244976851856 | 40.914 |
| 44330.28664351852 | 40.142 |
| 44330.328310185185 | 39.968 |
| 44330.369976851856 | 40.103 |
| 44330.41164351852 | 41.049 |
| 44330.453310185185 | 42.246 |
| 44330.494976851856 | 43.675 |
| 44330.53664351852 | 45.219 |
| 44330.578310185185 | 47.285 |
| 44330.619976851856 | 48.713 |
| 44330.66164351852 | 48.791 |
| 44330.703310185185 | 50.47 |
| 44330.744976851856 | 50.875 |
| 44330.78664351852 | 50.47 |
| 44330.828310185185 | 49.852 |
| 44330.869976851856 | 49.505 |
| 44330.91164351852 | 49.254 |
| 44330.953310185185 | 48.752 |
| 44330.994976851856 | 47.787 |
| 44331.03664351852 | 46.706 |
| 44331.078310185185 | 45.567 |
| 44331.119976851856 | 44.37 |
| 44331.16164351852 | 43.25 |
| 44331.203310185185 | 42.188 |
| 44331.244976851856 | 41.3 |
| 44331.28664351852 | 40.547 |
| 44331.328310185185 | 40.18 |
| 44331.369976851856 | 40.47 |
| 44331.41164351852 | 41.416 |
| 44331.453310185185 | 42.922 |
| 44331.494976851856 | 44.794 |
| 44331.53664351852 | 45.663 |
| 44331.578310185185 | 48.443 |
| 44331.619976851856 | 50.451 |
| 44331.66164351852 | 52.652 |
| 44331.703310185185 | 53.385 |
| 44331.744976851856 | 53.694 |
| 44331.78664351852 | 53.366 |
| 44331.828310185185 | 52.632 |
| 44331.869976851856 | 51.59 |
| 44331.91164351852 | 50.374 |
| 44331.953310185185 | 49.099 |
| 44331.994976851856 | 47.96 |
| 44332.03664351852 | 46.783 |
| 44332.078310185185 | 45.702 |
| 44332.119976851856 | 44.621 |
| 44332.16164351852 | 43.675 |
| 44332.203310185185 | 42.709 |
| 44332.244976851856 | 41.86 |
| 44332.28664351852 | 41.088 |
| 44332.328310185185 | 40.76 |
| 44332.369976851856 | 41.03 |
| 44332.41164351852 | 42.053 |
| 44332.453310185185 | 42.845 |
| 44332.494976851856 | 43.906 |
| 44332.53664351852 | 45.123 |
| 44332.578310185185 | 47.478 |
| 44332.619976851856 | 50.065 |
| 44332.66164351852 | 50.547 |
| 44332.703310185185 | 50.933 |
| 44332.744976851856 | 50.76 |
| 44332.78664351852 | 50.625 |
| 44332.828310185185 | 50.335 |
| 44332.869976851856 | 49.447 |
| 44332.91164351852 | 48.076 |
| 44332.953310185185 | 46.821 |
| 44332.994976851856 | 45.663 |
| 44333.03664351852 | 44.524 |
| 44333.078310185185 | 43.482 |
| 44333.119976851856 | 42.555 |
| 44333.16164351852 | 41.802 |
| 44333.203310185185 | 41.068 |
| 44333.244976851856 | 40.431 |
| 44333.28664351852 | 40.045 |
| 44333.328310185185 | 39.949 |
| 44333.369976851856 | 40.431 |
| 44333.41164351852 | 41.281 |
| 44333.453310185185 | 42.42 |
| 44333.494976851856 | 43.134 |
| 44333.53664351852 | 43.424 |
| 44333.578310185185 | 43.675 |
| 44333.619976851856 | 44.408 |
| 44333.66164351852 | 44.833 |
| 44333.703310185185 | 44.852 |
| 44333.744976851856 | 44.833 |
| 44333.78664351852 | 44.505 |
| 44333.828310185185 | 44.466 |
| 44333.869976851856 | 44.312 |
| 44333.91164351852 | 44.003 |
| 44333.953310185185 | 43.52 |
| 44333.994976851856 | 42.787 |
| 44334.03664351852 | 42.265 |
| 44334.078310185185 | 41.744 |
| 44334.119976851856 | 41.261 |
| 44334.16164351852 | 40.856 |
| 44334.203310185185 | 40.509 |
| 44334.244976851856 | 40.258 |
| 44334.28664351852 | 40.065 |
| 44334.328310185185 | 40.18 |
| 44334.369976851856 | 40.74 |
| 44334.41164351852 | 41.358 |
| 44334.453310185185 | 43.153 |
| 44334.494976851856 | 45.219 |
| 44334.53664351852 | 47.42 |
| 44334.578310185185 | 49.273 |
| 44334.619976851856 | 49.93 |
| 44334.66164351852 | 50.509 |
| 44334.703310185185 | 51.242 |
| 44334.744976851856 | 51.57 |
| 44334.78664351852 | 50.721 |
| 44334.828310185185 | 49.852 |
| 44334.869976851856 | 49.003 |
| 44334.91164351852 | 47.999 |
| 44334.953310185185 | 46.899 |
| 44334.994976851856 | 45.663 |
| 44335.03664351852 | 44.543 |
| 44335.078310185185 | 43.482 |
| 44335.119976851856 | 42.478 |
| 44335.16164351852 | 41.532 |
| 44335.203310185185 | 40.74 |
| 44335.244976851856 | 40.007 |
| 44335.28664351852 | 39.466 |
| 44335.328310185185 | 39.312 |
| 44335.369976851856 | 39.582 |
| 44335.41164351852 | 40.663 |
| 44335.453310185185 | 42.381 |
| 44335.494976851856 | 44.679 |
| 44335.53664351852 | 47.188 |
| 44335.578310185185 | 49.582 |
| 44335.619976851856 | 51.918 |
| 44335.66164351852 | 52.208 |
| 44335.703310185185 | 52.458 |
| 44335.744976851856 | 52.092 |
| 44335.78664351852 | 51.474 |
| 44335.828310185185 | 50.779 |
| 44335.869976851856 | 49.833 |
| 44335.91164351852 | 48.617 |
| 44335.953310185185 | 47.42 |
| 44335.994976851856 | 45.895 |
| 44336.03664351852 | 44.698 |
| 44336.078310185185 | 43.578 |
| 44336.119976851856 | 42.632 |
| 44336.16164351852 | 41.744 |
| 44336.203310185185 | 41.03 |
| 44336.244976851856 | 40.47 |
| 44336.28664351852 | 40.084 |
| 44336.328310185185 | 40.026 |
| 44336.369976851856 | 40.856 |
| 44336.41164351852 | 41.879 |
| 44336.453310185185 | 43.018 |
| 44336.494976851856 | 45.586 |
| 44336.53664351852 | 46.995 |
| 44336.578310185185 | 48.443 |
| 44336.619976851856 | 51.011 |
| 44336.66164351852 | 51.126 |
| 44336.703310185185 | 52.536 |
| 44336.744976851856 | 52.96 |
| 44336.78664351852 | 52.285 |
| 44336.828310185185 | 51.57 |
| 44336.869976851856 | 50.605 |
| 44336.91164351852 | 49.408 |
| 44336.953310185185 | 47.999 |
| 44336.994976851856 | 46.416 |
| 44337.03664351852 | 44.949 |
| 44337.078310185185 | 43.675 |
| 44337.119976851856 | 42.439 |
| 44337.16164351852 | 41.416 |
| 44337.203310185185 | 40.605 |
| 44337.244976851856 | 39.987 |
| 44337.28664351852 | 39.601 |
| 44337.328310185185 | 39.698 |
| 44337.369976851856 | 40.354 |
| 44337.41164351852 | 41.455 |
| 44337.453310185185 | 42.883 |
| 44337.494976851856 | 44.698 |
| 44337.53664351852 | 46.068 |
| 44337.578310185185 | 46.706 |
| 44337.619976851856 | 48.443 |
| 44337.66164351852 | 48.346 |
| 44337.703310185185 | 48.289 |
| 44337.744976851856 | 47.806 |
| 44337.78664351852 | 47.169 |
| 44337.828310185185 | 46.648 |
| 44337.869976851856 | 46.107 |
| 44337.91164351852 | 45.451 |
| 44337.953310185185 | 44.736 |
| 44337.994976851856 | 44.138 |
| 44338.03664351852 | 43.559 |
| 44338.078310185185 | 42.845 |
| 44338.119976851856 | 42.169 |
| 44338.16164351852 | 41.493 |
| 44338.203310185185 | 40.817 |
| 44338.244976851856 | 40.258 |
| 44338.28664351852 | 39.814 |
| 44338.328310185185 | 39.814 |
| 44338.369976851856 | 40.316 |
| 44338.41164351852 | 41.068 |
| 44338.453310185185 | 43.269 |
| 44338.494976851856 | 45.451 |
| 44338.53664351852 | 47.034 |
| 44338.578310185185 | 49.543 |
| 44338.619976851856 | 50.972 |
| 44338.66164351852 | 50.644 |
| 44338.703310185185 | 51.184 |
| 44338.744976851856 | 51.262 |
| 44338.78664351852 | 50.431 |
| 44338.828310185185 | 49.736 |
| 44338.869976851856 | 49.177 |
| 44338.91164351852 | 48.308 |
| 44338.953310185185 | 47.343 |
| 44338.994976851856 | 46.339 |
| 44339.03664351852 | 45.2 |
| 44339.078310185185 | 44.061 |
| 44339.119976851856 | 43.018 |
| 44339.16164351852 | 42.15 |
| 44339.203310185185 | 41.512 |
| 44339.244976851856 | 40.875 |
| 44339.28664351852 | 40.373 |
| 44339.328310185185 | 40.238 |
| 44339.369976851856 | 40.509 |
| 44339.41164351852 | 41.146 |
| 44339.453310185185 | 42.13 |
| 44339.494976851856 | 42.4 |
| 44339.53664351852 | 42.381 |
| 44339.578310185185 | 43.25 |
| 44339.619976851856 | 45.007 |
| 44339.66164351852 | 45.509 |
| 44339.703310185185 | 46.86 |
| 44339.744976851856 | 47.497 |
| 44339.78664351852 | 47.053 |
| 44339.828310185185 | 46.493 |
| 44339.869976851856 | 45.702 |
| 44339.91164351852 | 44.794 |
| 44339.953310185185 | 43.733 |
| 44339.994976851856 | 42.632 |
| 44340.03664351852 | 41.628 |
| 44340.078310185185 | 40.644 |
| 44340.119976851856 | 39.717 |
| 44340.16164351852 | 38.81 |
| 44340.203310185185 | 38.038 |
| 44340.244976851856 | 37.343 |
| 44340.28664351852 | 36.802 |
| 44340.328310185185 | 36.667 |
| 44340.369976851856 | 37.053 |
| 44340.41164351852 | 37.96 |
| 44340.453310185185 | 39.64 |
| 44340.494976851856 | 41.937 |
| 44340.53664351852 | 44.408 |
| 44340.578310185185 | 46.821 |
| 44340.619976851856 | 49.003 |
| 44340.66164351852 | 50.682 |
| 44340.703310185185 | 51.686 |
| 44340.744976851856 | 51.995 |
| 44340.78664351852 | 51.764 |
| 44340.828310185185 | 51.126 |
| 44340.869976851856 | 50.586 |
| 44340.91164351852 | 49.64 |
| 44340.953310185185 | 48.52 |
| 44340.994976851856 | 47.15 |
| 44341.03664351852 | 45.663 |
| 44341.078310185185 | 44.177 |
| 44341.119976851856 | 42.69 |
| 44341.16164351852 | 41.377 |
| 44341.203310185185 | 40.18 |
| 44341.244976851856 | 39.254 |
| 44341.28664351852 | 38.539 |
| 44341.328310185185 | 38.269 |
| 44341.369976851856 | 38.482 |
| 44341.41164351852 | 39.254 |
| 44341.453310185185 | 40.817 |
| 44341.494976851856 | 42.999 |
| 44341.53664351852 | 45.412 |
| 44341.578310185185 | 47.845 |
| 44341.619976851856 | 49.968 |
| 44341.66164351852 | 51.532 |
| 44341.703310185185 | 52.516 |
| 44341.744976851856 | 52.845 |
| 44341.78664351852 | 52.748 |
| 44341.828310185185 | 52.323 |
| 44341.869976851856 | 51.686 |
| 44341.91164351852 | 50.76 |
| 44341.953310185185 | 49.505 |
| 44341.994976851856 | 48.057 |
| 44342.03664351852 | 46.648 |
| 44342.078310185185 | 45.277 |
| 44342.119976851856 | 43.887 |
| 44342.16164351852 | 42.787 |
| 44342.203310185185 | 41.725 |
| 44342.244976851856 | 40.837 |
| 44342.28664351852 | 40.277 |
| 44342.328310185185 | 39.91 |
| 44342.369976851856 | 39.929 |
| 44342.41164351852 | 40.875 |
| 44342.453310185185 | 41.686 |
| 44342.494976851856 | 43.636 |
| 44342.53664351852 | 44.756 |
| 44342.578310185185 | 45.663 |
| 44342.619976851856 | 46.435 |
| 44342.66164351852 | 47.053 |
| 44342.703310185185 | 47.632 |
| 44342.744976851856 | 48.231 |
| 44342.78664351852 | 48.269 |
| 44342.828310185185 | 48.038 |
| 44342.869976851856 | 47.825 |
| 44342.91164351852 | 47.458 |
| 44342.953310185185 | 46.841 |
| 44342.994976851856 | 46.107 |
| 44343.03664351852 | 45.238 |
| 44343.078310185185 | 44.389 |
| 44343.119976851856 | 43.443 |
| 44343.16164351852 | 42.536 |
| 44343.203310185185 | 41.667 |
| 44343.244976851856 | 40.817 |
| 44343.28664351852 | 40.103 |
| 44343.328310185185 | 39.794 |
| 44343.369976851856 | 40.084 |
| 44343.41164351852 | 40.914 |
| 44343.453310185185 | 42.516 |
| 44343.494976851856 | 44.582 |
| 44343.53664351852 | 47.014 |
| 44343.578310185185 | 49.389 |
| 44343.619976851856 | 51.242 |
| 44343.66164351852 | 53.038 |
| 44343.703310185185 | 53.926 |
| 44343.744976851856 | 54.196 |
| 44343.78664351852 | 53.906 |
| 44343.828310185185 | 53.096 |
| 44343.869976851856 | 52.227 |
| 44343.91164351852 | 51.107 |
| 44343.953310185185 | 49.621 |
| 44343.994976851856 | 47.922 |
| 44344.03664351852 | 46.416 |
| 44344.078310185185 | 44.891 |
| 44344.119976851856 | 43.424 |
| 44344.16164351852 | 42.13 |
| 44344.203310185185 | 41.068 |
| 44344.244976851856 | 40.161 |
| 44344.28664351852 | 39.447 |
| 44344.328310185185 | 39.215 |
| 44344.369976851856 | 39.408 |
| 44344.41164351852 | 40.296 |
| 44344.453310185185 | 41.551 |
| 44344.494976851856 | 43.443 |
| 44344.53664351852 | 45.509 |
| 44344.578310185185 | 46.377 |
| 44344.619976851856 | 47.787 |
| 44344.66164351852 | 49.196 |
| 44344.703310185185 | 49.621 |
| 44344.744976851856 | 50.238 |
| 44344.78664351852 | 50.258 |
| 44344.828310185185 | 50.084 |
| 44344.869976851856 | 49.91 |
| 44344.91164351852 | 49.119 |
| 44344.953310185185 | 48.096 |
| 44344.994976851856 | 46.976 |
| 44345.03664351852 | 45.818 |
| 44345.078310185185 | 44.601 |
| 44345.119976851856 | 43.327 |
| 44345.16164351852 | 42.207 |
| 44345.203310185185 | 41.319 |
| 44345.244976851856 | 40.489 |
| 44345.28664351852 | 39.852 |
| 44345.328310185185 | 39.601 |
| 44345.369976851856 | 39.833 |
| 44345.41164351852 | 40.663 |
| 44345.453310185185 | 42.169 |
| 44345.494976851856 | 44.157 |
| 44345.53664351852 | 44.852 |
| 44345.578310185185 | 46.725 |
| 44345.619976851856 | 47.96 |
| 44345.66164351852 | 49.292 |
| 44345.703310185185 | 50.2 |
| 44345.744976851856 | 49.621 |
| 44345.78664351852 | 49.292 |
| 44345.828310185185 | 48.964 |
| 44345.869976851856 | 48.52 |
| 44345.91164351852 | 47.902 |
| 44345.953310185185 | 47.207 |
| 44345.994976851856 | 46.281 |
| 44346.03664351852 | 45.431 |
| 44346.078310185185 | 44.563 |
| 44346.119976851856 | 43.694 |
| 44346.16164351852 | 43.018 |
| 44346.203310185185 | 42.343 |
| 44346.244976851856 | 41.706 |
| 44346.28664351852 | 41.339 |
| 44346.328310185185 | 41.223 |
| 44346.369976851856 | 41.416 |
| 44346.41164351852 | 41.686 |
| 44346.453310185185 | 43.076 |
| 44346.494976851856 | 45.007 |
| 44346.53664351852 | 45.238 |
| 44346.578310185185 | 45.045 |
| 44346.619976851856 | 45.316 |
| 44346.66164351852 | 45.277 |
| 44346.703310185185 | 45.412 |
| 44346.744976851856 | 45.412 |
| 44346.78664351852 | 45.238 |
| 44346.828310185185 | 45.026 |
| 44346.869976851856 | 44.659 |
| 44346.91164351852 | 44.138 |
| 44346.953310185185 | 43.771 |
| 44346.994976851856 | 43.269 |
| 44347.03664351852 | 42.864 |
| 44347.078310185185 | 42.439 |
| 44347.119976851856 | 41.976 |
| 44347.16164351852 | 41.57 |
| 44347.203310185185 | 41.223 |
| 44347.244976851856 | 40.779 |
| 44347.28664351852 | 40.451 |
| 44347.328310185185 | 40.451 |
| 44347.369976851856 | 40.856 |
| 44347.41164351852 | 41.744 |
| 44347.453310185185 | 43.25 |
| 44347.494976851856 | 45.412 |
| 44347.53664351852 | 47.98 |
| 44347.578310185185 | 50.451 |
| 44347.619976851856 | 50.142 |
| 44347.66164351852 | 50.76 |
| 44347.703310185185 | 50.026 |
| 44347.744976851856 | 50.393 |
| 44347.78664351852 | 50.277 |
| 44347.828310185185 | 49.061 |
| 44347.869976851856 | 48.076 |
| 44347.91164351852 | 47.265 |
| 44347.953310185185 | 46.262 |
| 44347.994976851856 | 45.219 |
| 44348.03664351852 | 44.254 |
| 44348.078310185185 | 43.346 |
| 44348.119976851856 | 42.4 |
| 44348.16164351852 | 41.59 |
| 44348.203310185185 | 40.798 |
| 44348.244976851856 | 40.084 |
| 44348.28664351852 | 39.601 |
| 44348.328310185185 | 39.524 |
| 44348.369976851856 | 39.428 |
| 44348.41164351852 | 39.968 |
| 44348.453310185185 | 41.802 |
| 44348.494976851856 | 43.675 |
| 44348.53664351852 | 45.161 |
| 44348.578310185185 | 47.265 |
| 44348.619976851856 | 48.54 |
| 44348.66164351852 | 49.64 |
| 44348.703310185185 | 50.798 |
| 44348.744976851856 | 50.663 |
| 44348.78664351852 | 50.47 |
| 44348.828310185185 | 50.277 |
| 44348.869976851856 | 49.659 |
| 44348.91164351852 | 48.771 |
| 44348.953310185185 | 47.748 |
| 44348.994976851856 | 46.686 |
| 44349.03664351852 | 45.682 |
| 44349.078310185185 | 44.717 |
| 44349.119976851856 | 43.79 |
| 44349.16164351852 | 42.864 |
| 44349.203310185185 | 42.169 |
| 44349.244976851856 | 41.628 |
| 44349.28664351852 | 41.261 |
| 44349.328310185185 | 41.184 |
| 44349.369976851856 | 41.628 |
| 44349.41164351852 | 42.227 |
| 44349.453310185185 | 43.52 |
| 44349.494976851856 | 45.818 |
| 44349.53664351852 | 48.076 |
| 44349.578310185185 | 49.485 |
| 44349.619976851856 | 50.065 |
| 44349.66164351852 | 51.899 |
| 44349.703310185185 | 52.787 |
| 44349.744976851856 | 52.922 |
| 44349.78664351852 | 53.018 |
| 44349.828310185185 | 52.787 |
| 44349.869976851856 | 52.053 |
| 44349.91164351852 | 50.74 |
| 44349.953310185185 | 49.312 |
| 44349.994976851856 | 47.883 |
| 44350.03664351852 | 46.493 |
| 44350.078310185185 | 45.123 |
| 44350.119976851856 | 43.926 |
| 44350.16164351852 | 42.941 |
| 44350.203310185185 | 42.072 |
| 44350.244976851856 | 41.319 |
| 44350.28664351852 | 40.74 |
| 44350.328310185185 | 40.509 |
| 44350.369976851856 | 40.837 |
| 44350.41164351852 | 41.725 |
| 44350.453310185185 | 43.385 |
| 44350.494976851856 | 45.644 |
| 44350.53664351852 | 47.767 |
| 44350.578310185185 | 50.489 |
| 44350.619976851856 | 52.845 |
| 44350.66164351852 | 54.737 |
| 44350.703310185185 | 55.431 |
| 44350.744976851856 | 56.262 |
| 44350.78664351852 | 55.991 |
| 44350.828310185185 | 55.181 |
| 44350.869976851856 | 54.312 |
| 44350.91164351852 | 53.115 |
| 44350.953310185185 | 51.628 |
| 44350.994976851856 | 50.045 |
| 44351.03664351852 | 48.346 |
| 44351.078310185185 | 46.667 |
| 44351.119976851856 | 45.277 |
| 44351.16164351852 | 44.138 |
| 44351.203310185185 | 43.115 |
| 44351.244976851856 | 42.323 |
| 44351.28664351852 | 41.725 |
| 44351.328310185185 | 41.455 |
| 44351.369976851856 | 41.609 |
| 44351.41164351852 | 42.516 |
| 44351.453310185185 | 44.119 |
| 44351.494976851856 | 46.319 |
| 44351.53664351852 | 48.617 |
| 44351.578310185185 | 50.991 |
| 44351.619976851856 | 53.018 |
| 44351.66164351852 | 54.698 |
| 44351.703310185185 | 55.818 |
| 44351.744976851856 | 56.184 |
| 44351.78664351852 | 55.972 |
| 44351.828310185185 | 55.258 |
| 44351.869976851856 | 54.157 |
| 44351.91164351852 | 52.632 |
| 44351.953310185185 | 50.818 |
| 44351.994976851856 | 49.08 |
| 44352.03664351852 | 47.265 |
| 44352.078310185185 | 45.837 |
| 44352.119976851856 | 44.621 |
| 44352.16164351852 | 43.617 |
| 44352.203310185185 | 42.787 |
| 44352.244976851856 | 42.072 |
| 44352.28664351852 | 41.609 |
| 44352.328310185185 | 41.455 |
| 44352.369976851856 | 41.821 |
| 44352.41164351852 | 42.651 |
| 44352.453310185185 | 44.312 |
| 44352.494976851856 | 46.397 |
| 44352.53664351852 | 48.771 |
| 44352.578310185185 | 50.374 |
| 44352.619976851856 | 52.072 |
| 44352.66164351852 | 52.594 |
| 44352.703310185185 | 53.057 |
| 44352.744976851856 | 52.42 |
| 44352.78664351852 | 51.725 |
| 44352.828310185185 | 51.319 |
| 44352.869976851856 | 50.277 |
| 44352.91164351852 | 49.061 |
| 44352.953310185185 | 47.729 |
| 44352.994976851856 | 46.493 |
| 44353.03664351852 | 45.431 |
| 44353.078310185185 | 44.601 |
| 44353.119976851856 | 43.887 |
| 44353.16164351852 | 43.192 |
| 44353.203310185185 | 42.632 |
| 44353.244976851856 | 41.976 |
| 44353.28664351852 | 41.512 |
| 44353.328310185185 | 41.512 |
| 44353.369976851856 | 41.725 |
| 44353.41164351852 | 42.092 |
| 44353.453310185185 | 44.312 |
| 44353.494976851856 | 46.397 |
| 44353.53664351852 | 47.188 |
| 44353.578310185185 | 48.52 |
| 44353.619976851856 | 48.52 |
| 44353.66164351852 | 49.061 |
| 44353.703310185185 | 48.964 |
| 44353.744976851856 | 49.37 |
| 44353.78664351852 | 49.563 |
| 44353.828310185185 | 49.659 |
| 44353.869976851856 | 48.964 |
| 44353.91164351852 | 48.096 |
| 44353.953310185185 | 47.092 |
| 44353.994976851856 | 46.107 |
| 44354.03664351852 | 45.277 |
| 44354.078310185185 | 44.447 |
| 44354.119976851856 | 43.636 |
| 44354.16164351852 | 42.941 |
| 44354.203310185185 | 42.343 |
| 44354.244976851856 | 41.821 |
| 44354.28664351852 | 41.416 |
| 44354.328310185185 | 41.319 |
| 44354.369976851856 | 41.532 |
| 44354.41164351852 | 42.362 |
| 44354.453310185185 | 43.945 |
| 44354.494976851856 | 45.219 |
| 44354.53664351852 | 47.034 |
| 44354.578310185185 | 47.98 |
| 44354.619976851856 | 49.235 |
| 44354.66164351852 | 49.872 |
| 44354.703310185185 | 51.976 |
| 44354.744976851856 | 52.729 |
| 44354.78664351852 | 52.69 |
| 44354.828310185185 | 52.323 |
| 44354.869976851856 | 51.532 |
| 44354.91164351852 | 50.547 |
| 44354.953310185185 | 49.389 |
| 44354.994976851856 | 48.096 |
| 44355.03664351852 | 46.86 |
| 44355.078310185185 | 45.76 |
| 44355.119976851856 | 44.756 |
| 44355.16164351852 | 43.829 |
| 44355.203310185185 | 42.999 |
| 44355.244976851856 | 42.381 |
| 44355.28664351852 | 41.918 |
| 44355.328310185185 | 41.725 |
| 44355.369976851856 | 41.899 |
| 44355.41164351852 | 42.787 |
| 44355.453310185185 | 44.389 |
| 44355.494976851856 | 46.377 |
| 44355.53664351852 | 48.675 |
| 44355.578310185185 | 50.875 |
| 44355.619976851856 | 52.883 |
| 44355.66164351852 | 54.466 |
| 44355.703310185185 | 55.431 |
| 44355.744976851856 | 55.702 |
| 44355.78664351852 | 55.47 |
| 44355.828310185185 | 54.659 |
| 44355.869976851856 | 53.675 |
| 44355.91164351852 | 52.285 |
| 44355.953310185185 | 50.567 |
| 44355.994976851856 | 48.733 |
| 44356.03664351852 | 47.092 |
| 44356.078310185185 | 45.74 |
| 44356.119976851856 | 44.485 |
| 44356.16164351852 | 43.385 |
| 44356.203310185185 | 42.478 |
| 44356.244976851856 | 41.628 |
| 44356.28664351852 | 41.068 |
| 44356.328310185185 | 40.779 |
| 44356.369976851856 | 40.972 |
| 44356.41164351852 | 41.841 |
| 44356.453310185185 | 43.385 |
| 44356.494976851856 | 45.489 |
| 44356.53664351852 | 47.806 |
| 44356.578310185185 | 50.123 |
| 44356.619976851856 | 52.208 |
| 44356.66164351852 | 53.868 |
| 44356.703310185185 | 54.775 |
| 44356.744976851856 | 55.374 |
| 44356.78664351852 | 55.663 |
| 44356.828310185185 | 55.451 |
| 44356.869976851856 | 54.852 |
| 44356.91164351852 | 53.443 |
| 44356.953310185185 | 52.053 |
| 44356.994976851856 | 50.509 |
| 44357.03664351852 | 49.022 |
| 44357.078310185185 | 47.69 |
| 44357.119976851856 | 46.532 |
| 44357.16164351852 | 45.605 |
| 44357.203310185185 | 44.621 |
| 44357.244976851856 | 43.926 |
| 44357.28664351852 | 43.231 |
| 44357.328310185185 | 42.922 |
| 44357.369976851856 | 42.98 |
| 44357.41164351852 | 43.713 |
| 44357.453310185185 | 45.2 |
| 44357.494976851856 | 47.053 |
| 44357.53664351852 | 49.003 |
| 44357.578310185185 | 50.76 |
| 44357.619976851856 | 51.397 |
| 44357.66164351852 | 52.497 |
| 44357.703310185185 | 53.501 |
| 44357.744976851856 | 54.119 |
| 44357.78664351852 | 54.215 |
| 44357.828310185185 | 53.81 |
| 44357.869976851856 | 52.941 |
| 44357.91164351852 | 51.976 |
| 44357.953310185185 | 50.818 |
| 44357.994976851856 | 49.37 |
| 44358.03664351852 | 47.902 |
| 44358.078310185185 | 46.648 |
| 44358.119976851856 | 45.489 |
| 44358.16164351852 | 44.485 |
| 44358.203310185185 | 43.54 |
| 44358.244976851856 | 42.651 |
| 44358.28664351852 | 41.899 |
| 44358.328310185185 | 41.59 |
| 44358.369976851856 | 41.744 |
| 44358.41164351852 | 42.439 |
| 44358.453310185185 | 43.868 |
| 44358.494976851856 | 45.798 |
| 44358.53664351852 | 48.057 |
| 44358.578310185185 | 50.277 |
| 44358.619976851856 | 52.458 |
| 44358.66164351852 | 54.119 |
| 44358.703310185185 | 55.258 |
| 44358.744976851856 | 55.76 |
| 44358.78664351852 | 55.605 |
| 44358.828310185185 | 55.123 |
| 44358.869976851856 | 54.312 |
| 44358.91164351852 | 53.173 |
| 44358.953310185185 | 51.725 |
| 44358.994976851856 | 50.161 |
| 44359.03664351852 | 48.597 |
| 44359.078310185185 | 47.169 |
| 44359.119976851856 | 46.011 |
| 44359.16164351852 | 45.007 |
| 44359.203310185185 | 44.08 |
| 44359.244976851856 | 43.308 |
| 44359.28664351852 | 42.729 |
| 44359.328310185185 | 42.4 |
| 44359.369976851856 | 42.478 |
| 44359.41164351852 | 43.346 |
| 44359.453310185185 | 44.929 |
| 44359.494976851856 | 47.034 |
| 44359.53664351852 | 49.292 |
| 44359.578310185185 | 51.59 |
| 44359.619976851856 | 53.655 |
| 44359.66164351852 | 55.296 |
| 44359.703310185185 | 56.397 |
| 44359.744976851856 | 56.821 |
| 44359.78664351852 | 56.667 |
| 44359.828310185185 | 56.184 |
| 44359.869976851856 | 55.374 |
| 44359.91164351852 | 54.138 |
| 44359.953310185185 | 52.632 |
| 44359.994976851856 | 51.011 |
| 44360.03664351852 | 49.408 |
| 44360.078310185185 | 48.018 |
| 44360.119976851856 | 46.821 |
| 44360.16164351852 | 45.798 |
| 44360.203310185185 | 44.929 |
| 44360.244976851856 | 44.177 |
| 44360.28664351852 | 43.578 |
| 44360.328310185185 | 43.308 |
| 44360.369976851856 | 43.482 |
| 44360.41164351852 | 44.273 |
| 44360.453310185185 | 45.798 |
| 44360.494976851856 | 47.922 |
| 44360.53664351852 | 50.335 |
| 44360.578310185185 | 52.729 |
| 44360.619976851856 | 54.93 |
| 44360.66164351852 | 56.764 |
| 44360.703310185185 | 57.594 |
| 44360.744976851856 | 57.845 |
| 44360.78664351852 | 56.841 |
| 44360.828310185185 | 56.088 |
| 44360.869976851856 | 55.123 |
| 44360.91164351852 | 53.945 |
| 44360.953310185185 | 52.594 |
| 44360.994976851856 | 51.358 |
| 44361.03664351852 | 50.103 |
| 44361.078310185185 | 48.945 |
| 44361.119976851856 | 47.999 |
| 44361.16164351852 | 47.169 |
| 44361.203310185185 | 46.416 |
| 44361.244976851856 | 45.663 |
| 44361.28664351852 | 45.084 |
| 44361.328310185185 | 44.852 |
| 44361.369976851856 | 44.968 |
| 44361.41164351852 | 45.74 |
| 44361.453310185185 | 47.227 |
| 44361.494976851856 | 49.235 |
| 44361.53664351852 | 51.513 |
| 44361.578310185185 | 53.752 |
| 44361.619976851856 | 55.74 |
| 44361.66164351852 | 57.304 |
| 44361.703310185185 | 58.404 |
| 44361.744976851856 | 58.733 |
| 44361.78664351852 | 58.443 |
| 44361.828310185185 | 57.845 |
| 44361.869976851856 | 56.783 |
| 44361.91164351852 | 55.316 |
| 44361.953310185185 | 53.597 |
| 44361.994976851856 | 51.744 |
| 44362.03664351852 | 50.123 |
| 44362.078310185185 | 48.752 |
| 44362.119976851856 | 47.671 |
| 44362.16164351852 | 46.821 |
| 44362.203310185185 | 46.107 |
| 44362.244976851856 | 45.47 |
| 44362.28664351852 | 44.872 |
| 44362.328310185185 | 44.736 |
| 44362.369976851856 | 44.833 |
| 44362.41164351852 | 45.605 |
| 44362.453310185185 | 47.15 |
| 44362.494976851856 | 49.138 |
| 44362.53664351852 | 51.319 |
| 44362.578310185185 | 53.482 |
| 44362.619976851856 | 55.335 |
| 44362.66164351852 | 56.802 |
| 44362.703310185185 | 57.574 |
| 44362.744976851856 | 57.999 |
| 44362.78664351852 | 57.845 |
| 44362.828310185185 | 57.072 |
| 44362.869976851856 | 56.146 |
| 44362.91164351852 | 54.891 |
| 44362.953310185185 | 53.404 |
| 44362.994976851856 | 51.879 |
| 44363.03664351852 | 50.586 |
| 44363.078310185185 | 49.273 |
| 44363.119976851856 | 48.173 |
| 44363.16164351852 | 47.323 |
| 44363.203310185185 | 46.532 |
| 44363.244976851856 | 45.895 |
| 44363.28664351852 | 45.316 |
| 44363.328310185185 | 45.103 |
| 44363.369976851856 | 45.258 |
| 44363.41164351852 | 46.011 |
| 44363.453310185185 | 47.362 |
| 44363.494976851856 | 49.08 |
| 44363.53664351852 | 51.3 |
| 44363.578310185185 | 52.323 |
| 44363.619976851856 | 53.868 |
| 44363.66164351852 | 55.123 |
| 44363.703310185185 | 55.953 |
| 44363.744976851856 | 56.184 |
| 44363.78664351852 | 56.069 |
| 44363.828310185185 | 55.663 |
| 44363.869976851856 | 54.852 |
| 44363.91164351852 | 53.713 |
| 44363.953310185185 | 52.478 |
| 44363.994976851856 | 51.204 |
| 44364.03664351852 | 50.161 |
| 44364.078310185185 | 49.177 |
| 44364.119976851856 | 48.308 |
| 44364.16164351852 | 47.632 |
| 44364.203310185185 | 46.937 |
| 44364.244976851856 | 46.319 |
| 44364.28664351852 | 45.837 |
| 44364.328310185185 | 45.586 |
| 44364.369976851856 | 45.74 |
| 44364.41164351852 | 46.435 |
| 44364.453310185185 | 47.922 |
| 44364.494976851856 | 49.756 |
| 44364.53664351852 | 51.435 |
| 44364.578310185185 | 53.153 |
| 44364.619976851856 | 54.737 |
| 44364.66164351852 | 56.049 |
| 44364.703310185185 | 56.358 |
| 44364.744976851856 | 56.493 |
| 44364.78664351852 | 56.628 |
| 44364.828310185185 | 56.223 |
| 44364.869976851856 | 55.316 |
| 44364.91164351852 | 54.389 |
| 44364.953310185185 | 53.424 |
| 44364.994976851856 | 52.304 |
| 44365.03664351852 | 51.049 |
| 44365.078310185185 | 49.949 |
| 44365.119976851856 | 49.08 |
| 44365.16164351852 | 48.289 |
| 44365.203310185185 | 47.516 |
| 44365.244976851856 | 46.802 |
| 44365.28664351852 | 46.281 |
| 44365.328310185185 | 46.011 |
| 44365.369976851856 | 46.03 |
| 44365.41164351852 | 46.744 |
| 44365.453310185185 | 47.536 |
| 44365.494976851856 | 48.308 |
| 44365.53664351852 | 49.138 |
| 44365.578310185185 | 50.702 |
| 44365.619976851856 | 52.285 |
| 44365.66164351852 | 53.269 |
| 44365.703310185185 | 54.756 |
| 44365.744976851856 | 54.659 |
| 44365.78664351852 | 54.177 |
| 44365.828310185185 | 53.655 |
| 44365.869976851856 | 53.231 |
| 44365.91164351852 | 52.458 |
| 44365.953310185185 | 51.551 |
| 44365.994976851856 | 50.451 |
| 44366.03664351852 | 49.408 |
| 44366.078310185185 | 48.597 |
| 44366.119976851856 | 47.864 |
| 44366.16164351852 | 47.265 |
| 44366.203310185185 | 46.841 |
| 44366.244976851856 | 46.435 |
| 44366.28664351852 | 46.088 |
| 44366.328310185185 | 45.953 |
| 44366.369976851856 | 46.126 |
| 44366.41164351852 | 46.937 |
| 44366.453310185185 | 47.98 |
| 44366.494976851856 | 49.061 |
| 44366.53664351852 | 49.949 |
| 44366.578310185185 | 51.918 |
| 44366.619976851856 | 53.134 |
| 44366.66164351852 | 53.038 |
| 44366.703310185185 | 53.153 |
| 44366.744976851856 | 53.578 |
| 44366.78664351852 | 53.347 |
| 44366.828310185185 | 52.478 |
| 44366.869976851856 | 51.667 |
| 44366.91164351852 | 50.895 |
| 44366.953310185185 | 50.084 |
| 44366.994976851856 | 49.215 |
| 44367.03664351852 | 48.25 |
| 44367.078310185185 | 47.323 |
| 44367.119976851856 | 46.513 |
| 44367.16164351852 | 45.875 |
| 44367.203310185185 | 45.316 |
| 44367.244976851856 | 44.814 |
| 44367.28664351852 | 44.563 |
| 44367.328310185185 | 44.621 |
| 44367.369976851856 | 45.045 |
| 44367.41164351852 | 46.03 |
| 44367.453310185185 | 47.227 |
| 44367.494976851856 | 49.292 |
| 44367.53664351852 | 50.509 |
| 44367.578310185185 | 51.493 |
| 44367.619976851856 | 53.153 |
| 44367.66164351852 | 54.447 |
| 44367.703310185185 | 54.949 |
| 44367.744976851856 | 54.987 |
| 44367.78664351852 | 54.582 |
| 44367.828310185185 | 54.119 |
| 44367.869976851856 | 53.482 |
| 44367.91164351852 | 52.536 |
| 44367.953310185185 | 51.397 |
| 44367.994976851856 | 50.219 |
| 44368.03664351852 | 49.196 |
| 44368.078310185185 | 48.25 |
| 44368.119976851856 | 47.478 |
| 44368.16164351852 | 46.706 |
| 44368.203310185185 | 45.953 |
| 44368.244976851856 | 45.277 |
| 44368.28664351852 | 44.736 |
| 44368.328310185185 | 44.485 |
| 44368.369976851856 | 44.794 |
| 44368.41164351852 | 45.567 |
| 44368.453310185185 | 47.188 |
| 44368.494976851856 | 49.157 |
| 44368.53664351852 | 51.358 |
| 44368.578310185185 | 53.501 |
| 44368.619976851856 | 55.47 |
| 44368.66164351852 | 56.957 |
| 44368.703310185185 | 57.96 |
| 44368.744976851856 | 58.25 |
| 44368.78664351852 | 57.941 |
| 44368.828310185185 | 57.034 |
| 44368.869976851856 | 56.126 |
| 44368.91164351852 | 55.103 |
| 44368.953310185185 | 53.752 |
| 44368.994976851856 | 52.188 |
| 44369.03664351852 | 50.625 |
| 44369.078310185185 | 49.254 |
| 44369.119976851856 | 48.038 |
| 44369.16164351852 | 46.995 |
| 44369.203310185185 | 46.088 |
| 44369.244976851856 | 45.316 |
| 44369.28664351852 | 44.756 |
| 44369.328310185185 | 44.582 |
| 44369.369976851856 | 44.601 |
| 44369.41164351852 | 45.393 |
| 44369.453310185185 | 46.879 |
| 44369.494976851856 | 47.767 |
| 44369.53664351852 | 50.026 |
| 44369.578310185185 | 51.667 |
| 44369.619976851856 | 52.845 |
| 44369.66164351852 | 54.698 |
| 44369.703310185185 | 56.03 |
| 44369.744976851856 | 56.32 |
| 44369.78664351852 | 55.798 |
| 44369.828310185185 | 55.084 |
| 44369.869976851856 | 54.543 |
| 44369.91164351852 | 53.906 |
| 44369.953310185185 | 53.134 |
| 44369.994976851856 | 52.072 |
| 44370.03664351852 | 50.933 |
| 44370.078310185185 | 49.872 |
| 44370.119976851856 | 48.713 |
| 44370.16164351852 | 47.69 |
| 44370.203310185185 | 46.686 |
| 44370.244976851856 | 45.914 |
| 44370.28664351852 | 45.335 |
| 44370.328310185185 | 45.084 |
| 44370.369976851856 | 45.219 |
| 44370.41164351852 | 45.779 |
| 44370.453310185185 | 47.053 |
| 44370.494976851856 | 48.559 |
| 44370.53664351852 | 50.354 |
| 44370.578310185185 | 50.818 |
| 44370.619976851856 | 51.319 |
| 44370.66164351852 | 51.358 |
| 44370.703310185185 | 52.014 |
| 44370.744976851856 | 52.208 |
| 44370.78664351852 | 51.957 |
| 44370.828310185185 | 51.86 |
| 44370.869976851856 | 51.609 |
| 44370.91164351852 | 51.184 |
| 44370.953310185185 | 50.721 |
| 44370.994976851856 | 50.2 |
| 44371.03664351852 | 49.736 |
| 44371.078310185185 | 49.254 |
| 44371.119976851856 | 48.771 |
| 44371.16164351852 | 48.25 |
| 44371.203310185185 | 47.767 |
| 44371.244976851856 | 47.343 |
| 44371.28664351852 | 47.072 |
| 44371.328310185185 | 47.111 |
| 44371.369976851856 | 47.555 |
| 44371.41164351852 | 47.864 |
| 44371.453310185185 | 48.153 |
| 44371.494976851856 | 49.466 |
| 44371.53664351852 | 50.682 |
| 44371.578310185185 | 52.709 |
| 44371.619976851856 | 53.211 |
| 44371.66164351852 | 52.42 |
| 44371.703310185185 | 52.903 |
| 44371.744976851856 | 53.443 |
| 44371.78664351852 | 52.941 |
| 44371.828310185185 | 52.246 |
| 44371.869976851856 | 51.667 |
| 44371.91164351852 | 50.991 |
| 44371.953310185185 | 50.238 |
| 44371.994976851856 | 49.428 |
| 44372.03664351852 | 48.559 |
| 44372.078310185185 | 47.671 |
| 44372.119976851856 | 46.957 |
| 44372.16164351852 | 46.358 |
| 44372.203310185185 | 45.721 |
| 44372.244976851856 | 45.238 |
| 44372.28664351852 | 44.968 |
| 44372.328310185185 | 44.852 |
| 44372.369976851856 | 45.238 |
| 44372.41164351852 | 46.068 |
| 44372.453310185185 | 46.995 |
| 44372.494976851856 | 48.385 |
| 44372.53664351852 | 50.065 |
| 44372.578310185185 | 51.513 |
| 44372.619976851856 | 50.933 |
| 44372.66164351852 | 51.821 |
| 44372.703310185185 | 52.227 |
| 44372.744976851856 | 52.903 |
| 44372.78664351852 | 52.883 |
| 44372.828310185185 | 52.111 |
| 44372.869976851856 | 51.628 |
| 44372.91164351852 | 51.319 |
| 44372.953310185185 | 50.798 |
| 44372.994976851856 | 50.123 |
| 44373.03664351852 | 49.447 |
| 44373.078310185185 | 48.771 |
| 44373.119976851856 | 48.211 |
| 44373.16164351852 | 47.671 |
| 44373.203310185185 | 47.323 |
| 44373.244976851856 | 46.918 |
| 44373.28664351852 | 46.667 |
| 44373.328310185185 | 46.513 |
| 44373.369976851856 | 46.86 |
| 44373.41164351852 | 46.995 |
| 44373.453310185185 | 47.748 |
| 44373.494976851856 | 48.385 |
| 44373.53664351852 | 49.447 |
| 44373.578310185185 | 50.238 |
| 44373.619976851856 | 51.455 |
| 44373.66164351852 | 52.188 |
| 44373.703310185185 | 52.613 |
| 44373.744976851856 | 52.98 |
| 44373.78664351852 | 52.96 |
| 44373.828310185185 | 52.748 |
| 44373.869976851856 | 52.227 |
| 44373.91164351852 | 51.628 |
| 44373.953310185185 | 51.011 |
| 44373.994976851856 | 50.238 |
| 44374.03664351852 | 49.331 |
| 44374.078310185185 | 48.559 |
| 44374.119976851856 | 47.845 |
| 44374.16164351852 | 47.285 |
| 44374.203310185185 | 46.802 |
| 44374.244976851856 | 46.377 |
| 44374.28664351852 | 46.146 |
| 44374.328310185185 | 46.088 |
| 44374.369976851856 | 46.358 |
| 44374.41164351852 | 47.053 |
| 44374.453310185185 | 48.501 |
| 44374.494976851856 | 50.103 |
| 44374.53664351852 | 50.953 |
| 44374.578310185185 | 52.632 |
| 44374.619976851856 | 54.389 |
| 44374.66164351852 | 54.698 |
| 44374.703310185185 | 54.061 |
| 44374.744976851856 | 53.791 |
| 44374.78664351852 | 53.308 |
| 44374.828310185185 | 52.922 |
| 44374.869976851856 | 52.343 |
| 44374.91164351852 | 51.802 |
| 44374.953310185185 | 51.281 |
| 44374.994976851856 | 50.682 |
| 44375.03664351852 | 49.698 |
| 44375.078310185185 | 48.694 |
| 44375.119976851856 | 47.709 |
| 44375.16164351852 | 46.802 |
| 44375.203310185185 | 45.914 |
| 44375.244976851856 | 45.142 |
| 44375.28664351852 | 44.524 |
| 44375.328310185185 | 44.292 |
| 44375.369976851856 | 44.485 |
| 44375.41164351852 | 45.238 |
| 44375.453310185185 | 46.57 |
| 44375.494976851856 | 47.613 |
| 44375.53664351852 | 49.679 |
| 44375.578310185185 | 50.837 |
| 44375.619976851856 | 52.014 |
| 44375.66164351852 | 52.652 |
| 44375.703310185185 | 53.424 |
| 44375.744976851856 | 54.37 |
| 44375.78664351852 | 54.872 |
| 44375.828310185185 | 54.794 |
| 44375.869976851856 | 54.505 |
| 44375.91164351852 | 54.003 |
| 44375.953310185185 | 53.211 |
| 44375.994976851856 | 52.13 |
| 44376.03664351852 | 50.856 |
| 44376.078310185185 | 49.775 |
| 44376.119976851856 | 48.771 |
| 44376.16164351852 | 47.864 |
| 44376.203310185185 | 47.053 |
| 44376.244976851856 | 46.474 |
| 44376.28664351852 | 46.049 |
| 44376.328310185185 | 46.068 |
| 44376.369976851856 | 46.184 |
| 44376.41164351852 | 47.034 |
| 44376.453310185185 | 48.482 |
| 44376.494976851856 | 50.953 |
| 44376.53664351852 | 51.628 |
| 44376.578310185185 | 52.787 |
| 44376.619976851856 | 54.814 |
| 44376.66164351852 | 55.74 |
| 44376.703310185185 | 55.586 |
| 44376.744976851856 | 55.489 |
| 44376.78664351852 | 55.374 |
| 44376.828310185185 | 54.833 |
| 44376.869976851856 | 54.273 |
| 44376.91164351852 | 53.482 |
| 44376.953310185185 | 52.671 |
| 44376.994976851856 | 51.725 |
| 44377.03664351852 | 50.47 |
| 44377.078310185185 | 49.389 |
| 44377.119976851856 | 48.655 |
| 44377.16164351852 | 47.98 |
| 44377.203310185185 | 47.458 |
| 44377.244976851856 | 46.899 |
| 44377.28664351852 | 46.648 |
| 44377.328310185185 | 46.609 |
| 44377.369976851856 | 46.821 |
| 44377.41164351852 | 47.632 |
| 44377.453310185185 | 49.177 |
| 44377.494976851856 | 51.377 |
| 44377.53664351852 | 53.308 |
| 44377.578310185185 | 55.567 |
| 44377.619976851856 | 57.285 |
| 44377.66164351852 | 58.096 |
| 44377.703310185185 | 58.211 |
| 44377.744976851856 | 58.25 |
| 44377.78664351852 | 57.362 |
| 44377.828310185185 | 56.474 |
| 44377.869976851856 | 55.953 |
| 44377.91164351852 | 54.93 |
| 44377.953310185185 | 53.771 |
| 44377.994976851856 | 52.825 |
| 44378.03664351852 | 52.014 |
| 44378.078310185185 | 51.358 |
| 44378.119976851856 | 50.76 |
| 44378.16164351852 | 50.316 |
| 44378.203310185185 | 49.949 |
| 44378.244976851856 | 49.659 |
| 44378.28664351852 | 49.485 |
| 44378.328310185185 | 49.505 |
| 44378.369976851856 | 49.852 |
| 44378.41164351852 | 50.74 |
| 44378.453310185185 | 51.165 |
| 44378.494976851856 | 52.227 |
| 44378.53664351852 | 53.482 |
| 44378.578310185185 | 54.756 |
| 44378.619976851856 | 55.702 |
| 44378.66164351852 | 56.455 |
| 44378.703310185185 | 56.493 |
| 44378.744976851856 | 56.455 |
| 44378.78664351852 | 56.377 |
| 44378.828310185185 | 56.088 |
| 44378.869976851856 | 55.547 |
| 44378.91164351852 | 54.486 |
| 44378.953310185185 | 53.54 |
| 44378.994976851856 | 52.787 |
| 44379.03664351852 | 52.13 |
| 44379.078310185185 | 51.455 |
| 44379.119976851856 | 50.856 |
| 44379.16164351852 | 50.374 |
| 44379.203310185185 | 49.968 |
| 44379.244976851856 | 49.524 |
| 44379.28664351852 | 49.254 |
| 44379.328310185185 | 49.177 |
| 44379.369976851856 | 49.505 |
| 44379.41164351852 | 50.296 |
| 44379.453310185185 | 51.783 |
| 44379.494976851856 | 53.733 |
| 44379.53664351852 | 55.876 |
| 44379.578310185185 | 57.265 |
| 44379.619976851856 | 57.053 |
| 44379.66164351852 | 58.115 |
| 44379.703310185185 | 59.119 |
| 44379.744976851856 | 59.119 |
| 44379.78664351852 | 58.366 |
| 44379.828310185185 | 57.536 |
| 44379.869976851856 | 56.339 |
| 44379.91164351852 | 55.142 |
| 44379.953310185185 | 53.984 |
| 44379.994976851856 | 52.922 |
| 44380.03664351852 | 52.111 |
| 44380.078310185185 | 51.358 |
| 44380.119976851856 | 50.721 |
| 44380.16164351852 | 50.219 |
| 44380.203310185185 | 49.775 |
| 44380.244976851856 | 49.466 |
| 44380.28664351852 | 49.196 |
| 44380.328310185185 | 49.177 |
| 44380.369976851856 | 49.466 |
| 44380.41164351852 | 50.296 |
| 44380.453310185185 | 51.821 |
| 44380.494976851856 | 53.81 |
| 44380.53664351852 | 55.026 |
| 44380.578310185185 | 56.513 |
| 44380.619976851856 | 57.594 |
| 44380.66164351852 | 58.096 |
| 44380.703310185185 | 59.35 |
| 44380.744976851856 | 59.08 |
| 44380.78664351852 | 58.366 |
| 44380.828310185185 | 57.613 |
| 44380.869976851856 | 57.034 |
| 44380.91164351852 | 56.242 |
| 44380.953310185185 | 55.335 |
| 44380.994976851856 | 54.389 |
| 44381.03664351852 | 53.385 |
| 44381.078310185185 | 52.42 |
| 44381.119976851856 | 51.686 |
| 44381.16164351852 | 51.088 |
| 44381.203310185185 | 50.663 |
| 44381.244976851856 | 50.277 |
| 44381.28664351852 | 49.949 |
| 44381.328310185185 | 49.968 |
| 44381.369976851856 | 50.277 |
| 44381.41164351852 | 51.049 |
| 44381.453310185185 | 52.555 |
| 44381.494976851856 | 54.543 |
| 44381.53664351852 | 56.706 |
| 44381.578310185185 | 58.984 |
| 44381.619976851856 | 60.509 |
| 44381.66164351852 | 61.937 |
| 44381.703310185185 | 61.667 |
| 44381.744976851856 | 61.223 |
| 44381.78664351852 | 60.625 |
| 44381.828310185185 | 59.505 |
| 44381.869976851856 | 58.134 |
| 44381.91164351852 | 56.648 |
| 44381.953310185185 | 55.354 |
| 44381.994976851856 | 54.254 |
| 44382.03664351852 | 53.443 |
| 44382.078310185185 | 52.729 |
| 44382.119976851856 | 52.227 |
| 44382.16164351852 | 51.725 |
| 44382.203310185185 | 51.281 |
| 44382.244976851856 | 50.895 |
| 44382.28664351852 | 50.682 |
| 44382.328310185185 | 50.605 |
| 44382.369976851856 | 50.837 |
| 44382.41164351852 | 51.628 |
| 44382.453310185185 | 53.076 |
| 44382.494976851856 | 55.084 |
| 44382.53664351852 | 56.802 |
| 44382.578310185185 | 57.999 |
| 44382.619976851856 | 59.601 |
| 44382.66164351852 | 59.138 |
| 44382.703310185185 | 58.096 |
| 44382.744976851856 | 57.401 |
| 44382.78664351852 | 57.015 |
| 44382.828310185185 | 56.493 |
| 44382.869976851856 | 56.088 |
| 44382.91164351852 | 55.47 |
| 44382.953310185185 | 54.543 |
| 44382.994976851856 | 53.559 |
| 44383.03664351852 | 52.98 |
| 44383.078310185185 | 52.516 |
| 44383.119976851856 | 51.937 |
| 44383.16164351852 | 51.416 |
| 44383.203310185185 | 51.069 |
| 44383.244976851856 | 50.702 |
| 44383.28664351852 | 50.451 |
| 44383.328310185185 | 50.431 |
| 44383.369976851856 | 50.74 |
| 44383.41164351852 | 51.474 |
| 44383.453310185185 | 52.864 |
| 44383.494976851856 | 54.698 |
| 44383.53664351852 | 56.686 |
| 44383.578310185185 | 58.694 |
| 44383.619976851856 | 60.47 |
| 44383.66164351852 | 61.841 |
| 44383.703310185185 | 62.671 |
| 44383.744976851856 | 62.903 |
| 44383.78664351852 | 62.285 |
| 44383.828310185185 | 61.377 |
| 44383.869976851856 | 60.181 |
| 44383.91164351852 | 58.849 |
| 44383.953310185185 | 57.343 |
| 44383.994976851856 | 55.914 |
| 44384.03664351852 | 54.64 |
| 44384.078310185185 | 53.578 |
| 44384.119976851856 | 52.652 |
| 44384.16164351852 | 52.034 |
| 44384.203310185185 | 51.59 |
| 44384.244976851856 | 51.204 |
| 44384.28664351852 | 50.953 |
| 44384.328310185185 | 50.914 |
| 44384.369976851856 | 51.107 |
| 44384.41164351852 | 51.86 |
| 44384.453310185185 | 53.231 |
| 44384.494976851856 | 55.103 |
| 44384.53664351852 | 57.072 |
| 44384.578310185185 | 59.119 |
| 44384.619976851856 | 60.876 |
| 44384.66164351852 | 62.343 |
| 44384.703310185185 | 63.134 |
| 44384.744976851856 | 63.366 |
| 44384.78664351852 | 62.961 |
| 44384.828310185185 | 62.072 |
| 44384.869976851856 | 60.876 |
| 44384.91164351852 | 59.35 |
| 44384.953310185185 | 57.806 |
| 44384.994976851856 | 56.377 |
| 44385.03664351852 | 55.103 |
| 44385.078310185185 | 54.061 |
| 44385.119976851856 | 53.153 |
| 44385.16164351852 | 52.516 |
| 44385.203310185185 | 52.072 |
| 44385.244976851856 | 51.725 |
| 44385.28664351852 | 51.493 |
| 44385.328310185185 | 51.435 |
| 44385.369976851856 | 51.474 |
| 44385.41164351852 | 52.439 |
| 44385.453310185185 | 53.655 |
| 44385.494976851856 | 55.335 |
| 44385.53664351852 | 56.686 |
| 44385.578310185185 | 57.941 |
| 44385.619976851856 | 58.598 |
| 44385.66164351852 | 59.486 |
| 44385.703310185185 | 59.794 |
| 44385.744976851856 | 59.273 |
| 44385.78664351852 | 59.659 |
| 44385.828310185185 | 59.698 |
| 44385.869976851856 | 58.868 |
| 44385.91164351852 | 58.076 |
| 44385.953310185185 | 56.899 |
| 44385.994976851856 | 55.567 |
| 44386.03664351852 | 54.486 |
| 44386.078310185185 | 53.578 |
| 44386.119976851856 | 52.748 |
| 44386.16164351852 | 52.053 |
| 44386.203310185185 | 51.513 |
| 44386.244976851856 | 50.972 |
| 44386.28664351852 | 50.586 |
| 44386.328310185185 | 50.528 |
| 44386.369976851856 | 50.837 |
| 44386.41164351852 | 51.667 |
| 44386.453310185185 | 53.076 |
| 44386.494976851856 | 55.181 |
| 44386.53664351852 | 56.957 |
| 44386.578310185185 | 58.115 |
| 44386.619976851856 | 58.829 |
| 44386.66164351852 | 58.964 |
| 44386.703310185185 | 59.891 |
| 44386.744976851856 | 60.238 |
| 44386.78664351852 | 59.64 |
| 44386.828310185185 | 59.08 |
| 44386.869976851856 | 58.057 |
| 44386.91164351852 | 57.072 |
| 44386.953310185185 | 56.049 |
| 44386.994976851856 | 55.103 |
| 44387.03664351852 | 54.099 |
| 44387.078310185185 | 52.999 |
| 44387.119976851856 | 52.111 |
| 44387.16164351852 | 51.281 |
| 44387.203310185185 | 50.489 |
| 44387.244976851856 | 49.736 |
| 44387.28664351852 | 49.119 |
| 44387.328310185185 | 48.887 |
| 44387.369976851856 | 49.138 |
| 44387.41164351852 | 49.872 |
| 44387.453310185185 | 51.262 |
| 44387.494976851856 | 53.153 |
| 44387.53664351852 | 55.238 |
| 44387.578310185185 | 57.304 |
| 44387.619976851856 | 59.119 |
| 44387.66164351852 | 60.528 |
| 44387.703310185185 | 61.281 |
| 44387.744976851856 | 61.628 |
| 44387.78664351852 | 61.416 |
| 44387.828310185185 | 60.779 |
| 44387.869976851856 | 59.852 |
| 44387.91164351852 | 58.578 |
| 44387.953310185185 | 57.072 |
| 44387.994976851856 | 55.547 |
| 44388.03664351852 | 54.042 |
| 44388.078310185185 | 52.671 |
| 44388.119976851856 | 51.513 |
| 44388.16164351852 | 50.528 |
| 44388.203310185185 | 49.659 |
| 44388.244976851856 | 49.022 |
| 44388.28664351852 | 48.578 |
| 44388.328310185185 | 48.404 |
| 44388.369976851856 | 48.636 |
| 44388.41164351852 | 49.37 |
| 44388.453310185185 | 50.76 |
| 44388.494976851856 | 52.555 |
| 44388.53664351852 | 54.64 |
| 44388.578310185185 | 56.821 |
| 44388.619976851856 | 58.675 |
| 44388.66164351852 | 60.142 |
| 44388.703310185185 | 61.107 |
| 44388.744976851856 | 61.377 |
| 44388.78664351852 | 61.223 |
| 44388.828310185185 | 60.702 |
| 44388.869976851856 | 59.794 |
| 44388.91164351852 | 58.636 |
| 44388.953310185185 | 57.188 |
| 44388.994976851856 | 55.702 |
| 44389.03664351852 | 54.292 |
| 44389.078310185185 | 52.999 |
| 44389.119976851856 | 51.744 |
| 44389.16164351852 | 50.76 |
| 44389.203310185185 | 49.949 |
| 44389.244976851856 | 49.35 |
| 44389.28664351852 | 48.829 |
| 44389.328310185185 | 48.694 |
| 44389.369976851856 | 48.848 |
| 44389.41164351852 | 49.543 |
| 44389.453310185185 | 50.779 |
| 44389.494976851856 | 52.516 |
| 44389.53664351852 | 54.621 |
| 44389.578310185185 | 56.725 |
| 44389.619976851856 | 58.791 |
| 44389.66164351852 | 60.123 |
| 44389.703310185185 | 61.262 |
| 44389.744976851856 | 61.532 |
| 44389.78664351852 | 61.474 |
| 44389.828310185185 | 60.818 |
| 44389.869976851856 | 59.891 |
| 44389.91164351852 | 58.887 |
| 44389.953310185185 | 57.825 |
| 44389.994976851856 | 56.532 |
| 44390.03664351852 | 55.258 |
| 44390.078310185185 | 53.887 |
| 44390.119976851856 | 52.671 |
| 44390.16164351852 | 51.725 |
| 44390.203310185185 | 50.991 |
| 44390.244976851856 | 50.238 |
| 44390.28664351852 | 49.775 |
| 44390.328310185185 | 49.428 |
| 44390.369976851856 | 49.852 |
| 44390.41164351852 | 50.354 |
| 44390.453310185185 | 51.706 |
| 44390.494976851856 | 52.536 |
| 44390.53664351852 | 53.675 |
| 44390.578310185185 | 55.489 |
| 44390.619976851856 | 55.856 |
| 44390.66164351852 | 56.899 |
| 44390.703310185185 | 57.381 |
| 44390.744976851856 | 57.015 |
| 44390.78664351852 | 56.493 |
| 44390.828310185185 | 56.32 |
| 44390.869976851856 | 55.76 |
| 44390.91164351852 | 55.161 |
| 44390.953310185185 | 54.601 |
| 44390.994976851856 | 53.926 |
| 44391.03664351852 | 53.018 |
| 44391.078310185185 | 52.053 |
| 44391.119976851856 | 51.107 |
| 44391.16164351852 | 50.277 |
| 44391.203310185185 | 49.601 |
| 44391.244976851856 | 49.022 |
| 44391.28664351852 | 48.636 |
| 44391.328310185185 | 48.501 |
| 44391.369976851856 | 48.578 |
| 44391.41164351852 | 48.733 |
| 44391.453310185185 | 49.138 |
| 44391.494976851856 | 49.852 |
| 44391.53664351852 | 50.721 |
| 44391.578310185185 | 52.304 |
| 44391.619976851856 | 53.057 |
| 44391.66164351852 | 52.15 |
| 44391.703310185185 | 52.304 |
| 44391.744976851856 | 52.439 |
| 44391.78664351852 | 52.478 |
| 44391.828310185185 | 52.034 |
| 44391.869976851856 | 51.532 |
| 44391.91164351852 | 50.914 |
| 44391.953310185185 | 50.354 |
| 44391.994976851856 | 49.698 |
| 44392.03664351852 | 48.964 |
| 44392.078310185185 | 48.289 |
| 44392.119976851856 | 47.671 |
| 44392.16164351852 | 47.227 |
| 44392.203310185185 | 46.783 |
| 44392.244976851856 | 46.262 |
| 44392.28664351852 | 45.895 |
| 44392.328310185185 | 45.779 |
| 44392.369976851856 | 46.107 |
| 44392.41164351852 | 46.937 |
| 44392.453310185185 | 48.366 |
| 44392.494976851856 | 50.354 |
| 44392.53664351852 | 52.709 |
| 44392.578310185185 | 55.161 |
| 44392.619976851856 | 57.169 |
| 44392.66164351852 | 58.462 |
| 44392.703310185185 | 59.64 |
| 44392.744976851856 | 60.007 |
| 44392.78664351852 | 59.582 |
| 44392.828310185185 | 58.713 |
| 44392.869976851856 | 58.038 |
| 44392.91164351852 | 57.323 |
| 44392.953310185185 | 56.281 |
| 44392.994976851856 | 55.219 |
| 44393.03664351852 | 54.099 |
| 44393.078310185185 | 52.864 |
| 44393.119976851856 | 51.59 |
| 44393.16164351852 | 50.528 |
| 44393.203310185185 | 49.524 |
| 44393.244976851856 | 48.636 |
| 44393.28664351852 | 47.922 |
| 44393.328310185185 | 47.555 |
| 44393.369976851856 | 47.555 |
| 44393.41164351852 | 48.289 |
| 44393.453310185185 | 49.659 |
| 44393.494976851856 | 51.628 |
| 44393.53664351852 | 52.903 |
| 44393.578310185185 | 54.061 |
| 44393.619976851856 | 54.621 |
| 44393.66164351852 | 55.007 |
| 44393.703310185185 | 55.181 |
| 44393.744976851856 | 55.219 |
| 44393.78664351852 | 55.528 |
| 44393.828310185185 | 55.528 |
| 44393.869976851856 | 55.219 |
| 44393.91164351852 | 54.679 |
| 44393.953310185185 | 54.235 |
| 44393.994976851856 | 53.424 |
| 44394.03664351852 | 52.478 |
| 44394.078310185185 | 51.686 |
| 44394.119976851856 | 50.895 |
| 44394.16164351852 | 50.2 |
| 44394.203310185185 | 49.505 |
| 44394.244976851856 | 48.945 |
| 44394.28664351852 | 48.501 |
| 44394.328310185185 | 48.385 |
| 44394.369976851856 | 48.482 |
| 44394.41164351852 | 49.543 |
| 44394.453310185185 | 50.798 |
| 44394.494976851856 | 52.883 |
| 44394.53664351852 | 54.949 |
| 44394.578310185185 | 57.053 |
| 44394.619976851856 | 58.868 |
| 44394.66164351852 | 58.713 |
| 44394.703310185185 | 59.003 |
| 44394.744976851856 | 58.906 |
| 44394.78664351852 | 58.462 |
| 44394.828310185185 | 57.69 |
| 44394.869976851856 | 56.783 |
| 44394.91164351852 | 55.605 |
| 44394.953310185185 | 54.621 |
| 44394.994976851856 | 53.694 |
| 44395.03664351852 | 52.613 |
| 44395.078310185185 | 51.551 |
| 44395.119976851856 | 50.721 |
| 44395.16164351852 | 49.968 |
| 44395.203310185185 | 49.312 |
| 44395.244976851856 | 48.675 |
| 44395.28664351852 | 48.038 |
| 44395.328310185185 | 47.864 |
| 44395.369976851856 | 48.115 |
| 44395.41164351852 | 48.81 |
| 44395.453310185185 | 50.18 |
| 44395.494976851856 | 52.208 |
| 44395.53664351852 | 54.486 |
| 44395.578310185185 | 56.648 |
| 44395.619976851856 | 59.138 |
| 44395.66164351852 | 60.393 |
| 44395.703310185185 | 60.914 |
| 44395.744976851856 | 61.204 |
| 44395.78664351852 | 61.03 |
| 44395.828310185185 | 60.798 |
| 44395.869976851856 | 60.296 |
| 44395.91164351852 | 59.679 |
| 44395.953310185185 | 58.771 |
| 44395.994976851856 | 57.69 |
| 44396.03664351852 | 56.339 |
| 44396.078310185185 | 54.91 |
| 44396.119976851856 | 53.462 |
| 44396.16164351852 | 52.072 |
| 44396.203310185185 | 50.76 |
| 44396.244976851856 | 49.659 |
| 44396.28664351852 | 48.752 |
| 44396.328310185185 | 48.231 |
| 44396.369976851856 | 48.173 |
| 44396.41164351852 | 48.675 |
| 44396.453310185185 | 49.891 |
| 44396.494976851856 | 51.57 |
| 44396.53664351852 | 53.636 |
| 44396.578310185185 | 55.991 |
| 44396.619976851856 | 57.574 |
| 44396.66164351852 | 59.737 |
| 44396.703310185185 | 61.3 |
| 44396.744976851856 | 61.609 |
| 44396.78664351852 | 61.59 |
| 44396.828310185185 | 61.107 |
| 44396.869976851856 | 59.988 |
| 44396.91164351852 | 58.984 |
| 44396.953310185185 | 58.057 |
| 44396.994976851856 | 56.899 |
| 44397.03664351852 | 55.528 |
| 44397.078310185185 | 54.254 |
| 44397.119976851856 | 52.922 |
| 44397.16164351852 | 51.744 |
| 44397.203310185185 | 50.702 |
| 44397.244976851856 | 49.717 |
| 44397.28664351852 | 48.906 |
| 44397.328310185185 | 48.694 |
| 44397.369976851856 | 48.791 |
| 44397.41164351852 | 49.408 |
| 44397.453310185185 | 50.779 |
| 44397.494976851856 | 52.613 |
| 44397.53664351852 | 54.775 |
| 44397.578310185185 | 57.13 |
| 44397.619976851856 | 57.999 |
| 44397.66164351852 | 58.713 |
| 44397.703310185185 | 59.563 |
| 44397.744976851856 | 59.872 |
| 44397.78664351852 | 59.679 |
| 44397.828310185185 | 59.408 |
| 44397.869976851856 | 58.984 |
| 44397.91164351852 | 58.424 |
| 44397.953310185185 | 57.883 |
| 44397.994976851856 | 57.034 |
| 44398.03664351852 | 56.088 |
| 44398.078310185185 | 54.949 |
| 44398.119976851856 | 53.848 |
| 44398.16164351852 | 52.806 |
| 44398.203310185185 | 51.821 |
| 44398.244976851856 | 50.856 |
| 44398.28664351852 | 50.123 |
| 44398.328310185185 | 49.698 |
| 44398.369976851856 | 49.37 |
| 44398.41164351852 | 49.891 |
| 44398.453310185185 | 51.165 |
| 44398.494976851856 | 53.115 |
| 44398.53664351852 | 53.964 |
| 44398.578310185185 | 54.621 |
| 44398.619976851856 | 56.03 |
| 44398.66164351852 | 57.999 |
| 44398.703310185185 | 58.501 |
| 44398.744976851856 | 58.482 |
| 44398.78664351852 | 57.671 |
| 44398.828310185185 | 56.879 |
| 44398.869976851856 | 56.32 |
| 44398.91164351852 | 56.204 |
| 44398.953310185185 | 55.856 |
| 44398.994976851856 | 55.007 |
| 44399.03664351852 | 53.868 |
| 44399.078310185185 | 52.555 |
| 44399.119976851856 | 51.416 |
| 44399.16164351852 | 50.76 |
| 44399.203310185185 | 50.277 |
| 44399.244976851856 | 49.775 |
| 44399.28664351852 | 49.543 |
| 44399.328310185185 | 49.466 |
| 44399.369976851856 | 49.717 |
| 44399.41164351852 | 50.354 |
| 44399.453310185185 | 51.551 |
| 44399.494976851856 | 53.501 |
| 44399.53664351852 | 55.779 |
| 44399.578310185185 | 58.173 |
| 44399.619976851856 | 60.161 |
| 44399.66164351852 | 60.238 |
| 44399.703310185185 | 60.026 |
| 44399.744976851856 | 59.621 |
| 44399.78664351852 | 59.177 |
| 44399.828310185185 | 58.54 |
| 44399.869976851856 | 57.729 |
| 44399.91164351852 | 56.879 |
| 44399.953310185185 | 55.953 |
| 44399.994976851856 | 54.814 |
| 44400.03664351852 | 53.675 |
| 44400.078310185185 | 52.536 |
| 44400.119976851856 | 51.667 |
| 44400.16164351852 | 50.914 |
| 44400.203310185185 | 50.296 |
| 44400.244976851856 | 49.756 |
| 44400.28664351852 | 49.254 |
| 44400.328310185185 | 49.08 |
| 44400.369976851856 | 49.37 |
| 44400.41164351852 | 50.2 |
| 44400.453310185185 | 51.667 |
| 44400.494976851856 | 53.52 |
| 44400.53664351852 | 55.933 |
| 44400.578310185185 | 57.845 |
| 44400.619976851856 | 60.161 |
| 44400.66164351852 | 59.833 |
| 44400.703310185185 | 59.447 |
| 44400.744976851856 | 59.08 |
| 44400.78664351852 | 58.54 |
| 44400.828310185185 | 57.787 |
| 44400.869976851856 | 56.86 |
| 44400.91164351852 | 55.895 |
| 44400.953310185185 | 54.543 |
| 44400.994976851856 | 53.404 |
| 44401.03664351852 | 53.018 |
| 44401.078310185185 | 52.613 |
| 44401.119976851856 | 51.937 |
| 44401.16164351852 | 51.397 |
| 44401.203310185185 | 51.069 |
| 44401.244976851856 | 50.586 |
| 44401.28664351852 | 50.219 |
| 44401.328310185185 | 50.123 |
| 44401.369976851856 | 50.084 |
| 44401.41164351852 | 50.316 |
| 44401.453310185185 | 51.59 |
| 44401.494976851856 | 53.076 |
| 44401.53664351852 | 54.08 |
| 44401.578310185185 | 55.798 |
| 44401.619976851856 | 57.459 |
| 44401.66164351852 | 58.906 |
| 44401.703310185185 | 59.235 |
| 44401.744976851856 | 58.81 |
| 44401.78664351852 | 58.269 |
| 44401.828310185185 | 57.439 |
| 44401.869976851856 | 56.59 |
| 44401.91164351852 | 55.779 |
| 44401.953310185185 | 54.91 |
| 44401.994976851856 | 53.926 |
| 44402.03664351852 | 52.941 |
| 44402.078310185185 | 51.995 |
| 44402.119976851856 | 51.049 |
| 44402.16164351852 | 50.18 |
| 44402.203310185185 | 49.447 |
| 44402.244976851856 | 48.713 |
| 44402.28664351852 | 48.269 |
| 44402.328310185185 | 48.173 |
| 44402.369976851856 | 48.289 |
| 44402.41164351852 | 49.022 |
| 44402.453310185185 | 50.393 |
| 44402.494976851856 | 52.111 |
| 44402.53664351852 | 54.099 |
| 44402.578310185185 | 56.32 |
| 44402.619976851856 | 58.424 |
| 44402.66164351852 | 60.084 |
| 44402.703310185185 | 61.03 |
| 44402.744976851856 | 61.493 |
| 44402.78664351852 | 61.262 |
| 44402.828310185185 | 60.914 |
| 44402.869976851856 | 60.277 |
| 44402.91164351852 | 59.447 |
| 44402.953310185185 | 58.385 |
| 44402.994976851856 | 57.13 |
| 44403.03664351852 | 55.837 |
| 44403.078310185185 | 54.524 |
| 44403.119976851856 | 53.211 |
| 44403.16164351852 | 52.13 |
| 44403.203310185185 | 51.184 |
| 44403.244976851856 | 50.354 |
| 44403.28664351852 | 49.601 |
| 44403.328310185185 | 49.099 |
| 44403.369976851856 | 49.138 |
| 44403.41164351852 | 49.64 |
| 44403.453310185185 | 50.895 |
| 44403.494976851856 | 52.767 |
| 44403.53664351852 | 54.91 |
| 44403.578310185185 | 57.304 |
| 44403.619976851856 | 58.424 |
| 44403.66164351852 | 59.157 |
| 44403.703310185185 | 60.702 |
| 44403.744976851856 | 61.146 |
| 44403.78664351852 | 61.223 |
| 44403.828310185185 | 60.779 |
| 44403.869976851856 | 60.065 |
| 44403.91164351852 | 59.177 |
| 44403.953310185185 | 57.555 |
| 44403.994976851856 | 55.933 |
| 44404.03664351852 | 54.524 |
| 44404.078310185185 | 53.289 |
| 44404.119976851856 | 52.188 |
| 44404.16164351852 | 51.126 |
| 44404.203310185185 | 50.161 |
| 44404.244976851856 | 49.331 |
| 44404.28664351852 | 48.733 |
| 44404.328310185185 | 48.462 |
| 44404.369976851856 | 48.501 |
| 44404.41164351852 | 49.215 |
| 44404.453310185185 | 50.625 |
| 44404.494976851856 | 52.613 |
| 44404.53664351852 | 54.91 |
| 44404.578310185185 | 57.323 |
| 44404.619976851856 | 59.582 |
| 44404.66164351852 | 61.377 |
| 44404.703310185185 | 62.362 |
| 44404.744976851856 | 61.957 |
| 44404.78664351852 | 61.995 |
| 44404.828310185185 | 61.995 |
| 44404.869976851856 | 61.242 |
| 44404.91164351852 | 60.393 |
| 44404.953310185185 | 59.563 |
| 44404.994976851856 | 58.52 |
| 44405.03664351852 | 57.227 |
| 44405.078310185185 | 55.76 |
| 44405.119976851856 | 54.35 |
| 44405.16164351852 | 53.076 |
| 44405.203310185185 | 52.111 |
| 44405.244976851856 | 51.377 |
| 44405.28664351852 | 50.779 |
| 44405.328310185185 | 50.528 |
| 44405.369976851856 | 50.625 |
| 44405.41164351852 | 51.281 |
| 44405.453310185185 | 52.594 |
| 44405.494976851856 | 54.447 |
| 44405.53664351852 | 56.667 |
| 44405.578310185185 | 58.733 |
| 44405.619976851856 | 60.837 |
| 44405.66164351852 | 62.729 |
| 44405.703310185185 | 63.694 |
| 44405.744976851856 | 63.945 |
| 44405.78664351852 | 63.25 |
| 44405.828310185185 | 62.825 |
| 44405.869976851856 | 62.169 |
| 44405.91164351852 | 61.493 |
| 44405.953310185185 | 60.586 |
| 44405.994976851856 | 59.466 |
| 44406.03664351852 | 58.211 |
| 44406.078310185185 | 56.841 |
| 44406.119976851856 | 55.451 |
| 44406.16164351852 | 54.292 |
| 44406.203310185185 | 53.385 |
| 44406.244976851856 | 52.458 |
| 44406.28664351852 | 51.879 |
| 44406.328310185185 | 51.686 |
| 44406.369976851856 | 51.976 |
| 44406.41164351852 | 52.613 |
| 44406.453310185185 | 53.848 |
| 44406.494976851856 | 55.509 |
| 44406.53664351852 | 57.71 |
| 44406.578310185185 | 60.045 |
| 44406.619976851856 | 62.15 |
| 44406.66164351852 | 63.578 |
| 44406.703310185185 | 64.331 |
| 44406.744976851856 | 65.045 |
| 44406.78664351852 | 64.64 |
| 44406.828310185185 | 64.042 |
| 44406.869976851856 | 63.54 |
| 44406.91164351852 | 62.594 |
| 44406.953310185185 | 61.3 |
| 44406.994976851856 | 59.794 |
| 44407.03664351852 | 58.462 |
| 44407.078310185185 | 57.208 |
| 44407.119976851856 | 55.933 |
| 44407.16164351852 | 54.775 |
| 44407.203310185185 | 53.655 |
| 44407.244976851856 | 52.652 |
| 44407.28664351852 | 51.899 |
| 44407.328310185185 | 51.416 |
| 44407.369976851856 | 51.397 |
| 44407.41164351852 | 51.918 |
| 44407.453310185185 | 53.038 |
| 44407.494976851856 | 54.775 |
| 44407.53664351852 | 56.957 |
| 44407.578310185185 | 59.486 |
| 44407.619976851856 | 59.717 |
| 44407.66164351852 | 60.007 |
| 44407.703310185185 | 60.489 |
| 44407.744976851856 | 60.856 |
| 44407.78664351852 | 60.644 |
| 44407.828310185185 | 60.026 |
| 44407.869976851856 | 59.235 |
| 44407.91164351852 | 58.173 |
| 44407.953310185185 | 56.783 |
| 44407.994976851856 | 55.316 |
| 44408.03664351852 | 54.447 |
| 44408.078310185185 | 53.945 |
| 44408.119976851856 | 53.347 |
| 44408.16164351852 | 52.709 |
| 44408.203310185185 | 52.285 |
| 44408.244976851856 | 52.169 |
| 44408.28664351852 | 52.072 |
| 44408.328310185185 | 52.014 |
| 44408.369976851856 | 52.323 |
| 44408.41164351852 | 52.98 |
| 44408.453310185185 | 54.119 |
| 44408.494976851856 | 55.451 |
| 44408.53664351852 | 56.455 |
| 44408.578310185185 | 57.574 |
| 44408.619976851856 | 58.636 |
| 44408.66164351852 | 58.984 |
| 44408.703310185185 | 58.462 |
| 44408.744976851856 | 58.385 |
| 44408.78664351852 | 58.154 |
| 44408.828310185185 | 57.42 |
| 44408.869976851856 | 56.435 |
| 44408.91164351852 | 55.567 |
| 44408.953310185185 | 54.872 |
| 44408.994976851856 | 54.466 |
| 44409.03664351852 | 54.042 |
| 44409.078310185185 | 53.578 |
| 44409.119976851856 | 53.25 |
| 44409.16164351852 | 52.941 |
| 44409.203310185185 | 52.806 |
| 44409.244976851856 | 52.671 |
| 44409.28664351852 | 52.555 |
| 44409.328310185185 | 52.594 |
| 44409.369976851856 | 52.613 |
| 44409.41164351852 | 53.057 |
| 44409.453310185185 | 53.771 |
| 44409.494976851856 | 55.161 |
| 44409.53664351852 | 55.856 |
| 44409.578310185185 | 56.377 |
| 44409.619976851856 | 58.231 |
| 44409.66164351852 | 59.794 |
| 44409.703310185185 | 60.316 |
| 44409.744976851856 | 60.779 |
| 44409.78664351852 | 60.605 |
| 44409.828310185185 | 60.393 |
| 44409.869976851856 | 59.659 |
| 44409.91164351852 | 58.926 |
| 44409.953310185185 | 57.999 |
| 44409.994976851856 | 56.821 |
| 44410.03664351852 | 55.818 |
| 44410.078310185185 | 55.026 |
| 44410.119976851856 | 54.447 |
| 44410.16164351852 | 53.984 |
| 44410.203310185185 | 53.655 |
| 44410.244976851856 | 53.289 |
| 44410.28664351852 | 53.115 |
| 44410.328310185185 | 53.192 |
| 44410.369976851856 | 53.52 |
| 44410.41164351852 | 54.215 |
| 44410.453310185185 | 55.354 |
| 44410.494976851856 | 56.416 |
| 44410.53664351852 | 57.71 |
| 44410.578310185185 | 60.026 |
| 44410.619976851856 | 60.258 |
| 44410.66164351852 | 60.142 |
| 44410.703310185185 | 59.968 |
| 44410.744976851856 | 59.737 |
| 44410.78664351852 | 59.196 |
| 44410.828310185185 | 58.906 |
| 44410.869976851856 | 58.25 |
| 44410.91164351852 | 57.323 |
| 44410.953310185185 | 56.57 |
| 44410.994976851856 | 56.049 |
| 44411.03664351852 | 55.818 |
| 44411.078310185185 | 55.798 |
| 44411.119976851856 | 55.605 |
| 44411.16164351852 | 55.296 |
| 44411.203310185185 | 55.123 |
| 44411.244976851856 | 55.007 |
| 44411.28664351852 | 54.852 |
| 44411.328310185185 | 54.91 |
| 44411.369976851856 | 55.219 |
| 44411.41164351852 | 55.547 |
| 44411.453310185185 | 56.204 |
| 44411.494976851856 | 56.628 |
| 44411.53664351852 | 57.362 |
| 44411.578310185185 | 57.999 |
| 44411.619976851856 | 58.462 |
| 44411.66164351852 | 59.138 |
| 44411.703310185185 | 59.003 |
| 44411.744976851856 | 58.868 |
| 44411.78664351852 | 58.578 |
| 44411.828310185185 | 58.115 |
| 44411.869976851856 | 57.613 |
| 44411.91164351852 | 57.13 |
| 44411.953310185185 | 56.513 |
| 44411.994976851856 | 56.069 |
| 44412.03664351852 | 55.74 |
| 44412.078310185185 | 55.354 |
| 44412.119976851856 | 54.91 |
| 44412.16164351852 | 54.563 |
| 44412.203310185185 | 54.157 |
| 44412.244976851856 | 53.848 |
| 44412.28664351852 | 53.636 |
| 44412.328310185185 | 53.54 |
| 44412.369976851856 | 53.771 |
| 44412.41164351852 | 54.312 |
| 44412.453310185185 | 55.412 |
| 44412.494976851856 | 56.976 |
| 44412.53664351852 | 58.54 |
| 44412.578310185185 | 59.621 |
| 44412.619976851856 | 60.895 |
| 44412.66164351852 | 62.15 |
| 44412.703310185185 | 62.729 |
| 44412.744976851856 | 62.652 |
| 44412.78664351852 | 62.13 |
| 44412.828310185185 | 61.32 |
| 44412.869976851856 | 60.103 |
| 44412.91164351852 | 58.906 |
| 44412.953310185185 | 57.71 |
| 44412.994976851856 | 56.744 |
| 44413.03664351852 | 55.991 |
| 44413.078310185185 | 55.354 |
| 44413.119976851856 | 54.756 |
| 44413.16164351852 | 54.331 |
| 44413.203310185185 | 54.042 |
| 44413.244976851856 | 53.675 |
| 44413.28664351852 | 53.366 |
| 44413.328310185185 | 53.269 |
| 44413.369976851856 | 53.501 |
| 44413.41164351852 | 54.08 |
| 44413.453310185185 | 55.181 |
| 44413.494976851856 | 56.628 |
| 44413.53664351852 | 58.443 |
| 44413.578310185185 | 60.277 |
| 44413.619976851856 | 61.802 |
| 44413.66164351852 | 62.98 |
| 44413.703310185185 | 63.52 |
| 44413.744976851856 | 63.424 |
| 44413.78664351852 | 62.806 |
| 44413.828310185185 | 61.822 |
| 44413.869976851856 | 60.644 |
| 44413.91164351852 | 59.389 |
| 44413.953310185185 | 58.211 |
| 44413.994976851856 | 57.304 |
| 44414.03664351852 | 56.513 |
| 44414.078310185185 | 55.76 |
| 44414.119976851856 | 55.181 |
| 44414.16164351852 | 54.756 |
| 44414.203310185185 | 54.447 |
| 44414.244976851856 | 54.157 |
| 44414.28664351852 | 53.964 |
| 44414.328310185185 | 53.926 |
| 44414.369976851856 | 54.061 |
| 44414.41164351852 | 54.486 |
| 44414.453310185185 | 55.258 |
| 44414.494976851856 | 56.706 |
| 44414.53664351852 | 58.424 |
| 44414.578310185185 | 59.814 |
| 44414.619976851856 | 60.47 |
| 44414.66164351852 | 60.586 |
| 44414.703310185185 | 60.953 |
| 44414.744976851856 | 60.625 |
| 44414.78664351852 | 60.238 |
| 44414.828310185185 | 59.659 |
| 44414.869976851856 | 59.061 |
| 44414.91164351852 | 58.173 |
| 44414.953310185185 | 57.362 |
| 44414.994976851856 | 56.706 |
| 44415.03664351852 | 56.088 |
| 44415.078310185185 | 55.567 |
| 44415.119976851856 | 55.161 |
| 44415.16164351852 | 54.756 |
| 44415.203310185185 | 54.408 |
| 44415.244976851856 | 54.157 |
| 44415.28664351852 | 53.733 |
| 44415.328310185185 | 53.501 |
| 44415.369976851856 | 53.636 |
| 44415.41164351852 | 53.829 |
| 44415.453310185185 | 54.37 |
| 44415.494976851856 | 55.142 |
| 44415.53664351852 | 56.126 |
| 44415.578310185185 | 57.13 |
| 44415.619976851856 | 58.211 |
| 44415.66164351852 | 58.984 |
| 44415.703310185185 | 58.906 |
| 44415.744976851856 | 58.675 |
| 44415.78664351852 | 58.289 |
| 44415.828310185185 | 57.729 |
| 44415.869976851856 | 56.821 |
| 44415.91164351852 | 55.953 |
| 44415.953310185185 | 55.123 |
| 44415.994976851856 | 54.331 |
| 44416.03664351852 | 53.617 |
| 44416.078310185185 | 52.999 |
| 44416.119976851856 | 52.478 |
| 44416.16164351852 | 52.034 |
| 44416.203310185185 | 51.725 |
| 44416.244976851856 | 51.416 |
| 44416.28664351852 | 51.146 |
| 44416.328310185185 | 51.107 |
| 44416.369976851856 | 51.242 |
| 44416.41164351852 | 51.86 |
| 44416.453310185185 | 52.999 |
| 44416.494976851856 | 54.563 |
| 44416.53664351852 | 56.377 |
| 44416.578310185185 | 58.308 |
| 44416.619976851856 | 59.949 |
| 44416.66164351852 | 61.03 |
| 44416.703310185185 | 62.111 |
| 44416.744976851856 | 62.401 |
| 44416.78664351852 | 61.802 |
| 44416.828310185185 | 61.127 |
| 44416.869976851856 | 60.084 |
| 44416.91164351852 | 58.771 |
| 44416.953310185185 | 57.362 |
| 44416.994976851856 | 55.953 |
| 44417.03664351852 | 54.698 |
| 44417.078310185185 | 53.655 |
| 44417.119976851856 | 52.845 |
| 44417.16164351852 | 52.208 |
| 44417.203310185185 | 51.725 |
| 44417.244976851856 | 51.319 |
| 44417.28664351852 | 50.914 |
| 44417.328310185185 | 50.779 |
| 44417.369976851856 | 50.837 |
| 44417.41164351852 | 51.435 |
| 44417.453310185185 | 52.555 |
| 44417.494976851856 | 53.482 |
| 44417.53664351852 | 55.161 |
| 44417.578310185185 | 56.706 |
| 44417.619976851856 | 58.52 |
| 44417.66164351852 | 59.35 |
| 44417.703310185185 | 60.123 |
| 44417.744976851856 | 60.547 |
| 44417.78664351852 | 60.625 |
| 44417.828310185185 | 59.988 |
| 44417.869976851856 | 59.428 |
| 44417.91164351852 | 58.269 |
| 44417.953310185185 | 56.783 |
| 44417.994976851856 | 55.161 |
| 44418.03664351852 | 53.752 |
| 44418.078310185185 | 52.613 |
| 44418.119976851856 | 51.725 |
| 44418.16164351852 | 51.011 |
| 44418.203310185185 | 50.374 |
| 44418.244976851856 | 49.949 |
| 44418.28664351852 | 49.524 |
| 44418.328310185185 | 49.37 |
| 44418.369976851856 | 49.485 |
| 44418.41164351852 | 50.123 |
| 44418.453310185185 | 51.377 |
| 44418.494976851856 | 52.825 |
| 44418.53664351852 | 54.582 |
| 44418.578310185185 | 56.686 |
| 44418.619976851856 | 57.323 |
| 44418.66164351852 | 57.574 |
| 44418.703310185185 | 58.096 |
| 44418.744976851856 | 57.825 |
| 44418.78664351852 | 56.821 |
| 44418.828310185185 | 55.837 |
| 44418.869976851856 | 54.737 |
| 44418.91164351852 | 53.713 |
| 44418.953310185185 | 52.362 |
| 44418.994976851856 | 51.011 |
| 44419.03664351852 | 49.872 |
| 44419.078310185185 | 48.791 |
| 44419.119976851856 | 47.98 |
| 44419.16164351852 | 47.285 |
| 44419.203310185185 | 46.802 |
| 44419.244976851856 | 46.339 |
| 44419.28664351852 | 45.875 |
| 44419.328310185185 | 45.721 |
| 44419.369976851856 | 45.837 |
| 44419.41164351852 | 46.397 |
| 44419.453310185185 | 47.594 |
| 44419.494976851856 | 49.273 |
| 44419.53664351852 | 51.3 |
| 44419.578310185185 | 53.289 |
| 44419.619976851856 | 54.93 |
| 44419.66164351852 | 56.011 |
| 44419.703310185185 | 56.32 |
| 44419.744976851856 | 55.914 |
| 44419.78664351852 | 54.872 |
| 44419.828310185185 | 53.52 |
| 44419.869976851856 | 51.841 |
| 44419.91164351852 | 50.007 |
| 44419.953310185185 | 48.25 |
| 44419.994976851856 | 46.763 |
| 44420.03664351852 | 45.586 |
| 44420.078310185185 | 44.64 |
| 44420.119976851856 | 44.138 |
| 44420.16164351852 | 43.733 |
| 44420.203310185185 | 43.404 |
| 44420.244976851856 | 43.095 |
| 44420.28664351852 | 42.845 |
| 44420.328310185185 | 42.787 |
| 44420.369976851856 | 43.038 |
| 44420.41164351852 | 43.655 |
| 44420.453310185185 | 44.91 |
| 44420.494976851856 | 46.628 |
| 44420.53664351852 | 48.578 |
| 44420.578310185185 | 49.466 |
| 44420.619976851856 | 50.837 |
| 44420.66164351852 | 52.072 |
| 44420.703310185185 | 52.864 |
| 44420.744976851856 | 53.713 |
| 44420.78664351852 | 54.872 |
| 44420.828310185185 | 54.524 |
| 44420.869976851856 | 53.675 |
| 44420.91164351852 | 53.057 |
| 44420.953310185185 | 52.439 |
| 44420.994976851856 | 51.667 |
| 44421.03664351852 | 50.914 |
| 44421.078310185185 | 50.277 |
| 44421.119976851856 | 49.833 |
| 44421.16164351852 | 49.331 |
| 44421.203310185185 | 48.81 |
| 44421.244976851856 | 48.269 |
| 44421.28664351852 | 47.748 |
| 44421.328310185185 | 47.478 |
| 44421.369976851856 | 47.69 |
| 44421.41164351852 | 48.308 |
| 44421.453310185185 | 49.621 |
| 44421.494976851856 | 51.416 |
| 44421.53664351852 | 53.501 |
| 44421.578310185185 | 55.779 |
| 44421.619976851856 | 58.038 |
| 44421.66164351852 | 58.945 |
| 44421.703310185185 | 59.293 |
| 44421.744976851856 | 58.964 |
| 44421.78664351852 | 58.404 |
| 44421.828310185185 | 57.632 |
| 44421.869976851856 | 57.169 |
| 44421.91164351852 | 56.879 |
| 44421.953310185185 | 56.184 |
| 44421.994976851856 | 55.277 |
| 44422.03664351852 | 54.215 |
| 44422.078310185185 | 52.98 |
| 44422.119976851856 | 51.86 |
| 44422.16164351852 | 50.721 |
| 44422.203310185185 | 49.756 |
| 44422.244976851856 | 48.829 |
| 44422.28664351852 | 48.018 |
| 44422.328310185185 | 47.458 |
| 44422.369976851856 | 47.478 |
| 44422.41164351852 | 48.057 |
| 44422.453310185185 | 49.312 |
| 44422.494976851856 | 51.069 |
| 44422.53664351852 | 53.096 |
| 44422.578310185185 | 55.316 |
| 44422.619976851856 | 57.555 |
| 44422.66164351852 | 59.196 |
| 44422.703310185185 | 60.219 |
| 44422.744976851856 | 60.528 |
| 44422.78664351852 | 60.084 |
| 44422.828310185185 | 59.505 |
| 44422.869976851856 | 58.926 |
| 44422.91164351852 | 58.289 |
| 44422.953310185185 | 57.343 |
| 44422.994976851856 | 56.339 |
| 44423.03664351852 | 54.987 |
| 44423.078310185185 | 53.578 |
| 44423.119976851856 | 52.169 |
| 44423.16164351852 | 50.933 |
| 44423.203310185185 | 49.814 |
| 44423.244976851856 | 48.926 |
| 44423.28664351852 | 48.289 |
| 44423.328310185185 | 48.038 |
| 44423.369976851856 | 48.192 |
| 44423.41164351852 | 48.81 |
| 44423.453310185185 | 50.084 |
| 44423.494976851856 | 51.088 |
| 44423.53664351852 | 52.787 |
| 44423.578310185185 | 54.543 |
| 44423.619976851856 | 55.489 |
| 44423.66164351852 | 56.262 |
| 44423.703310185185 | 56.146 |
| 44423.744976851856 | 56.107 |
| 44423.78664351852 | 55.798 |
| 44423.828310185185 | 55.354 |
| 44423.869976851856 | 54.717 |
| 44423.91164351852 | 54.099 |
| 44423.953310185185 | 53.385 |
| 44423.994976851856 | 52.516 |
| 44424.03664351852 | 51.474 |
| 44424.078310185185 | 50.605 |
| 44424.119976851856 | 49.736 |
| 44424.16164351852 | 48.964 |
| 44424.203310185185 | 48.25 |
| 44424.244976851856 | 47.536 |
| 44424.28664351852 | 46.879 |
| 44424.328310185185 | 46.57 |
| 44424.369976851856 | 46.706 |
| 44424.41164351852 | 47.362 |
| 44424.453310185185 | 48.636 |
| 44424.494976851856 | 50.335 |
| 44424.53664351852 | 52.381 |
| 44424.578310185185 | 54.524 |
| 44424.619976851856 | 55.509 |
| 44424.66164351852 | 57.285 |
| 44424.703310185185 | 58.308 |
| 44424.744976851856 | 58.173 |
| 44424.78664351852 | 58.501 |
| 44424.828310185185 | 58.269 |
| 44424.869976851856 | 57.594 |
| 44424.91164351852 | 56.802 |
| 44424.953310185185 | 55.779 |
| 44424.994976851856 | 54.698 |
| 44425.03664351852 | 53.501 |
| 44425.078310185185 | 52.227 |
| 44425.119976851856 | 50.895 |
| 44425.16164351852 | 49.582 |
| 44425.203310185185 | 48.443 |
| 44425.244976851856 | 47.536 |
| 44425.28664351852 | 46.821 |
| 44425.328310185185 | 46.377 |
| 44425.369976851856 | 46.513 |
| 44425.41164351852 | 47.072 |
| 44425.453310185185 | 48.385 |
| 44425.494976851856 | 50.123 |
| 44425.53664351852 | 52.169 |
| 44425.578310185185 | 53.926 |
| 44425.619976851856 | 55.219 |
| 44425.66164351852 | 56.532 |
| 44425.703310185185 | 57.304 |
| 44425.744976851856 | 56.764 |
| 44425.78664351852 | 56.725 |
| 44425.828310185185 | 56.628 |
| 44425.869976851856 | 56.339 |
| 44425.91164351852 | 55.779 |
| 44425.953310185185 | 55.219 |
| 44425.994976851856 | 54.312 |
| 44426.03664351852 | 53.269 |
| 44426.078310185185 | 52.246 |
| 44426.119976851856 | 51.377 |
| 44426.16164351852 | 50.451 |
| 44426.203310185185 | 49.524 |
| 44426.244976851856 | 48.81 |
| 44426.28664351852 | 48.153 |
| 44426.328310185185 | 47.787 |
| 44426.369976851856 | 47.825 |
| 44426.41164351852 | 48.52 |
| 44426.453310185185 | 49.621 |
| 44426.494976851856 | 50.142 |
| 44426.53664351852 | 51.802 |
| 44426.578310185185 | 52.69 |
| 44426.619976851856 | 52.922 |
| 44426.66164351852 | 54.042 |
| 44426.703310185185 | 55.238 |
| 44426.744976851856 | 54.93 |
| 44426.78664351852 | 54.872 |
| 44426.828310185185 | 55.026 |
| 44426.869976851856 | 55.007 |
| 44426.91164351852 | 54.775 |
| 44426.953310185185 | 54.389 |
| 44426.994976851856 | 53.694 |
| 44427.03664351852 | 52.787 |
| 44427.078310185185 | 51.706 |
| 44427.119976851856 | 50.74 |
| 44427.16164351852 | 49.891 |
| 44427.203310185185 | 49.215 |
| 44427.244976851856 | 48.713 |
| 44427.28664351852 | 48.269 |
| 44427.328310185185 | 47.999 |
| 44427.369976851856 | 48.096 |
| 44427.41164351852 | 48.771 |
| 44427.453310185185 | 49.177 |
| 44427.494976851856 | 50.528 |
| 44427.53664351852 | 52.014 |
| 44427.578310185185 | 53.096 |
| 44427.619976851856 | 54.428 |
| 44427.66164351852 | 54.621 |
| 44427.703310185185 | 54.659 |
| 44427.744976851856 | 55.181 |
| 44427.78664351852 | 54.91 |
| 44427.828310185185 | 54.292 |
| 44427.869976851856 | 53.829 |
| 44427.91164351852 | 53.597 |
| 44427.953310185185 | 52.883 |
| 44427.994976851856 | 51.995 |
| 44428.03664351852 | 51.126 |
| 44428.078310185185 | 50.238 |
| 44428.119976851856 | 49.389 |
| 44428.16164351852 | 48.443 |
| 44428.203310185185 | 47.594 |
| 44428.244976851856 | 46.783 |
| 44428.28664351852 | 46.011 |
| 44428.328310185185 | 45.47 |
| 44428.369976851856 | 45.431 |
| 44428.41164351852 | 45.972 |
| 44428.453310185185 | 47.014 |
| 44428.494976851856 | 48.192 |
| 44428.53664351852 | 50.219 |
| 44428.578310185185 | 51.744 |
| 44428.619976851856 | 52.864 |
| 44428.66164351852 | 53.404 |
| 44428.703310185185 | 53.829 |
| 44428.744976851856 | 55.374 |
| 44428.78664351852 | 55.682 |
| 44428.828310185185 | 54.717 |
| 44428.869976851856 | 54.138 |
| 44428.91164351852 | 53.578 |
| 44428.953310185185 | 52.903 |
| 44428.994976851856 | 52.13 |
| 44429.03664351852 | 51.146 |
| 44429.078310185185 | 49.872 |
| 44429.119976851856 | 48.52 |
| 44429.16164351852 | 47.285 |
| 44429.203310185185 | 46.126 |
| 44429.244976851856 | 45.2 |
| 44429.28664351852 | 44.485 |
| 44429.328310185185 | 44.196 |
| 44429.369976851856 | 44.601 |
| 44429.41164351852 | 45.451 |
| 44429.453310185185 | 46.918 |
| 44429.494976851856 | 48.501 |
| 44429.53664351852 | 49.003 |
| 44429.578310185185 | 49.91 |
| 44429.619976851856 | 52.227 |
| 44429.66164351852 | 53.52 |
| 44429.703310185185 | 54.621 |
| 44429.744976851856 | 55.026 |
| 44429.78664351852 | 55.065 |
| 44429.828310185185 | 54.814 |
| 44429.869976851856 | 54.235 |
| 44429.91164351852 | 53.906 |
| 44429.953310185185 | 53.057 |
| 44429.994976851856 | 52.227 |
| 44430.03664351852 | 51.319 |
| 44430.078310185185 | 50.547 |
| 44430.119976851856 | 49.717 |
| 44430.16164351852 | 48.868 |
| 44430.203310185185 | 48.134 |
| 44430.244976851856 | 47.516 |
| 44430.28664351852 | 46.976 |
| 44430.328310185185 | 46.783 |
| 44430.369976851856 | 46.899 |
| 44430.41164351852 | 47.825 |
| 44430.453310185185 | 48.887 |
| 44430.494976851856 | 50.354 |
| 44430.53664351852 | 51.725 |
| 44430.578310185185 | 53.694 |
| 44430.619976851856 | 55.2 |
| 44430.66164351852 | 56.165 |
| 44430.703310185185 | 56.86 |
| 44430.744976851856 | 56.59 |
| 44430.78664351852 | 56.088 |
| 44430.828310185185 | 55.856 |
| 44430.869976851856 | 55.065 |
| 44430.91164351852 | 54.35 |
| 44430.953310185185 | 53.578 |
| 44430.994976851856 | 52.478 |
| 44431.03664351852 | 51.493 |
| 44431.078310185185 | 50.489 |
| 44431.119976851856 | 49.37 |
| 44431.16164351852 | 48.211 |
| 44431.203310185185 | 47.053 |
| 44431.244976851856 | 46.126 |
| 44431.28664351852 | 45.277 |
| 44431.328310185185 | 44.814 |
| 44431.369976851856 | 45.045 |
| 44431.41164351852 | 45.682 |
| 44431.453310185185 | 46.319 |
| 44431.494976851856 | 47.458 |
| 44431.53664351852 | 48.694 |
| 44431.578310185185 | 51.03 |
| 44431.619976851856 | 52.323 |
| 44431.66164351852 | 53.347 |
| 44431.703310185185 | 54.312 |
| 44431.744976851856 | 55.045 |
| 44431.78664351852 | 55.567 |
| 44431.828310185185 | 55.277 |
| 44431.869976851856 | 55.123 |
| 44431.91164351852 | 54.679 |
| 44431.953310185185 | 53.771 |
| 44431.994976851856 | 52.671 |
| 44432.03664351852 | 51.59 |
| 44432.078310185185 | 50.528 |
| 44432.119976851856 | 49.37 |
| 44432.16164351852 | 48.289 |
| 44432.203310185185 | 47.207 |
| 44432.244976851856 | 46.165 |
| 44432.28664351852 | 45.393 |
| 44432.328310185185 | 44.891 |
| 44432.369976851856 | 45.026 |
| 44432.41164351852 | 45.702 |
| 44432.453310185185 | 47.381 |
| 44432.494976851856 | 48.404 |
| 44432.53664351852 | 50.393 |
| 44432.578310185185 | 52.594 |
| 44432.619976851856 | 54.621 |
| 44432.66164351852 | 56.32 |
| 44432.703310185185 | 57.536 |
| 44432.744976851856 | 57.671 |
| 44432.78664351852 | 57.343 |
| 44432.828310185185 | 56.937 |
| 44432.869976851856 | 56.397 |
| 44432.91164351852 | 55.818 |
| 44432.953310185185 | 54.814 |
| 44432.994976851856 | 53.597 |
| 44433.03664351852 | 52.323 |
| 44433.078310185185 | 50.953 |
| 44433.119976851856 | 49.64 |
| 44433.16164351852 | 48.327 |
| 44433.203310185185 | 47.034 |
| 44433.244976851856 | 45.895 |
| 44433.28664351852 | 44.91 |
| 44433.328310185185 | 44.234 |
| 44433.369976851856 | 44.157 |
| 44433.41164351852 | 44.794 |
| 44433.453310185185 | 46.281 |
| 44433.494976851856 | 48.018 |
| 44433.53664351852 | 50.045 |
| 44433.578310185185 | 52.304 |
| 44433.619976851856 | 54.486 |
| 44433.66164351852 | 56.146 |
| 44433.703310185185 | 57.188 |
| 44433.744976851856 | 57.69 |
| 44433.78664351852 | 57.516 |
| 44433.828310185185 | 57.188 |
| 44433.869976851856 | 56.802 |
| 44433.91164351852 | 56.146 |
| 44433.953310185185 | 55.219 |
| 44433.994976851856 | 54.08 |
| 44434.03664351852 | 52.806 |
| 44434.078310185185 | 51.551 |
| 44434.119976851856 | 50.258 |
| 44434.16164351852 | 48.964 |
| 44434.203310185185 | 47.767 |
| 44434.244976851856 | 46.899 |
| 44434.28664351852 | 46.068 |
| 44434.328310185185 | 45.624 |
| 44434.369976851856 | 45.779 |
| 44434.41164351852 | 46.262 |
| 44434.453310185185 | 47.246 |
| 44434.494976851856 | 48.906 |
| 44434.53664351852 | 51.011 |
| 44434.578310185185 | 51.59 |
| 44434.619976851856 | 52.478 |
| 44434.66164351852 | 53.231 |
| 44434.703310185185 | 54.814 |
| 44434.744976851856 | 54.968 |
| 44434.78664351852 | 54.949 |
| 44434.828310185185 | 54.466 |
| 44434.869976851856 | 54.254 |
| 44434.91164351852 | 54.042 |
| 44434.953310185185 | 53.578 |
| 44434.994976851856 | 52.652 |
| 44435.03664351852 | 51.435 |
| 44435.078310185185 | 50.393 |
| 44435.119976851856 | 49.35 |
| 44435.16164351852 | 48.346 |
| 44435.203310185185 | 47.439 |
| 44435.244976851856 | 46.57 |
| 44435.28664351852 | 45.818 |
| 44435.328310185185 | 45.238 |
| 44435.369976851856 | 45.335 |
| 44435.41164351852 | 46.068 |
| 44435.453310185185 | 47.613 |
| 44435.494976851856 | 49.428 |
| 44435.53664351852 | 50.914 |
| 44435.578310185185 | 52.613 |
| 44435.619976851856 | 54.389 |
| 44435.66164351852 | 55.625 |
| 44435.703310185185 | 57.15 |
| 44435.744976851856 | 57.439 |
| 44435.78664351852 | 57.98 |
| 44435.828310185185 | 58.366 |
| 44435.869976851856 | 57.69 |
| 44435.91164351852 | 56.377 |
| 44435.953310185185 | 55.316 |
| 44435.994976851856 | 54.35 |
| 44436.03664351852 | 53.153 |
| 44436.078310185185 | 51.918 |
| 44436.119976851856 | 50.605 |
| 44436.16164351852 | 49.273 |
| 44436.203310185185 | 48.038 |
| 44436.244976851856 | 46.86 |
| 44436.28664351852 | 45.953 |
| 44436.328310185185 | 45.296 |
| 44436.369976851856 | 45.258 |
| 44436.41164351852 | 45.895 |
| 44436.453310185185 | 47.304 |
| 44436.494976851856 | 49.003 |
| 44436.53664351852 | 51.049 |
| 44436.578310185185 | 53.25 |
| 44436.619976851856 | 55.2 |
| 44436.66164351852 | 56.686 |
| 44436.703310185185 | 57.652 |
| 44436.744976851856 | 57.787 |
| 44436.78664351852 | 57.806 |
| 44436.828310185185 | 57.381 |
| 44436.869976851856 | 56.899 |
| 44436.91164351852 | 56.3 |
| 44436.953310185185 | 55.296 |
| 44436.994976851856 | 54.042 |
| 44437.03664351852 | 52.69 |
| 44437.078310185185 | 51.319 |
| 44437.119976851856 | 50.123 |
| 44437.16164351852 | 49.003 |
| 44437.203310185185 | 47.999 |
| 44437.244976851856 | 46.976 |
| 44437.28664351852 | 46.107 |
| 44437.328310185185 | 45.567 |
| 44437.369976851856 | 45.74 |
| 44437.41164351852 | 46.609 |
| 44437.453310185185 | 48.076 |
| 44437.494976851856 | 49.814 |
| 44437.53664351852 | 51.59 |
| 44437.578310185185 | 53.462 |
| 44437.619976851856 | 55.181 |
| 44437.66164351852 | 56.706 |
| 44437.703310185185 | 57.594 |
| 44437.744976851856 | 57.71 |
| 44437.78664351852 | 57.478 |
| 44437.828310185185 | 57.15 |
| 44437.869976851856 | 56.455 |
| 44437.91164351852 | 55.76 |
| 44437.953310185185 | 54.814 |
| 44437.994976851856 | 53.675 |
| 44438.03664351852 | 52.439 |
| 44438.078310185185 | 51.262 |
| 44438.119976851856 | 50.103 |
| 44438.16164351852 | 49.041 |
| 44438.203310185185 | 47.96 |
| 44438.244976851856 | 47.053 |
| 44438.28664351852 | 46.262 |
| 44438.328310185185 | 45.798 |
| 44438.369976851856 | 45.76 |
| 44438.41164351852 | 46.3 |
| 44438.453310185185 | 47.516 |
| 44438.494976851856 | 49.119 |
| 44438.53664351852 | 50.798 |
| 44438.578310185185 | 52.594 |
| 44438.619976851856 | 53.655 |
| 44438.66164351852 | 54.91 |
| 44438.703310185185 | 55.181 |
| 44438.744976851856 | 55.065 |
| 44438.78664351852 | 55.586 |
| 44438.828310185185 | 55.895 |
| 44438.869976851856 | 55.779 |
| 44438.91164351852 | 55.238 |
| 44438.953310185185 | 54.428 |
| 44438.994976851856 | 53.404 |
| 44439.03664351852 | 52.188 |
| 44439.078310185185 | 50.779 |
| 44439.119976851856 | 49.466 |
| 44439.16164351852 | 48.211 |
| 44439.203310185185 | 47.13 |
| 44439.244976851856 | 46.146 |
| 44439.28664351852 | 45.296 |
| 44439.328310185185 | 44.756 |
| 44439.369976851856 | 44.698 |
| 44439.41164351852 | 45.161 |
| 44439.453310185185 | 46.3 |
| 44439.494976851856 | 47.902 |
| 44439.53664351852 | 49.775 |
| 44439.578310185185 | 51.764 |
| 44439.619976851856 | 52.709 |
| 44439.66164351852 | 54.138 |
| 44439.703310185185 | 55.103 |
| 44439.744976851856 | 55.991 |
| 44439.78664351852 | 56.049 |
| 44439.828310185185 | 55.856 |
| 44439.869976851856 | 55.547 |
| 44439.91164351852 | 55.007 |
| 44439.953310185185 | 54.331 |
| 44439.994976851856 | 53.655 |
| 44440.03664351852 | 52.825 |
| 44440.078310185185 | 51.802 |
| 44440.119976851856 | 50.76 |
| 44440.16164351852 | 49.794 |
| 44440.203310185185 | 48.713 |
| 44440.244976851856 | 47.883 |
| 44440.28664351852 | 47.265 |
| 44440.328310185185 | 46.899 |
| 44440.369976851856 | 46.763 |
| 44440.41164351852 | 46.879 |
| 44440.453310185185 | 47.594 |
| 44440.494976851856 | 48.54 |
| 44440.53664351852 | 48.868 |
| 44440.578310185185 | 49.254 |
| 44440.619976851856 | 49.891 |
| 44440.66164351852 | 50.335 |
| 44440.703310185185 | 50.374 |
| 44440.744976851856 | 50.547 |
| 44440.78664351852 | 50.644 |
| 44440.828310185185 | 50.567 |
| 44440.869976851856 | 50.431 |
| 44440.91164351852 | 50.277 |
| 44440.953310185185 | 49.93 |
| 44440.994976851856 | 49.582 |
| 44441.03664351852 | 49.215 |
| 44441.078310185185 | 48.791 |
| 44441.119976851856 | 48.346 |
| 44441.16164351852 | 47.941 |
| 44441.203310185185 | 47.594 |
| 44441.244976851856 | 47.323 |
| 44441.28664351852 | 47.053 |
| 44441.328310185185 | 46.899 |
| 44441.369976851856 | 47.053 |
| 44441.41164351852 | 47.304 |
| 44441.453310185185 | 48.366 |
| 44441.494976851856 | 49.292 |
| 44441.53664351852 | 49.775 |
| 44441.578310185185 | 51.088 |
| 44441.619976851856 | 52.323 |
| 44441.66164351852 | 52.767 |
| 44441.703310185185 | 53.347 |
| 44441.744976851856 | 53.675 |
| 44441.78664351852 | 53.617 |
| 44441.828310185185 | 53.211 |
| 44441.869976851856 | 52.941 |
| 44441.91164351852 | 52.845 |
| 44441.953310185185 | 52.439 |
| 44441.994976851856 | 51.764 |
| 44442.03664351852 | 50.875 |
| 44442.078310185185 | 50.103 |
| 44442.119976851856 | 49.466 |
| 44442.16164351852 | 48.733 |
| 44442.203310185185 | 48.192 |
| 44442.244976851856 | 47.671 |
| 44442.28664351852 | 47.207 |
| 44442.328310185185 | 46.995 |
| 44442.369976851856 | 47.072 |
| 44442.41164351852 | 47.999 |
| 44442.453310185185 | 49.254 |
| 44442.494976851856 | 49.099 |
| 44442.53664351852 | 49.08 |
| 44442.578310185185 | 50.837 |
| 44442.619976851856 | 51.3 |
| 44442.66164351852 | 52.304 |
| 44442.703310185185 | 53.443 |
| 44442.744976851856 | 53.655 |
| 44442.78664351852 | 53.269 |
| 44442.828310185185 | 52.999 |
| 44442.869976851856 | 52.787 |
| 44442.91164351852 | 52.208 |
| 44442.953310185185 | 51.551 |
| 44442.994976851856 | 50.895 |
| 44443.03664351852 | 50.065 |
| 44443.078310185185 | 49.138 |
| 44443.119976851856 | 48.153 |
| 44443.16164351852 | 47.343 |
| 44443.203310185185 | 46.57 |
| 44443.244976851856 | 45.875 |
| 44443.28664351852 | 45.335 |
| 44443.328310185185 | 44.91 |
| 44443.369976851856 | 44.949 |
| 44443.41164351852 | 45.567 |
| 44443.453310185185 | 46.937 |
| 44443.494976851856 | 47.478 |
| 44443.53664351852 | 49.814 |
| 44443.578310185185 | 51.551 |
| 44443.619976851856 | 52.729 |
| 44443.66164351852 | 53.597 |
| 44443.703310185185 | 53.868 |
| 44443.744976851856 | 54.331 |
| 44443.78664351852 | 53.945 |
| 44443.828310185185 | 53.791 |
| 44443.869976851856 | 53.655 |
| 44443.91164351852 | 53.366 |
| 44443.953310185185 | 52.69 |
| 44443.994976851856 | 51.435 |
| 44444.03664351852 | 50.335 |
| 44444.078310185185 | 49.37 |
| 44444.119976851856 | 48.327 |
| 44444.16164351852 | 47.207 |
| 44444.203310185185 | 46.088 |
| 44444.244976851856 | 45.045 |
| 44444.28664351852 | 44.08 |
| 44444.328310185185 | 43.424 |
| 44444.369976851856 | 43.289 |
| 44444.41164351852 | 43.829 |
| 44444.453310185185 | 45.219 |
| 44444.494976851856 | 46.821 |
| 44444.53664351852 | 48.559 |
| 44444.578310185185 | 50.547 |
| 44444.619976851856 | 52.401 |
| 44444.66164351852 | 53.906 |
| 44444.703310185185 | 54.794 |
| 44444.744976851856 | 55.007 |
| 44444.78664351852 | 54.891 |
| 44444.828310185185 | 54.621 |
| 44444.869976851856 | 54.215 |
| 44444.91164351852 | 53.597 |
| 44444.953310185185 | 52.652 |
| 44444.994976851856 | 51.551 |
| 44445.03664351852 | 50.431 |
| 44445.078310185185 | 49.273 |
| 44445.119976851856 | 48.096 |
| 44445.16164351852 | 46.86 |
| 44445.203310185185 | 45.721 |
| 44445.244976851856 | 44.736 |
| 44445.28664351852 | 43.868 |
| 44445.328310185185 | 43.173 |
| 44445.369976851856 | 43.192 |
| 44445.41164351852 | 43.733 |
| 44445.453310185185 | 44.987 |
| 44445.494976851856 | 46.667 |
| 44445.53664351852 | 48.617 |
| 44445.578310185185 | 50.605 |
| 44445.619976851856 | 52.478 |
| 44445.66164351852 | 53.81 |
| 44445.703310185185 | 54.737 |
| 44445.744976851856 | 55.026 |
| 44445.78664351852 | 54.872 |
| 44445.828310185185 | 54.582 |
| 44445.869976851856 | 54.215 |
| 44445.91164351852 | 53.501 |
| 44445.953310185185 | 52.632 |
| 44445.994976851856 | 51.532 |
| 44446.03664351852 | 50.451 |
| 44446.078310185185 | 49.273 |
| 44446.119976851856 | 48.115 |
| 44446.16164351852 | 46.879 |
| 44446.203310185185 | 45.74 |
| 44446.244976851856 | 44.679 |
| 44446.28664351852 | 43.829 |
| 44446.328310185185 | 43.153 |
| 44446.369976851856 | 43.134 |
| 44446.41164351852 | 43.655 |
| 44446.453310185185 | 45.026 |
| 44446.494976851856 | 46.706 |
| 44446.53664351852 | 48.462 |
| 44446.578310185185 | 50.412 |
| 44446.619976851856 | 52.304 |
| 44446.66164351852 | 53.752 |
| 44446.703310185185 | 54.563 |
| 44446.744976851856 | 54.91 |
| 44446.78664351852 | 54.91 |
| 44446.828310185185 | 54.737 |
| 44446.869976851856 | 54.389 |
| 44446.91164351852 | 53.81 |
| 44446.953310185185 | 52.96 |
| 44446.994976851856 | 51.976 |
| 44447.03664351852 | 50.818 |
| 44447.078310185185 | 49.775 |
| 44447.119976851856 | 48.578 |
| 44447.16164351852 | 47.381 |
| 44447.203310185185 | 46.262 |
| 44447.244976851856 | 45.238 |
| 44447.28664351852 | 44.254 |
| 44447.328310185185 | 43.713 |
| 44447.369976851856 | 43.636 |
| 44447.41164351852 | 44.215 |
| 44447.453310185185 | 45.431 |
| 44447.494976851856 | 47.265 |
| 44447.53664351852 | 49.061 |
| 44447.578310185185 | 51.011 |
| 44447.619976851856 | 52.922 |
| 44447.66164351852 | 54.35 |
| 44447.703310185185 | 55.296 |
| 44447.744976851856 | 55.547 |
| 44447.78664351852 | 55.509 |
| 44447.828310185185 | 55.219 |
| 44447.869976851856 | 54.852 |
| 44447.91164351852 | 54.312 |
| 44447.953310185185 | 53.385 |
| 44447.994976851856 | 52.343 |
| 44448.03664351852 | 51.146 |
| 44448.078310185185 | 49.891 |
| 44448.119976851856 | 48.655 |
| 44448.16164351852 | 47.362 |
| 44448.203310185185 | 46.165 |
| 44448.244976851856 | 45.065 |
| 44448.28664351852 | 44.099 |
| 44448.328310185185 | 43.346 |
| 44448.369976851856 | 43.327 |
| 44448.41164351852 | 43.829 |
| 44448.453310185185 | 45.18 |
| 44448.494976851856 | 46.899 |
| 44448.53664351852 | 48.694 |
| 44448.578310185185 | 50.663 |
| 44448.619976851856 | 52.613 |
| 44448.66164351852 | 54.061 |
| 44448.703310185185 | 55.065 |
| 44448.744976851856 | 55.451 |
| 44448.78664351852 | 55.451 |
| 44448.828310185185 | 55.219 |
| 44448.869976851856 | 54.872 |
| 44448.91164351852 | 54.273 |
| 44448.953310185185 | 53.501 |
| 44448.994976851856 | 52.497 |
| 44449.03664351852 | 51.339 |
| 44449.078310185185 | 50.123 |
| 44449.119976851856 | 48.887 |
| 44449.16164351852 | 47.748 |
| 44449.203310185185 | 46.609 |
| 44449.244976851856 | 45.586 |
| 44449.28664351852 | 44.814 |
| 44449.328310185185 | 44.234 |
| 44449.369976851856 | 43.984 |
| 44449.41164351852 | 44.582 |
| 44449.453310185185 | 45.953 |
| 44449.494976851856 | 47.729 |
| 44449.53664351852 | 49.389 |
| 44449.578310185185 | 51.204 |
| 44449.619976851856 | 52.999 |
| 44449.66164351852 | 54.408 |
| 44449.703310185185 | 55.277 |
| 44449.744976851856 | 55.605 |
| 44449.78664351852 | 55.586 |
| 44449.828310185185 | 55.296 |
| 44449.869976851856 | 54.987 |
| 44449.91164351852 | 54.447 |
| 44449.953310185185 | 53.675 |
| 44449.994976851856 | 52.729 |
| 44450.03664351852 | 51.609 |
| 44450.078310185185 | 50.451 |
| 44450.119976851856 | 49.235 |
| 44450.16164351852 | 48.057 |
| 44450.203310185185 | 46.918 |
| 44450.244976851856 | 45.953 |
| 44450.28664351852 | 45.084 |
| 44450.328310185185 | 44.524 |
| 44450.369976851856 | 44.505 |
| 44450.41164351852 | 44.891 |
| 44450.453310185185 | 45.953 |
| 44450.494976851856 | 47.15 |
| 44450.53664351852 | 48.018 |
| 44450.578310185185 | 48.848 |
| 44450.619976851856 | 50.856 |
| 44450.66164351852 | 53.076 |
| 44450.703310185185 | 54.466 |
| 44450.744976851856 | 55.354 |
| 44450.78664351852 | 55.219 |
| 44450.828310185185 | 55.065 |
| 44450.869976851856 | 54.814 |
| 44450.91164351852 | 54.486 |
| 44450.953310185185 | 53.752 |
| 44450.994976851856 | 52.767 |
| 44451.03664351852 | 51.609 |
| 44451.078310185185 | 50.47 |
| 44451.119976851856 | 49.582 |
| 44451.16164351852 | 48.733 |
| 44451.203310185185 | 47.922 |
| 44451.244976851856 | 47.246 |
| 44451.28664351852 | 46.493 |
| 44451.328310185185 | 45.933 |
| 44451.369976851856 | 45.721 |
| 44451.41164351852 | 46.011 |
| 44451.453310185185 | 46.976 |
| 44451.494976851856 | 48.713 |
| 44451.53664351852 | 50.509 |
| 44451.578310185185 | 51.455 |
| 44451.619976851856 | 52.169 |
| 44451.66164351852 | 52.999 |
| 44451.703310185185 | 53.829 |
| 44451.744976851856 | 54.042 |
| 44451.78664351852 | 54.196 |
| 44451.828310185185 | 54.408 |
| 44451.869976851856 | 54.061 |
| 44451.91164351852 | 53.54 |
| 44451.953310185185 | 52.806 |
| 44451.994976851856 | 52.15 |
| 44452.03664351852 | 51.397 |
| 44452.078310185185 | 50.451 |
| 44452.119976851856 | 49.466 |
| 44452.16164351852 | 48.404 |
| 44452.203310185185 | 47.401 |
| 44452.244976851856 | 46.513 |
| 44452.28664351852 | 45.721 |
| 44452.328310185185 | 45.238 |
| 44452.369976851856 | 45.084 |
| 44452.41164351852 | 45.412 |
| 44452.453310185185 | 46.474 |
| 44452.494976851856 | 47.883 |
| 44452.53664351852 | 49.119 |
| 44452.578310185185 | 51.242 |
| 44452.619976851856 | 52.652 |
| 44452.66164351852 | 53.636 |
| 44452.703310185185 | 53.945 |
| 44452.744976851856 | 54.331 |
| 44452.78664351852 | 54.601 |
| 44452.828310185185 | 54.408 |
| 44452.869976851856 | 54.215 |
| 44452.91164351852 | 53.926 |
| 44452.953310185185 | 53.25 |
| 44452.994976851856 | 52.381 |
| 44453.03664351852 | 51.416 |
| 44453.078310185185 | 50.335 |
| 44453.119976851856 | 49.177 |
| 44453.16164351852 | 47.98 |
| 44453.203310185185 | 47.014 |
| 44453.244976851856 | 46.107 |
| 44453.28664351852 | 45.393 |
| 44453.328310185185 | 44.891 |
| 44453.369976851856 | 44.601 |
| 44453.41164351852 | 45.026 |
| 44453.453310185185 | 46.242 |
| 44453.494976851856 | 47.748 |
| 44453.53664351852 | 48.25 |
| 44453.578310185185 | 48.945 |
| 44453.619976851856 | 50.586 |
| 44453.66164351852 | 51.262 |
| 44453.703310185185 | 52.111 |
| 44453.744976851856 | 52.265 |
| 44453.78664351852 | 52.304 |
| 44453.828310185185 | 51.918 |
| 44453.869976851856 | 51.57 |
| 44453.91164351852 | 51.088 |
| 44453.953310185185 | 50.354 |
| 44453.994976851856 | 49.312 |
| 44454.03664351852 | 48.327 |
| 44454.078310185185 | 47.343 |
| 44454.119976851856 | 46.513 |
| 44454.16164351852 | 45.547 |
| 44454.203310185185 | 44.736 |
| 44454.244976851856 | 43.945 |
| 44454.28664351852 | 43.173 |
| 44454.328310185185 | 42.555 |
| 44454.369976851856 | 42.555 |
| 44454.41164351852 | 43.211 |
| 44454.453310185185 | 44.64 |
| 44454.494976851856 | 46.377 |
| 44454.53664351852 | 48.076 |
| 44454.578310185185 | 49.93 |
| 44454.619976851856 | 51.783 |
| 44454.66164351852 | 53.134 |
| 44454.703310185185 | 53.926 |
| 44454.744976851856 | 54.235 |
| 44454.78664351852 | 54.235 |
| 44454.828310185185 | 54.003 |
| 44454.869976851856 | 53.597 |
| 44454.91164351852 | 52.999 |
| 44454.953310185185 | 52.092 |
| 44454.994976851856 | 51.03 |
| 44455.03664351852 | 49.872 |
| 44455.078310185185 | 48.713 |
| 44455.119976851856 | 47.555 |
| 44455.16164351852 | 46.358 |
| 44455.203310185185 | 45.2 |
| 44455.244976851856 | 44.138 |
| 44455.28664351852 | 43.25 |
| 44455.328310185185 | 42.555 |
| 44455.369976851856 | 42.4 |
| 44455.41164351852 | 43.018 |
| 44455.453310185185 | 44.466 |
| 44455.494976851856 | 46.377 |
| 44455.53664351852 | 47.343 |
| 44455.578310185185 | 49.022 |
| 44455.619976851856 | 50.084 |
| 44455.66164351852 | 51.474 |
| 44455.703310185185 | 52.903 |
| 44455.744976851856 | 53.153 |
| 44455.78664351852 | 53.385 |
| 44455.828310185185 | 53.25 |
| 44455.869976851856 | 53.018 |
| 44455.91164351852 | 52.69 |
| 44455.953310185185 | 51.995 |
| 44455.994976851856 | 51.107 |
| 44456.03664351852 | 50.084 |
| 44456.078310185185 | 48.906 |
| 44456.119976851856 | 47.709 |
| 44456.16164351852 | 46.493 |
| 44456.203310185185 | 45.335 |
| 44456.244976851856 | 44.447 |
| 44456.28664351852 | 43.578 |
| 44456.328310185185 | 42.96 |
| 44456.369976851856 | 42.883 |
| 44456.41164351852 | 43.482 |
| 44456.453310185185 | 44.91 |
| 44456.494976851856 | 45.547 |
| 44456.53664351852 | 46.474 |
| 44456.578310185185 | 48.443 |
| 44456.619976851856 | 50.296 |
| 44456.66164351852 | 51.667 |
| 44456.703310185185 | 53.057 |
| 44456.744976851856 | 53.771 |
| 44456.78664351852 | 53.906 |
| 44456.828310185185 | 53.675 |
| 44456.869976851856 | 53.018 |
| 44456.91164351852 | 52.343 |
| 44456.953310185185 | 51.455 |
| 44456.994976851856 | 50.586 |
| 44457.03664351852 | 49.563 |
| 44457.078310185185 | 48.462 |
| 44457.119976851856 | 47.265 |
| 44457.16164351852 | 46.126 |
| 44457.203310185185 | 44.949 |
| 44457.244976851856 | 43.964 |
| 44457.28664351852 | 43.095 |
| 44457.328310185185 | 42.458 |
| 44457.369976851856 | 42.362 |
| 44457.41164351852 | 42.883 |
| 44457.453310185185 | 44.331 |
| 44457.494976851856 | 46.088 |
| 44457.53664351852 | 47.729 |
| 44457.578310185185 | 49.621 |
| 44457.619976851856 | 50.933 |
| 44457.66164351852 | 52.555 |
| 44457.703310185185 | 53.076 |
| 44457.744976851856 | 53.733 |
| 44457.78664351852 | 54.022 |
| 44457.828310185185 | 53.906 |
| 44457.869976851856 | 53.578 |
| 44457.91164351852 | 52.941 |
| 44457.953310185185 | 52.169 |
| 44457.994976851856 | 51.513 |
| 44458.03664351852 | 50.914 |
| 44458.078310185185 | 50.123 |
| 44458.119976851856 | 49.254 |
| 44458.16164351852 | 48.482 |
| 44458.203310185185 | 47.613 |
| 44458.244976851856 | 46.841 |
| 44458.28664351852 | 46.146 |
| 44458.328310185185 | 45.47 |
| 44458.369976851856 | 45.393 |
| 44458.41164351852 | 46.204 |
| 44458.453310185185 | 47.845 |
| 44458.494976851856 | 48.868 |
| 44458.53664351852 | 48.848 |
| 44458.578310185185 | 50.567 |
| 44458.619976851856 | 50.644 |
| 44458.66164351852 | 50.026 |
| 44458.703310185185 | 50.933 |
| 44458.744976851856 | 51.358 |
| 44458.78664351852 | 51.474 |
| 44458.828310185185 | 51.551 |
| 44458.869976851856 | 51.686 |
| 44458.91164351852 | 51.474 |
| 44458.953310185185 | 50.972 |
| 44458.994976851856 | 50.451 |
| 44459.03664351852 | 49.833 |
| 44459.078310185185 | 48.81 |
| 44459.119976851856 | 47.806 |
| 44459.16164351852 | 46.744 |
| 44459.203310185185 | 45.663 |
| 44459.244976851856 | 44.891 |
| 44459.28664351852 | 44.215 |
| 44459.328310185185 | 43.752 |
| 44459.369976851856 | 43.578 |
| 44459.41164351852 | 43.926 |
| 44459.453310185185 | 44.621 |
| 44459.494976851856 | 46.262 |
| 44459.53664351852 | 47.632 |
| 44459.578310185185 | 48.675 |
| 44459.619976851856 | 50.007 |
| 44459.66164351852 | 50.914 |
| 44459.703310185185 | 51.262 |
| 44459.744976851856 | 51.204 |
| 44459.78664351852 | 50.76 |
| 44459.828310185185 | 50.335 |
| 44459.869976851856 | 50.045 |
| 44459.91164351852 | 49.331 |
| 44459.953310185185 | 48.192 |
| 44459.994976851856 | 47.092 |
| 44460.03664351852 | 46.416 |
| 44460.078310185185 | 45.74 |
| 44460.119976851856 | 44.987 |
| 44460.16164351852 | 44.157 |
| 44460.203310185185 | 43.385 |
| 44460.244976851856 | 42.536 |
| 44460.28664351852 | 41.744 |
| 44460.328310185185 | 41.088 |
| 44460.369976851856 | 40.991 |
| 44460.41164351852 | 41.551 |
| 44460.453310185185 | 42.864 |
| 44460.494976851856 | 44.35 |
| 44460.53664351852 | 45.74 |
| 44460.578310185185 | 47.188 |
| 44460.619976851856 | 48.694 |
| 44460.66164351852 | 49.814 |
| 44460.703310185185 | 50.431 |
| 44460.744976851856 | 50.431 |
| 44460.78664351852 | 50.316 |
| 44460.828310185185 | 50.18 |
| 44460.869976851856 | 49.891 |
| 44460.91164351852 | 49.254 |
| 44460.953310185185 | 48.366 |
| 44460.994976851856 | 47.323 |
| 44461.03664351852 | 46.262 |
| 44461.078310185185 | 45.18 |
| 44461.119976851856 | 44.041 |
| 44461.16164351852 | 42.96 |
| 44461.203310185185 | 41.956 |
| 44461.244976851856 | 41.068 |
| 44461.28664351852 | 40.277 |
| 44461.328310185185 | 39.659 |
| 44461.369976851856 | 39.601 |
| 44461.41164351852 | 40.238 |
| 44461.453310185185 | 41.706 |
| 44461.494976851856 | 43.404 |
| 44461.53664351852 | 45.007 |
| 44461.578310185185 | 46.783 |
| 44461.619976851856 | 48.52 |
| 44461.66164351852 | 49.949 |
| 44461.703310185185 | 50.798 |
| 44461.744976851856 | 51.107 |
| 44461.78664351852 | 51.088 |
| 44461.828310185185 | 50.991 |
| 44461.869976851856 | 50.779 |
| 44461.91164351852 | 50.219 |
| 44461.953310185185 | 49.389 |
| 44461.994976851856 | 48.366 |
| 44462.03664351852 | 47.362 |
| 44462.078310185185 | 46.281 |
| 44462.119976851856 | 45.084 |
| 44462.16164351852 | 43.984 |
| 44462.203310185185 | 42.845 |
| 44462.244976851856 | 41.86 |
| 44462.28664351852 | 40.991 |
| 44462.328310185185 | 40.354 |
| 44462.369976851856 | 40.142 |
| 44462.41164351852 | 40.547 |
| 44462.453310185185 | 41.821 |
| 44462.494976851856 | 43.54 |
| 44462.53664351852 | 45.084 |
| 44462.578310185185 | 46.802 |
| 44462.619976851856 | 48.346 |
| 44462.66164351852 | 49.215 |
| 44462.703310185185 | 49.949 |
| 44462.744976851856 | 50.625 |
| 44462.78664351852 | 50.586 |
| 44462.828310185185 | 50.509 |
| 44462.869976851856 | 50.451 |
| 44462.91164351852 | 49.891 |
| 44462.953310185185 | 49.331 |
| 44462.994976851856 | 48.617 |
| 44463.03664351852 | 47.902 |
| 44463.078310185185 | 47.207 |
| 44463.119976851856 | 46.3 |
| 44463.16164351852 | 45.258 |
| 44463.203310185185 | 44.389 |
| 44463.244976851856 | 43.675 |
| 44463.28664351852 | 42.941 |
| 44463.328310185185 | 42.362 |
| 44463.369976851856 | 42.285 |
| 44463.41164351852 | 42.748 |
| 44463.453310185185 | 44.061 |
| 44463.494976851856 | 45.586 |
| 44463.53664351852 | 46.899 |
| 44463.578310185185 | 48.404 |
| 44463.619976851856 | 49.93 |
| 44463.66164351852 | 51.088 |
| 44463.703310185185 | 51.725 |
| 44463.744976851856 | 51.879 |
| 44463.78664351852 | 51.821 |
| 44463.828310185185 | 51.609 |
| 44463.869976851856 | 51.204 |
| 44463.91164351852 | 50.663 |
| 44463.953310185185 | 49.794 |
| 44463.994976851856 | 48.81 |
| 44464.03664351852 | 47.864 |
| 44464.078310185185 | 46.86 |
| 44464.119976851856 | 45.779 |
| 44464.16164351852 | 44.775 |
| 44464.203310185185 | 43.829 |
| 44464.244976851856 | 42.825 |
| 44464.28664351852 | 42.072 |
| 44464.328310185185 | 41.435 |
| 44464.369976851856 | 41.339 |
| 44464.41164351852 | 41.918 |
| 44464.453310185185 | 43.173 |
| 44464.494976851856 | 44.775 |
| 44464.53664351852 | 46.281 |
| 44464.578310185185 | 47.98 |
| 44464.619976851856 | 49.543 |
| 44464.66164351852 | 50.856 |
| 44464.703310185185 | 51.667 |
| 44464.744976851856 | 51.879 |
| 44464.78664351852 | 51.879 |
| 44464.828310185185 | 51.783 |
| 44464.869976851856 | 51.513 |
| 44464.91164351852 | 50.914 |
| 44464.953310185185 | 50.123 |
| 44464.994976851856 | 49.235 |
| 44465.03664351852 | 48.231 |
| 44465.078310185185 | 47.227 |
| 44465.119976851856 | 46.146 |
| 44465.16164351852 | 45.007 |
| 44465.203310185185 | 44.061 |
| 44465.244976851856 | 43.076 |
| 44465.28664351852 | 42.265 |
| 44465.328310185185 | 41.648 |
| 44465.369976851856 | 41.57 |
| 44465.41164351852 | 42.111 |
| 44465.453310185185 | 43.52 |
| 44465.494976851856 | 45.065 |
| 44465.53664351852 | 46.358 |
| 44465.578310185185 | 48.018 |
| 44465.619976851856 | 49.64 |
| 44465.66164351852 | 50.818 |
| 44465.703310185185 | 51.57 |
| 44465.744976851856 | 51.879 |
| 44465.78664351852 | 51.957 |
| 44465.828310185185 | 51.879 |
| 44465.869976851856 | 51.667 |
| 44465.91164351852 | 51.146 |
| 44465.953310185185 | 50.412 |
| 44465.994976851856 | 49.505 |
| 44466.03664351852 | 48.578 |
| 44466.078310185185 | 47.594 |
| 44466.119976851856 | 46.59 |
| 44466.16164351852 | 45.605 |
| 44466.203310185185 | 44.601 |
| 44466.244976851856 | 43.752 |
| 44466.28664351852 | 42.941 |
| 44466.328310185185 | 42.343 |
| 44466.369976851856 | 42.188 |
| 44466.41164351852 | 42.632 |
| 44466.453310185185 | 43.945 |
| 44466.494976851856 | 45.451 |
| 44466.53664351852 | 45.933 |
| 44466.578310185185 | 45.972 |
| 44466.619976851856 | 47.111 |
| 44466.66164351852 | 48.482 |
| 44466.703310185185 | 49.003 |
| 44466.744976851856 | 49.408 |
| 44466.78664351852 | 49.408 |
| 44466.828310185185 | 49.099 |
| 44466.869976851856 | 48.81 |
| 44466.91164351852 | 48.501 |
| 44466.953310185185 | 48.308 |
| 44466.994976851856 | 48.057 |
| 44467.03664351852 | 47.555 |
| 44467.078310185185 | 46.879 |
| 44467.119976851856 | 46.126 |
| 44467.16164351852 | 45.451 |
| 44467.203310185185 | 44.891 |
| 44467.244976851856 | 44.254 |
| 44467.28664351852 | 43.733 |
| 44467.328310185185 | 43.211 |
| 44467.369976851856 | 43.289 |
| 44467.41164351852 | 44.273 |
| 44467.453310185185 | 44.505 |
| 44467.494976851856 | 45.702 |
| 44467.53664351852 | 46.513 |
| 44467.578310185185 | 46.397 |
| 44467.619976851856 | 46.648 |
| 44467.66164351852 | 47.613 |
| 44467.703310185185 | 48.038 |
| 44467.744976851856 | 48.038 |
| 44467.78664351852 | 47.96 |
| 44467.828310185185 | 47.883 |
| 44467.869976851856 | 47.748 |
| 44467.91164351852 | 47.671 |
| 44467.953310185185 | 47.536 |
| 44467.994976851856 | 47.207 |
| 44468.03664351852 | 46.841 |
| 44468.078310185185 | 46.358 |
| 44468.119976851856 | 45.953 |
| 44468.16164351852 | 45.567 |
| 44468.203310185185 | 45.296 |
| 44468.244976851856 | 45.065 |
| 44468.28664351852 | 44.872 |
| 44468.328310185185 | 44.717 |
| 44468.369976851856 | 44.736 |
| 44468.41164351852 | 45.605 |
| 44468.453310185185 | 46.107 |
| 44468.494976851856 | 45.953 |
| 44468.53664351852 | 45.933 |
| 44468.578310185185 | 47.014 |
| 44468.619976851856 | 48.173 |
| 44468.66164351852 | 48.289 |
| 44468.703310185185 | 48.269 |
| 44468.744976851856 | 48.25 |
| 44468.78664351852 | 48.346 |
| 44468.828310185185 | 48.134 |
| 44468.869976851856 | 47.864 |
| 44468.91164351852 | 47.787 |
| 44468.953310185185 | 47.536 |
| 44468.994976851856 | 47.15 |
| 44469.03664351852 | 46.783 |
| 44469.078310185185 | 46.416 |
| 44469.119976851856 | 46.068 |
| 44469.16164351852 | 45.702 |
| 44469.203310185185 | 45.354 |
| 44469.244976851856 | 45.026 |
| 44469.28664351852 | 44.659 |
| 44469.328310185185 | 44.485 |
| 44469.369976851856 | 44.466 |
| 44469.41164351852 | 44.929 |
| 44469.453310185185 | 45.721 |
| 44469.494976851856 | 47.207 |
| 44469.53664351852 | 48.617 |
| 44469.578310185185 | 49.215 |
| 44469.619976851856 | 50.354 |
| 44469.66164351852 | 51.184 |
| 44469.703310185185 | 51.57 |
| 44469.744976851856 | 51.358 |
| 44469.78664351852 | 51.223 |
| 44469.828310185185 | 50.933 |
| 44469.869976851856 | 50.663 |
| 44469.91164351852 | 50.123 |
| 44469.953310185185 | 49.292 |
| 44469.994976851856 | 48.597 |
| 44470.03664351852 | 48.038 |
| 44470.078310185185 | 47.381 |
| 44470.119976851856 | 46.609 |
| 44470.16164351852 | 45.798 |
| 44470.203310185185 | 44.987 |
| 44470.244976851856 | 44.254 |
| 44470.28664351852 | 43.713 |
| 44470.328310185185 | 43.269 |
| 44470.369976851856 | 43.076 |
| 44470.41164351852 | 43.289 |
| 44470.453310185185 | 44.041 |
| 44470.494976851856 | 45.103 |
| 44470.53664351852 | 45.489 |
| 44470.578310185185 | 45.953 |
| 44470.619976851856 | 46.435 |
| 44470.66164351852 | 46.532 |
| 44470.703310185185 | 46.59 |
| 44470.744976851856 | 46.763 |
| 44470.78664351852 | 46.763 |
| 44470.828310185185 | 46.648 |
| 44470.869976851856 | 46.474 |
| 44470.91164351852 | 46.339 |
| 44470.953310185185 | 46.262 |
| 44470.994976851856 | 46.165 |
| 44471.03664351852 | 45.914 |
| 44471.078310185185 | 45.393 |
| 44471.119976851856 | 44.717 |
| 44471.16164351852 | 44.119 |
| 44471.203310185185 | 43.482 |
| 44471.244976851856 | 42.941 |
| 44471.28664351852 | 42.555 |
| 44471.328310185185 | 42.053 |
| 44471.369976851856 | 41.841 |
| 44471.41164351852 | 42.323 |
| 44471.453310185185 | 43.617 |
| 44471.494976851856 | 45.258 |
| 44471.53664351852 | 46.59 |
| 44471.578310185185 | 47.767 |
| 44471.619976851856 | 49.003 |
| 44471.66164351852 | 49.814 |
| 44471.703310185185 | 50.451 |
| 44471.744976851856 | 50.605 |
| 44471.78664351852 | 50.431 |
| 44471.828310185185 | 50.084 |
| 44471.869976851856 | 49.736 |
| 44471.91164351852 | 49.119 |
| 44471.953310185185 | 48.327 |
| 44471.994976851856 | 47.516 |
| 44472.03664351852 | 46.513 |
| 44472.078310185185 | 45.528 |
| 44472.119976851856 | 44.679 |
| 44472.16164351852 | 43.733 |
| 44472.203310185185 | 42.883 |
| 44472.244976851856 | 42.034 |
| 44472.28664351852 | 41.358 |
| 44472.328310185185 | 40.779 |
| 44472.369976851856 | 40.74 |
| 44472.41164351852 | 41.204 |
| 44472.453310185185 | 42.555 |
| 44472.494976851856 | 44.099 |
| 44472.53664351852 | 45.393 |
| 44472.578310185185 | 46.686 |
| 44472.619976851856 | 48.038 |
| 44472.66164351852 | 49.138 |
| 44472.703310185185 | 49.679 |
| 44472.744976851856 | 49.872 |
| 44472.78664351852 | 49.93 |
| 44472.828310185185 | 49.814 |
| 44472.869976851856 | 49.524 |
| 44472.91164351852 | 49.08 |
| 44472.953310185185 | 48.366 |
| 44472.994976851856 | 47.516 |
| 44473.03664351852 | 46.648 |
| 44473.078310185185 | 45.798 |
| 44473.119976851856 | 44.968 |
| 44473.16164351852 | 44.022 |
| 44473.203310185185 | 43.134 |
| 44473.244976851856 | 42.265 |
| 44473.28664351852 | 41.474 |
| 44473.328310185185 | 40.837 |
| 44473.369976851856 | 40.682 |
| 44473.41164351852 | 41.088 |
| 44473.453310185185 | 42.439 |
| 44473.494976851856 | 44.119 |
| 44473.53664351852 | 45.47 |
| 44473.578310185185 | 46.783 |
| 44473.619976851856 | 48.076 |
| 44473.66164351852 | 49.254 |
| 44473.703310185185 | 49.987 |
| 44473.744976851856 | 50.296 |
| 44473.78664351852 | 50.393 |
| 44473.828310185185 | 50.316 |
| 44473.869976851856 | 50.084 |
| 44473.91164351852 | 49.485 |
| 44473.953310185185 | 48.81 |
| 44473.994976851856 | 47.922 |
| 44474.03664351852 | 47.072 |
| 44474.078310185185 | 46.242 |
| 44474.119976851856 | 45.296 |
| 44474.16164351852 | 44.292 |
| 44474.203310185185 | 43.366 |
| 44474.244976851856 | 42.536 |
| 44474.28664351852 | 41.995 |
| 44474.328310185185 | 41.532 |
| 44474.369976851856 | 41.377 |
| 44474.41164351852 | 41.821 |
| 44474.453310185185 | 43.115 |
| 44474.494976851856 | 44.736 |
| 44474.53664351852 | 45.991 |
| 44474.578310185185 | 47.381 |
| 44474.619976851856 | 48.771 |
| 44474.66164351852 | 49.949 |
| 44474.703310185185 | 50.431 |
| 44474.744976851856 | 50.625 |
| 44474.78664351852 | 50.76 |
| 44474.828310185185 | 50.509 |
| 44474.869976851856 | 50.045 |
| 44474.91164351852 | 49.679 |
| 44474.953310185185 | 49.138 |
| 44474.994976851856 | 48.462 |
| 44475.03664351852 | 47.709 |
| 44475.078310185185 | 46.976 |
| 44475.119976851856 | 46.165 |
| 44475.16164351852 | 45.354 |
| 44475.203310185185 | 44.485 |
| 44475.244976851856 | 43.713 |
| 44475.28664351852 | 43.057 |
| 44475.328310185185 | 42.671 |
| 44475.369976851856 | 42.555 |
| 44475.41164351852 | 42.98 |
| 44475.453310185185 | 43.578 |
| 44475.494976851856 | 44.756 |
| 44475.53664351852 | 45.682 |
| 44475.578310185185 | 46.165 |
| 44475.619976851856 | 46.879 |
| 44475.66164351852 | 47.864 |
| 44475.703310185185 | 48.269 |
| 44475.744976851856 | 48.076 |
| 44475.78664351852 | 47.941 |
| 44475.828310185185 | 47.729 |
| 44475.869976851856 | 47.42 |
| 44475.91164351852 | 46.918 |
| 44475.953310185185 | 46.435 |
| 44475.994976851856 | 45.895 |
| 44476.03664351852 | 45.123 |
| 44476.078310185185 | 44.389 |
| 44476.119976851856 | 43.655 |
| 44476.16164351852 | 42.902 |
| 44476.203310185185 | 42.169 |
| 44476.244976851856 | 41.435 |
| 44476.28664351852 | 40.76 |
| 44476.328310185185 | 40.219 |
| 44476.369976851856 | 40.142 |
| 44476.41164351852 | 40.586 |
| 44476.453310185185 | 41.841 |
| 44476.494976851856 | 43.346 |
| 44476.53664351852 | 44.505 |
| 44476.578310185185 | 45.914 |
| 44476.619976851856 | 47.362 |
| 44476.66164351852 | 48.308 |
| 44476.703310185185 | 49.061 |
| 44476.744976851856 | 49.621 |
| 44476.78664351852 | 49.872 |
| 44476.828310185185 | 50.045 |
| 44476.869976851856 | 49.949 |
| 44476.91164351852 | 49.543 |
| 44476.953310185185 | 49.099 |
| 44476.994976851856 | 48.54 |
| 44477.03664351852 | 47.845 |
| 44477.078310185185 | 46.937 |
| 44477.119976851856 | 45.837 |
| 44477.16164351852 | 44.736 |
| 44477.203310185185 | 43.829 |
| 44477.244976851856 | 42.999 |
| 44477.28664351852 | 42.265 |
| 44477.328310185185 | 41.628 |
| 44477.369976851856 | 41.377 |
| 44477.41164351852 | 41.841 |
| 44477.453310185185 | 42.806 |
| 44477.494976851856 | 43.887 |
| 44477.53664351852 | 43.829 |
| 44477.578310185185 | 44.736 |
| 44477.619976851856 | 45.586 |
| 44477.66164351852 | 46.204 |
| 44477.703310185185 | 46.262 |
| 44477.744976851856 | 46.474 |
| 44477.78664351852 | 46.648 |
| 44477.828310185185 | 46.513 |
| 44477.869976851856 | 46.339 |
| 44477.91164351852 | 46.184 |
| 44477.953310185185 | 46.165 |
| 44477.994976851856 | 45.953 |
| 44478.03664351852 | 45.567 |
| 44478.078310185185 | 45.277 |
| 44478.119976851856 | 44.949 |
| 44478.16164351852 | 44.64 |
| 44478.203310185185 | 44.35 |
| 44478.244976851856 | 44.099 |
| 44478.28664351852 | 43.848 |
| 44478.328310185185 | 43.578 |
| 44478.369976851856 | 43.424 |
| 44478.41164351852 | 43.404 |
| 44478.453310185185 | 43.308 |
| 44478.494976851856 | 43.829 |
| 44478.53664351852 | 43.964 |
| 44478.578310185185 | 45.238 |
| 44478.619976851856 | 45.682 |
| 44478.66164351852 | 45.644 |
| 44478.703310185185 | 45.605 |
| 44478.744976851856 | 45.586 |
| 44478.78664351852 | 45.624 |
| 44478.828310185185 | 45.489 |
| 44478.869976851856 | 45.335 |
| 44478.91164351852 | 45.084 |
| 44478.953310185185 | 44.698 |
| 44478.994976851856 | 44.157 |
| 44479.03664351852 | 43.443 |
| 44479.078310185185 | 42.787 |
| 44479.119976851856 | 42.169 |
| 44479.16164351852 | 41.609 |
| 44479.203310185185 | 41.107 |
| 44479.244976851856 | 40.682 |
| 44479.28664351852 | 40.431 |
| 44479.328310185185 | 40.238 |
| 44479.369976851856 | 40.18 |
| 44479.41164351852 | 40.393 |
| 44479.453310185185 | 41.03 |
| 44479.494976851856 | 42.053 |
| 44479.53664351852 | 42.613 |
| 44479.578310185185 | 43.289 |
| 44479.619976851856 | 43.868 |
| 44479.66164351852 | 44.389 |
| 44479.703310185185 | 44.756 |
| 44479.744976851856 | 44.872 |
| 44479.78664351852 | 44.891 |
| 44479.828310185185 | 44.794 |
| 44479.869976851856 | 44.621 |
| 44479.91164351852 | 44.215 |
| 44479.953310185185 | 43.713 |
| 44479.994976851856 | 43.153 |
| 44480.03664351852 | 42.516 |
| 44480.078310185185 | 41.879 |
| 44480.119976851856 | 41.204 |
| 44480.16164351852 | 40.605 |
| 44480.203310185185 | 39.968 |
| 44480.244976851856 | 39.37 |
| 44480.28664351852 | 38.79 |
| 44480.328310185185 | 38.443 |
| 44480.369976851856 | 38.385 |
| 44480.41164351852 | 38.829 |
| 44480.453310185185 | 40.026 |
| 44480.494976851856 | 41.416 |
| 44480.53664351852 | 42.516 |
| 44480.578310185185 | 43.501 |
| 44480.619976851856 | 45.103 |
| 44480.66164351852 | 46.03 |
| 44480.703310185185 | 46.686 |
| 44480.744976851856 | 46.995 |
| 44480.78664351852 | 47.207 |
| 44480.828310185185 | 47.188 |
| 44480.869976851856 | 46.821 |
| 44480.91164351852 | 46.223 |
| 44480.953310185185 | 45.586 |
| 44480.994976851856 | 44.968 |
| 44481.03664351852 | 44.292 |
| 44481.078310185185 | 43.482 |
| 44481.119976851856 | 42.613 |
| 44481.16164351852 | 41.918 |
| 44481.203310185185 | 41.416 |
| 44481.244976851856 | 40.895 |
| 44481.28664351852 | 40.354 |
| 44481.328310185185 | 40.007 |
| 44481.369976851856 | 39.968 |
| 44481.41164351852 | 40.277 |
| 44481.453310185185 | 41.049 |
| 44481.494976851856 | 41.319 |
| 44481.53664351852 | 41.493 |
| 44481.578310185185 | 42.381 |
| 44481.619976851856 | 42.265 |
| 44481.66164351852 | 42.362 |
| 44481.703310185185 | 42.439 |
| 44481.744976851856 | 42.053 |
| 44481.78664351852 | 41.802 |
| 44481.828310185185 | 41.493 |
| 44481.869976851856 | 41.358 |
| 44481.91164351852 | 41.126 |
| 44481.953310185185 | 40.837 |
| 44481.994976851856 | 40.451 |
| 44482.03664351852 | 40.122 |
| 44482.078310185185 | 39.543 |
| 44482.119976851856 | 39.177 |
| 44482.16164351852 | 38.848 |
| 44482.203310185185 | 38.366 |
| 44482.244976851856 | 38.25 |
| 44482.28664351852 | 37.98 |
| 44482.328310185185 | 37.767 |
| 44482.369976851856 | 37.806 |
| 44482.41164351852 | 38.038 |
| 44482.453310185185 | 38.79 |
| 44482.494976851856 | 39.891 |
| 44482.53664351852 | 40.76 |
| 44482.578310185185 | 41.358 |
| 44482.619976851856 | 41.706 |
| 44482.66164351852 | 41.59 |
| 44482.703310185185 | 41.956 |
| 44482.744976851856 | 42.034 |
| 44482.78664351852 | 42.053 |
| 44482.828310185185 | 42.13 |
| 44482.869976851856 | 42.053 |
| 44482.91164351852 | 41.706 |
| 44482.953310185185 | 41.107 |
| 44482.994976851856 | 40.682 |
| 44483.03664351852 | 40.2 |
| 44483.078310185185 | 39.582 |
| 44483.119976851856 | 39.003 |
| 44483.16164351852 | 38.578 |
| 44483.203310185185 | 38.115 |
| 44483.244976851856 | 37.787 |
| 44483.28664351852 | 37.574 |
| 44483.328310185185 | 37.246 |
| 44483.369976851856 | 37.207 |
| 44483.41164351852 | 37.439 |
| 44483.453310185185 | 38.134 |
| 44483.494976851856 | 38.115 |
| 44483.53664351852 | 37.96 |
| 44483.578310185185 | 38.539 |
| 44483.619976851856 | 39.485 |
| 44483.66164351852 | 39.756 |
| 44483.703310185185 | 39.582 |
| 44483.744976851856 | 39.698 |
| 44483.78664351852 | 39.698 |
| 44483.828310185185 | 39.601 |
| 44483.869976851856 | 39.447 |
| 44483.91164351852 | 38.675 |
| 44483.953310185185 | 38.038 |
| 44483.994976851856 | 37.671 |
| 44484.03664351852 | 37.304 |
| 44484.078310185185 | 37.053 |
| 44484.119976851856 | 36.763 |
| 44484.16164351852 | 36.435 |
| 44484.203310185185 | 36.184 |
| 44484.244976851856 | 35.837 |
| 44484.28664351852 | 35.663 |
| 44484.328310185185 | 35.489 |
| 44484.369976851856 | 35.431 |
| 44484.41164351852 | 35.605 |
| 44484.453310185185 | 36.512 |
| 44484.494976851856 | 37.651 |
| 44484.53664351852 | 38.829 |
| 44484.578310185185 | 39.64 |
| 44484.619976851856 | 40.663 |
| 44484.66164351852 | 41.59 |
| 44484.703310185185 | 42.092 |
| 44484.744976851856 | 42.227 |
| 44484.78664351852 | 42.227 |
| 44484.828310185185 | 42.014 |
| 44484.869976851856 | 41.551 |
| 44484.91164351852 | 40.895 |
| 44484.953310185185 | 40.161 |
| 44484.994976851856 | 39.254 |
| 44485.03664351852 | 38.482 |
| 44485.078310185185 | 37.767 |
| 44485.119976851856 | 36.995 |
| 44485.16164351852 | 36.319 |
| 44485.203310185185 | 35.74 |
| 44485.244976851856 | 35.315 |
| 44485.28664351852 | 35.007 |
| 44485.328310185185 | 34.698 |
| 44485.369976851856 | 34.775 |
| 44485.41164351852 | 35.296 |
| 44485.453310185185 | 36.551 |
| 44485.494976851856 | 37.999 |
| 44485.53664351852 | 39.215 |
| 44485.578310185185 | 40.663 |
| 44485.619976851856 | 42.304 |
| 44485.66164351852 | 43.597 |
| 44485.703310185185 | 44.447 |
| 44485.744976851856 | 44.833 |
| 44485.78664351852 | 45.026 |
| 44485.828310185185 | 44.833 |
| 44485.869976851856 | 44.389 |
| 44485.91164351852 | 43.675 |
| 44485.953310185185 | 42.941 |
| 44485.994976851856 | 42.111 |
| 44486.03664351852 | 41.281 |
| 44486.078310185185 | 40.393 |
| 44486.119976851856 | 39.563 |
| 44486.16164351852 | 38.81 |
| 44486.203310185185 | 38.153 |
| 44486.244976851856 | 37.594 |
| 44486.28664351852 | 37.169 |
| 44486.328310185185 | 36.802 |
| 44486.369976851856 | 36.744 |
| 44486.41164351852 | 37.227 |
| 44486.453310185185 | 38.385 |
| 44486.494976851856 | 39.717 |
| 44486.53664351852 | 40.914 |
| 44486.578310185185 | 42.323 |
| 44486.619976851856 | 43.81 |
| 44486.66164351852 | 45.142 |
| 44486.703310185185 | 45.953 |
| 44486.744976851856 | 46.223 |
| 44486.78664351852 | 46.339 |
| 44486.828310185185 | 46.068 |
| 44486.869976851856 | 45.624 |
| 44486.91164351852 | 44.872 |
| 44486.953310185185 | 44.119 |
| 44486.994976851856 | 43.366 |
| 44487.03664351852 | 42.516 |
| 44487.078310185185 | 41.667 |
| 44487.119976851856 | 40.74 |
| 44487.16164351852 | 39.91 |
| 44487.203310185185 | 39.312 |
| 44487.244976851856 | 38.848 |
| 44487.28664351852 | 38.404 |
| 44487.328310185185 | 38.095 |
| 44487.369976851856 | 38.038 |
| 44487.41164351852 | 38.675 |
| 44487.453310185185 | 39.698 |
| 44487.494976851856 | 40.856 |
| 44487.53664351852 | 41.706 |
| 44487.578310185185 | 42.748 |
| 44487.619976851856 | 44.138 |
| 44487.66164351852 | 45.547 |
| 44487.703310185185 | 46.416 |
| 44487.744976851856 | 46.976 |
| 44487.78664351852 | 47.207 |
| 44487.828310185185 | 46.918 |
| 44487.869976851856 | 46.455 |
| 44487.91164351852 | 45.856 |
| 44487.953310185185 | 45.045 |
| 44487.994976851856 | 44.138 |
| 44488.03664351852 | 43.25 |
| 44488.078310185185 | 42.227 |
| 44488.119976851856 | 41.3 |
| 44488.16164351852 | 40.47 |
| 44488.203310185185 | 39.852 |
| 44488.244976851856 | 39.485 |
| 44488.28664351852 | 39.312 |
| 44488.328310185185 | 39.138 |
| 44488.369976851856 | 39.041 |
| 44488.41164351852 | 39.312 |
| 44488.453310185185 | 39.987 |
| 44488.494976851856 | 39.872 |
| 44488.53664351852 | 40.238 |
| 44488.578310185185 | 41.416 |
| 44488.619976851856 | 43.057 |
| 44488.66164351852 | 43.694 |
| 44488.703310185185 | 44.234 |
| 44488.744976851856 | 44.833 |
| 44488.78664351852 | 44.64 |
| 44488.828310185185 | 43.868 |
| 44488.869976851856 | 43.095 |
| 44488.91164351852 | 42.671 |
| 44488.953310185185 | 42.265 |
| 44488.994976851856 | 41.763 |
| 44489.03664351852 | 41.126 |
| 44489.078310185185 | 40.258 |
| 44489.119976851856 | 39.35 |
| 44489.16164351852 | 38.636 |
| 44489.203310185185 | 37.941 |
| 44489.244976851856 | 37.4 |
| 44489.28664351852 | 36.995 |
| 44489.328310185185 | 36.609 |
| 44489.369976851856 | 36.493 |
| 44489.41164351852 | 36.918 |
| 44489.453310185185 | 37.96 |
| 44489.494976851856 | 39.099 |
| 44489.53664351852 | 40.103 |
| 44489.578310185185 | 41.3 |
| 44489.619976851856 | 42.594 |
| 44489.66164351852 | 43.81 |
| 44489.703310185185 | 44.524 |
| 44489.744976851856 | 44.736 |
| 44489.78664351852 | 44.698 |
| 44489.828310185185 | 44.466 |
| 44489.869976851856 | 43.926 |
| 44489.91164351852 | 43.269 |
| 44489.953310185185 | 42.458 |
| 44489.994976851856 | 41.59 |
| 44490.03664351852 | 40.663 |
| 44490.078310185185 | 39.736 |
| 44490.119976851856 | 38.81 |
| 44490.16164351852 | 38.018 |
| 44490.203310185185 | 37.439 |
| 44490.244976851856 | 36.918 |
| 44490.28664351852 | 36.493 |
| 44490.328310185185 | 36.165 |
| 44490.369976851856 | 36.146 |
| 44490.41164351852 | 36.648 |
| 44490.453310185185 | 37.787 |
| 44490.494976851856 | 38.829 |
| 44490.53664351852 | 39.949 |
| 44490.578310185185 | 41.146 |
| 44490.619976851856 | 42.439 |
| 44490.66164351852 | 43.424 |
| 44490.703310185185 | 44.254 |
| 44490.744976851856 | 44.601 |
| 44490.78664351852 | 44.852 |
| 44490.828310185185 | 44.775 |
| 44490.869976851856 | 44.273 |
| 44490.91164351852 | 43.54 |
| 44490.953310185185 | 42.632 |
| 44490.994976851856 | 41.821 |
| 44491.03664351852 | 40.991 |
| 44491.078310185185 | 40.258 |
| 44491.119976851856 | 39.428 |
| 44491.16164351852 | 38.675 |
| 44491.203310185185 | 38.038 |
| 44491.244976851856 | 37.536 |
| 44491.28664351852 | 37.092 |
| 44491.328310185185 | 36.744 |
| 44491.369976851856 | 36.725 |
| 44491.41164351852 | 37.188 |
| 44491.453310185185 | 38.288 |
| 44491.494976851856 | 39.466 |
| 44491.53664351852 | 40.605 |
| 44491.578310185185 | 42.053 |
| 44491.619976851856 | 43.346 |
| 44491.66164351852 | 44.524 |
| 44491.703310185185 | 45.528 |
| 44491.744976851856 | 45.663 |
| 44491.78664351852 | 45.933 |
| 44491.828310185185 | 45.953 |
| 44491.869976851856 | 45.682 |
| 44491.91164351852 | 44.987 |
| 44491.953310185185 | 44.138 |
| 44491.994976851856 | 43.289 |
| 44492.03664351852 | 42.439 |
| 44492.078310185185 | 41.551 |
| 44492.119976851856 | 40.644 |
| 44492.16164351852 | 39.775 |
| 44492.203310185185 | 39.003 |
| 44492.244976851856 | 38.52 |
| 44492.28664351852 | 38.115 |
| 44492.328310185185 | 37.729 |
| 44492.369976851856 | 37.594 |
| 44492.41164351852 | 37.96 |
| 44492.453310185185 | 38.52 |
| 44492.494976851856 | 39.08 |
| 44492.53664351852 | 39.833 |
| 44492.578310185185 | 41.435 |
| 44492.619976851856 | 42.864 |
| 44492.66164351852 | 43.52 |
| 44492.703310185185 | 44.157 |
| 44492.744976851856 | 44.621 |
| 44492.78664351852 | 44.659 |
| 44492.828310185185 | 44.447 |
| 44492.869976851856 | 44.08 |
| 44492.91164351852 | 43.733 |
| 44492.953310185185 | 43.289 |
| 44492.994976851856 | 42.825 |
| 44493.03664351852 | 42.362 |
| 44493.078310185185 | 41.918 |
| 44493.119976851856 | 41.416 |
| 44493.16164351852 | 41.011 |
| 44493.203310185185 | 40.721 |
| 44493.244976851856 | 40.451 |
| 44493.28664351852 | 40.026 |
| 44493.328310185185 | 39.833 |
| 44493.369976851856 | 39.64 |
| 44493.41164351852 | 39.621 |
| 44493.453310185185 | 40.2 |
| 44493.494976851856 | 41.281 |
| 44493.53664351852 | 42.053 |
| 44493.578310185185 | 42.69 |
| 44493.619976851856 | 43.945 |
| 44493.66164351852 | 45.142 |
| 44493.703310185185 | 45.875 |
| 44493.744976851856 | 46.223 |
| 44493.78664351852 | 46.184 |
| 44493.828310185185 | 45.875 |
| 44493.869976851856 | 45.258 |
| 44493.91164351852 | 44.466 |
| 44493.953310185185 | 43.636 |
| 44493.994976851856 | 42.902 |
| 44494.03664351852 | 42.227 |
| 44494.078310185185 | 41.512 |
| 44494.119976851856 | 40.798 |
| 44494.16164351852 | 40.296 |
| 44494.203310185185 | 39.794 |
| 44494.244976851856 | 39.428 |
| 44494.28664351852 | 39.138 |
| 44494.328310185185 | 38.926 |
| 44494.369976851856 | 38.848 |
| 44494.41164351852 | 39.312 |
| 44494.453310185185 | 40.354 |
| 44494.494976851856 | 41.532 |
| 44494.53664351852 | 42.787 |
| 44494.578310185185 | 44.041 |
| 44494.619976851856 | 45.47 |
| 44494.66164351852 | 46.686 |
| 44494.703310185185 | 47.439 |
| 44494.744976851856 | 47.671 |
| 44494.78664351852 | 47.748 |
| 44494.828310185185 | 47.574 |
| 44494.869976851856 | 47.092 |
| 44494.91164351852 | 46.628 |
| 44494.953310185185 | 45.875 |
| 44494.994976851856 | 45.065 |
| 44495.03664351852 | 44.157 |
| 44495.078310185185 | 43.231 |
| 44495.119976851856 | 42.343 |
| 44495.16164351852 | 41.493 |
| 44495.203310185185 | 40.798 |
| 44495.244976851856 | 40.219 |
| 44495.28664351852 | 39.794 |
| 44495.328310185185 | 39.601 |
| 44495.369976851856 | 39.505 |
| 44495.41164351852 | 39.91 |
| 44495.453310185185 | 40.2 |
| 44495.494976851856 | 40.161 |
| 44495.53664351852 | 40.354 |
| 44495.578310185185 | 41.493 |
| 44495.619976851856 | 42.188 |
| 44495.66164351852 | 41.937 |
| 44495.703310185185 | 41.609 |
| 44495.744976851856 | 41.319 |
| 44495.78664351852 | 41.107 |
| 44495.828310185185 | 40.528 |
| 44495.869976851856 | 39.756 |
| 44495.91164351852 | 39.119 |
| 44495.953310185185 | 38.752 |
| 44495.994976851856 | 38.346 |
| 44496.03664351852 | 37.999 |
| 44496.078310185185 | 37.767 |
| 44496.119976851856 | 37.458 |
| 44496.16164351852 | 37.169 |
| 44496.203310185185 | 36.841 |
| 44496.244976851856 | 36.628 |
| 44496.28664351852 | 36.455 |
| 44496.328310185185 | 36.223 |
| 44496.369976851856 | 36.281 |
| 44496.41164351852 | 36.339 |
| 44496.453310185185 | 36.744 |